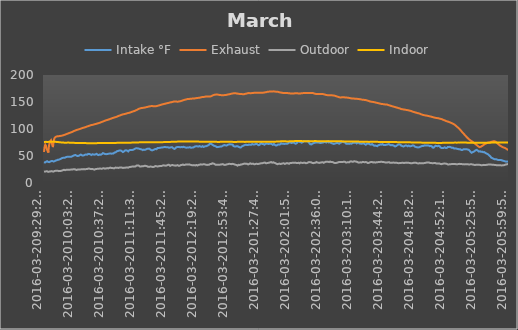
| Category | Intake °F | Exhaust | Outdoor | Indoor |
|---|---|---|---|---|
| 2016-03-209:29:22 AM | 38.638 | 57.538 | 20.862 | 75.988 |
| 2016-03-209:29:26 AM | 38.525 | 58.775 | 20.975 | 75.988 |
| 2016-03-209:29:30 AM | 38.525 | 60.012 | 20.975 | 75.988 |
| 2016-03-209:29:34 AM | 38.412 | 61.138 | 21.088 | 75.988 |
| 2016-03-209:29:38 AM | 38.412 | 62.15 | 21.088 | 76.1 |
| 2016-03-209:29:42 AM | 38.3 | 63.05 | 21.088 | 75.988 |
| 2016-03-209:29:46 AM | 38.188 | 63.95 | 21.2 | 76.1 |
| 2016-03-209:29:50 AM | 38.075 | 64.738 | 21.2 | 76.1 |
| 2016-03-209:29:54 AM | 37.962 | 65.412 | 21.2 | 76.1 |
| 2016-03-209:29:59 AM | 37.85 | 66.088 | 21.312 | 76.1 |
| 2016-03-209:30:03 AM | 37.738 | 66.762 | 21.312 | 76.1 |
| 2016-03-209:30:07 AM | 37.625 | 67.325 | 21.312 | 76.1 |
| 2016-03-209:30:11 AM | 37.625 | 67.888 | 21.425 | 76.1 |
| 2016-03-209:30:15 AM | 37.738 | 68.338 | 21.425 | 76.1 |
| 2016-03-209:30:19 AM | 37.85 | 68.9 | 21.425 | 76.1 |
| 2016-03-209:30:23 AM | 37.962 | 69.35 | 21.425 | 76.1 |
| 2016-03-209:30:27 AM | 37.85 | 69.688 | 21.312 | 76.1 |
| 2016-03-209:30:31 AM | 37.962 | 70.025 | 21.312 | 76.1 |
| 2016-03-209:30:35 AM | 37.962 | 70.362 | 21.312 | 76.212 |
| 2016-03-209:30:40 AM | 38.075 | 70.7 | 21.312 | 76.1 |
| 2016-03-209:30:44 AM | 38.188 | 71.038 | 21.312 | 76.212 |
| 2016-03-209:30:48 AM | 38.188 | 71.375 | 21.312 | 76.212 |
| 2016-03-209:30:52 AM | 38.3 | 71.6 | 21.312 | 76.212 |
| 2016-03-209:30:56 AM | 38.412 | 71.825 | 21.312 | 76.212 |
| 2016-03-209:31:00 AM | 38.525 | 71.938 | 21.425 | 76.212 |
| 2016-03-209:31:04 AM | 38.638 | 71.712 | 21.312 | 76.212 |
| 2016-03-209:31:08 AM | 38.75 | 71.375 | 21.425 | 76.212 |
| 2016-03-209:31:12 AM | 38.862 | 70.925 | 21.425 | 76.212 |
| 2016-03-209:31:16 AM | 38.862 | 70.588 | 21.425 | 76.1 |
| 2016-03-209:31:20 AM | 39.088 | 70.138 | 21.425 | 76.212 |
| 2016-03-209:31:25 AM | 39.2 | 69.8 | 21.425 | 76.212 |
| 2016-03-209:31:29 AM | 39.312 | 69.238 | 21.425 | 76.212 |
| 2016-03-209:31:33 AM | 39.312 | 68.788 | 21.425 | 76.212 |
| 2016-03-209:31:37 AM | 39.538 | 68.338 | 21.538 | 76.1 |
| 2016-03-209:31:41 AM | 39.538 | 67.775 | 21.538 | 76.212 |
| 2016-03-209:31:45 AM | 39.65 | 67.438 | 21.538 | 76.212 |
| 2016-03-209:31:49 AM | 39.762 | 66.988 | 21.538 | 76.1 |
| 2016-03-209:31:53 AM | 39.875 | 66.538 | 21.65 | 76.1 |
| 2016-03-209:31:57 AM | 39.988 | 66.2 | 21.65 | 76.212 |
| 2016-03-209:32:01 AM | 40.1 | 65.862 | 21.65 | 76.212 |
| 2016-03-209:32:06 AM | 40.212 | 65.412 | 21.762 | 76.1 |
| 2016-03-209:32:10 AM | 40.325 | 64.963 | 21.65 | 76.1 |
| 2016-03-209:32:14 AM | 40.325 | 64.512 | 21.65 | 76.1 |
| 2016-03-209:32:18 AM | 40.438 | 64.175 | 21.65 | 76.1 |
| 2016-03-209:32:22 AM | 40.55 | 63.725 | 21.65 | 76.1 |
| 2016-03-209:32:26 AM | 40.55 | 63.388 | 21.538 | 76.1 |
| 2016-03-209:32:30 AM | 40.662 | 63.05 | 21.538 | 76.1 |
| 2016-03-209:32:34 AM | 40.662 | 62.6 | 21.538 | 76.1 |
| 2016-03-209:32:38 AM | 40.55 | 62.262 | 21.425 | 76.1 |
| 2016-03-209:32:42 AM | 40.55 | 61.812 | 21.538 | 76.1 |
| 2016-03-209:32:46 AM | 40.438 | 61.475 | 21.538 | 76.1 |
| 2016-03-209:32:51 AM | 40.325 | 61.25 | 21.538 | 75.988 |
| 2016-03-209:32:55 AM | 40.325 | 60.912 | 21.538 | 76.1 |
| 2016-03-209:32:59 AM | 40.325 | 60.575 | 21.538 | 76.1 |
| 2016-03-209:33:03 AM | 40.325 | 60.35 | 21.425 | 76.1 |
| 2016-03-209:33:07 AM | 40.212 | 60.012 | 21.425 | 76.1 |
| 2016-03-209:33:11 AM | 40.1 | 59.9 | 21.2 | 76.1 |
| 2016-03-209:33:15 AM | 39.988 | 59.562 | 20.975 | 76.212 |
| 2016-03-209:33:19 AM | 39.875 | 59.338 | 20.862 | 76.1 |
| 2016-03-209:33:23 AM | 39.762 | 59.112 | 20.75 | 76.1 |
| 2016-03-209:33:27 AM | 39.762 | 58.775 | 20.638 | 76.212 |
| 2016-03-209:33:32 AM | 39.65 | 58.55 | 20.525 | 76.1 |
| 2016-03-209:33:36 AM | 39.65 | 58.325 | 20.525 | 76.1 |
| 2016-03-209:33:40 AM | 39.538 | 57.988 | 20.525 | 76.1 |
| 2016-03-209:33:44 AM | 39.312 | 57.65 | 20.525 | 76.1 |
| 2016-03-209:33:48 AM | 39.088 | 57.312 | 20.525 | 76.1 |
| 2016-03-209:33:52 AM | 38.975 | 57.088 | 20.638 | 76.212 |
| 2016-03-209:33:56 AM | 38.862 | 56.75 | 20.638 | 76.1 |
| 2016-03-209:34:00 AM | 38.862 | 56.412 | 20.638 | 76.1 |
| 2016-03-209:34:04 AM | 38.75 | 56.188 | 20.75 | 76.1 |
| 2016-03-209:34:08 AM | 38.75 | 56.412 | 20.75 | 76.212 |
| 2016-03-209:34:12 AM | 38.638 | 57.762 | 20.75 | 76.212 |
| 2016-03-209:34:16 AM | 38.638 | 59.225 | 20.862 | 76.212 |
| 2016-03-209:34:20 AM | 38.638 | 60.688 | 20.862 | 76.212 |
| 2016-03-209:34:24 AM | 38.638 | 62.038 | 20.862 | 76.212 |
| 2016-03-209:34:28 AM | 38.75 | 63.275 | 20.862 | 76.212 |
| 2016-03-209:34:32 AM | 38.638 | 64.4 | 20.975 | 76.212 |
| 2016-03-209:34:36 AM | 38.75 | 65.525 | 21.088 | 76.212 |
| 2016-03-209:34:40 AM | 38.638 | 66.538 | 21.088 | 76.325 |
| 2016-03-209:34:44 AM | 38.638 | 67.438 | 21.2 | 76.212 |
| 2016-03-209:34:48 AM | 38.638 | 68.338 | 21.2 | 76.325 |
| 2016-03-209:34:53 AM | 38.638 | 69.125 | 21.2 | 76.325 |
| 2016-03-209:34:57 AM | 38.638 | 69.912 | 21.2 | 76.212 |
| 2016-03-209:35:01 AM | 38.638 | 70.588 | 21.088 | 76.212 |
| 2016-03-209:35:05 AM | 38.638 | 71.262 | 21.088 | 76.212 |
| 2016-03-209:35:09 AM | 38.638 | 71.825 | 21.088 | 76.325 |
| 2016-03-209:35:13 AM | 38.638 | 72.5 | 21.088 | 76.325 |
| 2016-03-209:35:17 AM | 38.75 | 72.95 | 21.088 | 76.325 |
| 2016-03-209:35:21 AM | 38.75 | 73.4 | 21.2 | 76.325 |
| 2016-03-209:35:25 AM | 38.975 | 73.962 | 21.312 | 76.325 |
| 2016-03-209:35:29 AM | 39.088 | 74.3 | 21.312 | 76.325 |
| 2016-03-209:35:33 AM | 39.088 | 74.638 | 21.425 | 76.325 |
| 2016-03-209:35:37 AM | 39.088 | 75.088 | 21.425 | 76.325 |
| 2016-03-209:35:41 AM | 39.2 | 75.425 | 21.312 | 76.325 |
| 2016-03-209:35:45 AM | 39.312 | 75.762 | 21.2 | 76.325 |
| 2016-03-209:35:49 AM | 39.425 | 76.1 | 21.312 | 76.325 |
| 2016-03-209:35:53 AM | 39.538 | 76.325 | 21.312 | 76.325 |
| 2016-03-209:35:57 AM | 39.65 | 76.662 | 21.312 | 76.325 |
| 2016-03-209:36:01 AM | 39.65 | 76.888 | 21.312 | 76.325 |
| 2016-03-209:36:05 AM | 39.762 | 77.112 | 21.425 | 76.438 |
| 2016-03-209:36:09 AM | 39.762 | 77.338 | 21.312 | 76.438 |
| 2016-03-209:36:13 AM | 39.875 | 77.562 | 21.425 | 76.325 |
| 2016-03-209:36:17 AM | 39.875 | 77.788 | 21.425 | 76.438 |
| 2016-03-209:36:21 AM | 39.988 | 77.9 | 21.312 | 76.438 |
| 2016-03-209:36:25 AM | 39.988 | 78.125 | 21.312 | 76.438 |
| 2016-03-209:36:29 AM | 40.1 | 78.238 | 21.425 | 76.438 |
| 2016-03-209:36:33 AM | 40.212 | 78.462 | 21.425 | 76.438 |
| 2016-03-209:36:37 AM | 40.325 | 78.575 | 21.538 | 76.438 |
| 2016-03-209:36:41 AM | 40.438 | 78.688 | 21.538 | 76.438 |
| 2016-03-209:36:49 AM | 40.55 | 78.8 | 21.538 | 76.438 |
| 2016-03-209:36:53 AM | 40.662 | 78.912 | 21.538 | 76.438 |
| 2016-03-209:37:01 AM | 40.662 | 79.138 | 21.65 | 76.55 |
| 2016-03-209:37:05 AM | 40.662 | 79.138 | 21.65 | 76.438 |
| 2016-03-209:37:09 AM | 40.55 | 79.25 | 21.762 | 76.55 |
| 2016-03-209:37:13 AM | 40.55 | 79.138 | 21.762 | 76.55 |
| 2016-03-209:37:17 AM | 40.438 | 78.8 | 21.875 | 76.55 |
| 2016-03-209:37:21 AM | 40.438 | 78.35 | 21.875 | 76.55 |
| 2016-03-209:37:25 AM | 40.438 | 77.9 | 21.875 | 76.55 |
| 2016-03-209:37:29 AM | 40.55 | 77.45 | 21.875 | 76.55 |
| 2016-03-209:37:33 AM | 40.55 | 77 | 21.988 | 76.55 |
| 2016-03-209:37:37 AM | 40.662 | 76.438 | 21.875 | 76.55 |
| 2016-03-209:37:41 AM | 40.55 | 76.1 | 21.875 | 76.55 |
| 2016-03-209:37:45 AM | 40.55 | 75.65 | 21.875 | 76.55 |
| 2016-03-209:37:49 AM | 40.662 | 75.2 | 21.875 | 76.55 |
| 2016-03-209:37:53 AM | 40.775 | 74.75 | 21.988 | 76.55 |
| 2016-03-209:37:57 AM | 40.888 | 74.188 | 21.988 | 76.55 |
| 2016-03-209:38:01 AM | 40.888 | 73.738 | 21.988 | 76.55 |
| 2016-03-209:38:05 AM | 40.888 | 73.175 | 21.988 | 76.55 |
| 2016-03-209:38:09 AM | 40.775 | 72.838 | 22.1 | 76.55 |
| 2016-03-209:38:13 AM | 40.888 | 72.388 | 22.1 | 76.55 |
| 2016-03-209:38:17 AM | 40.888 | 71.938 | 22.1 | 76.55 |
| 2016-03-209:38:21 AM | 40.888 | 71.488 | 21.988 | 76.55 |
| 2016-03-209:38:25 AM | 41 | 71.038 | 21.875 | 76.55 |
| 2016-03-209:38:29 AM | 41 | 70.7 | 21.875 | 76.55 |
| 2016-03-209:38:33 AM | 40.888 | 70.25 | 21.762 | 76.55 |
| 2016-03-209:38:37 AM | 40.775 | 69.8 | 21.65 | 76.55 |
| 2016-03-209:38:41 AM | 40.662 | 69.462 | 21.538 | 76.55 |
| 2016-03-209:38:45 AM | 40.55 | 69.012 | 21.312 | 76.55 |
| 2016-03-209:38:49 AM | 40.438 | 68.562 | 21.088 | 76.55 |
| 2016-03-209:38:53 AM | 40.212 | 68.225 | 20.975 | 76.662 |
| 2016-03-209:38:57 AM | 40.212 | 67.775 | 20.975 | 76.55 |
| 2016-03-209:39:01 AM | 40.1 | 67.438 | 21.088 | 76.662 |
| 2016-03-209:39:05 AM | 39.988 | 67.1 | 20.975 | 76.55 |
| 2016-03-209:39:09 AM | 39.988 | 66.875 | 20.975 | 76.662 |
| 2016-03-209:39:14 AM | 39.988 | 66.538 | 20.862 | 76.662 |
| 2016-03-209:39:18 AM | 39.988 | 66.425 | 20.975 | 76.662 |
| 2016-03-209:39:22 AM | 39.988 | 67.55 | 20.975 | 76.55 |
| 2016-03-209:39:26 AM | 39.988 | 68.788 | 20.975 | 76.55 |
| 2016-03-209:39:30 AM | 39.988 | 70.025 | 21.088 | 76.662 |
| 2016-03-209:39:34 AM | 39.875 | 71.15 | 21.088 | 76.662 |
| 2016-03-209:39:38 AM | 39.875 | 72.275 | 21.088 | 76.662 |
| 2016-03-209:39:42 AM | 39.875 | 73.288 | 21.088 | 76.662 |
| 2016-03-209:39:46 AM | 39.875 | 74.188 | 21.088 | 76.662 |
| 2016-03-209:39:50 AM | 39.875 | 75.088 | 21.088 | 76.662 |
| 2016-03-209:39:54 AM | 39.762 | 75.875 | 21.2 | 76.662 |
| 2016-03-209:39:58 AM | 39.65 | 76.55 | 21.312 | 76.662 |
| 2016-03-209:40:02 AM | 39.762 | 77.225 | 21.312 | 76.662 |
| 2016-03-209:40:06 AM | 39.762 | 77.9 | 21.425 | 76.662 |
| 2016-03-209:40:10 AM | 39.762 | 78.462 | 21.425 | 76.55 |
| 2016-03-209:40:14 AM | 39.65 | 79.138 | 21.538 | 76.55 |
| 2016-03-209:40:18 AM | 39.762 | 79.588 | 21.538 | 76.55 |
| 2016-03-209:40:22 AM | 39.762 | 80.15 | 21.538 | 76.55 |
| 2016-03-209:40:26 AM | 39.762 | 80.488 | 21.65 | 76.55 |
| 2016-03-209:40:30 AM | 39.875 | 80.938 | 21.762 | 76.55 |
| 2016-03-209:40:34 AM | 39.988 | 81.388 | 21.875 | 76.55 |
| 2016-03-209:40:41 AM | 40.1 | 81.725 | 21.875 | 76.55 |
| 2016-03-209:40:45 AM | 40.1 | 82.062 | 21.988 | 76.55 |
| 2016-03-209:40:50 AM | 40.1 | 82.288 | 21.988 | 76.55 |
| 2016-03-209:40:54 AM | 40.1 | 82.512 | 22.1 | 76.55 |
| 2016-03-209:40:58 AM | 40.1 | 82.85 | 22.212 | 76.438 |
| 2016-03-209:41:02 AM | 40.212 | 83.075 | 22.212 | 76.438 |
| 2016-03-209:41:06 AM | 40.325 | 83.3 | 22.212 | 76.438 |
| 2016-03-209:41:10 AM | 40.438 | 83.525 | 22.325 | 76.438 |
| 2016-03-209:41:14 AM | 40.55 | 83.638 | 22.325 | 76.438 |
| 2016-03-209:41:18 AM | 40.662 | 83.862 | 22.325 | 76.438 |
| 2016-03-209:41:22 AM | 40.775 | 83.975 | 22.438 | 76.438 |
| 2016-03-209:41:26 AM | 40.775 | 84.2 | 22.438 | 76.438 |
| 2016-03-209:41:30 AM | 40.888 | 84.312 | 22.55 | 76.438 |
| 2016-03-209:41:34 AM | 41 | 84.425 | 22.55 | 76.325 |
| 2016-03-209:41:38 AM | 41.112 | 84.538 | 22.55 | 76.325 |
| 2016-03-209:41:42 AM | 41.225 | 84.762 | 22.55 | 76.325 |
| 2016-03-209:41:46 AM | 41.338 | 84.875 | 22.55 | 76.325 |
| 2016-03-209:41:50 AM | 41.45 | 84.988 | 22.55 | 76.325 |
| 2016-03-209:41:54 AM | 41.562 | 84.988 | 22.55 | 76.325 |
| 2016-03-209:41:58 AM | 41.562 | 85.1 | 22.55 | 76.325 |
| 2016-03-209:42:02 AM | 41.45 | 85.212 | 22.55 | 76.212 |
| 2016-03-209:42:06 AM | 41.562 | 85.325 | 22.55 | 76.212 |
| 2016-03-209:42:10 AM | 41.562 | 85.325 | 22.55 | 76.212 |
| 2016-03-209:42:14 AM | 41.562 | 85.438 | 22.55 | 76.212 |
| 2016-03-209:42:18 AM | 41.562 | 85.55 | 22.55 | 76.212 |
| 2016-03-209:42:22 AM | 41.675 | 85.55 | 22.55 | 76.212 |
| 2016-03-209:42:26 AM | 41.675 | 85.662 | 22.55 | 76.212 |
| 2016-03-209:42:30 AM | 41.788 | 85.662 | 22.55 | 76.212 |
| 2016-03-209:42:34 AM | 41.9 | 85.775 | 22.662 | 76.212 |
| 2016-03-209:42:38 AM | 41.9 | 85.775 | 22.662 | 76.212 |
| 2016-03-209:42:42 AM | 42.012 | 85.888 | 22.662 | 76.212 |
| 2016-03-209:42:46 AM | 41.9 | 85.888 | 22.662 | 76.212 |
| 2016-03-209:42:50 AM | 42.012 | 86 | 22.55 | 76.212 |
| 2016-03-209:42:54 AM | 42.012 | 86 | 22.55 | 76.212 |
| 2016-03-209:42:58 AM | 42.012 | 86.112 | 22.55 | 76.212 |
| 2016-03-209:43:02 AM | 42.012 | 86.112 | 22.55 | 76.212 |
| 2016-03-209:43:07 AM | 42.012 | 86.112 | 22.55 | 76.212 |
| 2016-03-209:43:11 AM | 42.125 | 86.112 | 22.55 | 76.1 |
| 2016-03-209:43:15 AM | 42.125 | 86.225 | 22.55 | 76.212 |
| 2016-03-209:43:19 AM | 42.012 | 86.225 | 22.55 | 76.1 |
| 2016-03-209:43:23 AM | 42.125 | 86.225 | 22.55 | 76.1 |
| 2016-03-209:43:27 AM | 42.238 | 86.225 | 22.55 | 76.1 |
| 2016-03-209:43:31 AM | 42.35 | 86.338 | 22.438 | 76.1 |
| 2016-03-209:43:35 AM | 42.35 | 86.338 | 22.438 | 76.1 |
| 2016-03-209:43:39 AM | 42.462 | 86.338 | 22.438 | 75.988 |
| 2016-03-209:43:43 AM | 42.462 | 86.338 | 22.438 | 75.988 |
| 2016-03-209:43:47 AM | 42.462 | 86.45 | 22.55 | 75.988 |
| 2016-03-209:43:51 AM | 42.462 | 86.45 | 22.55 | 75.988 |
| 2016-03-209:43:55 AM | 42.462 | 86.45 | 22.55 | 75.875 |
| 2016-03-209:43:59 AM | 42.575 | 86.45 | 22.55 | 75.988 |
| 2016-03-209:44:03 AM | 42.575 | 86.45 | 22.662 | 75.988 |
| 2016-03-209:44:07 AM | 42.688 | 86.45 | 22.662 | 75.988 |
| 2016-03-209:44:11 AM | 42.688 | 86.45 | 22.662 | 75.988 |
| 2016-03-209:44:15 AM | 42.912 | 86.562 | 22.662 | 75.988 |
| 2016-03-209:44:19 AM | 43.025 | 86.562 | 22.775 | 75.875 |
| 2016-03-209:44:23 AM | 43.025 | 86.562 | 22.662 | 75.875 |
| 2016-03-209:44:27 AM | 43.025 | 86.562 | 22.775 | 75.875 |
| 2016-03-209:44:31 AM | 43.025 | 86.562 | 22.662 | 75.875 |
| 2016-03-209:44:38 AM | 43.025 | 86.562 | 22.662 | 75.875 |
| 2016-03-209:44:42 AM | 43.025 | 86.562 | 22.662 | 75.875 |
| 2016-03-209:44:47 AM | 43.025 | 86.675 | 22.55 | 75.875 |
| 2016-03-209:44:51 AM | 43.025 | 86.675 | 22.438 | 75.875 |
| 2016-03-209:44:55 AM | 43.138 | 86.675 | 22.55 | 75.875 |
| 2016-03-209:44:59 AM | 43.138 | 86.675 | 22.55 | 75.762 |
| 2016-03-209:45:03 AM | 43.25 | 86.675 | 22.662 | 75.875 |
| 2016-03-209:45:07 AM | 43.25 | 86.675 | 22.55 | 75.762 |
| 2016-03-209:45:11 AM | 43.25 | 86.675 | 22.55 | 75.762 |
| 2016-03-209:45:15 AM | 43.25 | 86.675 | 22.438 | 75.762 |
| 2016-03-209:45:19 AM | 43.25 | 86.675 | 22.438 | 75.762 |
| 2016-03-209:45:23 AM | 43.25 | 86.675 | 22.212 | 75.762 |
| 2016-03-209:45:27 AM | 43.25 | 86.675 | 22.1 | 75.762 |
| 2016-03-209:45:31 AM | 43.25 | 86.675 | 22.1 | 75.762 |
| 2016-03-209:45:35 AM | 43.25 | 86.788 | 21.988 | 75.762 |
| 2016-03-209:45:39 AM | 43.25 | 86.788 | 21.988 | 75.65 |
| 2016-03-209:45:43 AM | 43.25 | 86.788 | 21.988 | 75.65 |
| 2016-03-209:45:47 AM | 43.362 | 86.788 | 21.875 | 75.65 |
| 2016-03-209:45:51 AM | 43.25 | 86.788 | 21.875 | 75.65 |
| 2016-03-209:45:55 AM | 43.25 | 86.788 | 21.988 | 75.65 |
| 2016-03-209:45:59 AM | 43.25 | 86.788 | 21.875 | 75.65 |
| 2016-03-209:46:03 AM | 43.362 | 86.788 | 21.988 | 75.538 |
| 2016-03-209:46:07 AM | 43.362 | 86.788 | 21.988 | 75.65 |
| 2016-03-209:46:11 AM | 43.362 | 86.9 | 21.988 | 75.538 |
| 2016-03-209:46:15 AM | 43.362 | 86.9 | 21.988 | 75.538 |
| 2016-03-209:46:19 AM | 43.362 | 86.9 | 21.988 | 75.538 |
| 2016-03-209:46:23 AM | 43.588 | 86.9 | 21.988 | 75.538 |
| 2016-03-209:46:27 AM | 43.588 | 86.9 | 21.988 | 75.538 |
| 2016-03-209:46:31 AM | 43.7 | 86.9 | 21.988 | 75.538 |
| 2016-03-209:46:35 AM | 43.7 | 87.012 | 22.1 | 75.538 |
| 2016-03-209:46:39 AM | 43.812 | 87.012 | 22.1 | 75.538 |
| 2016-03-209:46:43 AM | 43.812 | 87.012 | 22.212 | 75.538 |
| 2016-03-209:46:47 AM | 43.925 | 87.012 | 22.212 | 75.425 |
| 2016-03-209:46:51 AM | 44.038 | 87.012 | 22.325 | 75.425 |
| 2016-03-209:46:55 AM | 44.15 | 87.012 | 22.438 | 75.425 |
| 2016-03-209:46:59 AM | 44.15 | 87.012 | 22.55 | 75.425 |
| 2016-03-209:47:03 AM | 44.15 | 87.125 | 22.662 | 75.425 |
| 2016-03-209:47:07 AM | 44.15 | 87.125 | 22.775 | 75.312 |
| 2016-03-209:47:11 AM | 44.15 | 87.125 | 22.662 | 75.425 |
| 2016-03-209:47:15 AM | 44.262 | 87.125 | 22.662 | 75.312 |
| 2016-03-209:47:20 AM | 44.262 | 87.125 | 22.662 | 75.312 |
| 2016-03-209:47:24 AM | 44.375 | 87.125 | 22.662 | 75.312 |
| 2016-03-209:47:28 AM | 44.488 | 87.238 | 22.662 | 75.312 |
| 2016-03-209:47:32 AM | 44.488 | 87.238 | 22.662 | 75.312 |
| 2016-03-209:47:36 AM | 44.6 | 87.238 | 22.55 | 75.312 |
| 2016-03-209:47:39 AM | 44.712 | 87.238 | 22.662 | 75.2 |
| 2016-03-209:47:43 AM | 44.712 | 87.238 | 22.55 | 75.312 |
| 2016-03-209:47:48 AM | 44.712 | 87.238 | 22.438 | 75.312 |
| 2016-03-209:47:52 AM | 44.712 | 87.35 | 22.438 | 75.2 |
| 2016-03-209:47:56 AM | 44.825 | 87.35 | 22.438 | 75.2 |
| 2016-03-209:48:00 AM | 44.938 | 87.35 | 22.55 | 75.2 |
| 2016-03-209:48:04 AM | 45.05 | 87.35 | 22.55 | 75.2 |
| 2016-03-209:48:08 AM | 45.275 | 87.462 | 22.55 | 75.2 |
| 2016-03-209:48:12 AM | 45.388 | 87.462 | 22.55 | 75.2 |
| 2016-03-209:48:16 AM | 45.388 | 87.462 | 22.662 | 75.2 |
| 2016-03-209:48:20 AM | 45.388 | 87.462 | 22.662 | 75.2 |
| 2016-03-209:48:24 AM | 45.612 | 87.462 | 22.662 | 75.2 |
| 2016-03-209:48:28 AM | 45.725 | 87.575 | 22.775 | 75.088 |
| 2016-03-209:48:32 AM | 45.725 | 87.575 | 22.888 | 75.088 |
| 2016-03-209:48:36 AM | 45.725 | 87.575 | 22.888 | 75.088 |
| 2016-03-209:48:40 AM | 45.838 | 87.575 | 22.775 | 75.088 |
| 2016-03-209:48:44 AM | 45.95 | 87.575 | 22.888 | 75.088 |
| 2016-03-209:48:48 AM | 45.95 | 87.688 | 22.888 | 75.088 |
| 2016-03-209:48:51 AM | 46.062 | 87.688 | 22.775 | 75.088 |
| 2016-03-209:48:55 AM | 46.062 | 87.688 | 22.775 | 75.088 |
| 2016-03-209:48:59 AM | 46.175 | 87.688 | 22.775 | 75.088 |
| 2016-03-209:49:04 AM | 46.062 | 87.8 | 22.888 | 75.088 |
| 2016-03-209:49:08 AM | 46.062 | 87.8 | 22.888 | 75.088 |
| 2016-03-209:49:12 AM | 46.175 | 87.8 | 22.888 | 74.975 |
| 2016-03-209:49:16 AM | 46.175 | 87.8 | 23 | 74.975 |
| 2016-03-209:49:20 AM | 46.175 | 87.8 | 23.112 | 74.975 |
| 2016-03-209:49:27 AM | 46.175 | 87.8 | 23.225 | 74.975 |
| 2016-03-209:49:31 AM | 46.062 | 87.912 | 23.225 | 74.975 |
| 2016-03-209:49:36 AM | 46.062 | 87.912 | 23.338 | 74.862 |
| 2016-03-209:49:40 AM | 46.062 | 87.912 | 23.338 | 74.975 |
| 2016-03-209:49:44 AM | 46.175 | 87.912 | 23.45 | 74.862 |
| 2016-03-209:49:48 AM | 46.288 | 88.025 | 23.45 | 74.862 |
| 2016-03-209:49:52 AM | 46.4 | 88.025 | 23.338 | 74.862 |
| 2016-03-209:49:56 AM | 46.512 | 88.025 | 23.45 | 74.862 |
| 2016-03-209:50:00 AM | 46.625 | 88.138 | 23.45 | 74.862 |
| 2016-03-209:50:04 AM | 46.738 | 88.138 | 23.45 | 74.862 |
| 2016-03-209:50:08 AM | 46.738 | 88.138 | 23.562 | 74.862 |
| 2016-03-209:50:12 AM | 46.625 | 88.138 | 23.562 | 74.862 |
| 2016-03-209:50:16 AM | 46.625 | 88.25 | 23.675 | 74.862 |
| 2016-03-209:50:20 AM | 46.625 | 88.25 | 23.675 | 74.862 |
| 2016-03-209:50:24 AM | 46.625 | 88.25 | 23.788 | 74.862 |
| 2016-03-209:50:28 AM | 46.625 | 88.25 | 23.788 | 74.862 |
| 2016-03-209:50:32 AM | 46.625 | 88.362 | 23.9 | 74.862 |
| 2016-03-209:50:36 AM | 46.625 | 88.362 | 24.012 | 74.862 |
| 2016-03-209:50:40 AM | 46.512 | 88.475 | 24.012 | 74.862 |
| 2016-03-209:50:44 AM | 46.512 | 88.475 | 24.125 | 74.75 |
| 2016-03-209:50:48 AM | 46.512 | 88.475 | 24.125 | 74.75 |
| 2016-03-209:50:52 AM | 46.512 | 88.588 | 24.238 | 74.75 |
| 2016-03-209:50:56 AM | 46.512 | 88.588 | 24.35 | 74.75 |
| 2016-03-209:51:00 AM | 46.625 | 88.588 | 24.35 | 74.75 |
| 2016-03-209:51:04 AM | 46.738 | 88.7 | 24.35 | 74.75 |
| 2016-03-209:51:08 AM | 46.85 | 88.7 | 24.35 | 74.75 |
| 2016-03-209:51:12 AM | 46.85 | 88.812 | 24.238 | 74.75 |
| 2016-03-209:51:16 AM | 46.962 | 88.812 | 24.35 | 74.75 |
| 2016-03-209:51:20 AM | 47.075 | 88.925 | 24.35 | 74.75 |
| 2016-03-209:51:24 AM | 46.962 | 88.925 | 24.462 | 74.75 |
| 2016-03-209:51:27 AM | 47.075 | 88.925 | 24.575 | 74.75 |
| 2016-03-209:51:31 AM | 46.962 | 88.925 | 24.575 | 74.75 |
| 2016-03-209:51:36 AM | 46.962 | 89.038 | 24.462 | 74.75 |
| 2016-03-209:51:40 AM | 46.738 | 89.038 | 24.462 | 74.75 |
| 2016-03-209:51:44 AM | 46.738 | 89.038 | 24.35 | 74.75 |
| 2016-03-209:51:48 AM | 46.738 | 89.038 | 24.35 | 74.75 |
| 2016-03-209:51:52 AM | 46.738 | 89.15 | 24.238 | 74.75 |
| 2016-03-209:51:56 AM | 46.512 | 89.15 | 24.238 | 74.75 |
| 2016-03-209:52:00 AM | 46.625 | 89.262 | 24.238 | 74.75 |
| 2016-03-209:52:04 AM | 46.85 | 89.262 | 24.125 | 74.75 |
| 2016-03-209:52:08 AM | 46.85 | 89.262 | 24.125 | 74.75 |
| 2016-03-209:52:12 AM | 46.962 | 89.375 | 24.012 | 74.75 |
| 2016-03-209:52:16 AM | 46.962 | 89.375 | 24.012 | 74.75 |
| 2016-03-209:52:20 AM | 46.962 | 89.488 | 23.9 | 74.75 |
| 2016-03-209:52:24 AM | 46.962 | 89.488 | 23.9 | 74.75 |
| 2016-03-209:52:28 AM | 46.962 | 89.488 | 23.788 | 74.75 |
| 2016-03-209:52:32 AM | 46.962 | 89.488 | 23.675 | 74.75 |
| 2016-03-209:52:36 AM | 47.075 | 89.488 | 23.788 | 74.75 |
| 2016-03-209:52:40 AM | 47.075 | 89.6 | 23.788 | 74.75 |
| 2016-03-209:52:44 AM | 47.188 | 89.6 | 23.788 | 74.75 |
| 2016-03-209:52:48 AM | 47.3 | 89.712 | 23.788 | 74.75 |
| 2016-03-209:52:52 AM | 47.412 | 89.712 | 23.9 | 74.75 |
| 2016-03-209:52:56 AM | 47.525 | 89.825 | 23.9 | 74.75 |
| 2016-03-209:53:00 AM | 47.638 | 89.825 | 23.9 | 74.75 |
| 2016-03-209:53:04 AM | 47.638 | 89.825 | 24.012 | 74.75 |
| 2016-03-209:53:08 AM | 47.75 | 89.938 | 24.012 | 74.75 |
| 2016-03-209:53:12 AM | 47.75 | 89.938 | 24.012 | 74.75 |
| 2016-03-209:53:16 AM | 47.862 | 90.05 | 24.125 | 74.75 |
| 2016-03-209:53:20 AM | 47.862 | 90.05 | 24.125 | 74.75 |
| 2016-03-209:53:24 AM | 47.975 | 90.05 | 24.125 | 74.75 |
| 2016-03-209:53:28 AM | 47.975 | 90.163 | 24.125 | 74.75 |
| 2016-03-209:53:32 AM | 47.975 | 90.163 | 24.125 | 74.75 |
| 2016-03-209:53:36 AM | 47.975 | 90.163 | 24.238 | 74.75 |
| 2016-03-209:53:40 AM | 47.975 | 90.163 | 24.35 | 74.75 |
| 2016-03-209:53:44 AM | 47.975 | 90.275 | 24.35 | 74.75 |
| 2016-03-209:53:48 AM | 48.088 | 90.275 | 24.35 | 74.75 |
| 2016-03-209:53:52 AM | 48.088 | 90.275 | 24.35 | 74.75 |
| 2016-03-209:53:57 AM | 48.2 | 90.388 | 24.462 | 74.75 |
| 2016-03-209:54:01 AM | 48.2 | 90.5 | 24.462 | 74.75 |
| 2016-03-209:54:05 AM | 48.2 | 90.5 | 24.462 | 74.75 |
| 2016-03-209:54:09 AM | 48.2 | 90.612 | 24.462 | 74.75 |
| 2016-03-209:54:13 AM | 48.2 | 90.612 | 24.575 | 74.75 |
| 2016-03-209:54:17 AM | 48.2 | 90.612 | 24.575 | 74.75 |
| 2016-03-209:54:21 AM | 48.2 | 90.612 | 24.575 | 74.75 |
| 2016-03-209:54:25 AM | 48.2 | 90.725 | 24.575 | 74.75 |
| 2016-03-209:54:29 AM | 48.2 | 90.838 | 24.575 | 74.75 |
| 2016-03-209:54:33 AM | 48.312 | 90.838 | 24.462 | 74.75 |
| 2016-03-209:54:37 AM | 48.312 | 90.838 | 24.575 | 74.75 |
| 2016-03-209:54:41 AM | 48.312 | 90.95 | 24.462 | 74.75 |
| 2016-03-209:54:45 AM | 48.538 | 90.95 | 24.35 | 74.75 |
| 2016-03-209:54:49 AM | 48.538 | 90.95 | 24.35 | 74.75 |
| 2016-03-209:54:53 AM | 48.538 | 91.062 | 24.35 | 74.75 |
| 2016-03-209:54:57 AM | 48.65 | 91.062 | 24.35 | 74.862 |
| 2016-03-209:55:00 AM | 48.65 | 91.175 | 24.35 | 74.862 |
| 2016-03-209:55:04 AM | 48.538 | 91.175 | 24.462 | 74.75 |
| 2016-03-209:55:08 AM | 48.65 | 91.288 | 24.462 | 74.75 |
| 2016-03-209:55:13 AM | 48.65 | 91.288 | 24.462 | 74.75 |
| 2016-03-209:55:17 AM | 48.762 | 91.288 | 24.462 | 74.75 |
| 2016-03-209:55:21 AM | 48.762 | 91.4 | 24.575 | 74.75 |
| 2016-03-209:55:25 AM | 48.875 | 91.4 | 24.575 | 74.862 |
| 2016-03-209:55:29 AM | 48.875 | 91.512 | 24.462 | 74.75 |
| 2016-03-209:55:33 AM | 48.875 | 91.512 | 24.462 | 74.862 |
| 2016-03-209:55:37 AM | 48.875 | 91.625 | 24.462 | 74.862 |
| 2016-03-209:55:41 AM | 48.875 | 91.625 | 24.462 | 74.75 |
| 2016-03-209:55:45 AM | 48.762 | 91.625 | 24.462 | 74.862 |
| 2016-03-209:55:49 AM | 48.762 | 91.738 | 24.462 | 74.862 |
| 2016-03-209:55:53 AM | 48.762 | 91.85 | 24.462 | 74.862 |
| 2016-03-209:55:57 AM | 48.65 | 91.85 | 24.35 | 74.862 |
| 2016-03-209:56:01 AM | 48.538 | 91.85 | 24.238 | 74.862 |
| 2016-03-209:56:05 AM | 48.425 | 91.962 | 24.125 | 74.862 |
| 2016-03-209:56:09 AM | 48.538 | 91.962 | 24.012 | 74.75 |
| 2016-03-209:56:13 AM | 48.538 | 92.075 | 23.9 | 74.862 |
| 2016-03-209:56:17 AM | 48.538 | 92.075 | 23.9 | 74.75 |
| 2016-03-209:56:21 AM | 48.538 | 92.075 | 23.9 | 74.75 |
| 2016-03-209:56:25 AM | 48.65 | 92.188 | 23.9 | 74.75 |
| 2016-03-209:56:29 AM | 48.65 | 92.188 | 23.9 | 74.75 |
| 2016-03-209:56:33 AM | 48.538 | 92.3 | 23.9 | 74.75 |
| 2016-03-209:56:37 AM | 48.538 | 92.3 | 24.012 | 74.75 |
| 2016-03-209:56:41 AM | 48.538 | 92.3 | 24.125 | 74.75 |
| 2016-03-209:56:45 AM | 48.65 | 92.413 | 24.238 | 74.75 |
| 2016-03-209:56:49 AM | 48.65 | 92.413 | 24.238 | 74.75 |
| 2016-03-209:56:53 AM | 48.65 | 92.413 | 24.35 | 74.75 |
| 2016-03-209:56:57 AM | 48.65 | 92.525 | 24.35 | 74.75 |
| 2016-03-209:57:01 AM | 48.65 | 92.525 | 24.35 | 74.75 |
| 2016-03-209:57:05 AM | 48.762 | 92.525 | 24.35 | 74.75 |
| 2016-03-209:57:09 AM | 48.762 | 92.638 | 24.35 | 74.75 |
| 2016-03-209:57:13 AM | 48.875 | 92.638 | 24.462 | 74.75 |
| 2016-03-209:57:17 AM | 48.875 | 92.75 | 24.462 | 74.638 |
| 2016-03-209:57:21 AM | 48.875 | 92.75 | 24.575 | 74.638 |
| 2016-03-209:57:25 AM | 48.875 | 92.75 | 24.575 | 74.638 |
| 2016-03-209:57:30 AM | 48.762 | 92.75 | 24.462 | 74.638 |
| 2016-03-209:57:34 AM | 48.762 | 92.75 | 24.575 | 74.638 |
| 2016-03-209:57:38 AM | 48.65 | 92.862 | 24.575 | 74.638 |
| 2016-03-209:57:42 AM | 48.65 | 92.862 | 24.575 | 74.638 |
| 2016-03-209:57:46 AM | 48.65 | 92.862 | 24.688 | 74.638 |
| 2016-03-209:57:50 AM | 48.65 | 92.975 | 24.575 | 74.638 |
| 2016-03-209:57:54 AM | 48.538 | 92.975 | 24.688 | 74.638 |
| 2016-03-209:57:58 AM | 48.425 | 93.088 | 24.8 | 74.638 |
| 2016-03-209:58:02 AM | 48.538 | 93.088 | 24.8 | 74.638 |
| 2016-03-209:58:06 AM | 48.538 | 93.088 | 24.8 | 74.638 |
| 2016-03-209:58:10 AM | 48.538 | 93.2 | 24.8 | 74.525 |
| 2016-03-209:58:14 AM | 48.538 | 93.2 | 24.688 | 74.525 |
| 2016-03-209:58:18 AM | 48.65 | 93.312 | 24.8 | 74.525 |
| 2016-03-209:58:22 AM | 48.65 | 93.312 | 24.8 | 74.525 |
| 2016-03-209:58:26 AM | 48.762 | 93.312 | 24.8 | 74.525 |
| 2016-03-209:58:30 AM | 48.762 | 93.425 | 24.912 | 74.638 |
| 2016-03-209:58:34 AM | 48.65 | 93.425 | 24.912 | 74.525 |
| 2016-03-209:58:38 AM | 48.65 | 93.538 | 25.025 | 74.525 |
| 2016-03-209:58:42 AM | 48.762 | 93.538 | 25.025 | 74.525 |
| 2016-03-209:58:46 AM | 48.762 | 93.538 | 25.138 | 74.525 |
| 2016-03-209:58:50 AM | 48.988 | 93.65 | 25.138 | 74.525 |
| 2016-03-209:58:54 AM | 48.875 | 93.65 | 25.138 | 74.525 |
| 2016-03-209:58:58 AM | 48.875 | 93.762 | 25.138 | 74.525 |
| 2016-03-209:59:06 AM | 48.762 | 93.762 | 25.25 | 74.525 |
| 2016-03-209:59:10 AM | 48.65 | 93.762 | 25.138 | 74.525 |
| 2016-03-209:59:14 AM | 48.65 | 93.875 | 25.138 | 74.525 |
| 2016-03-209:59:18 AM | 48.65 | 93.875 | 25.138 | 74.412 |
| 2016-03-209:59:22 AM | 48.65 | 93.988 | 25.138 | 74.525 |
| 2016-03-209:59:26 AM | 48.65 | 93.988 | 25.138 | 74.525 |
| 2016-03-209:59:30 AM | 48.65 | 93.988 | 25.138 | 74.525 |
| 2016-03-209:59:34 AM | 48.762 | 94.1 | 25.025 | 74.525 |
| 2016-03-209:59:38 AM | 48.762 | 94.1 | 24.912 | 74.525 |
| 2016-03-209:59:43 AM | 48.762 | 94.212 | 25.025 | 74.525 |
| 2016-03-209:59:47 AM | 48.762 | 94.212 | 24.912 | 74.525 |
| 2016-03-209:59:51 AM | 48.762 | 94.325 | 24.912 | 74.525 |
| 2016-03-209:59:55 AM | 48.875 | 94.325 | 24.912 | 74.525 |
| 2016-03-209:59:59 AM | 48.875 | 94.325 | 25.025 | 74.525 |
| 2016-03-2010:00:03 AM | 49.1 | 94.438 | 24.912 | 74.525 |
| 2016-03-2010:00:07 AM | 49.212 | 94.438 | 24.912 | 74.525 |
| 2016-03-2010:00:11 AM | 49.325 | 94.55 | 24.912 | 74.525 |
| 2016-03-2010:00:15 AM | 49.325 | 94.55 | 24.912 | 74.525 |
| 2016-03-2010:00:19 AM | 49.438 | 94.663 | 24.8 | 74.525 |
| 2016-03-2010:00:23 AM | 49.55 | 94.663 | 24.912 | 74.525 |
| 2016-03-2010:00:27 AM | 49.775 | 94.663 | 24.8 | 74.412 |
| 2016-03-2010:00:31 AM | 49.775 | 94.775 | 24.912 | 74.412 |
| 2016-03-2010:00:35 AM | 49.662 | 94.775 | 24.912 | 74.412 |
| 2016-03-2010:00:39 AM | 49.55 | 94.775 | 24.912 | 74.412 |
| 2016-03-2010:00:43 AM | 49.55 | 94.888 | 25.025 | 74.412 |
| 2016-03-2010:00:47 AM | 49.438 | 94.888 | 25.025 | 74.412 |
| 2016-03-2010:00:51 AM | 49.55 | 95 | 25.025 | 74.412 |
| 2016-03-2010:00:55 AM | 49.55 | 95.112 | 25.138 | 74.412 |
| 2016-03-2010:00:59 AM | 49.55 | 95.112 | 25.138 | 74.412 |
| 2016-03-2010:01:03 AM | 49.662 | 95.112 | 25.25 | 74.412 |
| 2016-03-2010:01:07 AM | 49.775 | 95.225 | 25.25 | 74.412 |
| 2016-03-2010:01:11 AM | 49.775 | 95.225 | 25.25 | 74.412 |
| 2016-03-2010:01:15 AM | 49.888 | 95.338 | 25.362 | 74.412 |
| 2016-03-2010:01:19 AM | 49.888 | 95.338 | 25.362 | 74.412 |
| 2016-03-2010:01:24 AM | 50 | 95.45 | 25.475 | 74.412 |
| 2016-03-2010:01:28 AM | 50.225 | 95.45 | 25.475 | 74.412 |
| 2016-03-2010:01:32 AM | 50.225 | 95.562 | 25.588 | 74.412 |
| 2016-03-2010:01:36 AM | 50.338 | 95.562 | 25.588 | 74.412 |
| 2016-03-2010:01:40 AM | 50.45 | 95.675 | 25.588 | 74.412 |
| 2016-03-2010:01:44 AM | 50.562 | 95.675 | 25.588 | 74.412 |
| 2016-03-2010:01:48 AM | 50.562 | 95.788 | 25.588 | 74.412 |
| 2016-03-2010:01:52 AM | 50.562 | 95.788 | 25.588 | 74.412 |
| 2016-03-2010:01:56 AM | 50.675 | 95.9 | 25.7 | 74.412 |
| 2016-03-2010:02:00 AM | 50.675 | 95.9 | 25.7 | 74.412 |
| 2016-03-2010:02:04 AM | 50.675 | 96.012 | 25.7 | 74.412 |
| 2016-03-2010:02:08 AM | 50.562 | 96.012 | 25.812 | 74.412 |
| 2016-03-2010:02:12 AM | 50.788 | 96.125 | 25.812 | 74.412 |
| 2016-03-2010:02:16 AM | 50.788 | 96.125 | 25.812 | 74.412 |
| 2016-03-2010:02:20 AM | 51.012 | 96.238 | 25.7 | 74.412 |
| 2016-03-2010:02:25 AM | 51.125 | 96.238 | 25.588 | 74.412 |
| 2016-03-2010:02:29 AM | 51.238 | 96.35 | 25.475 | 74.3 |
| 2016-03-2010:02:33 AM | 51.462 | 96.35 | 25.475 | 74.412 |
| 2016-03-2010:02:37 AM | 51.575 | 96.462 | 25.475 | 74.3 |
| 2016-03-2010:02:41 AM | 51.688 | 96.462 | 25.475 | 74.3 |
| 2016-03-2010:02:45 AM | 51.688 | 96.575 | 25.475 | 74.3 |
| 2016-03-2010:02:49 AM | 51.575 | 96.575 | 25.475 | 74.3 |
| 2016-03-2010:02:53 AM | 51.575 | 96.575 | 25.475 | 74.3 |
| 2016-03-2010:02:57 AM | 51.462 | 96.688 | 25.362 | 74.3 |
| 2016-03-2010:03:01 AM | 51.462 | 96.688 | 25.362 | 74.3 |
| 2016-03-2010:03:05 AM | 51.575 | 96.8 | 25.362 | 74.3 |
| 2016-03-2010:03:09 AM | 51.688 | 96.8 | 25.362 | 74.3 |
| 2016-03-2010:03:13 AM | 51.688 | 96.913 | 25.362 | 74.3 |
| 2016-03-2010:03:17 AM | 51.575 | 97.025 | 25.362 | 74.3 |
| 2016-03-2010:03:21 AM | 51.575 | 97.025 | 25.475 | 74.3 |
| 2016-03-2010:03:25 AM | 51.688 | 97.025 | 25.362 | 74.3 |
| 2016-03-2010:03:28 AM | 51.575 | 97.138 | 25.25 | 74.3 |
| 2016-03-2010:03:32 AM | 51.575 | 97.138 | 25.025 | 74.3 |
| 2016-03-2010:03:36 AM | 51.575 | 97.138 | 25.025 | 74.3 |
| 2016-03-2010:03:41 AM | 51.688 | 97.25 | 24.912 | 74.3 |
| 2016-03-2010:03:49 AM | 51.688 | 97.25 | 24.912 | 74.3 |
| 2016-03-2010:03:53 AM | 51.688 | 97.362 | 25.025 | 74.3 |
| 2016-03-2010:03:57 AM | 51.688 | 97.362 | 25.025 | 74.3 |
| 2016-03-2010:04:01 AM | 51.575 | 97.475 | 25.025 | 74.3 |
| 2016-03-2010:04:05 AM | 51.688 | 97.475 | 24.912 | 74.3 |
| 2016-03-2010:04:09 AM | 51.8 | 97.588 | 24.8 | 74.3 |
| 2016-03-2010:04:13 AM | 51.688 | 97.588 | 24.688 | 74.3 |
| 2016-03-2010:04:17 AM | 51.575 | 97.588 | 24.688 | 74.3 |
| 2016-03-2010:04:21 AM | 51.462 | 97.7 | 24.575 | 74.3 |
| 2016-03-2010:04:25 AM | 51.125 | 97.7 | 24.462 | 74.3 |
| 2016-03-2010:04:29 AM | 51.012 | 97.812 | 24.462 | 74.188 |
| 2016-03-2010:04:33 AM | 50.788 | 97.812 | 24.462 | 74.188 |
| 2016-03-2010:04:37 AM | 50.675 | 97.812 | 24.35 | 74.188 |
| 2016-03-2010:04:41 AM | 50.675 | 97.925 | 24.35 | 74.188 |
| 2016-03-2010:04:45 AM | 50.562 | 97.925 | 24.238 | 74.188 |
| 2016-03-2010:04:49 AM | 50.45 | 98.038 | 24.125 | 74.188 |
| 2016-03-2010:04:54 AM | 50.338 | 98.038 | 24.125 | 74.188 |
| 2016-03-2010:04:58 AM | 50.45 | 98.038 | 24.125 | 74.188 |
| 2016-03-2010:05:02 AM | 50.45 | 98.15 | 24.125 | 74.188 |
| 2016-03-2010:05:06 AM | 50.45 | 98.15 | 24.012 | 74.188 |
| 2016-03-2010:05:10 AM | 50.45 | 98.15 | 24.012 | 74.188 |
| 2016-03-2010:05:14 AM | 50.562 | 98.262 | 24.125 | 74.188 |
| 2016-03-2010:05:18 AM | 50.562 | 98.262 | 24.125 | 74.188 |
| 2016-03-2010:05:22 AM | 50.562 | 98.262 | 24.125 | 74.188 |
| 2016-03-2010:05:26 AM | 50.338 | 98.375 | 24.012 | 74.188 |
| 2016-03-2010:05:30 AM | 50.225 | 98.375 | 24.012 | 74.188 |
| 2016-03-2010:05:34 AM | 50.112 | 98.375 | 24.012 | 74.188 |
| 2016-03-2010:05:38 AM | 49.888 | 98.375 | 24.125 | 74.188 |
| 2016-03-2010:05:42 AM | 49.775 | 98.488 | 24.125 | 74.188 |
| 2016-03-2010:05:46 AM | 49.775 | 98.488 | 24.238 | 74.188 |
| 2016-03-2010:05:50 AM | 49.775 | 98.488 | 24.238 | 74.188 |
| 2016-03-2010:05:54 AM | 49.662 | 98.6 | 24.35 | 74.188 |
| 2016-03-2010:05:58 AM | 49.775 | 98.6 | 24.462 | 74.188 |
| 2016-03-2010:06:02 AM | 49.775 | 98.6 | 24.575 | 74.188 |
| 2016-03-2010:06:06 AM | 49.775 | 98.6 | 24.575 | 74.188 |
| 2016-03-2010:06:10 AM | 49.775 | 98.6 | 24.688 | 74.188 |
| 2016-03-2010:06:14 AM | 49.888 | 98.712 | 24.8 | 74.188 |
| 2016-03-2010:06:18 AM | 49.888 | 98.712 | 24.912 | 74.188 |
| 2016-03-2010:06:22 AM | 50 | 98.712 | 24.912 | 74.188 |
| 2016-03-2010:06:26 AM | 50.112 | 98.825 | 24.912 | 74.075 |
| 2016-03-2010:06:31 AM | 50.225 | 98.825 | 24.8 | 74.188 |
| 2016-03-2010:06:35 AM | 50.225 | 98.825 | 24.688 | 74.075 |
| 2016-03-2010:06:39 AM | 50.338 | 98.825 | 24.575 | 74.075 |
| 2016-03-2010:06:43 AM | 50.338 | 98.938 | 24.688 | 74.075 |
| 2016-03-2010:06:47 AM | 50.338 | 98.938 | 24.688 | 74.075 |
| 2016-03-2010:06:51 AM | 50.338 | 98.938 | 24.688 | 74.075 |
| 2016-03-2010:06:55 AM | 50.338 | 99.05 | 24.688 | 74.075 |
| 2016-03-2010:06:59 AM | 50.45 | 99.05 | 24.8 | 74.075 |
| 2016-03-2010:07:03 AM | 50.45 | 99.05 | 24.8 | 74.075 |
| 2016-03-2010:07:07 AM | 50.45 | 99.05 | 24.912 | 74.075 |
| 2016-03-2010:07:11 AM | 50.338 | 99.163 | 24.912 | 74.075 |
| 2016-03-2010:07:15 AM | 50.45 | 99.163 | 24.912 | 74.075 |
| 2016-03-2010:07:19 AM | 50.562 | 99.163 | 24.912 | 74.075 |
| 2016-03-2010:07:23 AM | 50.562 | 99.275 | 24.912 | 74.075 |
| 2016-03-2010:07:27 AM | 50.45 | 99.275 | 24.912 | 73.962 |
| 2016-03-2010:07:31 AM | 50.338 | 99.388 | 24.912 | 74.075 |
| 2016-03-2010:07:35 AM | 50.45 | 99.388 | 24.912 | 74.075 |
| 2016-03-2010:07:39 AM | 50.562 | 99.388 | 24.912 | 74.075 |
| 2016-03-2010:07:44 AM | 50.675 | 99.388 | 24.8 | 74.075 |
| 2016-03-2010:07:48 AM | 50.788 | 99.5 | 24.8 | 74.075 |
| 2016-03-2010:07:52 AM | 50.9 | 99.5 | 24.912 | 74.075 |
| 2016-03-2010:07:56 AM | 51.012 | 99.612 | 25.025 | 73.962 |
| 2016-03-2010:08:00 AM | 51.125 | 99.612 | 25.025 | 74.075 |
| 2016-03-2010:08:04 AM | 51.238 | 99.612 | 25.025 | 73.962 |
| 2016-03-2010:08:08 AM | 51.238 | 99.725 | 25.138 | 74.075 |
| 2016-03-2010:08:12 AM | 51.238 | 99.725 | 25.025 | 73.962 |
| 2016-03-2010:08:16 AM | 51.35 | 99.725 | 25.025 | 73.962 |
| 2016-03-2010:08:20 AM | 51.35 | 99.838 | 24.912 | 73.962 |
| 2016-03-2010:08:24 AM | 51.462 | 99.838 | 24.8 | 73.962 |
| 2016-03-2010:08:28 AM | 51.35 | 99.95 | 24.912 | 73.962 |
| 2016-03-2010:08:32 AM | 51.35 | 99.95 | 24.8 | 73.962 |
| 2016-03-2010:08:36 AM | 51.462 | 99.95 | 24.912 | 73.962 |
| 2016-03-2010:08:40 AM | 51.575 | 99.95 | 25.025 | 73.962 |
| 2016-03-2010:08:44 AM | 51.688 | 100.062 | 25.025 | 73.962 |
| 2016-03-2010:08:52 AM | 51.688 | 100.062 | 25.138 | 73.962 |
| 2016-03-2010:08:56 AM | 51.8 | 100.175 | 25.138 | 73.962 |
| 2016-03-2010:09:00 AM | 51.912 | 100.175 | 25.138 | 73.962 |
| 2016-03-2010:09:04 AM | 52.025 | 100.175 | 24.912 | 73.962 |
| 2016-03-2010:09:08 AM | 52.025 | 100.288 | 25.025 | 73.962 |
| 2016-03-2010:09:12 AM | 51.912 | 100.288 | 24.912 | 73.962 |
| 2016-03-2010:09:16 AM | 52.025 | 100.288 | 24.912 | 73.962 |
| 2016-03-2010:09:20 AM | 52.138 | 100.288 | 25.025 | 73.962 |
| 2016-03-2010:09:24 AM | 52.25 | 100.4 | 25.138 | 73.962 |
| 2016-03-2010:09:28 AM | 52.362 | 100.4 | 25.138 | 73.962 |
| 2016-03-2010:09:32 AM | 52.475 | 100.4 | 25.025 | 73.962 |
| 2016-03-2010:09:36 AM | 52.588 | 100.512 | 25.138 | 73.962 |
| 2016-03-2010:09:40 AM | 52.588 | 100.512 | 25.138 | 73.962 |
| 2016-03-2010:09:44 AM | 52.588 | 100.625 | 25.25 | 73.962 |
| 2016-03-2010:09:48 AM | 52.588 | 100.625 | 25.25 | 73.962 |
| 2016-03-2010:09:52 AM | 52.588 | 100.738 | 25.25 | 73.962 |
| 2016-03-2010:09:56 AM | 52.362 | 100.738 | 25.25 | 73.962 |
| 2016-03-2010:10:00 AM | 52.25 | 100.738 | 25.138 | 73.962 |
| 2016-03-2010:10:04 AM | 52.138 | 100.738 | 25.25 | 73.962 |
| 2016-03-2010:10:09 AM | 52.025 | 100.85 | 25.25 | 73.962 |
| 2016-03-2010:10:13 AM | 52.025 | 100.85 | 25.362 | 73.962 |
| 2016-03-2010:10:17 AM | 51.912 | 100.962 | 25.475 | 73.962 |
| 2016-03-2010:10:21 AM | 52.025 | 100.962 | 25.475 | 73.962 |
| 2016-03-2010:10:25 AM | 52.138 | 101.075 | 25.475 | 73.962 |
| 2016-03-2010:10:29 AM | 52.138 | 101.075 | 25.588 | 73.962 |
| 2016-03-2010:10:33 AM | 52.138 | 101.075 | 25.588 | 73.85 |
| 2016-03-2010:10:37 AM | 51.912 | 101.188 | 25.7 | 73.962 |
| 2016-03-2010:10:41 AM | 51.462 | 101.188 | 25.7 | 73.962 |
| 2016-03-2010:10:45 AM | 51.462 | 101.188 | 25.588 | 73.85 |
| 2016-03-2010:10:49 AM | 51.462 | 101.3 | 25.588 | 73.85 |
| 2016-03-2010:10:53 AM | 51.35 | 101.3 | 25.588 | 73.85 |
| 2016-03-2010:10:57 AM | 51.35 | 101.413 | 25.588 | 73.85 |
| 2016-03-2010:11:01 AM | 51.35 | 101.413 | 25.588 | 73.85 |
| 2016-03-2010:11:05 AM | 51.238 | 101.413 | 25.588 | 73.85 |
| 2016-03-2010:11:09 AM | 51.125 | 101.525 | 25.588 | 73.962 |
| 2016-03-2010:11:13 AM | 51.012 | 101.525 | 25.588 | 73.85 |
| 2016-03-2010:11:18 AM | 51.125 | 101.525 | 25.588 | 73.85 |
| 2016-03-2010:11:22 AM | 51.125 | 101.638 | 25.588 | 73.85 |
| 2016-03-2010:11:26 AM | 51.238 | 101.638 | 25.475 | 73.85 |
| 2016-03-2010:11:30 AM | 51.238 | 101.75 | 25.475 | 73.85 |
| 2016-03-2010:11:34 AM | 51.238 | 101.75 | 25.475 | 73.85 |
| 2016-03-2010:11:38 AM | 51.35 | 101.75 | 25.475 | 73.85 |
| 2016-03-2010:11:46 AM | 51.238 | 101.862 | 25.475 | 73.85 |
| 2016-03-2010:11:50 AM | 51.012 | 101.862 | 25.475 | 73.85 |
| 2016-03-2010:11:54 AM | 50.788 | 101.862 | 25.588 | 73.85 |
| 2016-03-2010:11:58 AM | 50.788 | 101.862 | 25.475 | 73.85 |
| 2016-03-2010:12:02 AM | 50.788 | 101.975 | 25.362 | 73.85 |
| 2016-03-2010:12:06 AM | 50.9 | 101.975 | 25.475 | 73.85 |
| 2016-03-2010:12:10 AM | 50.788 | 102.088 | 25.362 | 73.85 |
| 2016-03-2010:12:14 AM | 50.788 | 102.088 | 25.362 | 73.85 |
| 2016-03-2010:12:18 AM | 50.788 | 102.088 | 25.362 | 73.962 |
| 2016-03-2010:12:22 AM | 50.788 | 102.088 | 25.362 | 73.85 |
| 2016-03-2010:12:26 AM | 50.9 | 102.2 | 25.475 | 73.85 |
| 2016-03-2010:12:31 AM | 51.012 | 102.2 | 25.475 | 73.85 |
| 2016-03-2010:12:35 AM | 51.125 | 102.312 | 25.588 | 73.85 |
| 2016-03-2010:12:39 AM | 51.238 | 102.2 | 25.588 | 73.85 |
| 2016-03-2010:12:43 AM | 51.238 | 102.312 | 25.7 | 73.85 |
| 2016-03-2010:12:47 AM | 51.35 | 102.312 | 25.7 | 73.85 |
| 2016-03-2010:12:51 AM | 51.462 | 102.425 | 25.7 | 73.85 |
| 2016-03-2010:12:55 AM | 51.462 | 102.425 | 25.7 | 73.85 |
| 2016-03-2010:12:59 AM | 51.462 | 102.425 | 25.588 | 73.85 |
| 2016-03-2010:13:03 AM | 51.462 | 102.425 | 25.7 | 73.85 |
| 2016-03-2010:13:07 AM | 51.462 | 102.538 | 25.588 | 73.85 |
| 2016-03-2010:13:11 AM | 51.575 | 102.538 | 25.588 | 73.85 |
| 2016-03-2010:13:15 AM | 51.462 | 102.538 | 25.588 | 73.85 |
| 2016-03-2010:13:19 AM | 51.462 | 102.65 | 25.588 | 73.85 |
| 2016-03-2010:13:23 AM | 51.35 | 102.65 | 25.7 | 73.85 |
| 2016-03-2010:13:27 AM | 51.238 | 102.65 | 25.7 | 73.85 |
| 2016-03-2010:13:32 AM | 51.125 | 102.65 | 25.7 | 73.85 |
| 2016-03-2010:13:36 AM | 51.125 | 102.762 | 25.588 | 73.85 |
| 2016-03-2010:13:40 AM | 51.238 | 102.762 | 25.475 | 73.85 |
| 2016-03-2010:13:44 AM | 51.35 | 102.762 | 25.475 | 73.85 |
| 2016-03-2010:13:48 AM | 51.462 | 102.875 | 25.475 | 73.85 |
| 2016-03-2010:13:52 AM | 51.575 | 102.875 | 25.475 | 73.85 |
| 2016-03-2010:13:56 AM | 51.688 | 102.875 | 25.588 | 73.85 |
| 2016-03-2010:14:00 AM | 51.688 | 102.988 | 25.588 | 73.85 |
| 2016-03-2010:14:04 AM | 51.688 | 102.988 | 25.475 | 73.85 |
| 2016-03-2010:14:08 AM | 51.8 | 102.988 | 25.475 | 73.85 |
| 2016-03-2010:14:12 AM | 51.912 | 102.988 | 25.362 | 73.85 |
| 2016-03-2010:14:16 AM | 52.025 | 103.1 | 25.362 | 73.85 |
| 2016-03-2010:14:20 AM | 52.025 | 103.1 | 25.362 | 73.85 |
| 2016-03-2010:14:24 AM | 52.138 | 103.1 | 25.475 | 73.85 |
| 2016-03-2010:14:28 AM | 52.25 | 103.212 | 25.475 | 73.85 |
| 2016-03-2010:14:32 AM | 52.362 | 103.212 | 25.588 | 73.85 |
| 2016-03-2010:14:36 AM | 52.362 | 103.212 | 25.475 | 73.85 |
| 2016-03-2010:14:40 AM | 52.362 | 103.212 | 25.475 | 73.85 |
| 2016-03-2010:14:45 AM | 52.475 | 103.325 | 25.588 | 73.85 |
| 2016-03-2010:14:49 AM | 52.362 | 103.325 | 25.588 | 73.85 |
| 2016-03-2010:14:53 AM | 52.362 | 103.325 | 25.588 | 73.85 |
| 2016-03-2010:14:57 AM | 52.475 | 103.438 | 25.7 | 73.85 |
| 2016-03-2010:15:01 AM | 52.475 | 103.438 | 25.7 | 73.85 |
| 2016-03-2010:15:05 AM | 52.475 | 103.438 | 25.812 | 73.85 |
| 2016-03-2010:15:09 AM | 52.475 | 103.55 | 25.7 | 73.85 |
| 2016-03-2010:15:13 AM | 52.475 | 103.663 | 25.7 | 73.85 |
| 2016-03-2010:15:17 AM | 52.588 | 103.663 | 25.588 | 73.85 |
| 2016-03-2010:15:21 AM | 52.588 | 103.663 | 25.475 | 73.85 |
| 2016-03-2010:15:25 AM | 52.588 | 103.663 | 25.475 | 73.85 |
| 2016-03-2010:15:29 AM | 52.588 | 103.775 | 25.475 | 73.85 |
| 2016-03-2010:15:33 AM | 52.7 | 103.775 | 25.588 | 73.85 |
| 2016-03-2010:15:37 AM | 52.812 | 103.888 | 25.7 | 73.85 |
| 2016-03-2010:15:41 AM | 52.812 | 103.888 | 25.7 | 73.85 |
| 2016-03-2010:15:45 AM | 52.812 | 103.888 | 25.812 | 73.85 |
| 2016-03-2010:15:49 AM | 52.925 | 104 | 25.812 | 73.85 |
| 2016-03-2010:15:53 AM | 52.925 | 104 | 25.925 | 73.85 |
| 2016-03-2010:15:57 AM | 53.038 | 104 | 25.812 | 73.85 |
| 2016-03-2010:16:02 AM | 53.15 | 104.112 | 25.812 | 73.85 |
| 2016-03-2010:16:06 AM | 53.15 | 104.112 | 25.812 | 73.85 |
| 2016-03-2010:16:10 AM | 53.15 | 104.112 | 25.925 | 73.85 |
| 2016-03-2010:16:14 AM | 53.038 | 104.225 | 26.038 | 73.85 |
| 2016-03-2010:16:18 AM | 52.812 | 104.338 | 26.038 | 73.85 |
| 2016-03-2010:16:22 AM | 52.7 | 104.338 | 25.925 | 73.738 |
| 2016-03-2010:16:26 AM | 52.475 | 104.338 | 25.925 | 73.85 |
| 2016-03-2010:16:30 AM | 52.25 | 104.45 | 25.925 | 73.738 |
| 2016-03-2010:16:34 AM | 52.25 | 104.45 | 25.925 | 73.738 |
| 2016-03-2010:16:38 AM | 52.25 | 104.562 | 25.812 | 73.738 |
| 2016-03-2010:16:42 AM | 52.362 | 104.562 | 25.925 | 73.738 |
| 2016-03-2010:16:46 AM | 52.362 | 104.562 | 25.925 | 73.738 |
| 2016-03-2010:16:50 AM | 52.362 | 104.562 | 25.925 | 73.738 |
| 2016-03-2010:16:54 AM | 52.362 | 104.675 | 25.812 | 73.738 |
| 2016-03-2010:16:58 AM | 52.475 | 104.675 | 25.812 | 73.738 |
| 2016-03-2010:17:02 AM | 52.588 | 104.675 | 25.812 | 73.738 |
| 2016-03-2010:17:06 AM | 52.588 | 104.788 | 25.925 | 73.738 |
| 2016-03-2010:17:11 AM | 52.7 | 104.9 | 26.038 | 73.738 |
| 2016-03-2010:17:15 AM | 52.7 | 104.9 | 26.038 | 73.738 |
| 2016-03-2010:17:19 AM | 52.812 | 104.9 | 26.038 | 73.738 |
| 2016-03-2010:17:23 AM | 52.925 | 105.012 | 26.15 | 73.738 |
| 2016-03-2010:17:27 AM | 53.038 | 105.012 | 26.15 | 73.738 |
| 2016-03-2010:17:31 AM | 53.15 | 105.012 | 26.15 | 73.738 |
| 2016-03-2010:17:35 AM | 53.262 | 105.125 | 26.262 | 73.738 |
| 2016-03-2010:17:39 AM | 53.375 | 105.125 | 26.375 | 73.738 |
| 2016-03-2010:17:43 AM | 53.488 | 105.238 | 26.488 | 73.738 |
| 2016-03-2010:17:47 AM | 53.6 | 105.125 | 26.488 | 73.738 |
| 2016-03-2010:17:51 AM | 53.712 | 105.238 | 26.488 | 73.738 |
| 2016-03-2010:17:55 AM | 53.825 | 105.238 | 26.6 | 73.738 |
| 2016-03-2010:17:59 AM | 53.938 | 105.35 | 26.6 | 73.738 |
| 2016-03-2010:18:03 AM | 53.938 | 105.35 | 26.712 | 73.738 |
| 2016-03-2010:18:07 AM | 54.05 | 105.35 | 26.712 | 73.738 |
| 2016-03-2010:18:11 AM | 54.162 | 105.35 | 26.712 | 73.738 |
| 2016-03-2010:18:15 AM | 54.275 | 105.462 | 26.712 | 73.738 |
| 2016-03-2010:18:19 AM | 54.388 | 105.462 | 26.712 | 73.738 |
| 2016-03-2010:18:24 AM | 54.5 | 105.575 | 26.712 | 73.738 |
| 2016-03-2010:18:28 AM | 54.5 | 105.575 | 26.825 | 73.738 |
| 2016-03-2010:18:32 AM | 54.5 | 105.688 | 26.825 | 73.738 |
| 2016-03-2010:18:36 AM | 54.388 | 105.688 | 26.938 | 73.738 |
| 2016-03-2010:18:40 AM | 54.388 | 105.688 | 27.05 | 73.738 |
| 2016-03-2010:18:44 AM | 54.388 | 105.8 | 27.05 | 73.738 |
| 2016-03-2010:18:48 AM | 54.275 | 105.8 | 27.05 | 73.738 |
| 2016-03-2010:18:52 AM | 54.275 | 105.8 | 26.938 | 73.738 |
| 2016-03-2010:18:56 AM | 54.05 | 105.913 | 26.938 | 73.738 |
| 2016-03-2010:19:00 AM | 53.938 | 105.913 | 26.825 | 73.738 |
| 2016-03-2010:19:04 AM | 53.938 | 106.025 | 26.712 | 73.738 |
| 2016-03-2010:19:08 AM | 53.825 | 106.025 | 26.712 | 73.738 |
| 2016-03-2010:19:12 AM | 53.712 | 106.025 | 26.712 | 73.738 |
| 2016-03-2010:19:16 AM | 53.712 | 106.138 | 26.712 | 73.738 |
| 2016-03-2010:19:20 AM | 53.6 | 106.138 | 26.825 | 73.738 |
| 2016-03-2010:19:24 AM | 53.6 | 106.25 | 26.825 | 73.738 |
| 2016-03-2010:19:28 AM | 53.6 | 106.25 | 26.825 | 73.738 |
| 2016-03-2010:19:32 AM | 53.488 | 106.362 | 26.712 | 73.738 |
| 2016-03-2010:19:37 AM | 53.6 | 106.362 | 26.6 | 73.738 |
| 2016-03-2010:19:41 AM | 53.6 | 106.475 | 26.6 | 73.738 |
| 2016-03-2010:19:45 AM | 53.6 | 106.475 | 26.6 | 73.738 |
| 2016-03-2010:19:49 AM | 53.6 | 106.475 | 26.6 | 73.738 |
| 2016-03-2010:19:53 AM | 53.488 | 106.475 | 26.6 | 73.738 |
| 2016-03-2010:19:57 AM | 53.375 | 106.588 | 26.712 | 73.738 |
| 2016-03-2010:20:01 AM | 53.15 | 106.588 | 26.6 | 73.738 |
| 2016-03-2010:20:05 AM | 53.15 | 106.588 | 26.6 | 73.738 |
| 2016-03-2010:20:09 AM | 53.15 | 106.7 | 26.375 | 73.738 |
| 2016-03-2010:20:13 AM | 53.038 | 106.7 | 26.15 | 73.738 |
| 2016-03-2010:20:17 AM | 53.038 | 106.812 | 26.038 | 73.738 |
| 2016-03-2010:20:21 AM | 53.038 | 106.812 | 25.925 | 73.738 |
| 2016-03-2010:20:25 AM | 52.925 | 106.812 | 25.925 | 73.738 |
| 2016-03-2010:20:29 AM | 52.925 | 106.812 | 25.812 | 73.738 |
| 2016-03-2010:20:33 AM | 52.925 | 106.925 | 25.812 | 73.738 |
| 2016-03-2010:20:37 AM | 52.812 | 106.925 | 25.812 | 73.738 |
| 2016-03-2010:20:41 AM | 52.7 | 106.925 | 25.925 | 73.738 |
| 2016-03-2010:20:45 AM | 52.812 | 107.038 | 25.925 | 73.738 |
| 2016-03-2010:20:49 AM | 52.925 | 107.038 | 26.038 | 73.738 |
| 2016-03-2010:20:53 AM | 52.925 | 107.038 | 26.038 | 73.738 |
| 2016-03-2010:20:57 AM | 53.038 | 107.038 | 26.15 | 73.738 |
| 2016-03-2010:21:02 AM | 53.038 | 107.038 | 26.15 | 73.738 |
| 2016-03-2010:21:06 AM | 52.812 | 107.15 | 26.15 | 73.738 |
| 2016-03-2010:21:10 AM | 52.588 | 107.15 | 26.15 | 73.738 |
| 2016-03-2010:21:14 AM | 52.25 | 107.15 | 26.038 | 73.738 |
| 2016-03-2010:21:18 AM | 52.025 | 107.15 | 25.812 | 73.738 |
| 2016-03-2010:21:22 AM | 51.912 | 107.15 | 25.812 | 73.738 |
| 2016-03-2010:21:26 AM | 51.912 | 107.262 | 25.7 | 73.738 |
| 2016-03-2010:21:30 AM | 51.912 | 107.262 | 25.7 | 73.738 |
| 2016-03-2010:21:34 AM | 52.025 | 107.262 | 25.7 | 73.738 |
| 2016-03-2010:21:38 AM | 52.138 | 107.262 | 25.7 | 73.738 |
| 2016-03-2010:21:42 AM | 52.138 | 107.375 | 25.812 | 73.738 |
| 2016-03-2010:21:46 AM | 52.362 | 107.375 | 25.7 | 73.738 |
| 2016-03-2010:21:50 AM | 52.475 | 107.375 | 25.812 | 73.738 |
| 2016-03-2010:21:54 AM | 52.588 | 107.262 | 25.925 | 73.738 |
| 2016-03-2010:21:58 AM | 52.7 | 107.375 | 25.925 | 73.738 |
| 2016-03-2010:22:02 AM | 52.7 | 107.375 | 25.812 | 73.738 |
| 2016-03-2010:22:06 AM | 52.7 | 107.375 | 25.812 | 73.738 |
| 2016-03-2010:22:11 AM | 52.812 | 107.488 | 25.925 | 73.738 |
| 2016-03-2010:22:15 AM | 52.812 | 107.488 | 25.925 | 73.738 |
| 2016-03-2010:22:19 AM | 52.925 | 107.488 | 26.15 | 73.738 |
| 2016-03-2010:22:23 AM | 52.925 | 107.488 | 26.15 | 73.738 |
| 2016-03-2010:22:27 AM | 52.925 | 107.488 | 26.15 | 73.738 |
| 2016-03-2010:22:31 AM | 53.15 | 107.488 | 26.15 | 73.738 |
| 2016-03-2010:22:35 AM | 53.262 | 107.6 | 26.038 | 73.738 |
| 2016-03-2010:22:39 AM | 53.262 | 107.6 | 25.925 | 73.738 |
| 2016-03-2010:22:43 AM | 53.262 | 107.6 | 25.925 | 73.738 |
| 2016-03-2010:22:47 AM | 53.262 | 107.6 | 25.925 | 73.738 |
| 2016-03-2010:22:51 AM | 53.262 | 107.6 | 26.038 | 73.738 |
| 2016-03-2010:22:55 AM | 53.375 | 107.712 | 26.15 | 73.738 |
| 2016-03-2010:22:59 AM | 53.375 | 107.712 | 26.15 | 73.738 |
| 2016-03-2010:23:03 AM | 53.375 | 107.825 | 26.262 | 73.738 |
| 2016-03-2010:23:07 AM | 53.375 | 107.825 | 26.15 | 73.738 |
| 2016-03-2010:23:11 AM | 53.375 | 107.825 | 26.262 | 73.738 |
| 2016-03-2010:23:15 AM | 53.262 | 107.938 | 26.262 | 73.738 |
| 2016-03-2010:23:19 AM | 53.262 | 107.938 | 26.15 | 73.738 |
| 2016-03-2010:23:23 AM | 53.262 | 107.938 | 26.038 | 73.738 |
| 2016-03-2010:23:27 AM | 53.262 | 107.938 | 25.925 | 73.738 |
| 2016-03-2010:23:32 AM | 53.038 | 108.05 | 25.925 | 73.738 |
| 2016-03-2010:23:36 AM | 52.925 | 108.05 | 25.7 | 73.738 |
| 2016-03-2010:23:40 AM | 52.812 | 108.05 | 25.475 | 73.738 |
| 2016-03-2010:23:44 AM | 52.7 | 108.163 | 25.362 | 73.738 |
| 2016-03-2010:23:48 AM | 52.7 | 108.275 | 25.25 | 73.738 |
| 2016-03-2010:23:52 AM | 52.588 | 108.163 | 25.138 | 73.738 |
| 2016-03-2010:23:56 AM | 52.475 | 108.275 | 24.912 | 73.738 |
| 2016-03-2010:24:00 AM | 52.362 | 108.388 | 24.688 | 73.738 |
| 2016-03-2010:24:04 AM | 52.25 | 108.388 | 24.575 | 73.738 |
| 2016-03-2010:24:08 AM | 52.362 | 108.388 | 24.575 | 73.738 |
| 2016-03-2010:24:12 AM | 52.362 | 108.5 | 24.575 | 73.738 |
| 2016-03-2010:24:16 AM | 52.362 | 108.5 | 24.688 | 73.738 |
| 2016-03-2010:24:20 AM | 52.362 | 108.5 | 24.688 | 73.738 |
| 2016-03-2010:24:24 AM | 52.362 | 108.612 | 24.688 | 73.738 |
| 2016-03-2010:24:28 AM | 52.25 | 108.5 | 24.575 | 73.738 |
| 2016-03-2010:24:32 AM | 52.138 | 108.612 | 24.575 | 73.738 |
| 2016-03-2010:24:37 AM | 52.025 | 108.612 | 24.462 | 73.738 |
| 2016-03-2010:24:41 AM | 52.025 | 108.725 | 24.462 | 73.738 |
| 2016-03-2010:24:45 AM | 52.138 | 108.725 | 24.575 | 73.738 |
| 2016-03-2010:24:49 AM | 52.25 | 108.725 | 24.575 | 73.738 |
| 2016-03-2010:24:53 AM | 52.475 | 108.725 | 24.688 | 73.738 |
| 2016-03-2010:24:57 AM | 52.588 | 108.725 | 24.8 | 73.738 |
| 2016-03-2010:25:01 AM | 52.7 | 108.838 | 24.8 | 73.738 |
| 2016-03-2010:25:05 AM | 52.7 | 108.838 | 24.912 | 73.738 |
| 2016-03-2010:25:09 AM | 52.7 | 108.838 | 24.912 | 73.738 |
| 2016-03-2010:25:13 AM | 52.7 | 108.838 | 25.025 | 73.738 |
| 2016-03-2010:25:17 AM | 52.925 | 108.95 | 25.025 | 73.738 |
| 2016-03-2010:25:21 AM | 52.925 | 108.95 | 25.138 | 73.85 |
| 2016-03-2010:25:25 AM | 52.925 | 108.95 | 25.25 | 73.85 |
| 2016-03-2010:25:29 AM | 52.925 | 108.95 | 25.25 | 73.738 |
| 2016-03-2010:25:33 AM | 52.925 | 109.062 | 25.138 | 73.738 |
| 2016-03-2010:25:38 AM | 52.925 | 109.062 | 25.25 | 73.738 |
| 2016-03-2010:25:42 AM | 52.812 | 109.062 | 25.475 | 73.738 |
| 2016-03-2010:25:46 AM | 52.925 | 109.062 | 25.588 | 73.738 |
| 2016-03-2010:25:50 AM | 52.925 | 109.175 | 25.588 | 73.738 |
| 2016-03-2010:25:54 AM | 52.812 | 109.175 | 25.7 | 73.85 |
| 2016-03-2010:25:58 AM | 52.812 | 109.175 | 25.7 | 73.85 |
| 2016-03-2010:26:02 AM | 52.925 | 109.288 | 25.7 | 73.738 |
| 2016-03-2010:26:06 AM | 52.812 | 109.288 | 25.812 | 73.738 |
| 2016-03-2010:26:10 AM | 52.7 | 109.288 | 25.812 | 73.738 |
| 2016-03-2010:26:14 AM | 52.7 | 109.4 | 25.812 | 73.738 |
| 2016-03-2010:26:18 AM | 52.812 | 109.4 | 25.812 | 73.738 |
| 2016-03-2010:26:22 AM | 52.925 | 109.4 | 25.812 | 73.738 |
| 2016-03-2010:26:26 AM | 53.15 | 109.512 | 25.925 | 73.738 |
| 2016-03-2010:26:30 AM | 53.262 | 109.512 | 25.925 | 73.738 |
| 2016-03-2010:26:34 AM | 53.375 | 109.512 | 26.038 | 73.625 |
| 2016-03-2010:26:38 AM | 53.488 | 109.512 | 26.038 | 73.738 |
| 2016-03-2010:26:43 AM | 53.488 | 109.625 | 26.038 | 73.738 |
| 2016-03-2010:26:47 AM | 53.6 | 109.625 | 26.038 | 73.738 |
| 2016-03-2010:26:51 AM | 53.825 | 109.625 | 26.038 | 73.738 |
| 2016-03-2010:26:55 AM | 53.938 | 109.738 | 26.15 | 73.738 |
| 2016-03-2010:26:59 AM | 54.05 | 109.738 | 26.038 | 73.85 |
| 2016-03-2010:27:03 AM | 54.05 | 109.738 | 26.038 | 73.738 |
| 2016-03-2010:27:07 AM | 54.05 | 109.85 | 25.925 | 73.85 |
| 2016-03-2010:27:11 AM | 54.05 | 109.85 | 26.038 | 73.738 |
| 2016-03-2010:27:15 AM | 54.05 | 109.85 | 25.925 | 73.85 |
| 2016-03-2010:27:19 AM | 53.825 | 109.85 | 26.038 | 73.85 |
| 2016-03-2010:27:23 AM | 53.825 | 109.962 | 25.925 | 73.85 |
| 2016-03-2010:27:27 AM | 53.825 | 109.962 | 25.925 | 73.85 |
| 2016-03-2010:27:31 AM | 53.825 | 109.962 | 26.038 | 73.85 |
| 2016-03-2010:27:35 AM | 53.825 | 109.962 | 26.038 | 73.85 |
| 2016-03-2010:27:39 AM | 53.825 | 110.075 | 26.15 | 73.85 |
| 2016-03-2010:27:43 AM | 53.712 | 110.075 | 26.15 | 73.85 |
| 2016-03-2010:27:48 AM | 53.488 | 110.075 | 26.15 | 73.85 |
| 2016-03-2010:27:52 AM | 53.262 | 110.075 | 26.15 | 73.85 |
| 2016-03-2010:27:56 AM | 53.038 | 110.188 | 26.15 | 73.962 |
| 2016-03-2010:28:00 AM | 52.812 | 110.188 | 26.262 | 73.962 |
| 2016-03-2010:28:04 AM | 52.812 | 110.188 | 26.262 | 73.962 |
| 2016-03-2010:28:08 AM | 52.812 | 110.3 | 26.15 | 73.962 |
| 2016-03-2010:28:12 AM | 52.588 | 110.3 | 26.15 | 73.962 |
| 2016-03-2010:28:16 AM | 52.362 | 110.3 | 26.375 | 73.962 |
| 2016-03-2010:28:20 AM | 52.25 | 110.413 | 26.375 | 73.962 |
| 2016-03-2010:28:24 AM | 52.138 | 110.413 | 26.375 | 73.962 |
| 2016-03-2010:28:28 AM | 51.912 | 110.413 | 26.375 | 73.962 |
| 2016-03-2010:28:32 AM | 51.462 | 110.525 | 26.375 | 73.962 |
| 2016-03-2010:28:36 AM | 51.35 | 110.525 | 26.375 | 73.962 |
| 2016-03-2010:28:40 AM | 51.125 | 110.525 | 26.375 | 73.962 |
| 2016-03-2010:28:44 AM | 51.012 | 110.638 | 26.375 | 73.962 |
| 2016-03-2010:28:48 AM | 51.012 | 110.638 | 26.375 | 73.962 |
| 2016-03-2010:28:52 AM | 50.9 | 110.638 | 26.375 | 73.962 |
| 2016-03-2010:28:56 AM | 51.012 | 110.75 | 26.375 | 73.962 |
| 2016-03-2010:29:00 AM | 51.012 | 110.75 | 26.262 | 73.962 |
| 2016-03-2010:29:04 AM | 51.012 | 110.75 | 26.262 | 73.962 |
| 2016-03-2010:29:08 AM | 51.238 | 110.862 | 26.262 | 73.962 |
| 2016-03-2010:29:12 AM | 51.238 | 110.862 | 26.262 | 73.962 |
| 2016-03-2010:29:16 AM | 51.238 | 110.862 | 26.262 | 73.962 |
| 2016-03-2010:29:20 AM | 51.35 | 110.862 | 26.375 | 73.962 |
| 2016-03-2010:29:24 AM | 51.462 | 110.862 | 26.262 | 73.962 |
| 2016-03-2010:29:28 AM | 51.688 | 110.975 | 26.375 | 73.962 |
| 2016-03-2010:29:32 AM | 51.688 | 110.975 | 26.375 | 73.962 |
| 2016-03-2010:29:36 AM | 51.8 | 111.088 | 26.488 | 73.962 |
| 2016-03-2010:29:40 AM | 51.912 | 111.088 | 26.6 | 73.962 |
| 2016-03-2010:29:44 AM | 52.025 | 111.088 | 26.6 | 73.962 |
| 2016-03-2010:29:48 AM | 52.138 | 111.088 | 26.6 | 73.962 |
| 2016-03-2010:29:52 AM | 52.362 | 111.088 | 26.6 | 73.962 |
| 2016-03-2010:29:56 AM | 52.475 | 111.2 | 26.6 | 73.962 |
| 2016-03-2010:30:00 AM | 52.475 | 111.2 | 26.488 | 73.962 |
| 2016-03-2010:30:05 AM | 52.475 | 111.2 | 26.6 | 73.962 |
| 2016-03-2010:30:09 AM | 52.475 | 111.312 | 26.6 | 74.075 |
| 2016-03-2010:30:13 AM | 52.588 | 111.312 | 26.6 | 73.962 |
| 2016-03-2010:30:17 AM | 52.7 | 111.425 | 26.6 | 73.962 |
| 2016-03-2010:30:21 AM | 52.7 | 111.425 | 26.712 | 74.075 |
| 2016-03-2010:30:25 AM | 52.812 | 111.425 | 26.712 | 73.962 |
| 2016-03-2010:30:29 AM | 52.7 | 111.538 | 26.825 | 73.962 |
| 2016-03-2010:30:33 AM | 52.7 | 111.538 | 26.825 | 73.962 |
| 2016-03-2010:30:37 AM | 52.812 | 111.538 | 26.825 | 73.962 |
| 2016-03-2010:30:41 AM | 52.812 | 111.65 | 26.825 | 74.075 |
| 2016-03-2010:30:45 AM | 52.812 | 111.65 | 26.825 | 73.962 |
| 2016-03-2010:30:49 AM | 52.925 | 111.65 | 26.712 | 73.962 |
| 2016-03-2010:30:53 AM | 52.925 | 111.762 | 26.938 | 74.075 |
| 2016-03-2010:30:57 AM | 52.925 | 111.762 | 26.938 | 73.962 |
| 2016-03-2010:31:01 AM | 52.925 | 111.762 | 26.938 | 74.075 |
| 2016-03-2010:31:05 AM | 53.038 | 111.875 | 27.05 | 73.962 |
| 2016-03-2010:31:09 AM | 53.038 | 111.875 | 27.05 | 73.962 |
| 2016-03-2010:31:13 AM | 53.038 | 111.875 | 26.938 | 74.075 |
| 2016-03-2010:31:17 AM | 52.925 | 111.988 | 26.825 | 73.962 |
| 2016-03-2010:31:21 AM | 52.812 | 111.988 | 26.712 | 73.962 |
| 2016-03-2010:31:25 AM | 52.7 | 112.1 | 26.6 | 74.075 |
| 2016-03-2010:31:29 AM | 52.588 | 112.1 | 26.712 | 73.962 |
| 2016-03-2010:31:33 AM | 52.475 | 112.212 | 26.712 | 73.962 |
| 2016-03-2010:31:37 AM | 52.475 | 112.212 | 26.712 | 74.075 |
| 2016-03-2010:31:41 AM | 52.362 | 112.325 | 26.6 | 73.962 |
| 2016-03-2010:31:45 AM | 52.362 | 112.325 | 26.6 | 73.962 |
| 2016-03-2010:31:49 AM | 52.475 | 112.325 | 26.488 | 73.962 |
| 2016-03-2010:31:53 AM | 52.588 | 112.438 | 26.6 | 74.075 |
| 2016-03-2010:31:57 AM | 52.7 | 112.438 | 26.488 | 73.962 |
| 2016-03-2010:32:01 AM | 52.7 | 112.438 | 26.488 | 73.962 |
| 2016-03-2010:32:05 AM | 52.812 | 112.55 | 26.6 | 73.962 |
| 2016-03-2010:32:09 AM | 52.812 | 112.55 | 26.6 | 73.962 |
| 2016-03-2010:32:13 AM | 52.925 | 112.55 | 26.6 | 73.962 |
| 2016-03-2010:32:17 AM | 52.925 | 112.663 | 26.6 | 74.075 |
| 2016-03-2010:32:21 AM | 52.925 | 112.663 | 26.6 | 74.075 |
| 2016-03-2010:32:26 AM | 53.038 | 112.663 | 26.6 | 73.962 |
| 2016-03-2010:32:30 AM | 53.15 | 112.775 | 26.6 | 73.962 |
| 2016-03-2010:32:34 AM | 53.262 | 112.775 | 26.6 | 74.075 |
| 2016-03-2010:32:38 AM | 53.262 | 112.888 | 26.488 | 74.075 |
| 2016-03-2010:32:42 AM | 53.375 | 112.888 | 26.488 | 73.962 |
| 2016-03-2010:32:46 AM | 53.375 | 112.888 | 26.375 | 74.075 |
| 2016-03-2010:32:50 AM | 53.375 | 113 | 26.375 | 73.962 |
| 2016-03-2010:32:54 AM | 53.488 | 113 | 26.488 | 74.075 |
| 2016-03-2010:32:58 AM | 53.6 | 113.112 | 26.488 | 74.075 |
| 2016-03-2010:33:02 AM | 53.712 | 113.112 | 26.6 | 73.962 |
| 2016-03-2010:33:06 AM | 53.712 | 113.112 | 26.712 | 74.075 |
| 2016-03-2010:33:10 AM | 53.938 | 113.225 | 26.712 | 74.075 |
| 2016-03-2010:33:14 AM | 53.938 | 113.338 | 26.825 | 74.075 |
| 2016-03-2010:33:18 AM | 54.05 | 113.338 | 26.825 | 74.075 |
| 2016-03-2010:33:22 AM | 54.275 | 113.338 | 26.938 | 74.075 |
| 2016-03-2010:33:26 AM | 54.388 | 113.338 | 26.938 | 74.075 |
| 2016-03-2010:33:30 AM | 54.5 | 113.45 | 26.938 | 74.075 |
| 2016-03-2010:33:34 AM | 54.612 | 113.45 | 27.05 | 74.075 |
| 2016-03-2010:33:38 AM | 54.725 | 113.562 | 27.05 | 74.075 |
| 2016-03-2010:33:42 AM | 54.838 | 113.562 | 26.938 | 74.075 |
| 2016-03-2010:33:46 AM | 54.838 | 113.562 | 26.938 | 73.962 |
| 2016-03-2010:33:50 AM | 54.95 | 113.675 | 26.938 | 74.075 |
| 2016-03-2010:33:54 AM | 55.175 | 113.675 | 27.05 | 74.075 |
| 2016-03-2010:33:58 AM | 55.288 | 113.788 | 27.162 | 73.962 |
| 2016-03-2010:34:02 AM | 55.4 | 113.788 | 27.162 | 74.075 |
| 2016-03-2010:34:06 AM | 55.512 | 113.788 | 27.275 | 73.962 |
| 2016-03-2010:34:10 AM | 55.625 | 113.9 | 27.275 | 74.075 |
| 2016-03-2010:34:14 AM | 55.738 | 113.9 | 27.275 | 74.075 |
| 2016-03-2010:34:18 AM | 55.85 | 114.012 | 27.388 | 74.075 |
| 2016-03-2010:34:22 AM | 55.962 | 114.012 | 27.388 | 74.075 |
| 2016-03-2010:34:26 AM | 55.962 | 114.125 | 27.5 | 74.075 |
| 2016-03-2010:34:30 AM | 55.85 | 114.125 | 27.612 | 73.962 |
| 2016-03-2010:34:35 AM | 55.85 | 114.238 | 27.725 | 74.075 |
| 2016-03-2010:34:39 AM | 55.85 | 114.238 | 27.612 | 74.075 |
| 2016-03-2010:34:43 AM | 55.738 | 114.35 | 27.612 | 74.075 |
| 2016-03-2010:34:47 AM | 55.738 | 114.35 | 27.612 | 74.075 |
| 2016-03-2010:34:51 AM | 55.4 | 114.462 | 27.5 | 74.075 |
| 2016-03-2010:34:55 AM | 55.062 | 114.462 | 27.5 | 74.075 |
| 2016-03-2010:34:59 AM | 54.838 | 114.575 | 27.5 | 74.075 |
| 2016-03-2010:35:03 AM | 54.725 | 114.575 | 27.5 | 74.075 |
| 2016-03-2010:35:07 AM | 54.612 | 114.688 | 27.388 | 74.075 |
| 2016-03-2010:35:11 AM | 54.5 | 114.688 | 27.162 | 74.075 |
| 2016-03-2010:35:15 AM | 54.5 | 114.8 | 26.938 | 74.075 |
| 2016-03-2010:35:19 AM | 54.162 | 114.8 | 26.825 | 74.075 |
| 2016-03-2010:35:23 AM | 54.162 | 114.913 | 26.825 | 74.075 |
| 2016-03-2010:35:27 AM | 54.162 | 114.913 | 26.6 | 74.075 |
| 2016-03-2010:35:31 AM | 54.05 | 114.913 | 26.6 | 74.075 |
| 2016-03-2010:35:35 AM | 54.05 | 115.025 | 26.6 | 74.075 |
| 2016-03-2010:35:39 AM | 54.05 | 115.025 | 26.6 | 74.075 |
| 2016-03-2010:35:43 AM | 54.162 | 115.138 | 26.712 | 74.075 |
| 2016-03-2010:35:48 AM | 54.275 | 115.25 | 26.712 | 74.075 |
| 2016-03-2010:35:52 AM | 54.275 | 115.25 | 26.712 | 74.075 |
| 2016-03-2010:35:56 AM | 54.162 | 115.362 | 26.712 | 74.075 |
| 2016-03-2010:36:00 AM | 54.05 | 115.362 | 26.6 | 74.075 |
| 2016-03-2010:36:04 AM | 53.938 | 115.362 | 26.6 | 74.075 |
| 2016-03-2010:36:08 AM | 53.825 | 115.362 | 26.6 | 74.075 |
| 2016-03-2010:36:12 AM | 53.825 | 115.475 | 26.488 | 74.075 |
| 2016-03-2010:36:16 AM | 53.712 | 115.475 | 26.6 | 74.075 |
| 2016-03-2010:36:20 AM | 53.712 | 115.475 | 26.6 | 74.075 |
| 2016-03-2010:36:24 AM | 53.488 | 115.588 | 26.6 | 74.075 |
| 2016-03-2010:36:28 AM | 53.262 | 115.588 | 26.488 | 74.075 |
| 2016-03-2010:36:32 AM | 53.15 | 115.7 | 26.488 | 74.075 |
| 2016-03-2010:36:36 AM | 53.038 | 115.7 | 26.375 | 74.075 |
| 2016-03-2010:36:40 AM | 53.038 | 115.7 | 26.262 | 74.075 |
| 2016-03-2010:36:44 AM | 53.15 | 115.812 | 26.375 | 74.075 |
| 2016-03-2010:36:49 AM | 53.15 | 115.812 | 26.375 | 74.075 |
| 2016-03-2010:36:53 AM | 53.262 | 115.812 | 26.375 | 74.075 |
| 2016-03-2010:36:57 AM | 53.262 | 115.925 | 26.6 | 74.075 |
| 2016-03-2010:37:01 AM | 53.375 | 115.925 | 26.488 | 74.075 |
| 2016-03-2010:37:05 AM | 53.488 | 115.925 | 26.6 | 74.075 |
| 2016-03-2010:37:09 AM | 53.488 | 115.925 | 26.712 | 74.075 |
| 2016-03-2010:37:13 AM | 53.6 | 116.038 | 26.825 | 74.075 |
| 2016-03-2010:37:17 AM | 53.488 | 116.038 | 26.938 | 74.075 |
| 2016-03-2010:37:21 AM | 53.375 | 116.038 | 26.938 | 74.075 |
| 2016-03-2010:37:25 AM | 53.375 | 116.15 | 26.938 | 74.075 |
| 2016-03-2010:37:29 AM | 53.375 | 116.038 | 26.938 | 74.075 |
| 2016-03-2010:37:33 AM | 53.375 | 116.15 | 26.938 | 74.075 |
| 2016-03-2010:37:37 AM | 53.488 | 116.15 | 27.05 | 74.075 |
| 2016-03-2010:37:41 AM | 53.6 | 116.15 | 26.938 | 74.075 |
| 2016-03-2010:37:45 AM | 53.6 | 116.15 | 27.05 | 74.075 |
| 2016-03-2010:37:49 AM | 53.6 | 116.262 | 26.938 | 74.075 |
| 2016-03-2010:37:54 AM | 53.6 | 116.262 | 26.938 | 74.075 |
| 2016-03-2010:37:58 AM | 53.712 | 116.262 | 26.938 | 74.075 |
| 2016-03-2010:38:02 AM | 53.825 | 116.262 | 26.938 | 74.075 |
| 2016-03-2010:38:06 AM | 53.825 | 116.262 | 26.938 | 74.075 |
| 2016-03-2010:38:10 AM | 53.825 | 116.375 | 26.938 | 74.075 |
| 2016-03-2010:38:13 AM | 53.825 | 116.375 | 26.938 | 74.075 |
| 2016-03-2010:38:17 AM | 53.825 | 116.375 | 27.162 | 74.075 |
| 2016-03-2010:38:21 AM | 53.825 | 116.488 | 27.162 | 74.075 |
| 2016-03-2010:38:25 AM | 53.825 | 116.488 | 27.275 | 74.075 |
| 2016-03-2010:38:29 AM | 53.712 | 116.488 | 27.5 | 74.075 |
| 2016-03-2010:38:33 AM | 53.6 | 116.488 | 27.5 | 74.075 |
| 2016-03-2010:38:37 AM | 53.6 | 116.6 | 27.5 | 74.075 |
| 2016-03-2010:38:41 AM | 53.488 | 116.6 | 27.5 | 74.075 |
| 2016-03-2010:38:45 AM | 53.488 | 116.712 | 27.5 | 74.075 |
| 2016-03-2010:38:50 AM | 53.488 | 116.712 | 27.5 | 74.075 |
| 2016-03-2010:38:54 AM | 53.488 | 116.712 | 27.5 | 74.075 |
| 2016-03-2010:38:58 AM | 53.375 | 116.825 | 27.388 | 74.075 |
| 2016-03-2010:39:02 AM | 53.375 | 116.825 | 27.275 | 74.075 |
| 2016-03-2010:39:06 AM | 53.375 | 116.825 | 27.388 | 74.075 |
| 2016-03-2010:39:10 AM | 53.375 | 116.938 | 27.388 | 74.075 |
| 2016-03-2010:39:14 AM | 53.488 | 116.938 | 27.388 | 74.075 |
| 2016-03-2010:39:18 AM | 53.6 | 117.05 | 27.388 | 74.075 |
| 2016-03-2010:39:22 AM | 53.6 | 117.05 | 27.388 | 74.075 |
| 2016-03-2010:39:26 AM | 53.6 | 117.05 | 27.275 | 74.075 |
| 2016-03-2010:39:30 AM | 53.712 | 117.163 | 27.162 | 74.075 |
| 2016-03-2010:39:34 AM | 53.712 | 117.163 | 27.162 | 74.075 |
| 2016-03-2010:39:38 AM | 53.825 | 117.275 | 27.162 | 74.075 |
| 2016-03-2010:39:42 AM | 53.938 | 117.275 | 27.05 | 74.075 |
| 2016-03-2010:39:46 AM | 54.05 | 117.388 | 27.05 | 74.075 |
| 2016-03-2010:39:51 AM | 54.05 | 117.388 | 27.162 | 74.188 |
| 2016-03-2010:39:55 AM | 54.05 | 117.388 | 27.275 | 74.075 |
| 2016-03-2010:39:59 AM | 54.162 | 117.388 | 27.388 | 74.188 |
| 2016-03-2010:40:03 AM | 54.162 | 117.5 | 27.388 | 74.075 |
| 2016-03-2010:40:07 AM | 54.388 | 117.5 | 27.5 | 74.075 |
| 2016-03-2010:40:11 AM | 54.388 | 117.5 | 27.612 | 74.075 |
| 2016-03-2010:40:15 AM | 54.5 | 117.612 | 27.725 | 74.075 |
| 2016-03-2010:40:19 AM | 54.612 | 117.612 | 27.725 | 74.075 |
| 2016-03-2010:40:23 AM | 54.612 | 117.725 | 27.725 | 74.075 |
| 2016-03-2010:40:27 AM | 54.612 | 117.612 | 27.838 | 74.075 |
| 2016-03-2010:40:31 AM | 54.612 | 117.612 | 27.95 | 74.075 |
| 2016-03-2010:40:35 AM | 54.612 | 117.725 | 27.95 | 74.188 |
| 2016-03-2010:40:39 AM | 54.5 | 117.725 | 27.95 | 74.075 |
| 2016-03-2010:40:43 AM | 54.388 | 117.838 | 27.95 | 74.188 |
| 2016-03-2010:40:47 AM | 54.275 | 117.838 | 27.838 | 74.075 |
| 2016-03-2010:40:51 AM | 54.275 | 117.95 | 27.838 | 74.188 |
| 2016-03-2010:40:56 AM | 54.388 | 117.95 | 27.838 | 74.188 |
| 2016-03-2010:41:00 AM | 54.388 | 117.95 | 27.838 | 74.188 |
| 2016-03-2010:41:04 AM | 54.388 | 118.062 | 27.95 | 74.075 |
| 2016-03-2010:41:08 AM | 54.388 | 118.062 | 27.95 | 74.188 |
| 2016-03-2010:41:12 AM | 54.275 | 118.062 | 27.95 | 74.188 |
| 2016-03-2010:41:16 AM | 54.275 | 118.175 | 28.062 | 74.188 |
| 2016-03-2010:41:20 AM | 54.275 | 118.175 | 28.062 | 74.188 |
| 2016-03-2010:41:24 AM | 54.275 | 118.175 | 28.175 | 74.188 |
| 2016-03-2010:41:28 AM | 54.275 | 118.288 | 28.175 | 74.188 |
| 2016-03-2010:41:32 AM | 54.275 | 118.288 | 28.175 | 74.188 |
| 2016-03-2010:41:36 AM | 54.275 | 118.288 | 28.288 | 74.188 |
| 2016-03-2010:41:40 AM | 54.388 | 118.4 | 28.4 | 74.188 |
| 2016-03-2010:41:44 AM | 54.5 | 118.512 | 28.4 | 74.188 |
| 2016-03-2010:41:48 AM | 54.612 | 118.512 | 28.512 | 74.188 |
| 2016-03-2010:41:52 AM | 54.725 | 118.512 | 28.512 | 74.188 |
| 2016-03-2010:41:57 AM | 54.838 | 118.625 | 28.512 | 74.188 |
| 2016-03-2010:42:01 AM | 54.725 | 118.625 | 28.4 | 74.188 |
| 2016-03-2010:42:05 AM | 54.612 | 118.738 | 28.512 | 74.188 |
| 2016-03-2010:42:09 AM | 54.5 | 118.738 | 28.512 | 74.188 |
| 2016-03-2010:42:13 AM | 54.5 | 118.738 | 28.625 | 74.188 |
| 2016-03-2010:42:17 AM | 54.5 | 118.85 | 28.85 | 74.188 |
| 2016-03-2010:42:21 AM | 54.5 | 118.85 | 28.738 | 74.188 |
| 2016-03-2010:42:25 AM | 54.388 | 118.85 | 28.738 | 74.188 |
| 2016-03-2010:42:29 AM | 54.5 | 118.962 | 28.738 | 74.188 |
| 2016-03-2010:42:33 AM | 54.5 | 118.962 | 28.625 | 74.188 |
| 2016-03-2010:42:37 AM | 54.388 | 118.962 | 28.512 | 74.188 |
| 2016-03-2010:42:41 AM | 54.388 | 119.075 | 28.512 | 74.188 |
| 2016-03-2010:42:45 AM | 54.388 | 119.075 | 28.512 | 74.188 |
| 2016-03-2010:42:49 AM | 54.388 | 119.188 | 28.512 | 74.188 |
| 2016-03-2010:42:53 AM | 54.5 | 119.188 | 28.288 | 74.188 |
| 2016-03-2010:42:57 AM | 54.275 | 119.188 | 28.062 | 74.188 |
| 2016-03-2010:43:02 AM | 54.275 | 119.3 | 27.838 | 74.188 |
| 2016-03-2010:43:06 AM | 54.275 | 119.3 | 27.725 | 74.188 |
| 2016-03-2010:43:10 AM | 54.388 | 119.413 | 27.725 | 74.188 |
| 2016-03-2010:43:14 AM | 54.275 | 119.413 | 27.725 | 74.3 |
| 2016-03-2010:43:18 AM | 54.162 | 119.525 | 27.725 | 74.188 |
| 2016-03-2010:43:22 AM | 53.938 | 119.525 | 27.725 | 74.188 |
| 2016-03-2010:43:26 AM | 53.825 | 119.525 | 27.612 | 74.188 |
| 2016-03-2010:43:30 AM | 53.825 | 119.638 | 27.612 | 74.188 |
| 2016-03-2010:43:34 AM | 53.825 | 119.638 | 27.612 | 74.188 |
| 2016-03-2010:43:38 AM | 53.825 | 119.75 | 27.612 | 74.188 |
| 2016-03-2010:43:42 AM | 53.825 | 119.75 | 27.725 | 74.188 |
| 2016-03-2010:43:46 AM | 53.825 | 119.862 | 27.838 | 74.3 |
| 2016-03-2010:43:50 AM | 54.05 | 119.862 | 27.725 | 74.188 |
| 2016-03-2010:43:54 AM | 54.05 | 119.862 | 27.725 | 74.188 |
| 2016-03-2010:43:58 AM | 54.162 | 119.862 | 27.612 | 74.188 |
| 2016-03-2010:44:02 AM | 54.275 | 119.975 | 27.612 | 74.188 |
| 2016-03-2010:44:06 AM | 54.388 | 119.975 | 27.612 | 74.3 |
| 2016-03-2010:44:10 AM | 54.5 | 120.088 | 27.5 | 74.188 |
| 2016-03-2010:44:14 AM | 54.612 | 120.088 | 27.5 | 74.3 |
| 2016-03-2010:44:18 AM | 54.612 | 120.2 | 27.612 | 74.188 |
| 2016-03-2010:44:22 AM | 54.612 | 120.2 | 27.612 | 74.188 |
| 2016-03-2010:44:27 AM | 54.725 | 120.2 | 27.5 | 74.3 |
| 2016-03-2010:44:31 AM | 54.725 | 120.312 | 27.388 | 74.3 |
| 2016-03-2010:44:35 AM | 54.838 | 120.312 | 27.275 | 74.188 |
| 2016-03-2010:44:39 AM | 54.95 | 120.312 | 27.388 | 74.3 |
| 2016-03-2010:44:43 AM | 54.838 | 120.425 | 27.5 | 74.3 |
| 2016-03-2010:44:47 AM | 54.838 | 120.425 | 27.612 | 74.3 |
| 2016-03-2010:44:51 AM | 54.95 | 120.538 | 27.725 | 74.188 |
| 2016-03-2010:44:55 AM | 54.95 | 120.538 | 27.725 | 74.3 |
| 2016-03-2010:44:59 AM | 54.838 | 120.538 | 27.838 | 74.3 |
| 2016-03-2010:45:03 AM | 54.838 | 120.538 | 27.725 | 74.3 |
| 2016-03-2010:45:07 AM | 54.725 | 120.65 | 27.725 | 74.188 |
| 2016-03-2010:45:11 AM | 54.612 | 120.65 | 27.725 | 74.3 |
| 2016-03-2010:45:15 AM | 54.612 | 120.65 | 27.612 | 74.3 |
| 2016-03-2010:45:19 AM | 54.725 | 120.762 | 27.5 | 74.3 |
| 2016-03-2010:45:23 AM | 54.612 | 120.762 | 27.5 | 74.3 |
| 2016-03-2010:45:27 AM | 54.725 | 120.762 | 27.388 | 74.3 |
| 2016-03-2010:45:31 AM | 54.725 | 120.762 | 27.388 | 74.3 |
| 2016-03-2010:45:35 AM | 54.838 | 120.875 | 27.275 | 74.3 |
| 2016-03-2010:45:40 AM | 54.838 | 120.875 | 27.275 | 74.3 |
| 2016-03-2010:45:44 AM | 54.838 | 120.988 | 27.05 | 74.3 |
| 2016-03-2010:45:48 AM | 55.062 | 120.988 | 26.938 | 74.3 |
| 2016-03-2010:45:52 AM | 55.175 | 120.988 | 26.938 | 74.3 |
| 2016-03-2010:45:56 AM | 55.288 | 120.988 | 26.938 | 74.3 |
| 2016-03-2010:46:00 AM | 55.512 | 121.1 | 26.825 | 74.3 |
| 2016-03-2010:46:04 AM | 55.625 | 121.1 | 26.938 | 74.3 |
| 2016-03-2010:46:08 AM | 55.85 | 121.1 | 26.938 | 74.3 |
| 2016-03-2010:46:12 AM | 55.85 | 121.212 | 27.05 | 74.3 |
| 2016-03-2010:46:16 AM | 55.962 | 121.212 | 27.05 | 74.3 |
| 2016-03-2010:46:20 AM | 56.075 | 121.212 | 27.162 | 74.3 |
| 2016-03-2010:46:24 AM | 56.188 | 121.212 | 27.275 | 74.3 |
| 2016-03-2010:46:28 AM | 56.188 | 121.212 | 27.275 | 74.3 |
| 2016-03-2010:46:32 AM | 56.3 | 121.325 | 27.275 | 74.3 |
| 2016-03-2010:46:36 AM | 56.412 | 121.325 | 27.388 | 74.188 |
| 2016-03-2010:46:41 AM | 56.525 | 121.438 | 27.388 | 74.3 |
| 2016-03-2010:46:45 AM | 56.525 | 121.438 | 27.5 | 74.3 |
| 2016-03-2010:46:49 AM | 56.638 | 121.438 | 27.612 | 74.3 |
| 2016-03-2010:46:53 AM | 56.638 | 121.438 | 27.725 | 74.3 |
| 2016-03-2010:46:57 AM | 56.525 | 121.438 | 27.838 | 74.3 |
| 2016-03-2010:47:01 AM | 56.638 | 121.55 | 27.95 | 74.3 |
| 2016-03-2010:47:05 AM | 56.638 | 121.55 | 28.062 | 74.3 |
| 2016-03-2010:47:09 AM | 56.75 | 121.55 | 28.062 | 74.3 |
| 2016-03-2010:47:13 AM | 56.75 | 121.55 | 28.175 | 74.3 |
| 2016-03-2010:47:17 AM | 56.75 | 121.663 | 28.288 | 74.3 |
| 2016-03-2010:47:21 AM | 56.75 | 121.663 | 28.4 | 74.3 |
| 2016-03-2010:47:25 AM | 56.862 | 121.663 | 28.512 | 74.3 |
| 2016-03-2010:47:29 AM | 56.638 | 121.663 | 28.512 | 74.3 |
| 2016-03-2010:47:33 AM | 56.638 | 121.775 | 28.512 | 74.412 |
| 2016-03-2010:47:37 AM | 56.638 | 121.775 | 28.512 | 74.3 |
| 2016-03-2010:47:41 AM | 56.75 | 121.888 | 28.625 | 74.3 |
| 2016-03-2010:47:46 AM | 56.638 | 121.888 | 28.625 | 74.3 |
| 2016-03-2010:47:50 AM | 56.75 | 121.888 | 28.512 | 74.3 |
| 2016-03-2010:47:54 AM | 56.75 | 122 | 28.4 | 74.3 |
| 2016-03-2010:47:58 AM | 56.862 | 122 | 28.288 | 74.3 |
| 2016-03-2010:48:02 AM | 57.088 | 122 | 28.175 | 74.3 |
| 2016-03-2010:48:06 AM | 57.2 | 122.112 | 28.175 | 74.3 |
| 2016-03-2010:48:10 AM | 57.312 | 122.112 | 28.062 | 74.3 |
| 2016-03-2010:48:14 AM | 57.312 | 122.225 | 28.175 | 74.3 |
| 2016-03-2010:48:17 AM | 57.425 | 122.225 | 28.175 | 74.3 |
| 2016-03-2010:48:21 AM | 57.538 | 122.225 | 28.175 | 74.188 |
| 2016-03-2010:48:25 AM | 57.65 | 122.338 | 28.288 | 74.3 |
| 2016-03-2010:48:29 AM | 57.762 | 122.338 | 28.288 | 74.3 |
| 2016-03-2010:48:33 AM | 57.762 | 122.338 | 28.4 | 74.3 |
| 2016-03-2010:48:37 AM | 57.762 | 122.45 | 28.512 | 74.3 |
| 2016-03-2010:48:42 AM | 57.875 | 122.45 | 28.512 | 74.3 |
| 2016-03-2010:48:46 AM | 57.988 | 122.45 | 28.4 | 74.3 |
| 2016-03-2010:48:50 AM | 58.212 | 122.562 | 28.4 | 74.3 |
| 2016-03-2010:48:54 AM | 58.438 | 122.562 | 28.4 | 74.3 |
| 2016-03-2010:48:58 AM | 58.438 | 122.562 | 28.4 | 74.3 |
| 2016-03-2010:49:02 AM | 58.662 | 122.675 | 28.4 | 74.3 |
| 2016-03-2010:49:06 AM | 58.662 | 122.675 | 28.512 | 74.3 |
| 2016-03-2010:49:10 AM | 58.775 | 122.675 | 28.625 | 74.412 |
| 2016-03-2010:49:14 AM | 58.888 | 122.788 | 28.738 | 74.3 |
| 2016-03-2010:49:18 AM | 58.888 | 122.788 | 28.625 | 74.3 |
| 2016-03-2010:49:22 AM | 59 | 122.788 | 28.512 | 74.412 |
| 2016-03-2010:49:26 AM | 59 | 122.9 | 28.288 | 74.412 |
| 2016-03-2010:49:30 AM | 59 | 122.9 | 28.288 | 74.412 |
| 2016-03-2010:49:34 AM | 59 | 123.012 | 28.288 | 74.412 |
| 2016-03-2010:49:38 AM | 59 | 123.012 | 28.288 | 74.412 |
| 2016-03-2010:49:42 AM | 58.888 | 123.125 | 28.175 | 74.412 |
| 2016-03-2010:49:47 AM | 58.888 | 123.125 | 28.288 | 74.412 |
| 2016-03-2010:49:50 AM | 58.775 | 123.238 | 28.288 | 74.412 |
| 2016-03-2010:49:54 AM | 58.775 | 123.238 | 28.288 | 74.412 |
| 2016-03-2010:49:58 AM | 58.888 | 123.35 | 28.288 | 74.412 |
| 2016-03-2010:50:02 AM | 58.888 | 123.462 | 28.175 | 74.412 |
| 2016-03-2010:50:06 AM | 59.112 | 123.462 | 28.062 | 74.412 |
| 2016-03-2010:50:10 AM | 59.112 | 123.688 | 28.062 | 74.412 |
| 2016-03-2010:50:14 AM | 59.112 | 123.688 | 28.062 | 74.412 |
| 2016-03-2010:50:18 AM | 59.225 | 123.688 | 28.062 | 74.412 |
| 2016-03-2010:50:22 AM | 59.338 | 123.688 | 27.95 | 74.412 |
| 2016-03-2010:50:26 AM | 59.45 | 123.8 | 27.838 | 74.412 |
| 2016-03-2010:50:30 AM | 59.562 | 123.8 | 27.725 | 74.412 |
| 2016-03-2010:50:35 AM | 59.562 | 123.913 | 27.612 | 74.412 |
| 2016-03-2010:50:39 AM | 59.675 | 123.913 | 27.612 | 74.412 |
| 2016-03-2010:50:43 AM | 59.788 | 124.025 | 27.612 | 74.412 |
| 2016-03-2010:50:47 AM | 59.9 | 124.025 | 27.612 | 74.412 |
| 2016-03-2010:50:51 AM | 59.9 | 124.138 | 27.725 | 74.412 |
| 2016-03-2010:50:55 AM | 59.9 | 124.138 | 27.725 | 74.412 |
| 2016-03-2010:50:59 AM | 59.788 | 124.138 | 27.725 | 74.412 |
| 2016-03-2010:51:03 AM | 59.788 | 124.25 | 27.725 | 74.412 |
| 2016-03-2010:51:07 AM | 59.788 | 124.25 | 27.838 | 74.412 |
| 2016-03-2010:51:11 AM | 59.788 | 124.25 | 27.838 | 74.412 |
| 2016-03-2010:51:15 AM | 59.788 | 124.25 | 27.95 | 74.412 |
| 2016-03-2010:51:19 AM | 59.9 | 124.362 | 28.062 | 74.412 |
| 2016-03-2010:51:23 AM | 59.788 | 124.362 | 28.175 | 74.412 |
| 2016-03-2010:51:27 AM | 59.9 | 124.475 | 28.175 | 74.412 |
| 2016-03-2010:51:31 AM | 60.012 | 124.475 | 28.288 | 74.412 |
| 2016-03-2010:51:35 AM | 60.125 | 124.475 | 28.288 | 74.412 |
| 2016-03-2010:51:40 AM | 60.238 | 124.588 | 28.4 | 74.525 |
| 2016-03-2010:51:44 AM | 60.238 | 124.588 | 28.4 | 74.412 |
| 2016-03-2010:51:48 AM | 60.462 | 124.588 | 28.4 | 74.412 |
| 2016-03-2010:51:52 AM | 60.462 | 124.588 | 28.512 | 74.525 |
| 2016-03-2010:51:56 AM | 60.575 | 124.7 | 28.512 | 74.412 |
| 2016-03-2010:52:00 AM | 60.35 | 124.7 | 28.625 | 74.525 |
| 2016-03-2010:52:04 AM | 60.35 | 124.7 | 28.738 | 74.525 |
| 2016-03-2010:52:08 AM | 60.35 | 124.812 | 28.738 | 74.525 |
| 2016-03-2010:52:12 AM | 60.35 | 124.812 | 28.85 | 74.525 |
| 2016-03-2010:52:16 AM | 60.35 | 124.925 | 28.85 | 74.412 |
| 2016-03-2010:52:20 AM | 60.35 | 124.925 | 28.85 | 74.525 |
| 2016-03-2010:52:24 AM | 60.238 | 124.925 | 28.738 | 74.525 |
| 2016-03-2010:52:28 AM | 60.35 | 125.038 | 28.738 | 74.525 |
| 2016-03-2010:52:32 AM | 60.35 | 125.038 | 28.738 | 74.525 |
| 2016-03-2010:52:36 AM | 60.462 | 125.15 | 28.85 | 74.525 |
| 2016-03-2010:52:40 AM | 60.462 | 125.15 | 28.962 | 74.525 |
| 2016-03-2010:52:45 AM | 60.462 | 125.15 | 28.962 | 74.525 |
| 2016-03-2010:52:52 AM | 60.35 | 125.262 | 28.738 | 74.525 |
| 2016-03-2010:52:56 AM | 60.35 | 125.262 | 28.738 | 74.525 |
| 2016-03-2010:53:00 AM | 60.238 | 125.262 | 28.738 | 74.525 |
| 2016-03-2010:53:05 AM | 60.35 | 125.375 | 28.738 | 74.525 |
| 2016-03-2010:53:09 AM | 60.238 | 125.375 | 28.625 | 74.525 |
| 2016-03-2010:53:13 AM | 60.238 | 125.488 | 28.625 | 74.525 |
| 2016-03-2010:53:17 AM | 60.125 | 125.6 | 28.625 | 74.525 |
| 2016-03-2010:53:21 AM | 60.125 | 125.6 | 28.738 | 74.525 |
| 2016-03-2010:53:25 AM | 60.125 | 125.6 | 28.625 | 74.525 |
| 2016-03-2010:53:32 AM | 60.125 | 125.712 | 28.625 | 74.525 |
| 2016-03-2010:53:36 AM | 60.238 | 125.712 | 28.625 | 74.525 |
| 2016-03-2010:53:40 AM | 60.238 | 125.712 | 28.512 | 74.525 |
| 2016-03-2010:53:44 AM | 60.35 | 125.825 | 28.512 | 74.525 |
| 2016-03-2010:53:48 AM | 60.462 | 125.825 | 28.512 | 74.525 |
| 2016-03-2010:53:52 AM | 60.462 | 125.825 | 28.4 | 74.525 |
| 2016-03-2010:53:56 AM | 60.35 | 125.938 | 28.512 | 74.525 |
| 2016-03-2010:54:00 AM | 60.238 | 125.938 | 28.4 | 74.525 |
| 2016-03-2010:54:05 AM | 60.125 | 126.05 | 28.4 | 74.525 |
| 2016-03-2010:54:09 AM | 60.012 | 126.05 | 28.288 | 74.525 |
| 2016-03-2010:54:13 AM | 59.788 | 126.05 | 28.288 | 74.525 |
| 2016-03-2010:54:17 AM | 59.788 | 126.163 | 28.288 | 74.525 |
| 2016-03-2010:54:21 AM | 59.45 | 126.275 | 28.288 | 74.525 |
| 2016-03-2010:54:25 AM | 59.45 | 126.275 | 28.288 | 74.525 |
| 2016-03-2010:54:29 AM | 59.45 | 126.275 | 28.4 | 74.525 |
| 2016-03-2010:54:33 AM | 59.45 | 126.388 | 28.625 | 74.525 |
| 2016-03-2010:54:37 AM | 59.225 | 126.388 | 28.625 | 74.525 |
| 2016-03-2010:54:41 AM | 59.112 | 126.5 | 28.625 | 74.525 |
| 2016-03-2010:54:45 AM | 59 | 126.5 | 28.625 | 74.525 |
| 2016-03-2010:54:49 AM | 58.888 | 126.5 | 28.625 | 74.525 |
| 2016-03-2010:54:53 AM | 58.662 | 126.612 | 28.512 | 74.525 |
| 2016-03-2010:54:57 AM | 58.662 | 126.612 | 28.512 | 74.525 |
| 2016-03-2010:55:05 AM | 58.55 | 126.612 | 28.512 | 74.525 |
| 2016-03-2010:55:09 AM | 58.438 | 126.725 | 28.512 | 74.525 |
| 2016-03-2010:55:14 AM | 58.1 | 126.725 | 28.625 | 74.525 |
| 2016-03-2010:55:18 AM | 57.988 | 126.838 | 28.625 | 74.525 |
| 2016-03-2010:55:22 AM | 57.875 | 126.838 | 28.625 | 74.525 |
| 2016-03-2010:55:26 AM | 57.875 | 126.838 | 28.512 | 74.525 |
| 2016-03-2010:55:30 AM | 57.762 | 126.838 | 28.288 | 74.525 |
| 2016-03-2010:55:34 AM | 57.65 | 126.838 | 28.062 | 74.525 |
| 2016-03-2010:55:38 AM | 57.538 | 126.95 | 27.95 | 74.525 |
| 2016-03-2010:55:42 AM | 57.538 | 126.95 | 27.838 | 74.525 |
| 2016-03-2010:55:46 AM | 57.312 | 126.95 | 27.838 | 74.638 |
| 2016-03-2010:55:50 AM | 57.2 | 126.95 | 27.725 | 74.525 |
| 2016-03-2010:55:54 AM | 57.088 | 127.062 | 27.838 | 74.638 |
| 2016-03-2010:55:58 AM | 57.2 | 127.062 | 27.838 | 74.525 |
| 2016-03-2010:56:02 AM | 57.312 | 127.062 | 27.838 | 74.525 |
| 2016-03-2010:56:06 AM | 57.312 | 127.062 | 27.838 | 74.638 |
| 2016-03-2010:56:09 AM | 57.538 | 127.175 | 27.838 | 74.525 |
| 2016-03-2010:56:17 AM | 57.538 | 127.175 | 27.95 | 74.525 |
| 2016-03-2010:56:21 AM | 57.65 | 127.175 | 28.062 | 74.525 |
| 2016-03-2010:56:26 AM | 57.762 | 127.175 | 28.062 | 74.638 |
| 2016-03-2010:56:30 AM | 57.762 | 127.288 | 28.175 | 74.638 |
| 2016-03-2010:56:34 AM | 57.762 | 127.288 | 28.288 | 74.525 |
| 2016-03-2010:56:38 AM | 57.875 | 127.288 | 28.288 | 74.638 |
| 2016-03-2010:56:42 AM | 57.988 | 127.288 | 28.288 | 74.638 |
| 2016-03-2010:56:46 AM | 58.212 | 127.4 | 28.288 | 74.638 |
| 2016-03-2010:56:54 AM | 58.212 | 127.4 | 28.062 | 74.638 |
| 2016-03-2010:56:58 AM | 58.325 | 127.4 | 28.062 | 74.525 |
| 2016-03-2010:57:02 AM | 58.438 | 127.4 | 28.175 | 74.638 |
| 2016-03-2010:57:06 AM | 58.438 | 127.4 | 28.175 | 74.638 |
| 2016-03-2010:57:10 AM | 58.438 | 127.4 | 28.288 | 74.638 |
| 2016-03-2010:57:14 AM | 58.325 | 127.512 | 28.288 | 74.638 |
| 2016-03-2010:57:18 AM | 58.438 | 127.512 | 28.175 | 74.638 |
| 2016-03-2010:57:22 AM | 58.438 | 127.512 | 28.062 | 74.525 |
| 2016-03-2010:57:26 AM | 58.55 | 127.512 | 28.062 | 74.525 |
| 2016-03-2010:57:30 AM | 58.662 | 127.625 | 27.95 | 74.638 |
| 2016-03-2010:57:35 AM | 58.775 | 127.625 | 27.838 | 74.525 |
| 2016-03-2010:57:39 AM | 58.775 | 127.625 | 27.725 | 74.525 |
| 2016-03-2010:57:47 AM | 59.112 | 127.625 | 27.612 | 74.638 |
| 2016-03-2010:57:51 AM | 59.225 | 127.625 | 27.5 | 74.525 |
| 2016-03-2010:57:55 AM | 59.225 | 127.625 | 27.612 | 74.525 |
| 2016-03-2010:57:59 AM | 59.338 | 127.738 | 27.5 | 74.525 |
| 2016-03-2010:58:03 AM | 59.45 | 127.738 | 27.612 | 74.638 |
| 2016-03-2010:58:07 AM | 59.562 | 127.738 | 27.612 | 74.525 |
| 2016-03-2010:58:11 AM | 59.562 | 127.738 | 27.725 | 74.638 |
| 2016-03-2010:58:15 AM | 59.675 | 127.85 | 27.838 | 74.638 |
| 2016-03-2010:58:19 AM | 59.788 | 127.85 | 27.95 | 74.638 |
| 2016-03-2010:58:23 AM | 59.9 | 127.85 | 28.062 | 74.525 |
| 2016-03-2010:58:27 AM | 60.012 | 127.962 | 28.175 | 74.525 |
| 2016-03-2010:58:31 AM | 60.125 | 127.962 | 28.288 | 74.525 |
| 2016-03-2010:58:35 AM | 60.238 | 127.962 | 28.175 | 74.525 |
| 2016-03-2010:58:39 AM | 60.238 | 127.962 | 28.175 | 74.525 |
| 2016-03-2010:58:43 AM | 60.238 | 127.962 | 28.288 | 74.638 |
| 2016-03-2010:58:47 AM | 60.35 | 127.962 | 28.175 | 74.638 |
| 2016-03-2010:58:51 AM | 60.35 | 128.075 | 28.175 | 74.525 |
| 2016-03-2010:58:56 AM | 60.35 | 128.075 | 28.175 | 74.638 |
| 2016-03-2010:59:00 AM | 60.462 | 128.075 | 28.175 | 74.638 |
| 2016-03-2010:59:04 AM | 60.462 | 128.075 | 28.175 | 74.525 |
| 2016-03-2010:59:08 AM | 60.462 | 128.188 | 28.175 | 74.638 |
| 2016-03-2010:59:12 AM | 60.462 | 128.188 | 28.175 | 74.525 |
| 2016-03-2010:59:16 AM | 60.35 | 128.3 | 28.288 | 74.638 |
| 2016-03-2010:59:20 AM | 60.462 | 128.3 | 28.288 | 74.525 |
| 2016-03-2010:59:24 AM | 60.462 | 128.3 | 28.288 | 74.638 |
| 2016-03-2010:59:28 AM | 60.575 | 128.3 | 28.4 | 74.638 |
| 2016-03-2010:59:32 AM | 60.575 | 128.412 | 28.512 | 74.638 |
| 2016-03-2010:59:36 AM | 60.575 | 128.412 | 28.625 | 74.638 |
| 2016-03-2010:59:40 AM | 60.575 | 128.412 | 28.625 | 74.638 |
| 2016-03-2010:59:44 AM | 60.462 | 128.525 | 28.738 | 74.638 |
| 2016-03-2010:59:52 AM | 60.462 | 128.525 | 28.738 | 74.638 |
| 2016-03-2010:59:56 AM | 60.35 | 128.637 | 28.738 | 74.638 |
| 2016-03-2011:00:01 AM | 60.238 | 128.637 | 28.738 | 74.638 |
| 2016-03-2011:00:05 AM | 60.35 | 128.637 | 28.738 | 74.638 |
| 2016-03-2011:00:09 AM | 60.35 | 128.75 | 28.85 | 74.638 |
| 2016-03-2011:00:13 AM | 60.35 | 128.75 | 28.85 | 74.638 |
| 2016-03-2011:00:17 AM | 60.238 | 128.863 | 28.85 | 74.638 |
| 2016-03-2011:00:21 AM | 60.238 | 128.863 | 28.962 | 74.638 |
| 2016-03-2011:00:25 AM | 60.125 | 128.863 | 28.962 | 74.638 |
| 2016-03-2011:00:29 AM | 60.125 | 128.975 | 29.075 | 74.638 |
| 2016-03-2011:00:33 AM | 60.125 | 128.975 | 28.962 | 74.638 |
| 2016-03-2011:00:37 AM | 60.238 | 128.975 | 28.85 | 74.638 |
| 2016-03-2011:00:41 AM | 60.238 | 129.088 | 28.738 | 74.638 |
| 2016-03-2011:00:45 AM | 60.238 | 129.088 | 28.738 | 74.638 |
| 2016-03-2011:00:49 AM | 60.125 | 129.088 | 28.625 | 74.638 |
| 2016-03-2011:00:53 AM | 60.125 | 129.088 | 28.738 | 74.638 |
| 2016-03-2011:00:56 AM | 60.012 | 129.2 | 28.625 | 74.638 |
| 2016-03-2011:01:00 AM | 60.012 | 129.2 | 28.738 | 74.638 |
| 2016-03-2011:01:05 AM | 59.9 | 129.312 | 28.85 | 74.638 |
| 2016-03-2011:01:09 AM | 59.9 | 129.312 | 28.85 | 74.638 |
| 2016-03-2011:01:13 AM | 59.788 | 129.312 | 28.738 | 74.638 |
| 2016-03-2011:01:17 AM | 59.675 | 129.425 | 28.738 | 74.638 |
| 2016-03-2011:01:21 AM | 59.675 | 129.425 | 28.625 | 74.638 |
| 2016-03-2011:01:25 AM | 59.562 | 129.425 | 28.512 | 74.75 |
| 2016-03-2011:01:29 AM | 59.338 | 129.425 | 28.512 | 74.75 |
| 2016-03-2011:01:33 AM | 59.338 | 129.538 | 28.625 | 74.638 |
| 2016-03-2011:01:37 AM | 59.225 | 129.538 | 28.738 | 74.638 |
| 2016-03-2011:01:41 AM | 59.112 | 129.538 | 28.738 | 74.638 |
| 2016-03-2011:01:45 AM | 59 | 129.538 | 28.738 | 74.638 |
| 2016-03-2011:01:49 AM | 58.888 | 129.538 | 28.625 | 74.638 |
| 2016-03-2011:01:53 AM | 58.662 | 129.538 | 28.4 | 74.75 |
| 2016-03-2011:01:57 AM | 58.55 | 129.538 | 28.4 | 74.75 |
| 2016-03-2011:02:01 AM | 58.438 | 129.65 | 28.4 | 74.75 |
| 2016-03-2011:02:05 AM | 58.55 | 129.65 | 28.512 | 74.75 |
| 2016-03-2011:02:12 AM | 58.662 | 129.65 | 28.625 | 74.75 |
| 2016-03-2011:02:16 AM | 58.775 | 129.65 | 28.738 | 74.75 |
| 2016-03-2011:02:21 AM | 58.888 | 129.762 | 28.738 | 74.75 |
| 2016-03-2011:02:25 AM | 59 | 129.762 | 28.85 | 74.75 |
| 2016-03-2011:02:29 AM | 59.225 | 129.762 | 28.962 | 74.75 |
| 2016-03-2011:02:33 AM | 59.338 | 129.762 | 29.075 | 74.75 |
| 2016-03-2011:02:37 AM | 59.562 | 129.762 | 29.188 | 74.75 |
| 2016-03-2011:02:41 AM | 59.562 | 129.875 | 29.188 | 74.75 |
| 2016-03-2011:02:45 AM | 59.675 | 129.875 | 29.3 | 74.75 |
| 2016-03-2011:02:49 AM | 59.675 | 129.875 | 29.412 | 74.75 |
| 2016-03-2011:02:53 AM | 59.788 | 129.875 | 29.412 | 74.75 |
| 2016-03-2011:02:57 AM | 59.788 | 129.875 | 29.525 | 74.75 |
| 2016-03-2011:03:01 AM | 60.012 | 129.988 | 29.525 | 74.75 |
| 2016-03-2011:03:05 AM | 60.238 | 129.988 | 29.525 | 74.75 |
| 2016-03-2011:03:09 AM | 60.35 | 129.988 | 29.412 | 74.75 |
| 2016-03-2011:03:13 AM | 60.35 | 129.988 | 29.412 | 74.75 |
| 2016-03-2011:03:17 AM | 60.462 | 130.1 | 29.525 | 74.75 |
| 2016-03-2011:03:21 AM | 60.575 | 130.1 | 29.525 | 74.75 |
| 2016-03-2011:03:25 AM | 60.688 | 130.1 | 29.638 | 74.75 |
| 2016-03-2011:03:29 AM | 60.688 | 130.1 | 29.75 | 74.75 |
| 2016-03-2011:03:33 AM | 60.8 | 130.1 | 29.862 | 74.75 |
| 2016-03-2011:03:36 AM | 61.025 | 130.212 | 29.975 | 74.75 |
| 2016-03-2011:03:40 AM | 61.025 | 130.212 | 30.088 | 74.75 |
| 2016-03-2011:03:44 AM | 61.138 | 130.325 | 30.2 | 74.75 |
| 2016-03-2011:03:49 AM | 61.025 | 130.325 | 30.2 | 74.75 |
| 2016-03-2011:03:53 AM | 61.025 | 130.438 | 30.312 | 74.75 |
| 2016-03-2011:03:57 AM | 61.025 | 130.438 | 30.312 | 74.75 |
| 2016-03-2011:04:01 AM | 61.025 | 130.438 | 30.312 | 74.75 |
| 2016-03-2011:04:05 AM | 61.138 | 130.55 | 30.2 | 74.75 |
| 2016-03-2011:04:09 AM | 61.25 | 130.55 | 29.975 | 74.75 |
| 2016-03-2011:04:13 AM | 61.25 | 130.55 | 29.862 | 74.75 |
| 2016-03-2011:04:17 AM | 61.25 | 130.662 | 29.75 | 74.75 |
| 2016-03-2011:04:21 AM | 61.363 | 130.662 | 29.638 | 74.75 |
| 2016-03-2011:04:25 AM | 61.363 | 130.662 | 29.525 | 74.75 |
| 2016-03-2011:04:29 AM | 61.363 | 130.775 | 29.525 | 74.75 |
| 2016-03-2011:04:33 AM | 61.475 | 130.775 | 29.525 | 74.75 |
| 2016-03-2011:04:37 AM | 61.588 | 130.887 | 29.638 | 74.75 |
| 2016-03-2011:04:41 AM | 61.7 | 130.887 | 29.75 | 74.75 |
| 2016-03-2011:04:45 AM | 61.7 | 130.887 | 29.862 | 74.75 |
| 2016-03-2011:04:49 AM | 61.812 | 131 | 29.862 | 74.75 |
| 2016-03-2011:04:53 AM | 61.812 | 131 | 29.862 | 74.75 |
| 2016-03-2011:04:57 AM | 61.925 | 131 | 29.862 | 74.75 |
| 2016-03-2011:05:01 AM | 62.038 | 131.112 | 29.862 | 74.75 |
| 2016-03-2011:05:05 AM | 61.925 | 131.112 | 29.862 | 74.75 |
| 2016-03-2011:05:09 AM | 61.925 | 131.225 | 29.975 | 74.75 |
| 2016-03-2011:05:13 AM | 61.812 | 131.112 | 29.975 | 74.75 |
| 2016-03-2011:05:17 AM | 61.7 | 131.225 | 30.088 | 74.75 |
| 2016-03-2011:05:21 AM | 61.475 | 131.338 | 30.088 | 74.75 |
| 2016-03-2011:05:25 AM | 61.025 | 131.338 | 30.2 | 74.75 |
| 2016-03-2011:05:29 AM | 60.912 | 131.338 | 30.2 | 74.75 |
| 2016-03-2011:05:33 AM | 60.912 | 131.338 | 30.312 | 74.75 |
| 2016-03-2011:05:37 AM | 60.8 | 131.45 | 30.312 | 74.75 |
| 2016-03-2011:05:41 AM | 60.912 | 131.45 | 30.312 | 74.75 |
| 2016-03-2011:05:45 AM | 60.8 | 131.562 | 30.312 | 74.75 |
| 2016-03-2011:05:49 AM | 60.912 | 131.562 | 30.312 | 74.75 |
| 2016-03-2011:05:53 AM | 60.912 | 131.675 | 30.312 | 74.75 |
| 2016-03-2011:05:58 AM | 61.025 | 131.675 | 30.312 | 74.75 |
| 2016-03-2011:06:02 AM | 61.025 | 131.675 | 30.425 | 74.75 |
| 2016-03-2011:06:06 AM | 61.025 | 131.788 | 30.425 | 74.75 |
| 2016-03-2011:06:10 AM | 61.025 | 131.788 | 30.425 | 74.75 |
| 2016-03-2011:06:14 AM | 61.138 | 131.9 | 30.425 | 74.75 |
| 2016-03-2011:06:18 AM | 61.138 | 131.9 | 30.425 | 74.75 |
| 2016-03-2011:06:22 AM | 61.25 | 131.9 | 30.425 | 74.75 |
| 2016-03-2011:06:26 AM | 61.363 | 132.012 | 30.425 | 74.75 |
| 2016-03-2011:06:30 AM | 61.25 | 132.012 | 30.65 | 74.75 |
| 2016-03-2011:06:34 AM | 61.138 | 132.125 | 30.538 | 74.75 |
| 2016-03-2011:06:38 AM | 61.25 | 132.125 | 30.425 | 74.862 |
| 2016-03-2011:06:42 AM | 61.363 | 132.238 | 30.425 | 74.75 |
| 2016-03-2011:06:46 AM | 61.363 | 132.238 | 30.425 | 74.862 |
| 2016-03-2011:06:50 AM | 61.363 | 132.238 | 30.312 | 74.75 |
| 2016-03-2011:06:54 AM | 61.363 | 132.238 | 30.312 | 74.75 |
| 2016-03-2011:06:58 AM | 61.475 | 132.35 | 30.312 | 74.862 |
| 2016-03-2011:07:02 AM | 61.588 | 132.35 | 30.312 | 74.75 |
| 2016-03-2011:07:06 AM | 61.588 | 132.35 | 30.2 | 74.862 |
| 2016-03-2011:07:10 AM | 61.7 | 132.35 | 30.312 | 74.862 |
| 2016-03-2011:07:14 AM | 61.588 | 132.462 | 30.2 | 74.862 |
| 2016-03-2011:07:18 AM | 61.475 | 132.462 | 30.088 | 74.862 |
| 2016-03-2011:07:22 AM | 61.363 | 132.462 | 30.2 | 74.862 |
| 2016-03-2011:07:26 AM | 61.475 | 132.575 | 30.2 | 74.862 |
| 2016-03-2011:07:30 AM | 61.475 | 132.575 | 30.2 | 74.862 |
| 2016-03-2011:07:34 AM | 61.588 | 132.575 | 30.2 | 74.862 |
| 2016-03-2011:07:38 AM | 61.588 | 132.688 | 30.2 | 74.862 |
| 2016-03-2011:07:42 AM | 61.7 | 132.688 | 30.312 | 74.862 |
| 2016-03-2011:07:46 AM | 61.7 | 132.688 | 30.312 | 74.862 |
| 2016-03-2011:07:50 AM | 61.588 | 132.688 | 30.312 | 74.862 |
| 2016-03-2011:07:54 AM | 61.7 | 132.8 | 30.425 | 74.862 |
| 2016-03-2011:07:58 AM | 61.812 | 132.8 | 30.538 | 74.862 |
| 2016-03-2011:08:02 AM | 61.925 | 132.912 | 30.538 | 74.862 |
| 2016-03-2011:08:06 AM | 62.15 | 132.912 | 30.425 | 74.862 |
| 2016-03-2011:08:10 AM | 62.15 | 132.912 | 30.312 | 74.862 |
| 2016-03-2011:08:14 AM | 62.262 | 133.025 | 30.425 | 74.862 |
| 2016-03-2011:08:18 AM | 62.262 | 133.025 | 30.425 | 74.862 |
| 2016-03-2011:08:22 AM | 62.488 | 133.138 | 30.538 | 74.862 |
| 2016-03-2011:08:26 AM | 62.6 | 133.138 | 30.538 | 74.862 |
| 2016-03-2011:08:30 AM | 62.712 | 133.138 | 30.65 | 74.862 |
| 2016-03-2011:08:34 AM | 62.938 | 133.25 | 30.65 | 74.862 |
| 2016-03-2011:08:38 AM | 62.938 | 133.25 | 30.538 | 74.862 |
| 2016-03-2011:08:42 AM | 62.712 | 133.25 | 30.538 | 74.862 |
| 2016-03-2011:08:46 AM | 62.712 | 133.362 | 30.65 | 74.975 |
| 2016-03-2011:08:50 AM | 62.825 | 133.362 | 30.65 | 74.862 |
| 2016-03-2011:08:54 AM | 62.825 | 133.362 | 30.762 | 74.862 |
| 2016-03-2011:08:58 AM | 62.938 | 133.475 | 30.875 | 74.862 |
| 2016-03-2011:09:02 AM | 63.05 | 133.475 | 30.875 | 74.862 |
| 2016-03-2011:09:06 AM | 63.162 | 133.588 | 30.988 | 74.975 |
| 2016-03-2011:09:10 AM | 63.162 | 133.588 | 30.988 | 74.862 |
| 2016-03-2011:09:14 AM | 63.162 | 133.588 | 30.875 | 74.862 |
| 2016-03-2011:09:18 AM | 63.275 | 133.7 | 30.762 | 74.975 |
| 2016-03-2011:09:22 AM | 63.275 | 133.7 | 30.65 | 74.862 |
| 2016-03-2011:09:26 AM | 63.275 | 133.7 | 30.65 | 74.975 |
| 2016-03-2011:09:30 AM | 63.275 | 133.812 | 30.65 | 74.862 |
| 2016-03-2011:09:34 AM | 63.275 | 133.925 | 30.65 | 74.975 |
| 2016-03-2011:09:38 AM | 63.5 | 133.925 | 30.762 | 74.975 |
| 2016-03-2011:09:42 AM | 63.613 | 133.925 | 30.65 | 74.975 |
| 2016-03-2011:09:46 AM | 63.613 | 134.038 | 30.65 | 74.975 |
| 2016-03-2011:09:50 AM | 63.725 | 134.038 | 30.538 | 74.975 |
| 2016-03-2011:09:54 AM | 63.838 | 134.038 | 30.538 | 74.975 |
| 2016-03-2011:09:58 AM | 63.838 | 134.15 | 30.65 | 74.975 |
| 2016-03-2011:10:02 AM | 63.838 | 134.15 | 30.762 | 74.975 |
| 2016-03-2011:10:06 AM | 63.838 | 134.262 | 30.875 | 74.975 |
| 2016-03-2011:10:10 AM | 63.838 | 134.375 | 30.988 | 74.975 |
| 2016-03-2011:10:14 AM | 63.838 | 134.375 | 31.1 | 74.975 |
| 2016-03-2011:10:18 AM | 63.95 | 134.375 | 31.1 | 74.975 |
| 2016-03-2011:10:23 AM | 64.175 | 134.488 | 31.325 | 74.975 |
| 2016-03-2011:10:27 AM | 64.287 | 134.488 | 31.325 | 74.975 |
| 2016-03-2011:10:31 AM | 64.4 | 134.488 | 31.438 | 74.975 |
| 2016-03-2011:10:35 AM | 64.512 | 134.6 | 31.55 | 74.975 |
| 2016-03-2011:10:39 AM | 64.625 | 134.712 | 31.55 | 74.975 |
| 2016-03-2011:10:43 AM | 64.625 | 134.712 | 31.662 | 74.975 |
| 2016-03-2011:10:47 AM | 64.625 | 134.712 | 31.775 | 74.975 |
| 2016-03-2011:10:51 AM | 64.738 | 134.825 | 31.775 | 74.975 |
| 2016-03-2011:10:55 AM | 64.738 | 134.938 | 31.888 | 74.975 |
| 2016-03-2011:10:59 AM | 64.738 | 134.938 | 31.888 | 74.975 |
| 2016-03-2011:11:03 AM | 64.512 | 135.05 | 32.112 | 74.975 |
| 2016-03-2011:11:07 AM | 64.512 | 135.05 | 32.112 | 74.975 |
| 2016-03-2011:11:11 AM | 64.4 | 135.05 | 32.225 | 74.975 |
| 2016-03-2011:11:15 AM | 64.287 | 135.162 | 32.338 | 74.975 |
| 2016-03-2011:11:19 AM | 64.175 | 135.275 | 32.338 | 74.975 |
| 2016-03-2011:11:23 AM | 64.062 | 135.275 | 32.338 | 74.975 |
| 2016-03-2011:11:27 AM | 64.062 | 135.388 | 32.225 | 74.975 |
| 2016-03-2011:11:31 AM | 63.838 | 135.388 | 32.112 | 74.975 |
| 2016-03-2011:11:35 AM | 63.838 | 135.5 | 32.225 | 74.975 |
| 2016-03-2011:11:39 AM | 63.725 | 135.5 | 32.225 | 74.975 |
| 2016-03-2011:11:43 AM | 63.838 | 135.5 | 32.338 | 75.088 |
| 2016-03-2011:11:47 AM | 63.838 | 135.612 | 32.338 | 74.975 |
| 2016-03-2011:11:54 AM | 63.838 | 135.725 | 32.338 | 75.088 |
| 2016-03-2011:11:58 AM | 63.838 | 135.725 | 32.45 | 75.088 |
| 2016-03-2011:12:03 AM | 63.95 | 135.838 | 32.45 | 75.088 |
| 2016-03-2011:12:07 AM | 63.95 | 135.838 | 32.45 | 74.975 |
| 2016-03-2011:12:10 AM | 63.95 | 135.95 | 32.45 | 75.088 |
| 2016-03-2011:12:15 AM | 64.062 | 135.95 | 32.338 | 75.088 |
| 2016-03-2011:12:19 AM | 64.062 | 136.062 | 32.338 | 75.088 |
| 2016-03-2011:12:23 AM | 63.95 | 136.175 | 32.338 | 74.975 |
| 2016-03-2011:12:27 AM | 63.95 | 136.175 | 32.45 | 75.088 |
| 2016-03-2011:12:30 AM | 63.95 | 136.288 | 32.562 | 75.088 |
| 2016-03-2011:12:34 AM | 64.062 | 136.288 | 32.562 | 75.088 |
| 2016-03-2011:12:39 AM | 64.062 | 136.4 | 32.562 | 75.088 |
| 2016-03-2011:12:43 AM | 64.062 | 136.512 | 32.562 | 75.088 |
| 2016-03-2011:12:47 AM | 63.95 | 136.512 | 32.562 | 75.088 |
| 2016-03-2011:12:51 AM | 63.95 | 136.512 | 32.562 | 75.088 |
| 2016-03-2011:12:55 AM | 63.95 | 136.738 | 32.675 | 75.088 |
| 2016-03-2011:12:59 AM | 63.95 | 136.85 | 32.562 | 75.2 |
| 2016-03-2011:13:03 AM | 63.95 | 136.85 | 32.562 | 75.088 |
| 2016-03-2011:13:07 AM | 63.95 | 136.85 | 32.45 | 75.2 |
| 2016-03-2011:13:11 AM | 63.95 | 136.962 | 32.338 | 75.2 |
| 2016-03-2011:13:15 AM | 63.838 | 136.962 | 32.338 | 75.2 |
| 2016-03-2011:13:19 AM | 63.838 | 137.075 | 32.45 | 75.088 |
| 2016-03-2011:13:23 AM | 63.725 | 137.075 | 32.45 | 75.2 |
| 2016-03-2011:13:27 AM | 63.838 | 137.188 | 32.225 | 75.2 |
| 2016-03-2011:13:31 AM | 63.838 | 137.188 | 32.225 | 75.2 |
| 2016-03-2011:13:35 AM | 63.95 | 137.188 | 32.225 | 75.2 |
| 2016-03-2011:13:39 AM | 64.062 | 137.3 | 32.225 | 75.2 |
| 2016-03-2011:13:43 AM | 63.95 | 137.412 | 32.225 | 75.2 |
| 2016-03-2011:13:47 AM | 63.725 | 137.525 | 32.112 | 75.2 |
| 2016-03-2011:13:51 AM | 63.388 | 137.525 | 31.888 | 75.2 |
| 2016-03-2011:13:55 AM | 63.275 | 137.525 | 31.55 | 75.2 |
| 2016-03-2011:13:59 AM | 63.275 | 137.638 | 31.212 | 75.2 |
| 2016-03-2011:14:03 AM | 63.162 | 137.638 | 30.988 | 75.2 |
| 2016-03-2011:14:07 AM | 63.162 | 137.75 | 30.875 | 75.2 |
| 2016-03-2011:14:11 AM | 63.162 | 137.75 | 30.762 | 75.2 |
| 2016-03-2011:14:15 AM | 63.162 | 137.75 | 30.762 | 75.312 |
| 2016-03-2011:14:19 AM | 63.162 | 137.862 | 30.875 | 75.2 |
| 2016-03-2011:14:23 AM | 63.275 | 137.975 | 30.875 | 75.2 |
| 2016-03-2011:14:27 AM | 63.162 | 137.975 | 30.875 | 75.312 |
| 2016-03-2011:14:31 AM | 63.05 | 137.975 | 30.762 | 75.312 |
| 2016-03-2011:14:35 AM | 63.05 | 137.975 | 30.762 | 75.312 |
| 2016-03-2011:14:40 AM | 62.938 | 138.088 | 30.762 | 75.312 |
| 2016-03-2011:14:44 AM | 62.825 | 138.088 | 30.65 | 75.312 |
| 2016-03-2011:14:48 AM | 62.488 | 138.088 | 30.538 | 75.312 |
| 2016-03-2011:14:52 AM | 62.375 | 138.088 | 30.538 | 75.312 |
| 2016-03-2011:14:56 AM | 62.375 | 138.2 | 30.538 | 75.312 |
| 2016-03-2011:15:00 AM | 62.15 | 138.2 | 30.425 | 75.312 |
| 2016-03-2011:15:04 AM | 62.038 | 138.2 | 30.312 | 75.312 |
| 2016-03-2011:15:08 AM | 62.15 | 138.2 | 30.2 | 75.312 |
| 2016-03-2011:15:12 AM | 62.262 | 138.2 | 30.312 | 75.312 |
| 2016-03-2011:15:16 AM | 62.375 | 138.312 | 30.2 | 75.312 |
| 2016-03-2011:15:20 AM | 62.375 | 138.312 | 30.312 | 75.312 |
| 2016-03-2011:15:24 AM | 62.488 | 138.312 | 30.312 | 75.312 |
| 2016-03-2011:15:28 AM | 62.6 | 138.312 | 30.425 | 75.425 |
| 2016-03-2011:15:32 AM | 62.6 | 138.312 | 30.425 | 75.312 |
| 2016-03-2011:15:36 AM | 62.6 | 138.425 | 30.425 | 75.312 |
| 2016-03-2011:15:40 AM | 62.712 | 138.425 | 30.425 | 75.312 |
| 2016-03-2011:15:44 AM | 62.6 | 138.425 | 30.425 | 75.425 |
| 2016-03-2011:15:48 AM | 62.488 | 138.425 | 30.538 | 75.425 |
| 2016-03-2011:15:53 AM | 62.375 | 138.538 | 30.538 | 75.425 |
| 2016-03-2011:15:57 AM | 62.488 | 138.538 | 30.538 | 75.425 |
| 2016-03-2011:16:01 AM | 62.375 | 138.538 | 30.538 | 75.312 |
| 2016-03-2011:16:05 AM | 62.375 | 138.538 | 30.538 | 75.425 |
| 2016-03-2011:16:09 AM | 62.375 | 138.65 | 30.538 | 75.425 |
| 2016-03-2011:16:13 AM | 62.15 | 138.65 | 30.538 | 75.425 |
| 2016-03-2011:16:17 AM | 61.925 | 138.65 | 30.538 | 75.425 |
| 2016-03-2011:16:21 AM | 61.812 | 138.65 | 30.65 | 75.425 |
| 2016-03-2011:16:25 AM | 61.812 | 138.65 | 30.65 | 75.312 |
| 2016-03-2011:16:29 AM | 61.812 | 138.762 | 30.65 | 75.312 |
| 2016-03-2011:16:33 AM | 61.7 | 138.65 | 30.65 | 75.425 |
| 2016-03-2011:16:37 AM | 61.812 | 138.762 | 30.65 | 75.425 |
| 2016-03-2011:16:41 AM | 61.812 | 138.762 | 30.762 | 75.425 |
| 2016-03-2011:16:45 AM | 61.925 | 138.762 | 30.762 | 75.425 |
| 2016-03-2011:16:49 AM | 62.038 | 138.762 | 30.875 | 75.425 |
| 2016-03-2011:16:53 AM | 62.038 | 138.762 | 30.875 | 75.312 |
| 2016-03-2011:16:57 AM | 62.038 | 138.762 | 30.988 | 75.425 |
| 2016-03-2011:17:01 AM | 62.15 | 138.762 | 30.875 | 75.425 |
| 2016-03-2011:17:05 AM | 62.15 | 138.875 | 30.762 | 75.425 |
| 2016-03-2011:17:09 AM | 62.15 | 138.875 | 30.762 | 75.425 |
| 2016-03-2011:17:13 AM | 62.038 | 138.875 | 30.875 | 75.425 |
| 2016-03-2011:17:17 AM | 61.812 | 138.988 | 30.762 | 75.425 |
| 2016-03-2011:17:21 AM | 61.812 | 138.988 | 30.762 | 75.425 |
| 2016-03-2011:17:25 AM | 61.588 | 138.988 | 30.762 | 75.425 |
| 2016-03-2011:17:29 AM | 61.363 | 138.988 | 30.875 | 75.425 |
| 2016-03-2011:17:33 AM | 61.363 | 138.988 | 30.875 | 75.425 |
| 2016-03-2011:17:37 AM | 61.25 | 138.988 | 30.988 | 75.425 |
| 2016-03-2011:17:41 AM | 61.25 | 139.1 | 31.1 | 75.425 |
| 2016-03-2011:17:45 AM | 61.138 | 139.1 | 31.1 | 75.425 |
| 2016-03-2011:17:49 AM | 61.025 | 139.1 | 31.1 | 75.425 |
| 2016-03-2011:17:53 AM | 61.025 | 139.1 | 30.988 | 75.538 |
| 2016-03-2011:17:57 AM | 61.025 | 139.1 | 30.988 | 75.425 |
| 2016-03-2011:18:01 AM | 60.912 | 139.212 | 30.875 | 75.425 |
| 2016-03-2011:18:05 AM | 61.025 | 139.1 | 30.875 | 75.425 |
| 2016-03-2011:18:10 AM | 60.912 | 139.212 | 30.875 | 75.425 |
| 2016-03-2011:18:14 AM | 60.8 | 139.212 | 30.988 | 75.425 |
| 2016-03-2011:18:18 AM | 60.912 | 139.212 | 30.875 | 75.425 |
| 2016-03-2011:18:22 AM | 61.025 | 139.212 | 30.875 | 75.425 |
| 2016-03-2011:18:26 AM | 61.138 | 139.212 | 30.875 | 75.425 |
| 2016-03-2011:18:30 AM | 61.25 | 139.212 | 30.875 | 75.425 |
| 2016-03-2011:18:34 AM | 61.363 | 139.212 | 30.875 | 75.425 |
| 2016-03-2011:18:38 AM | 61.363 | 139.325 | 30.875 | 75.425 |
| 2016-03-2011:18:42 AM | 61.475 | 139.325 | 30.875 | 75.425 |
| 2016-03-2011:18:46 AM | 61.475 | 139.325 | 30.875 | 75.425 |
| 2016-03-2011:18:50 AM | 61.363 | 139.325 | 30.875 | 75.538 |
| 2016-03-2011:18:54 AM | 61.475 | 139.325 | 30.988 | 75.538 |
| 2016-03-2011:18:58 AM | 61.588 | 139.325 | 30.988 | 75.538 |
| 2016-03-2011:19:02 AM | 61.7 | 139.438 | 31.1 | 75.425 |
| 2016-03-2011:19:06 AM | 61.7 | 139.438 | 31.325 | 75.538 |
| 2016-03-2011:19:10 AM | 61.812 | 139.438 | 31.438 | 75.538 |
| 2016-03-2011:19:14 AM | 61.7 | 139.438 | 31.438 | 75.538 |
| 2016-03-2011:19:18 AM | 61.812 | 139.438 | 31.55 | 75.538 |
| 2016-03-2011:19:22 AM | 61.925 | 139.438 | 31.662 | 75.538 |
| 2016-03-2011:19:26 AM | 62.038 | 139.55 | 31.662 | 75.538 |
| 2016-03-2011:19:30 AM | 62.15 | 139.438 | 31.662 | 75.538 |
| 2016-03-2011:19:34 AM | 62.15 | 139.55 | 31.662 | 75.538 |
| 2016-03-2011:19:38 AM | 62.262 | 139.55 | 31.662 | 75.538 |
| 2016-03-2011:19:42 AM | 62.262 | 139.55 | 31.662 | 75.538 |
| 2016-03-2011:19:46 AM | 62.15 | 139.55 | 31.775 | 75.538 |
| 2016-03-2011:19:50 AM | 62.038 | 139.55 | 31.888 | 75.425 |
| 2016-03-2011:19:54 AM | 61.925 | 139.55 | 31.775 | 75.538 |
| 2016-03-2011:19:58 AM | 61.7 | 139.55 | 32 | 75.538 |
| 2016-03-2011:20:02 AM | 61.475 | 139.662 | 32 | 75.538 |
| 2016-03-2011:20:06 AM | 61.25 | 139.662 | 32 | 75.425 |
| 2016-03-2011:20:10 AM | 61.138 | 139.662 | 31.888 | 75.538 |
| 2016-03-2011:20:14 AM | 61.138 | 139.662 | 31.888 | 75.538 |
| 2016-03-2011:20:18 AM | 61.363 | 139.775 | 32 | 75.538 |
| 2016-03-2011:20:22 AM | 61.475 | 139.775 | 32 | 75.538 |
| 2016-03-2011:20:26 AM | 61.588 | 139.775 | 32.112 | 75.538 |
| 2016-03-2011:20:31 AM | 61.7 | 139.775 | 32.112 | 75.538 |
| 2016-03-2011:20:35 AM | 61.7 | 139.775 | 32.112 | 75.425 |
| 2016-03-2011:20:39 AM | 61.7 | 139.775 | 32.112 | 75.425 |
| 2016-03-2011:20:43 AM | 61.812 | 139.888 | 32.112 | 75.538 |
| 2016-03-2011:20:47 AM | 61.812 | 139.888 | 32 | 75.425 |
| 2016-03-2011:20:51 AM | 61.812 | 139.888 | 31.888 | 75.425 |
| 2016-03-2011:20:55 AM | 61.925 | 140 | 31.775 | 75.425 |
| 2016-03-2011:20:59 AM | 61.812 | 140 | 31.775 | 75.538 |
| 2016-03-2011:21:03 AM | 61.812 | 140 | 31.662 | 75.538 |
| 2016-03-2011:21:07 AM | 61.812 | 140 | 31.55 | 75.425 |
| 2016-03-2011:21:11 AM | 61.925 | 140.112 | 31.55 | 75.538 |
| 2016-03-2011:21:15 AM | 61.925 | 140.112 | 31.55 | 75.538 |
| 2016-03-2011:21:19 AM | 62.038 | 140.112 | 31.662 | 75.425 |
| 2016-03-2011:21:23 AM | 62.262 | 140.225 | 31.662 | 75.425 |
| 2016-03-2011:21:27 AM | 62.262 | 140.225 | 31.662 | 75.425 |
| 2016-03-2011:21:31 AM | 62.488 | 140.225 | 31.55 | 75.425 |
| 2016-03-2011:21:34 AM | 62.6 | 140.225 | 31.55 | 75.425 |
| 2016-03-2011:21:39 AM | 62.712 | 140.338 | 31.662 | 75.538 |
| 2016-03-2011:21:43 AM | 62.825 | 140.338 | 31.662 | 75.538 |
| 2016-03-2011:21:47 AM | 63.05 | 140.338 | 31.662 | 75.538 |
| 2016-03-2011:21:51 AM | 63.162 | 140.45 | 31.775 | 75.538 |
| 2016-03-2011:21:55 AM | 63.275 | 140.45 | 31.662 | 75.538 |
| 2016-03-2011:21:59 AM | 63.275 | 140.45 | 31.775 | 75.538 |
| 2016-03-2011:22:03 AM | 63.275 | 140.562 | 31.775 | 75.538 |
| 2016-03-2011:22:07 AM | 63.162 | 140.562 | 31.888 | 75.538 |
| 2016-03-2011:22:11 AM | 63.275 | 140.562 | 31.888 | 75.538 |
| 2016-03-2011:22:15 AM | 63.275 | 140.562 | 31.775 | 75.538 |
| 2016-03-2011:22:18 AM | 63.388 | 140.562 | 31.775 | 75.538 |
| 2016-03-2011:22:23 AM | 63.388 | 140.675 | 31.662 | 75.538 |
| 2016-03-2011:22:27 AM | 63.275 | 140.675 | 31.438 | 75.538 |
| 2016-03-2011:22:31 AM | 63.275 | 140.675 | 31.212 | 75.538 |
| 2016-03-2011:22:35 AM | 63.275 | 140.788 | 31.1 | 75.425 |
| 2016-03-2011:22:39 AM | 63.275 | 140.788 | 30.988 | 75.425 |
| 2016-03-2011:22:43 AM | 63.275 | 140.788 | 30.762 | 75.425 |
| 2016-03-2011:22:47 AM | 63.275 | 140.9 | 30.65 | 75.425 |
| 2016-03-2011:22:51 AM | 63.388 | 140.9 | 30.538 | 75.538 |
| 2016-03-2011:22:55 AM | 63.388 | 141.012 | 30.425 | 75.538 |
| 2016-03-2011:22:59 AM | 63.388 | 140.9 | 30.425 | 75.538 |
| 2016-03-2011:23:03 AM | 63.388 | 140.9 | 30.425 | 75.538 |
| 2016-03-2011:23:07 AM | 63.5 | 141.012 | 30.312 | 75.425 |
| 2016-03-2011:23:11 AM | 63.5 | 141.012 | 30.2 | 75.425 |
| 2016-03-2011:23:15 AM | 63.613 | 141.125 | 30.312 | 75.538 |
| 2016-03-2011:23:19 AM | 63.613 | 141.125 | 30.2 | 75.425 |
| 2016-03-2011:23:23 AM | 63.838 | 141.125 | 30.312 | 75.538 |
| 2016-03-2011:23:27 AM | 63.725 | 141.125 | 30.312 | 75.538 |
| 2016-03-2011:23:31 AM | 63.613 | 141.125 | 30.312 | 75.425 |
| 2016-03-2011:23:35 AM | 63.613 | 141.238 | 30.2 | 75.538 |
| 2016-03-2011:23:39 AM | 63.5 | 141.238 | 30.088 | 75.538 |
| 2016-03-2011:23:43 AM | 63.5 | 141.238 | 29.975 | 75.538 |
| 2016-03-2011:23:47 AM | 63.5 | 141.238 | 29.975 | 75.538 |
| 2016-03-2011:23:51 AM | 63.5 | 141.35 | 29.862 | 75.425 |
| 2016-03-2011:23:55 AM | 63.5 | 141.35 | 29.75 | 75.425 |
| 2016-03-2011:23:59 AM | 63.5 | 141.35 | 29.75 | 75.425 |
| 2016-03-2011:24:03 AM | 63.5 | 141.35 | 29.75 | 75.425 |
| 2016-03-2011:24:07 AM | 63.5 | 141.462 | 29.75 | 75.425 |
| 2016-03-2011:24:11 AM | 63.613 | 141.462 | 29.75 | 75.425 |
| 2016-03-2011:24:15 AM | 63.725 | 141.462 | 29.638 | 75.425 |
| 2016-03-2011:24:19 AM | 63.838 | 141.462 | 29.638 | 75.425 |
| 2016-03-2011:24:23 AM | 63.95 | 141.462 | 29.638 | 75.538 |
| 2016-03-2011:24:27 AM | 63.95 | 141.575 | 29.75 | 75.538 |
| 2016-03-2011:24:31 AM | 64.062 | 141.575 | 29.75 | 75.538 |
| 2016-03-2011:24:35 AM | 63.838 | 141.575 | 29.75 | 75.538 |
| 2016-03-2011:24:39 AM | 63.725 | 141.575 | 29.75 | 75.538 |
| 2016-03-2011:24:44 AM | 63.725 | 141.575 | 29.638 | 75.538 |
| 2016-03-2011:24:48 AM | 63.725 | 141.688 | 29.862 | 75.538 |
| 2016-03-2011:24:52 AM | 63.725 | 141.575 | 29.862 | 75.425 |
| 2016-03-2011:24:56 AM | 63.725 | 141.688 | 29.975 | 75.425 |
| 2016-03-2011:25:00 AM | 63.725 | 141.688 | 30.088 | 75.425 |
| 2016-03-2011:25:04 AM | 63.613 | 141.688 | 30.2 | 75.425 |
| 2016-03-2011:25:08 AM | 63.5 | 141.8 | 30.2 | 75.425 |
| 2016-03-2011:25:12 AM | 63.388 | 141.8 | 30.088 | 75.538 |
| 2016-03-2011:25:16 AM | 63.275 | 141.8 | 30.088 | 75.425 |
| 2016-03-2011:25:20 AM | 63.162 | 141.8 | 30.2 | 75.425 |
| 2016-03-2011:25:24 AM | 62.938 | 141.8 | 30.312 | 75.425 |
| 2016-03-2011:25:28 AM | 62.938 | 141.912 | 30.425 | 75.425 |
| 2016-03-2011:25:32 AM | 62.825 | 141.912 | 30.538 | 75.425 |
| 2016-03-2011:25:36 AM | 62.712 | 141.912 | 30.65 | 75.538 |
| 2016-03-2011:25:40 AM | 62.712 | 141.912 | 30.425 | 75.425 |
| 2016-03-2011:25:44 AM | 62.488 | 141.912 | 30.538 | 75.425 |
| 2016-03-2011:25:48 AM | 62.488 | 142.025 | 30.538 | 75.425 |
| 2016-03-2011:25:52 AM | 62.375 | 142.025 | 30.762 | 75.425 |
| 2016-03-2011:25:56 AM | 62.262 | 142.025 | 30.65 | 75.425 |
| 2016-03-2011:26:00 AM | 62.262 | 142.025 | 30.425 | 75.425 |
| 2016-03-2011:26:04 AM | 62.262 | 142.138 | 30.425 | 75.425 |
| 2016-03-2011:26:08 AM | 62.262 | 142.138 | 30.538 | 75.425 |
| 2016-03-2011:26:12 AM | 62.262 | 142.138 | 30.65 | 75.425 |
| 2016-03-2011:26:16 AM | 62.262 | 142.138 | 30.425 | 75.425 |
| 2016-03-2011:26:20 AM | 62.15 | 142.25 | 30.2 | 75.538 |
| 2016-03-2011:26:24 AM | 62.038 | 142.25 | 29.975 | 75.538 |
| 2016-03-2011:26:28 AM | 62.038 | 142.25 | 29.975 | 75.538 |
| 2016-03-2011:26:32 AM | 62.038 | 142.25 | 30.088 | 75.425 |
| 2016-03-2011:26:36 AM | 61.925 | 142.25 | 30.088 | 75.538 |
| 2016-03-2011:26:40 AM | 61.812 | 142.25 | 30.088 | 75.425 |
| 2016-03-2011:26:44 AM | 61.588 | 142.25 | 30.088 | 75.425 |
| 2016-03-2011:26:48 AM | 61.363 | 142.362 | 30.088 | 75.538 |
| 2016-03-2011:26:52 AM | 61.25 | 142.362 | 30.2 | 75.538 |
| 2016-03-2011:26:56 AM | 61.25 | 142.362 | 30.088 | 75.538 |
| 2016-03-2011:27:01 AM | 61.025 | 142.362 | 30.088 | 75.538 |
| 2016-03-2011:27:05 AM | 60.912 | 142.362 | 30.2 | 75.538 |
| 2016-03-2011:27:09 AM | 60.8 | 142.475 | 30.312 | 75.538 |
| 2016-03-2011:27:13 AM | 60.688 | 142.475 | 30.312 | 75.538 |
| 2016-03-2011:27:17 AM | 60.688 | 142.475 | 30.425 | 75.538 |
| 2016-03-2011:27:21 AM | 60.688 | 142.475 | 30.538 | 75.538 |
| 2016-03-2011:27:25 AM | 60.462 | 142.475 | 30.65 | 75.538 |
| 2016-03-2011:27:29 AM | 60.35 | 142.475 | 30.65 | 75.538 |
| 2016-03-2011:27:33 AM | 60.35 | 142.475 | 30.538 | 75.538 |
| 2016-03-2011:27:37 AM | 60.35 | 142.475 | 30.538 | 75.538 |
| 2016-03-2011:27:41 AM | 60.35 | 142.475 | 30.538 | 75.538 |
| 2016-03-2011:27:45 AM | 60.35 | 142.475 | 30.538 | 75.538 |
| 2016-03-2011:27:49 AM | 60.238 | 142.475 | 30.538 | 75.538 |
| 2016-03-2011:27:53 AM | 60.238 | 142.475 | 30.65 | 75.538 |
| 2016-03-2011:27:57 AM | 60.238 | 142.475 | 30.65 | 75.538 |
| 2016-03-2011:28:01 AM | 60.238 | 142.475 | 30.538 | 75.538 |
| 2016-03-2011:28:05 AM | 60.125 | 142.475 | 30.538 | 75.538 |
| 2016-03-2011:28:09 AM | 60.238 | 142.475 | 30.425 | 75.538 |
| 2016-03-2011:28:13 AM | 60.35 | 142.475 | 30.312 | 75.538 |
| 2016-03-2011:28:17 AM | 60.462 | 142.475 | 30.088 | 75.538 |
| 2016-03-2011:28:21 AM | 60.462 | 142.362 | 29.862 | 75.538 |
| 2016-03-2011:28:25 AM | 60.462 | 142.362 | 29.862 | 75.538 |
| 2016-03-2011:28:29 AM | 60.462 | 142.362 | 29.975 | 75.538 |
| 2016-03-2011:28:33 AM | 60.462 | 142.362 | 30.088 | 75.538 |
| 2016-03-2011:28:37 AM | 60.462 | 142.362 | 29.975 | 75.538 |
| 2016-03-2011:28:41 AM | 60.575 | 142.362 | 29.862 | 75.538 |
| 2016-03-2011:28:45 AM | 60.688 | 142.362 | 29.862 | 75.538 |
| 2016-03-2011:28:49 AM | 60.688 | 142.362 | 29.975 | 75.538 |
| 2016-03-2011:28:53 AM | 60.575 | 142.362 | 30.088 | 75.538 |
| 2016-03-2011:28:57 AM | 60.575 | 142.25 | 30.088 | 75.538 |
| 2016-03-2011:29:01 AM | 60.462 | 142.25 | 29.975 | 75.538 |
| 2016-03-2011:29:05 AM | 60.575 | 142.25 | 30.088 | 75.538 |
| 2016-03-2011:29:09 AM | 60.575 | 142.25 | 29.862 | 75.538 |
| 2016-03-2011:29:13 AM | 60.8 | 142.138 | 29.862 | 75.538 |
| 2016-03-2011:29:17 AM | 60.912 | 142.138 | 29.75 | 75.538 |
| 2016-03-2011:29:22 AM | 61.025 | 142.138 | 29.75 | 75.538 |
| 2016-03-2011:29:26 AM | 61.138 | 142.138 | 29.638 | 75.538 |
| 2016-03-2011:29:30 AM | 61.363 | 142.138 | 29.638 | 75.538 |
| 2016-03-2011:29:34 AM | 61.475 | 142.138 | 29.638 | 75.538 |
| 2016-03-2011:29:37 AM | 61.475 | 142.138 | 29.75 | 75.538 |
| 2016-03-2011:29:42 AM | 61.588 | 142.025 | 29.75 | 75.538 |
| 2016-03-2011:29:46 AM | 61.7 | 142.025 | 29.862 | 75.538 |
| 2016-03-2011:29:50 AM | 61.812 | 142.025 | 29.862 | 75.538 |
| 2016-03-2011:29:54 AM | 62.038 | 142.025 | 29.975 | 75.538 |
| 2016-03-2011:29:58 AM | 62.038 | 142.025 | 30.088 | 75.538 |
| 2016-03-2011:30:02 AM | 62.038 | 142.025 | 30.088 | 75.538 |
| 2016-03-2011:30:06 AM | 62.038 | 142.025 | 30.2 | 75.538 |
| 2016-03-2011:30:10 AM | 62.038 | 142.025 | 30.2 | 75.538 |
| 2016-03-2011:30:14 AM | 62.15 | 142.025 | 30.312 | 75.538 |
| 2016-03-2011:30:18 AM | 62.262 | 142.025 | 30.312 | 75.538 |
| 2016-03-2011:30:22 AM | 62.262 | 142.025 | 30.312 | 75.538 |
| 2016-03-2011:30:26 AM | 62.262 | 141.912 | 30.312 | 75.538 |
| 2016-03-2011:30:30 AM | 62.15 | 142.025 | 30.425 | 75.538 |
| 2016-03-2011:30:34 AM | 62.15 | 141.912 | 30.538 | 75.538 |
| 2016-03-2011:30:38 AM | 62.262 | 141.912 | 30.538 | 75.538 |
| 2016-03-2011:30:42 AM | 62.375 | 141.912 | 30.538 | 75.538 |
| 2016-03-2011:30:46 AM | 62.488 | 141.912 | 30.538 | 75.538 |
| 2016-03-2011:30:50 AM | 62.488 | 141.912 | 30.425 | 75.538 |
| 2016-03-2011:30:54 AM | 62.6 | 141.912 | 30.312 | 75.538 |
| 2016-03-2011:30:58 AM | 62.6 | 141.912 | 30.312 | 75.538 |
| 2016-03-2011:31:02 AM | 62.712 | 141.912 | 30.312 | 75.538 |
| 2016-03-2011:31:06 AM | 62.712 | 141.912 | 30.425 | 75.538 |
| 2016-03-2011:31:10 AM | 62.712 | 141.912 | 30.538 | 75.538 |
| 2016-03-2011:31:14 AM | 62.6 | 141.912 | 30.65 | 75.538 |
| 2016-03-2011:31:18 AM | 62.712 | 141.912 | 30.762 | 75.538 |
| 2016-03-2011:31:22 AM | 62.712 | 141.912 | 30.875 | 75.538 |
| 2016-03-2011:31:26 AM | 62.938 | 141.912 | 30.988 | 75.538 |
| 2016-03-2011:31:30 AM | 62.938 | 141.912 | 31.1 | 75.65 |
| 2016-03-2011:31:34 AM | 63.05 | 141.912 | 31.212 | 75.538 |
| 2016-03-2011:31:38 AM | 63.162 | 142.025 | 31.325 | 75.538 |
| 2016-03-2011:31:42 AM | 63.05 | 142.025 | 31.325 | 75.538 |
| 2016-03-2011:31:46 AM | 62.938 | 142.025 | 31.325 | 75.65 |
| 2016-03-2011:31:50 AM | 62.825 | 142.025 | 31.438 | 75.538 |
| 2016-03-2011:31:54 AM | 62.712 | 142.025 | 31.438 | 75.538 |
| 2016-03-2011:31:58 AM | 62.712 | 142.025 | 31.55 | 75.65 |
| 2016-03-2011:32:02 AM | 62.712 | 142.025 | 31.55 | 75.538 |
| 2016-03-2011:32:07 AM | 62.712 | 142.138 | 31.55 | 75.538 |
| 2016-03-2011:32:11 AM | 62.712 | 142.138 | 31.438 | 75.538 |
| 2016-03-2011:32:15 AM | 62.825 | 142.138 | 31.325 | 75.538 |
| 2016-03-2011:32:19 AM | 62.712 | 142.25 | 31.325 | 75.538 |
| 2016-03-2011:32:23 AM | 62.825 | 142.25 | 31.325 | 75.538 |
| 2016-03-2011:32:27 AM | 62.825 | 142.25 | 31.438 | 75.538 |
| 2016-03-2011:32:31 AM | 62.712 | 142.25 | 31.438 | 75.538 |
| 2016-03-2011:32:35 AM | 62.712 | 142.25 | 31.438 | 75.538 |
| 2016-03-2011:32:39 AM | 62.6 | 142.362 | 31.662 | 75.538 |
| 2016-03-2011:32:43 AM | 62.6 | 142.362 | 31.662 | 75.538 |
| 2016-03-2011:32:47 AM | 62.6 | 142.362 | 31.662 | 75.425 |
| 2016-03-2011:32:51 AM | 62.6 | 142.362 | 31.438 | 75.538 |
| 2016-03-2011:32:55 AM | 62.712 | 142.475 | 31.1 | 75.425 |
| 2016-03-2011:32:59 AM | 62.712 | 142.475 | 31.1 | 75.425 |
| 2016-03-2011:33:03 AM | 62.825 | 142.475 | 30.988 | 75.425 |
| 2016-03-2011:33:07 AM | 63.05 | 142.588 | 31.1 | 75.425 |
| 2016-03-2011:33:11 AM | 63.162 | 142.588 | 31.1 | 75.425 |
| 2016-03-2011:33:15 AM | 63.275 | 142.588 | 30.988 | 75.425 |
| 2016-03-2011:33:19 AM | 63.388 | 142.7 | 31.1 | 75.312 |
| 2016-03-2011:33:23 AM | 63.5 | 142.7 | 31.212 | 75.312 |
| 2016-03-2011:33:27 AM | 63.613 | 142.7 | 31.325 | 75.425 |
| 2016-03-2011:33:31 AM | 63.725 | 142.7 | 31.212 | 75.312 |
| 2016-03-2011:33:35 AM | 63.838 | 142.812 | 31.212 | 75.312 |
| 2016-03-2011:33:39 AM | 63.95 | 142.812 | 31.1 | 75.312 |
| 2016-03-2011:33:43 AM | 64.062 | 142.812 | 30.988 | 75.312 |
| 2016-03-2011:33:47 AM | 64.287 | 142.812 | 30.762 | 75.312 |
| 2016-03-2011:33:51 AM | 64.4 | 142.925 | 30.538 | 75.312 |
| 2016-03-2011:33:55 AM | 64.625 | 142.925 | 30.538 | 75.312 |
| 2016-03-2011:33:59 AM | 64.738 | 142.925 | 30.538 | 75.312 |
| 2016-03-2011:34:03 AM | 64.963 | 142.925 | 30.538 | 75.312 |
| 2016-03-2011:34:07 AM | 65.075 | 143.038 | 30.538 | 75.312 |
| 2016-03-2011:34:11 AM | 65.075 | 143.038 | 30.65 | 75.312 |
| 2016-03-2011:34:15 AM | 65.075 | 143.038 | 30.762 | 75.312 |
| 2016-03-2011:34:20 AM | 65.075 | 143.15 | 30.988 | 75.312 |
| 2016-03-2011:34:24 AM | 65.188 | 143.15 | 30.988 | 75.312 |
| 2016-03-2011:34:28 AM | 65.188 | 143.15 | 30.988 | 75.312 |
| 2016-03-2011:34:32 AM | 65.3 | 143.262 | 30.988 | 75.312 |
| 2016-03-2011:34:36 AM | 65.412 | 143.262 | 31.1 | 75.312 |
| 2016-03-2011:34:40 AM | 65.412 | 143.262 | 31.212 | 75.312 |
| 2016-03-2011:34:44 AM | 65.412 | 143.262 | 31.212 | 75.312 |
| 2016-03-2011:34:48 AM | 65.3 | 143.375 | 31.1 | 75.312 |
| 2016-03-2011:34:52 AM | 65.188 | 143.375 | 30.988 | 75.312 |
| 2016-03-2011:34:56 AM | 65.075 | 143.375 | 30.988 | 75.312 |
| 2016-03-2011:35:00 AM | 64.963 | 143.375 | 30.988 | 75.312 |
| 2016-03-2011:35:04 AM | 64.738 | 143.375 | 30.988 | 75.312 |
| 2016-03-2011:35:08 AM | 64.625 | 143.375 | 31.1 | 75.312 |
| 2016-03-2011:35:12 AM | 64.625 | 143.488 | 31.1 | 75.312 |
| 2016-03-2011:35:16 AM | 64.4 | 143.488 | 31.212 | 75.312 |
| 2016-03-2011:35:20 AM | 64.287 | 143.488 | 31.212 | 75.312 |
| 2016-03-2011:35:24 AM | 64.287 | 143.6 | 31.325 | 75.312 |
| 2016-03-2011:35:28 AM | 64.287 | 143.488 | 31.325 | 75.312 |
| 2016-03-2011:35:32 AM | 64.4 | 143.6 | 31.325 | 75.425 |
| 2016-03-2011:35:36 AM | 64.287 | 143.6 | 31.438 | 75.425 |
| 2016-03-2011:35:40 AM | 64.4 | 143.6 | 31.438 | 75.425 |
| 2016-03-2011:35:44 AM | 64.512 | 143.712 | 31.55 | 75.312 |
| 2016-03-2011:35:48 AM | 64.625 | 143.712 | 31.55 | 75.425 |
| 2016-03-2011:35:52 AM | 64.738 | 143.825 | 31.55 | 75.425 |
| 2016-03-2011:35:56 AM | 64.738 | 143.825 | 31.55 | 75.425 |
| 2016-03-2011:36:01 AM | 64.85 | 143.825 | 31.438 | 75.312 |
| 2016-03-2011:36:05 AM | 64.963 | 143.938 | 31.325 | 75.425 |
| 2016-03-2011:36:09 AM | 64.963 | 143.938 | 31.325 | 75.425 |
| 2016-03-2011:36:13 AM | 65.075 | 144.05 | 31.212 | 75.425 |
| 2016-03-2011:36:17 AM | 65.188 | 144.05 | 31.212 | 75.425 |
| 2016-03-2011:36:21 AM | 65.3 | 144.05 | 31.325 | 75.425 |
| 2016-03-2011:36:25 AM | 65.412 | 144.162 | 31.325 | 75.425 |
| 2016-03-2011:36:29 AM | 65.412 | 144.162 | 31.55 | 75.425 |
| 2016-03-2011:36:33 AM | 65.3 | 144.162 | 31.662 | 75.425 |
| 2016-03-2011:36:37 AM | 65.188 | 144.275 | 31.775 | 75.425 |
| 2016-03-2011:36:41 AM | 65.075 | 144.275 | 31.888 | 75.425 |
| 2016-03-2011:36:45 AM | 65.075 | 144.275 | 31.888 | 75.425 |
| 2016-03-2011:36:49 AM | 64.963 | 144.388 | 32 | 75.425 |
| 2016-03-2011:36:53 AM | 64.85 | 144.388 | 32.112 | 75.425 |
| 2016-03-2011:36:57 AM | 64.963 | 144.388 | 32.112 | 75.425 |
| 2016-03-2011:37:01 AM | 65.075 | 144.5 | 32.112 | 75.425 |
| 2016-03-2011:37:05 AM | 65.188 | 144.5 | 32 | 75.538 |
| 2016-03-2011:37:09 AM | 65.3 | 144.612 | 31.775 | 75.425 |
| 2016-03-2011:37:13 AM | 65.412 | 144.612 | 31.775 | 75.425 |
| 2016-03-2011:37:17 AM | 65.412 | 144.612 | 31.662 | 75.538 |
| 2016-03-2011:37:21 AM | 65.412 | 144.612 | 31.55 | 75.538 |
| 2016-03-2011:37:25 AM | 65.3 | 144.725 | 31.55 | 75.425 |
| 2016-03-2011:37:29 AM | 65.188 | 144.725 | 31.438 | 75.538 |
| 2016-03-2011:37:33 AM | 65.3 | 144.725 | 31.55 | 75.538 |
| 2016-03-2011:37:37 AM | 65.3 | 144.838 | 31.55 | 75.538 |
| 2016-03-2011:37:41 AM | 65.412 | 144.838 | 31.662 | 75.538 |
| 2016-03-2011:37:45 AM | 65.525 | 144.838 | 31.775 | 75.538 |
| 2016-03-2011:37:49 AM | 65.638 | 144.838 | 31.888 | 75.538 |
| 2016-03-2011:37:53 AM | 65.638 | 144.95 | 31.888 | 75.538 |
| 2016-03-2011:37:58 AM | 65.638 | 144.95 | 31.775 | 75.538 |
| 2016-03-2011:38:02 AM | 65.638 | 144.95 | 31.775 | 75.538 |
| 2016-03-2011:38:06 AM | 65.638 | 145.062 | 31.55 | 75.538 |
| 2016-03-2011:38:10 AM | 65.525 | 145.062 | 31.55 | 75.538 |
| 2016-03-2011:38:14 AM | 65.525 | 145.062 | 31.55 | 75.538 |
| 2016-03-2011:38:18 AM | 65.525 | 145.062 | 31.55 | 75.538 |
| 2016-03-2011:38:22 AM | 65.638 | 145.175 | 31.662 | 75.538 |
| 2016-03-2011:38:26 AM | 65.638 | 145.175 | 31.775 | 75.538 |
| 2016-03-2011:38:30 AM | 65.75 | 145.175 | 31.662 | 75.538 |
| 2016-03-2011:38:34 AM | 65.638 | 145.288 | 31.662 | 75.538 |
| 2016-03-2011:38:38 AM | 65.525 | 145.288 | 31.662 | 75.538 |
| 2016-03-2011:38:42 AM | 65.525 | 145.288 | 31.775 | 75.538 |
| 2016-03-2011:38:46 AM | 65.525 | 145.4 | 31.888 | 75.538 |
| 2016-03-2011:38:50 AM | 65.638 | 145.4 | 32 | 75.538 |
| 2016-03-2011:38:54 AM | 65.862 | 145.4 | 32.112 | 75.65 |
| 2016-03-2011:38:58 AM | 65.862 | 145.512 | 32.225 | 75.538 |
| 2016-03-2011:39:02 AM | 65.862 | 145.512 | 32.338 | 75.65 |
| 2016-03-2011:39:06 AM | 65.862 | 145.512 | 32.338 | 75.538 |
| 2016-03-2011:39:10 AM | 65.862 | 145.512 | 32.338 | 75.65 |
| 2016-03-2011:39:14 AM | 65.975 | 145.512 | 32.45 | 75.65 |
| 2016-03-2011:39:18 AM | 66.088 | 145.625 | 32.45 | 75.65 |
| 2016-03-2011:39:22 AM | 66.088 | 145.625 | 32.45 | 75.65 |
| 2016-03-2011:39:26 AM | 66.088 | 145.625 | 32.45 | 75.65 |
| 2016-03-2011:39:30 AM | 65.975 | 145.738 | 32.338 | 75.65 |
| 2016-03-2011:39:34 AM | 65.975 | 145.738 | 32.45 | 75.65 |
| 2016-03-2011:39:38 AM | 65.975 | 145.738 | 32.45 | 75.65 |
| 2016-03-2011:39:42 AM | 65.975 | 145.738 | 32.562 | 75.65 |
| 2016-03-2011:39:46 AM | 66.088 | 145.85 | 32.562 | 75.65 |
| 2016-03-2011:39:50 AM | 66.088 | 145.85 | 32.562 | 75.65 |
| 2016-03-2011:39:54 AM | 65.975 | 145.85 | 32.562 | 75.65 |
| 2016-03-2011:39:58 AM | 65.975 | 145.85 | 32.562 | 75.65 |
| 2016-03-2011:40:02 AM | 65.975 | 145.962 | 32.45 | 75.65 |
| 2016-03-2011:40:06 AM | 66.088 | 145.962 | 32.562 | 75.65 |
| 2016-03-2011:40:10 AM | 66.2 | 145.962 | 32.562 | 75.65 |
| 2016-03-2011:40:14 AM | 66.312 | 146.075 | 32.562 | 75.65 |
| 2016-03-2011:40:19 AM | 66.312 | 145.962 | 32.338 | 75.65 |
| 2016-03-2011:40:23 AM | 66.312 | 146.075 | 32.45 | 75.762 |
| 2016-03-2011:40:27 AM | 66.312 | 146.075 | 32.45 | 75.65 |
| 2016-03-2011:40:31 AM | 66.312 | 146.188 | 32.45 | 75.762 |
| 2016-03-2011:40:35 AM | 66.312 | 146.188 | 32.45 | 75.762 |
| 2016-03-2011:40:39 AM | 66.312 | 146.188 | 32.45 | 75.762 |
| 2016-03-2011:40:43 AM | 66.312 | 146.188 | 32.562 | 75.65 |
| 2016-03-2011:40:47 AM | 66.312 | 146.188 | 32.675 | 75.762 |
| 2016-03-2011:40:51 AM | 66.312 | 146.3 | 32.675 | 75.65 |
| 2016-03-2011:40:55 AM | 66.425 | 146.3 | 32.675 | 75.762 |
| 2016-03-2011:40:59 AM | 66.538 | 146.3 | 32.675 | 75.762 |
| 2016-03-2011:41:03 AM | 66.538 | 146.3 | 32.562 | 75.762 |
| 2016-03-2011:41:07 AM | 66.65 | 146.412 | 32.675 | 75.762 |
| 2016-03-2011:41:11 AM | 66.762 | 146.412 | 32.675 | 75.762 |
| 2016-03-2011:41:15 AM | 66.762 | 146.412 | 32.562 | 75.762 |
| 2016-03-2011:41:19 AM | 66.65 | 146.412 | 32.45 | 75.762 |
| 2016-03-2011:41:23 AM | 66.65 | 146.412 | 32.338 | 75.762 |
| 2016-03-2011:41:27 AM | 66.65 | 146.525 | 32.338 | 75.762 |
| 2016-03-2011:41:31 AM | 66.65 | 146.525 | 32.338 | 75.762 |
| 2016-03-2011:41:35 AM | 66.65 | 146.638 | 32.338 | 75.762 |
| 2016-03-2011:41:39 AM | 66.65 | 146.638 | 32.225 | 75.762 |
| 2016-03-2011:41:43 AM | 66.65 | 146.638 | 32.225 | 75.762 |
| 2016-03-2011:41:47 AM | 66.65 | 146.638 | 32.112 | 75.762 |
| 2016-03-2011:41:51 AM | 66.65 | 146.638 | 32.225 | 75.762 |
| 2016-03-2011:41:55 AM | 66.762 | 146.75 | 32.225 | 75.762 |
| 2016-03-2011:41:59 AM | 66.875 | 146.75 | 32.112 | 75.762 |
| 2016-03-2011:42:03 AM | 66.762 | 146.75 | 32.225 | 75.762 |
| 2016-03-2011:42:07 AM | 66.65 | 146.75 | 32.225 | 75.762 |
| 2016-03-2011:42:11 AM | 66.425 | 146.862 | 32.225 | 75.762 |
| 2016-03-2011:42:15 AM | 66.425 | 146.862 | 32.225 | 75.762 |
| 2016-03-2011:42:19 AM | 66.2 | 146.862 | 32.225 | 75.762 |
| 2016-03-2011:42:23 AM | 66.2 | 146.862 | 32.225 | 75.762 |
| 2016-03-2011:42:27 AM | 66.088 | 146.975 | 32.225 | 75.875 |
| 2016-03-2011:42:31 AM | 66.088 | 146.975 | 32.225 | 75.875 |
| 2016-03-2011:42:35 AM | 66.088 | 146.975 | 32.338 | 75.875 |
| 2016-03-2011:42:40 AM | 66.088 | 147.088 | 32.338 | 75.875 |
| 2016-03-2011:42:44 AM | 66.088 | 147.088 | 32.338 | 75.875 |
| 2016-03-2011:42:48 AM | 66.088 | 147.088 | 32.338 | 75.762 |
| 2016-03-2011:42:52 AM | 66.2 | 147.088 | 32.338 | 75.875 |
| 2016-03-2011:42:56 AM | 66.2 | 147.088 | 32.225 | 75.875 |
| 2016-03-2011:43:00 AM | 66.312 | 147.088 | 32.225 | 75.875 |
| 2016-03-2011:43:04 AM | 66.312 | 147.2 | 32.112 | 75.875 |
| 2016-03-2011:43:08 AM | 66.312 | 147.2 | 32.112 | 75.762 |
| 2016-03-2011:43:12 AM | 66.2 | 147.2 | 32.112 | 75.875 |
| 2016-03-2011:43:16 AM | 66.088 | 147.312 | 32.225 | 75.875 |
| 2016-03-2011:43:20 AM | 65.975 | 147.312 | 32.225 | 75.875 |
| 2016-03-2011:43:24 AM | 65.975 | 147.312 | 32.225 | 75.875 |
| 2016-03-2011:43:28 AM | 65.862 | 147.312 | 32.225 | 75.875 |
| 2016-03-2011:43:31 AM | 65.975 | 147.425 | 32.112 | 75.875 |
| 2016-03-2011:43:36 AM | 65.975 | 147.425 | 32.112 | 75.875 |
| 2016-03-2011:43:40 AM | 65.975 | 147.538 | 32.112 | 75.875 |
| 2016-03-2011:43:44 AM | 65.862 | 147.538 | 32.112 | 75.875 |
| 2016-03-2011:43:48 AM | 65.975 | 147.538 | 32.225 | 75.875 |
| 2016-03-2011:43:52 AM | 65.975 | 147.538 | 32.225 | 75.875 |
| 2016-03-2011:43:55 AM | 66.088 | 147.65 | 32.225 | 75.875 |
| 2016-03-2011:44:00 AM | 66.2 | 147.65 | 32.338 | 75.875 |
| 2016-03-2011:44:04 AM | 66.2 | 147.65 | 32.338 | 75.875 |
| 2016-03-2011:44:08 AM | 66.2 | 147.65 | 32.45 | 75.762 |
| 2016-03-2011:44:12 AM | 66.2 | 147.65 | 32.562 | 75.875 |
| 2016-03-2011:44:16 AM | 66.088 | 147.65 | 32.675 | 75.875 |
| 2016-03-2011:44:20 AM | 66.2 | 147.763 | 32.788 | 75.875 |
| 2016-03-2011:44:24 AM | 66.312 | 147.763 | 32.9 | 75.875 |
| 2016-03-2011:44:28 AM | 66.312 | 147.763 | 32.9 | 75.875 |
| 2016-03-2011:44:32 AM | 66.2 | 147.763 | 33.012 | 75.875 |
| 2016-03-2011:44:36 AM | 66.2 | 147.875 | 33.012 | 75.875 |
| 2016-03-2011:44:40 AM | 66.312 | 147.875 | 33.125 | 75.875 |
| 2016-03-2011:44:44 AM | 66.312 | 147.875 | 33.238 | 75.875 |
| 2016-03-2011:44:48 AM | 66.312 | 147.875 | 33.35 | 75.875 |
| 2016-03-2011:44:52 AM | 66.312 | 147.875 | 33.462 | 75.875 |
| 2016-03-2011:44:56 AM | 66.425 | 147.988 | 33.575 | 75.875 |
| 2016-03-2011:45:00 AM | 66.425 | 147.988 | 33.575 | 75.875 |
| 2016-03-2011:45:04 AM | 66.538 | 147.988 | 33.688 | 75.875 |
| 2016-03-2011:45:08 AM | 66.425 | 147.988 | 33.575 | 75.875 |
| 2016-03-2011:45:12 AM | 66.312 | 147.988 | 33.575 | 75.875 |
| 2016-03-2011:45:16 AM | 66.2 | 148.1 | 33.575 | 75.875 |
| 2016-03-2011:45:20 AM | 66.088 | 148.1 | 33.575 | 75.875 |
| 2016-03-2011:45:24 AM | 66.088 | 148.1 | 33.688 | 75.875 |
| 2016-03-2011:45:28 AM | 65.975 | 148.212 | 33.688 | 75.988 |
| 2016-03-2011:45:32 AM | 65.862 | 148.212 | 33.688 | 75.988 |
| 2016-03-2011:45:36 AM | 65.638 | 148.212 | 33.688 | 75.988 |
| 2016-03-2011:45:40 AM | 65.3 | 148.325 | 33.688 | 75.988 |
| 2016-03-2011:45:44 AM | 65.075 | 148.325 | 33.8 | 75.988 |
| 2016-03-2011:45:48 AM | 64.963 | 148.325 | 33.8 | 75.988 |
| 2016-03-2011:45:52 AM | 64.738 | 148.438 | 33.8 | 75.988 |
| 2016-03-2011:45:56 AM | 64.625 | 148.438 | 33.8 | 75.988 |
| 2016-03-2011:46:00 AM | 64.625 | 148.438 | 33.8 | 75.988 |
| 2016-03-2011:46:04 AM | 64.738 | 148.438 | 33.8 | 75.988 |
| 2016-03-2011:46:08 AM | 64.738 | 148.55 | 33.688 | 75.988 |
| 2016-03-2011:46:12 AM | 64.85 | 148.55 | 33.575 | 75.988 |
| 2016-03-2011:46:16 AM | 65.075 | 148.662 | 33.462 | 75.988 |
| 2016-03-2011:46:20 AM | 65.188 | 148.662 | 33.35 | 75.988 |
| 2016-03-2011:46:25 AM | 65.188 | 148.662 | 33.35 | 75.988 |
| 2016-03-2011:46:29 AM | 65.3 | 148.662 | 33.462 | 75.988 |
| 2016-03-2011:46:33 AM | 65.412 | 148.775 | 33.575 | 75.988 |
| 2016-03-2011:46:37 AM | 65.525 | 148.775 | 33.575 | 75.988 |
| 2016-03-2011:46:41 AM | 65.638 | 148.775 | 33.575 | 75.988 |
| 2016-03-2011:46:45 AM | 65.638 | 148.888 | 33.575 | 75.988 |
| 2016-03-2011:46:49 AM | 65.75 | 148.888 | 33.35 | 75.988 |
| 2016-03-2011:46:53 AM | 65.75 | 148.888 | 33.125 | 75.988 |
| 2016-03-2011:46:57 AM | 65.862 | 148.888 | 33.012 | 76.1 |
| 2016-03-2011:47:01 AM | 65.975 | 149 | 32.9 | 76.1 |
| 2016-03-2011:47:05 AM | 66.088 | 149.112 | 32.788 | 76.1 |
| 2016-03-2011:47:09 AM | 66.088 | 149.112 | 32.45 | 75.988 |
| 2016-03-2011:47:13 AM | 65.975 | 149.112 | 32.225 | 75.988 |
| 2016-03-2011:47:17 AM | 65.862 | 149.112 | 32 | 76.1 |
| 2016-03-2011:47:21 AM | 65.862 | 149.112 | 31.888 | 76.1 |
| 2016-03-2011:47:25 AM | 65.75 | 149.112 | 31.775 | 76.1 |
| 2016-03-2011:47:29 AM | 65.75 | 149.225 | 31.775 | 76.1 |
| 2016-03-2011:47:33 AM | 65.75 | 149.225 | 31.775 | 76.1 |
| 2016-03-2011:47:37 AM | 65.75 | 149.225 | 31.775 | 76.1 |
| 2016-03-2011:47:41 AM | 65.862 | 149.225 | 31.888 | 76.1 |
| 2016-03-2011:47:45 AM | 65.862 | 149.225 | 31.775 | 76.1 |
| 2016-03-2011:47:49 AM | 65.862 | 149.225 | 31.775 | 76.1 |
| 2016-03-2011:47:53 AM | 65.638 | 149.225 | 31.888 | 76.1 |
| 2016-03-2011:47:57 AM | 65.525 | 149.225 | 32 | 76.212 |
| 2016-03-2011:48:01 AM | 65.412 | 149.225 | 32 | 76.1 |
| 2016-03-2011:48:05 AM | 65.412 | 149.338 | 32.112 | 76.1 |
| 2016-03-2011:48:09 AM | 65.525 | 149.338 | 32.225 | 76.1 |
| 2016-03-2011:48:13 AM | 65.525 | 149.338 | 32.338 | 76.1 |
| 2016-03-2011:48:17 AM | 65.638 | 149.338 | 32.338 | 76.1 |
| 2016-03-2011:48:21 AM | 65.75 | 149.338 | 32.338 | 76.212 |
| 2016-03-2011:48:25 AM | 65.75 | 149.338 | 32.45 | 76.1 |
| 2016-03-2011:48:29 AM | 65.75 | 149.338 | 32.562 | 76.212 |
| 2016-03-2011:48:33 AM | 65.75 | 149.338 | 32.562 | 76.212 |
| 2016-03-2011:48:37 AM | 65.75 | 149.45 | 32.675 | 76.212 |
| 2016-03-2011:48:41 AM | 65.975 | 149.45 | 32.788 | 76.212 |
| 2016-03-2011:48:45 AM | 66.088 | 149.45 | 32.788 | 76.212 |
| 2016-03-2011:48:50 AM | 66.2 | 149.45 | 32.788 | 76.212 |
| 2016-03-2011:48:54 AM | 66.312 | 149.45 | 32.9 | 76.212 |
| 2016-03-2011:48:58 AM | 66.538 | 149.562 | 32.9 | 76.212 |
| 2016-03-2011:49:02 AM | 66.65 | 149.562 | 33.012 | 76.212 |
| 2016-03-2011:49:06 AM | 66.875 | 149.562 | 33.012 | 76.212 |
| 2016-03-2011:49:10 AM | 66.988 | 149.562 | 33.012 | 76.212 |
| 2016-03-2011:49:14 AM | 67.1 | 149.675 | 33.012 | 76.212 |
| 2016-03-2011:49:18 AM | 66.988 | 149.675 | 33.125 | 76.212 |
| 2016-03-2011:49:22 AM | 66.762 | 149.675 | 33.238 | 76.212 |
| 2016-03-2011:49:26 AM | 66.65 | 149.675 | 33.238 | 76.212 |
| 2016-03-2011:49:30 AM | 66.425 | 149.788 | 33.35 | 76.212 |
| 2016-03-2011:49:34 AM | 66.312 | 149.788 | 33.462 | 76.212 |
| 2016-03-2011:49:38 AM | 66.088 | 149.788 | 33.462 | 76.325 |
| 2016-03-2011:49:42 AM | 66.088 | 149.9 | 33.462 | 76.212 |
| 2016-03-2011:49:46 AM | 66.088 | 149.9 | 33.462 | 76.325 |
| 2016-03-2011:49:50 AM | 66.088 | 150.013 | 33.462 | 76.212 |
| 2016-03-2011:49:54 AM | 66.2 | 150.013 | 33.35 | 76.212 |
| 2016-03-2011:49:58 AM | 66.2 | 150.013 | 33.462 | 76.325 |
| 2016-03-2011:50:02 AM | 66.2 | 150.013 | 33.35 | 76.325 |
| 2016-03-2011:50:06 AM | 66.088 | 150.125 | 33.125 | 76.325 |
| 2016-03-2011:50:10 AM | 65.975 | 150.125 | 33.012 | 76.325 |
| 2016-03-2011:50:14 AM | 65.862 | 150.125 | 32.9 | 76.325 |
| 2016-03-2011:50:18 AM | 65.75 | 150.238 | 32.9 | 76.325 |
| 2016-03-2011:50:22 AM | 65.75 | 150.238 | 32.9 | 76.325 |
| 2016-03-2011:50:26 AM | 65.525 | 150.238 | 33.012 | 76.325 |
| 2016-03-2011:50:30 AM | 65.3 | 150.238 | 33.012 | 76.325 |
| 2016-03-2011:50:34 AM | 65.188 | 150.35 | 33.125 | 76.325 |
| 2016-03-2011:50:38 AM | 65.075 | 150.35 | 33.125 | 76.325 |
| 2016-03-2011:50:42 AM | 64.738 | 150.35 | 33.238 | 76.438 |
| 2016-03-2011:50:46 AM | 64.625 | 150.35 | 33.125 | 76.325 |
| 2016-03-2011:50:51 AM | 64.625 | 150.35 | 33.125 | 76.325 |
| 2016-03-2011:50:55 AM | 64.512 | 150.462 | 33.125 | 76.438 |
| 2016-03-2011:50:59 AM | 64.512 | 150.462 | 33.012 | 76.325 |
| 2016-03-2011:51:03 AM | 64.4 | 150.462 | 32.9 | 76.438 |
| 2016-03-2011:51:07 AM | 64.287 | 150.575 | 32.788 | 76.438 |
| 2016-03-2011:51:11 AM | 64.062 | 150.575 | 32.675 | 76.438 |
| 2016-03-2011:51:15 AM | 64.062 | 150.575 | 32.788 | 76.325 |
| 2016-03-2011:51:19 AM | 63.95 | 150.688 | 32.675 | 76.438 |
| 2016-03-2011:51:23 AM | 63.725 | 150.688 | 32.675 | 76.438 |
| 2016-03-2011:51:27 AM | 63.725 | 150.688 | 32.675 | 76.438 |
| 2016-03-2011:51:31 AM | 63.613 | 150.8 | 32.788 | 76.438 |
| 2016-03-2011:51:35 AM | 63.613 | 150.8 | 32.9 | 76.438 |
| 2016-03-2011:51:39 AM | 63.388 | 150.8 | 33.012 | 76.438 |
| 2016-03-2011:51:43 AM | 63.162 | 150.912 | 33.012 | 76.438 |
| 2016-03-2011:51:47 AM | 63.162 | 150.912 | 33.012 | 76.438 |
| 2016-03-2011:51:51 AM | 63.05 | 150.912 | 33.012 | 76.438 |
| 2016-03-2011:51:55 AM | 62.938 | 150.912 | 33.012 | 76.438 |
| 2016-03-2011:51:59 AM | 62.938 | 150.912 | 33.012 | 76.438 |
| 2016-03-2011:52:03 AM | 62.938 | 151.025 | 32.9 | 76.438 |
| 2016-03-2011:52:07 AM | 63.05 | 151.025 | 32.9 | 76.438 |
| 2016-03-2011:52:11 AM | 63.05 | 151.025 | 32.788 | 76.438 |
| 2016-03-2011:52:15 AM | 63.05 | 151.025 | 32.675 | 76.438 |
| 2016-03-2011:52:19 AM | 62.938 | 151.138 | 32.562 | 76.438 |
| 2016-03-2011:52:23 AM | 62.825 | 151.025 | 32.562 | 76.438 |
| 2016-03-2011:52:27 AM | 62.825 | 151.025 | 32.562 | 76.438 |
| 2016-03-2011:52:31 AM | 62.938 | 151.138 | 32.45 | 76.438 |
| 2016-03-2011:52:35 AM | 63.05 | 151.138 | 32.562 | 76.438 |
| 2016-03-2011:52:39 AM | 63.162 | 151.138 | 32.45 | 76.438 |
| 2016-03-2011:52:43 AM | 63.275 | 151.138 | 32.562 | 76.438 |
| 2016-03-2011:52:47 AM | 63.388 | 151.138 | 32.562 | 76.438 |
| 2016-03-2011:52:52 AM | 63.5 | 151.138 | 32.45 | 76.438 |
| 2016-03-2011:52:56 AM | 63.613 | 151.138 | 32.45 | 76.438 |
| 2016-03-2011:53:00 AM | 63.725 | 151.138 | 32.338 | 76.438 |
| 2016-03-2011:53:04 AM | 63.95 | 151.138 | 32.338 | 76.438 |
| 2016-03-2011:53:08 AM | 64.062 | 151.138 | 32.225 | 76.438 |
| 2016-03-2011:53:12 AM | 64.062 | 151.138 | 32.225 | 76.438 |
| 2016-03-2011:53:16 AM | 64.175 | 151.138 | 32.225 | 76.438 |
| 2016-03-2011:53:20 AM | 64.175 | 151.138 | 32.225 | 76.55 |
| 2016-03-2011:53:24 AM | 64.175 | 151.138 | 32.225 | 76.438 |
| 2016-03-2011:53:28 AM | 64.287 | 151.138 | 32.112 | 76.438 |
| 2016-03-2011:53:32 AM | 64.4 | 151.138 | 32.112 | 76.438 |
| 2016-03-2011:53:36 AM | 64.512 | 151.025 | 32 | 76.438 |
| 2016-03-2011:53:40 AM | 64.512 | 151.025 | 32.112 | 76.438 |
| 2016-03-2011:53:44 AM | 64.738 | 151.025 | 32.112 | 76.438 |
| 2016-03-2011:53:48 AM | 64.963 | 151.025 | 32.112 | 76.438 |
| 2016-03-2011:53:52 AM | 65.188 | 151.025 | 32 | 76.438 |
| 2016-03-2011:53:56 AM | 65.412 | 150.912 | 32 | 76.55 |
| 2016-03-2011:54:00 AM | 65.525 | 150.912 | 32.112 | 76.55 |
| 2016-03-2011:54:04 AM | 65.638 | 150.912 | 32.112 | 76.438 |
| 2016-03-2011:54:08 AM | 65.862 | 150.912 | 32.112 | 76.438 |
| 2016-03-2011:54:12 AM | 65.975 | 150.8 | 32.225 | 76.438 |
| 2016-03-2011:54:16 AM | 66.2 | 150.8 | 32.225 | 76.438 |
| 2016-03-2011:54:20 AM | 66.425 | 150.8 | 32.225 | 76.55 |
| 2016-03-2011:54:24 AM | 66.425 | 150.8 | 32.338 | 76.55 |
| 2016-03-2011:54:28 AM | 66.538 | 150.8 | 32.338 | 76.438 |
| 2016-03-2011:54:33 AM | 66.65 | 150.688 | 32.45 | 76.55 |
| 2016-03-2011:54:37 AM | 66.762 | 150.688 | 32.45 | 76.55 |
| 2016-03-2011:54:41 AM | 66.875 | 150.8 | 32.45 | 76.438 |
| 2016-03-2011:54:45 AM | 66.988 | 150.688 | 32.338 | 76.55 |
| 2016-03-2011:54:49 AM | 66.988 | 150.688 | 32.112 | 76.55 |
| 2016-03-2011:54:53 AM | 66.988 | 150.688 | 32.112 | 76.55 |
| 2016-03-2011:54:57 AM | 66.875 | 150.688 | 32.112 | 76.55 |
| 2016-03-2011:55:01 AM | 66.762 | 150.688 | 32.112 | 76.55 |
| 2016-03-2011:55:05 AM | 66.538 | 150.575 | 32.112 | 76.55 |
| 2016-03-2011:55:09 AM | 66.538 | 150.575 | 32.112 | 76.55 |
| 2016-03-2011:55:13 AM | 66.425 | 150.575 | 32.225 | 76.55 |
| 2016-03-2011:55:17 AM | 66.425 | 150.575 | 32.338 | 76.55 |
| 2016-03-2011:55:21 AM | 66.538 | 150.575 | 32.45 | 76.55 |
| 2016-03-2011:55:25 AM | 66.538 | 150.575 | 32.562 | 76.55 |
| 2016-03-2011:55:29 AM | 66.65 | 150.462 | 32.788 | 76.662 |
| 2016-03-2011:55:33 AM | 66.65 | 150.575 | 32.788 | 76.662 |
| 2016-03-2011:55:37 AM | 66.762 | 150.462 | 32.9 | 76.662 |
| 2016-03-2011:55:41 AM | 66.875 | 150.462 | 33.012 | 76.662 |
| 2016-03-2011:55:45 AM | 66.875 | 150.462 | 33.125 | 76.662 |
| 2016-03-2011:55:49 AM | 66.762 | 150.575 | 33.238 | 76.662 |
| 2016-03-2011:55:53 AM | 66.65 | 150.462 | 33.35 | 76.662 |
| 2016-03-2011:55:57 AM | 66.538 | 150.575 | 33.35 | 76.662 |
| 2016-03-2011:56:01 AM | 66.538 | 150.575 | 33.462 | 76.662 |
| 2016-03-2011:56:05 AM | 66.538 | 150.575 | 33.575 | 76.662 |
| 2016-03-2011:56:09 AM | 66.538 | 150.575 | 33.462 | 76.662 |
| 2016-03-2011:56:13 AM | 66.538 | 150.575 | 33.575 | 76.662 |
| 2016-03-2011:56:17 AM | 66.65 | 150.688 | 33.462 | 76.662 |
| 2016-03-2011:56:21 AM | 66.65 | 150.688 | 33.575 | 76.662 |
| 2016-03-2011:56:25 AM | 66.538 | 150.688 | 33.575 | 76.662 |
| 2016-03-2011:56:29 AM | 66.538 | 150.688 | 33.688 | 76.662 |
| 2016-03-2011:56:33 AM | 66.538 | 150.8 | 33.35 | 76.662 |
| 2016-03-2011:56:37 AM | 66.538 | 150.8 | 33.012 | 76.662 |
| 2016-03-2011:56:41 AM | 66.65 | 150.8 | 32.675 | 76.662 |
| 2016-03-2011:56:46 AM | 66.65 | 150.912 | 32.45 | 76.662 |
| 2016-03-2011:56:50 AM | 66.762 | 150.912 | 32.112 | 76.662 |
| 2016-03-2011:56:54 AM | 66.762 | 150.912 | 31.888 | 76.662 |
| 2016-03-2011:56:58 AM | 66.762 | 150.912 | 31.662 | 76.662 |
| 2016-03-2011:57:02 AM | 66.762 | 150.912 | 31.55 | 76.662 |
| 2016-03-2011:57:06 AM | 66.762 | 151.025 | 31.325 | 76.55 |
| 2016-03-2011:57:10 AM | 66.762 | 151.025 | 31.212 | 76.55 |
| 2016-03-2011:57:14 AM | 66.762 | 151.025 | 31.212 | 76.662 |
| 2016-03-2011:57:18 AM | 66.762 | 151.025 | 31.212 | 76.662 |
| 2016-03-2011:57:22 AM | 66.762 | 151.138 | 31.212 | 76.662 |
| 2016-03-2011:57:26 AM | 66.875 | 151.025 | 31.212 | 76.662 |
| 2016-03-2011:57:30 AM | 66.65 | 151.025 | 31.325 | 76.662 |
| 2016-03-2011:57:34 AM | 66.65 | 151.138 | 31.325 | 76.662 |
| 2016-03-2011:57:38 AM | 66.538 | 151.138 | 31.438 | 76.662 |
| 2016-03-2011:57:42 AM | 66.538 | 151.138 | 31.55 | 76.662 |
| 2016-03-2011:57:46 AM | 66.538 | 151.138 | 31.55 | 76.662 |
| 2016-03-2011:57:50 AM | 66.538 | 151.138 | 31.662 | 76.662 |
| 2016-03-2011:57:54 AM | 66.538 | 151.25 | 31.775 | 76.662 |
| 2016-03-2011:57:58 AM | 66.538 | 151.138 | 31.888 | 76.662 |
| 2016-03-2011:58:02 AM | 66.538 | 151.25 | 32 | 76.662 |
| 2016-03-2011:58:06 AM | 66.538 | 151.25 | 32.225 | 76.662 |
| 2016-03-2011:58:10 AM | 66.425 | 151.25 | 32.338 | 76.662 |
| 2016-03-2011:58:14 AM | 66.312 | 151.25 | 32.45 | 76.662 |
| 2016-03-2011:58:18 AM | 66.2 | 151.25 | 32.675 | 76.662 |
| 2016-03-2011:58:22 AM | 66.088 | 151.25 | 32.788 | 76.662 |
| 2016-03-2011:58:26 AM | 66.2 | 151.362 | 32.788 | 76.775 |
| 2016-03-2011:58:30 AM | 66.088 | 151.362 | 32.788 | 76.662 |
| 2016-03-2011:58:34 AM | 66.088 | 151.362 | 32.9 | 76.775 |
| 2016-03-2011:58:38 AM | 65.975 | 151.475 | 32.9 | 76.775 |
| 2016-03-2011:58:42 AM | 65.975 | 151.475 | 32.9 | 76.775 |
| 2016-03-2011:58:46 AM | 65.975 | 151.475 | 33.012 | 76.775 |
| 2016-03-2011:58:50 AM | 66.088 | 151.588 | 33.012 | 76.662 |
| 2016-03-2011:58:54 AM | 66.088 | 151.588 | 33.238 | 76.775 |
| 2016-03-2011:58:58 AM | 66.2 | 151.588 | 33.238 | 76.775 |
| 2016-03-2011:59:03 AM | 66.2 | 151.588 | 33.35 | 76.662 |
| 2016-03-2011:59:07 AM | 66.312 | 151.7 | 33.238 | 76.662 |
| 2016-03-2011:59:11 AM | 66.312 | 151.7 | 33.125 | 76.662 |
| 2016-03-2011:59:15 AM | 66.425 | 151.7 | 33.125 | 76.662 |
| 2016-03-2011:59:19 AM | 66.538 | 151.812 | 33.125 | 76.775 |
| 2016-03-2011:59:23 AM | 66.65 | 151.812 | 33.125 | 76.662 |
| 2016-03-2011:59:27 AM | 66.762 | 151.812 | 33.238 | 76.662 |
| 2016-03-2011:59:31 AM | 66.988 | 151.925 | 33.238 | 76.775 |
| 2016-03-2011:59:35 AM | 66.988 | 151.925 | 33.35 | 76.775 |
| 2016-03-2011:59:39 AM | 66.875 | 151.925 | 33.238 | 76.775 |
| 2016-03-2011:59:43 AM | 66.875 | 152.038 | 33.238 | 76.662 |
| 2016-03-2011:59:47 AM | 66.762 | 152.038 | 33.125 | 76.775 |
| 2016-03-2011:59:51 AM | 66.762 | 152.15 | 33.012 | 76.775 |
| 2016-03-2011:59:55 AM | 66.65 | 152.15 | 33.125 | 76.775 |
| 2016-03-2011:59:59 AM | 66.762 | 152.15 | 33.012 | 76.775 |
| 2016-03-2012:00:03 PM | 66.762 | 152.263 | 33.012 | 76.775 |
| 2016-03-2012:00:07 PM | 66.875 | 152.263 | 33.238 | 76.775 |
| 2016-03-2012:00:11 PM | 66.875 | 152.263 | 33.238 | 76.775 |
| 2016-03-2012:00:15 PM | 66.875 | 152.375 | 33.35 | 76.775 |
| 2016-03-2012:00:19 PM | 66.875 | 152.375 | 33.462 | 76.775 |
| 2016-03-2012:00:23 PM | 66.875 | 152.375 | 33.575 | 76.775 |
| 2016-03-2012:00:27 PM | 66.875 | 152.375 | 33.8 | 76.775 |
| 2016-03-2012:00:31 PM | 66.762 | 152.488 | 33.8 | 76.775 |
| 2016-03-2012:00:35 PM | 66.65 | 152.488 | 33.8 | 76.775 |
| 2016-03-2012:00:39 PM | 66.538 | 152.488 | 33.912 | 76.775 |
| 2016-03-2012:00:43 PM | 66.538 | 152.6 | 33.912 | 76.775 |
| 2016-03-2012:00:47 PM | 66.65 | 152.6 | 33.912 | 76.775 |
| 2016-03-2012:00:51 PM | 66.65 | 152.6 | 34.025 | 76.775 |
| 2016-03-2012:00:55 PM | 66.538 | 152.712 | 34.138 | 76.775 |
| 2016-03-2012:01:00 PM | 66.538 | 152.712 | 34.138 | 76.775 |
| 2016-03-2012:01:04 PM | 66.425 | 152.712 | 34.025 | 76.888 |
| 2016-03-2012:01:08 PM | 66.312 | 152.825 | 34.025 | 76.775 |
| 2016-03-2012:01:12 PM | 66.425 | 152.825 | 34.025 | 76.888 |
| 2016-03-2012:01:16 PM | 66.538 | 152.938 | 34.025 | 76.888 |
| 2016-03-2012:01:20 PM | 66.538 | 152.938 | 34.138 | 76.888 |
| 2016-03-2012:01:24 PM | 66.65 | 152.938 | 34.138 | 76.775 |
| 2016-03-2012:01:28 PM | 66.65 | 152.938 | 34.138 | 76.888 |
| 2016-03-2012:01:32 PM | 66.875 | 153.05 | 34.25 | 76.775 |
| 2016-03-2012:01:36 PM | 66.988 | 153.05 | 34.475 | 76.775 |
| 2016-03-2012:01:40 PM | 67.1 | 153.162 | 34.588 | 76.888 |
| 2016-03-2012:01:44 PM | 67.212 | 153.162 | 34.588 | 76.888 |
| 2016-03-2012:01:48 PM | 67.212 | 153.162 | 34.7 | 76.888 |
| 2016-03-2012:01:52 PM | 67.212 | 153.275 | 34.588 | 76.888 |
| 2016-03-2012:01:56 PM | 67.212 | 153.275 | 34.588 | 76.888 |
| 2016-03-2012:02:00 PM | 67.212 | 153.275 | 34.588 | 76.888 |
| 2016-03-2012:02:04 PM | 67.212 | 153.388 | 34.588 | 76.888 |
| 2016-03-2012:02:08 PM | 67.212 | 153.388 | 34.588 | 76.888 |
| 2016-03-2012:02:12 PM | 67.1 | 153.388 | 34.362 | 76.888 |
| 2016-03-2012:02:16 PM | 66.988 | 153.5 | 34.138 | 76.888 |
| 2016-03-2012:02:20 PM | 66.875 | 153.5 | 33.8 | 76.888 |
| 2016-03-2012:02:24 PM | 66.875 | 153.612 | 33.8 | 76.888 |
| 2016-03-2012:02:28 PM | 66.988 | 153.612 | 33.688 | 76.888 |
| 2016-03-2012:02:33 PM | 66.988 | 153.612 | 33.575 | 76.775 |
| 2016-03-2012:02:37 PM | 66.988 | 153.725 | 33.462 | 76.775 |
| 2016-03-2012:02:41 PM | 66.875 | 153.725 | 33.462 | 76.775 |
| 2016-03-2012:02:45 PM | 66.875 | 153.725 | 33.35 | 76.775 |
| 2016-03-2012:02:49 PM | 66.875 | 153.838 | 33.35 | 76.775 |
| 2016-03-2012:02:53 PM | 66.875 | 153.838 | 33.238 | 76.775 |
| 2016-03-2012:02:57 PM | 66.988 | 153.838 | 33.238 | 76.775 |
| 2016-03-2012:03:01 PM | 66.875 | 153.838 | 33.35 | 76.775 |
| 2016-03-2012:03:05 PM | 66.762 | 153.95 | 33.462 | 76.775 |
| 2016-03-2012:03:09 PM | 66.538 | 153.95 | 33.462 | 76.775 |
| 2016-03-2012:03:13 PM | 66.538 | 154.062 | 33.462 | 76.775 |
| 2016-03-2012:03:17 PM | 66.425 | 154.062 | 33.462 | 76.775 |
| 2016-03-2012:03:21 PM | 66.312 | 154.062 | 33.462 | 76.775 |
| 2016-03-2012:03:25 PM | 66.2 | 154.062 | 33.462 | 76.775 |
| 2016-03-2012:03:29 PM | 65.975 | 154.062 | 33.462 | 76.775 |
| 2016-03-2012:03:33 PM | 65.862 | 154.062 | 33.462 | 76.775 |
| 2016-03-2012:03:37 PM | 65.638 | 154.175 | 33.35 | 76.775 |
| 2016-03-2012:03:41 PM | 65.638 | 154.175 | 33.462 | 76.775 |
| 2016-03-2012:03:45 PM | 65.412 | 154.175 | 33.575 | 76.662 |
| 2016-03-2012:03:49 PM | 65.412 | 154.175 | 33.688 | 76.775 |
| 2016-03-2012:03:53 PM | 65.412 | 154.175 | 33.8 | 76.662 |
| 2016-03-2012:03:57 PM | 65.412 | 154.288 | 33.912 | 76.662 |
| 2016-03-2012:04:01 PM | 65.412 | 154.288 | 34.025 | 76.662 |
| 2016-03-2012:04:05 PM | 65.412 | 154.288 | 34.025 | 76.662 |
| 2016-03-2012:04:09 PM | 65.412 | 154.288 | 34.138 | 76.662 |
| 2016-03-2012:04:13 PM | 65.525 | 154.4 | 34.138 | 76.662 |
| 2016-03-2012:04:17 PM | 65.525 | 154.4 | 34.138 | 76.662 |
| 2016-03-2012:04:22 PM | 65.525 | 154.4 | 34.25 | 76.662 |
| 2016-03-2012:04:26 PM | 65.638 | 154.4 | 34.25 | 76.662 |
| 2016-03-2012:04:30 PM | 65.638 | 154.513 | 34.138 | 76.662 |
| 2016-03-2012:04:34 PM | 65.75 | 154.513 | 34.25 | 76.662 |
| 2016-03-2012:04:38 PM | 65.75 | 154.625 | 34.25 | 76.662 |
| 2016-03-2012:04:42 PM | 65.862 | 154.625 | 34.362 | 76.662 |
| 2016-03-2012:04:46 PM | 65.975 | 154.625 | 34.475 | 76.662 |
| 2016-03-2012:04:50 PM | 66.088 | 154.625 | 34.362 | 76.662 |
| 2016-03-2012:04:54 PM | 66.088 | 154.738 | 34.362 | 76.662 |
| 2016-03-2012:04:58 PM | 66.088 | 154.738 | 34.475 | 76.662 |
| 2016-03-2012:05:02 PM | 66.088 | 154.738 | 34.588 | 76.662 |
| 2016-03-2012:05:06 PM | 66.088 | 154.85 | 34.588 | 76.55 |
| 2016-03-2012:05:10 PM | 65.975 | 154.85 | 34.588 | 76.662 |
| 2016-03-2012:05:14 PM | 65.862 | 154.85 | 34.362 | 76.662 |
| 2016-03-2012:05:18 PM | 65.862 | 154.85 | 34.362 | 76.55 |
| 2016-03-2012:05:22 PM | 65.638 | 154.962 | 34.362 | 76.662 |
| 2016-03-2012:05:26 PM | 65.525 | 154.962 | 34.362 | 76.662 |
| 2016-03-2012:05:30 PM | 65.412 | 154.962 | 34.475 | 76.55 |
| 2016-03-2012:05:34 PM | 65.3 | 155.075 | 34.362 | 76.55 |
| 2016-03-2012:05:38 PM | 65.412 | 155.075 | 34.475 | 76.55 |
| 2016-03-2012:05:42 PM | 65.412 | 155.075 | 34.362 | 76.55 |
| 2016-03-2012:05:47 PM | 65.412 | 155.075 | 34.362 | 76.55 |
| 2016-03-2012:05:51 PM | 65.525 | 155.188 | 34.475 | 76.55 |
| 2016-03-2012:05:59 PM | 65.525 | 155.188 | 34.475 | 76.55 |
| 2016-03-2012:06:03 PM | 65.412 | 155.188 | 34.362 | 76.662 |
| 2016-03-2012:06:07 PM | 65.412 | 155.3 | 34.362 | 76.662 |
| 2016-03-2012:06:11 PM | 65.412 | 155.3 | 34.475 | 76.55 |
| 2016-03-2012:06:15 PM | 65.525 | 155.3 | 34.475 | 76.55 |
| 2016-03-2012:06:19 PM | 65.525 | 155.3 | 34.475 | 76.55 |
| 2016-03-2012:06:23 PM | 65.525 | 155.412 | 34.475 | 76.55 |
| 2016-03-2012:06:27 PM | 65.412 | 155.412 | 34.588 | 76.55 |
| 2016-03-2012:06:31 PM | 65.525 | 155.412 | 34.475 | 76.55 |
| 2016-03-2012:06:35 PM | 65.638 | 155.412 | 34.475 | 76.55 |
| 2016-03-2012:06:39 PM | 65.75 | 155.412 | 34.362 | 76.55 |
| 2016-03-2012:06:43 PM | 65.862 | 155.412 | 34.25 | 76.55 |
| 2016-03-2012:06:47 PM | 65.862 | 155.525 | 34.25 | 76.55 |
| 2016-03-2012:06:51 PM | 65.75 | 155.525 | 34.25 | 76.55 |
| 2016-03-2012:06:55 PM | 65.75 | 155.525 | 34.138 | 76.55 |
| 2016-03-2012:06:59 PM | 65.975 | 155.525 | 34.138 | 76.55 |
| 2016-03-2012:07:03 PM | 66.088 | 155.525 | 34.138 | 76.55 |
| 2016-03-2012:07:07 PM | 66.2 | 155.525 | 34.138 | 76.662 |
| 2016-03-2012:07:11 PM | 66.425 | 155.525 | 34.138 | 76.662 |
| 2016-03-2012:07:15 PM | 66.538 | 155.638 | 34.138 | 76.662 |
| 2016-03-2012:07:19 PM | 66.538 | 155.638 | 34.138 | 76.662 |
| 2016-03-2012:07:23 PM | 66.538 | 155.638 | 34.025 | 76.662 |
| 2016-03-2012:07:27 PM | 66.538 | 155.638 | 34.138 | 76.662 |
| 2016-03-2012:07:31 PM | 66.312 | 155.638 | 34.25 | 76.662 |
| 2016-03-2012:07:36 PM | 66.425 | 155.638 | 34.25 | 76.775 |
| 2016-03-2012:07:40 PM | 66.538 | 155.638 | 34.25 | 76.775 |
| 2016-03-2012:07:44 PM | 66.425 | 155.638 | 34.25 | 76.775 |
| 2016-03-2012:07:48 PM | 66.2 | 155.638 | 34.138 | 76.775 |
| 2016-03-2012:07:52 PM | 65.975 | 155.638 | 34.138 | 76.775 |
| 2016-03-2012:07:56 PM | 65.862 | 155.638 | 34.25 | 76.775 |
| 2016-03-2012:08:00 PM | 65.75 | 155.638 | 34.25 | 76.775 |
| 2016-03-2012:08:04 PM | 65.75 | 155.638 | 34.25 | 76.775 |
| 2016-03-2012:08:08 PM | 65.75 | 155.638 | 34.25 | 76.775 |
| 2016-03-2012:08:12 PM | 65.75 | 155.638 | 34.25 | 76.775 |
| 2016-03-2012:08:16 PM | 65.75 | 155.638 | 34.362 | 76.775 |
| 2016-03-2012:08:20 PM | 65.862 | 155.638 | 34.362 | 76.775 |
| 2016-03-2012:08:24 PM | 65.862 | 155.75 | 34.475 | 76.775 |
| 2016-03-2012:08:28 PM | 65.975 | 155.75 | 34.475 | 76.775 |
| 2016-03-2012:08:32 PM | 65.975 | 155.75 | 34.475 | 76.775 |
| 2016-03-2012:08:36 PM | 66.088 | 155.75 | 34.475 | 76.775 |
| 2016-03-2012:08:40 PM | 66.2 | 155.75 | 34.475 | 76.775 |
| 2016-03-2012:08:44 PM | 66.312 | 155.75 | 34.362 | 76.775 |
| 2016-03-2012:08:48 PM | 66.425 | 155.75 | 34.475 | 76.775 |
| 2016-03-2012:08:52 PM | 66.538 | 155.75 | 34.475 | 76.775 |
| 2016-03-2012:08:56 PM | 66.538 | 155.75 | 34.588 | 76.775 |
| 2016-03-2012:09:00 PM | 66.538 | 155.75 | 34.588 | 76.775 |
| 2016-03-2012:09:04 PM | 66.538 | 155.862 | 34.588 | 76.775 |
| 2016-03-2012:09:08 PM | 66.425 | 155.862 | 34.588 | 76.775 |
| 2016-03-2012:09:12 PM | 66.425 | 155.862 | 34.475 | 76.775 |
| 2016-03-2012:09:17 PM | 66.2 | 155.862 | 34.362 | 76.775 |
| 2016-03-2012:09:21 PM | 65.975 | 155.862 | 34.138 | 76.775 |
| 2016-03-2012:09:25 PM | 65.75 | 155.975 | 34.025 | 76.775 |
| 2016-03-2012:09:29 PM | 65.638 | 155.975 | 33.8 | 76.775 |
| 2016-03-2012:09:33 PM | 65.638 | 155.975 | 33.8 | 76.775 |
| 2016-03-2012:09:37 PM | 65.638 | 155.975 | 33.575 | 76.775 |
| 2016-03-2012:09:41 PM | 65.525 | 155.975 | 33.35 | 76.775 |
| 2016-03-2012:09:45 PM | 65.412 | 156.088 | 33.238 | 76.775 |
| 2016-03-2012:09:49 PM | 65.412 | 155.975 | 33.238 | 76.775 |
| 2016-03-2012:09:53 PM | 65.412 | 156.088 | 33.238 | 76.662 |
| 2016-03-2012:09:57 PM | 65.525 | 156.088 | 33.35 | 76.662 |
| 2016-03-2012:10:01 PM | 65.638 | 156.088 | 33.35 | 76.775 |
| 2016-03-2012:10:05 PM | 65.638 | 156.088 | 33.462 | 76.775 |
| 2016-03-2012:10:09 PM | 65.525 | 156.2 | 33.462 | 76.775 |
| 2016-03-2012:10:13 PM | 65.525 | 156.2 | 33.462 | 76.775 |
| 2016-03-2012:10:17 PM | 65.525 | 156.2 | 33.462 | 76.775 |
| 2016-03-2012:10:21 PM | 65.412 | 156.2 | 33.462 | 76.662 |
| 2016-03-2012:10:25 PM | 65.412 | 156.2 | 33.35 | 76.662 |
| 2016-03-2012:10:29 PM | 65.3 | 156.2 | 33.35 | 76.662 |
| 2016-03-2012:10:33 PM | 65.3 | 156.2 | 33.462 | 76.662 |
| 2016-03-2012:10:37 PM | 65.3 | 156.2 | 33.462 | 76.775 |
| 2016-03-2012:10:41 PM | 65.412 | 156.2 | 33.35 | 76.775 |
| 2016-03-2012:10:45 PM | 65.412 | 156.2 | 33.35 | 76.662 |
| 2016-03-2012:10:49 PM | 65.412 | 156.2 | 33.462 | 76.775 |
| 2016-03-2012:10:53 PM | 65.525 | 156.2 | 33.462 | 76.775 |
| 2016-03-2012:10:57 PM | 65.525 | 156.2 | 33.575 | 76.775 |
| 2016-03-2012:11:05 PM | 65.525 | 156.2 | 33.238 | 76.775 |
| 2016-03-2012:11:09 PM | 65.525 | 156.2 | 33.238 | 76.775 |
| 2016-03-2012:11:17 PM | 65.638 | 156.2 | 33.125 | 76.775 |
| 2016-03-2012:11:21 PM | 65.638 | 156.2 | 33.125 | 76.775 |
| 2016-03-2012:11:25 PM | 65.638 | 156.2 | 33.125 | 76.775 |
| 2016-03-2012:11:29 PM | 65.638 | 156.2 | 33.238 | 76.775 |
| 2016-03-2012:11:33 PM | 65.525 | 156.312 | 33.238 | 76.775 |
| 2016-03-2012:11:42 PM | 65.525 | 156.312 | 33.238 | 76.775 |
| 2016-03-2012:11:46 PM | 65.525 | 156.312 | 33.238 | 76.775 |
| 2016-03-2012:11:50 PM | 65.75 | 156.312 | 33.012 | 76.775 |
| 2016-03-2012:11:54 PM | 65.75 | 156.312 | 33.012 | 76.775 |
| 2016-03-2012:11:57 PM | 65.862 | 156.312 | 32.9 | 76.775 |
| 2016-03-2012:12:02 PM | 65.975 | 156.312 | 32.788 | 76.888 |
| 2016-03-2012:12:06 PM | 65.975 | 156.312 | 32.788 | 76.775 |
| 2016-03-2012:12:10 PM | 65.862 | 156.312 | 32.675 | 76.888 |
| 2016-03-2012:12:14 PM | 65.75 | 156.312 | 32.788 | 76.775 |
| 2016-03-2012:12:18 PM | 65.638 | 156.312 | 32.9 | 76.775 |
| 2016-03-2012:12:22 PM | 65.525 | 156.312 | 32.9 | 76.775 |
| 2016-03-2012:12:26 PM | 65.412 | 156.312 | 33.012 | 76.888 |
| 2016-03-2012:12:30 PM | 65.412 | 156.312 | 33.012 | 76.888 |
| 2016-03-2012:12:34 PM | 65.412 | 156.312 | 33.238 | 76.888 |
| 2016-03-2012:12:38 PM | 65.412 | 156.312 | 33.238 | 76.775 |
| 2016-03-2012:12:42 PM | 65.412 | 156.312 | 33.238 | 76.775 |
| 2016-03-2012:12:46 PM | 65.525 | 156.312 | 33.238 | 76.888 |
| 2016-03-2012:12:50 PM | 65.525 | 156.312 | 33.125 | 76.775 |
| 2016-03-2012:12:54 PM | 65.525 | 156.312 | 33.125 | 76.775 |
| 2016-03-2012:12:58 PM | 65.638 | 156.312 | 33.125 | 76.775 |
| 2016-03-2012:13:02 PM | 65.638 | 156.312 | 33.238 | 76.775 |
| 2016-03-2012:13:06 PM | 65.75 | 156.312 | 33.238 | 76.775 |
| 2016-03-2012:13:10 PM | 65.638 | 156.312 | 33.125 | 76.775 |
| 2016-03-2012:13:14 PM | 65.75 | 156.312 | 32.9 | 76.775 |
| 2016-03-2012:13:18 PM | 65.75 | 156.312 | 32.788 | 76.775 |
| 2016-03-2012:13:22 PM | 65.75 | 156.312 | 32.675 | 76.775 |
| 2016-03-2012:13:26 PM | 65.862 | 156.312 | 32.675 | 76.775 |
| 2016-03-2012:13:30 PM | 66.088 | 156.312 | 32.562 | 76.775 |
| 2016-03-2012:13:34 PM | 66.2 | 156.425 | 32.562 | 76.775 |
| 2016-03-2012:13:38 PM | 66.425 | 156.425 | 32.45 | 76.775 |
| 2016-03-2012:13:42 PM | 66.538 | 156.425 | 32.225 | 76.775 |
| 2016-03-2012:13:47 PM | 66.538 | 156.425 | 32.225 | 76.775 |
| 2016-03-2012:13:51 PM | 66.65 | 156.425 | 32.225 | 76.775 |
| 2016-03-2012:13:55 PM | 66.65 | 156.425 | 32.338 | 76.775 |
| 2016-03-2012:13:59 PM | 66.65 | 156.425 | 32.45 | 76.775 |
| 2016-03-2012:14:03 PM | 66.762 | 156.425 | 32.562 | 76.775 |
| 2016-03-2012:14:07 PM | 66.988 | 156.538 | 32.675 | 76.775 |
| 2016-03-2012:14:11 PM | 66.988 | 156.538 | 32.788 | 76.775 |
| 2016-03-2012:14:19 PM | 66.988 | 156.538 | 32.9 | 76.775 |
| 2016-03-2012:14:23 PM | 66.988 | 156.538 | 32.788 | 76.775 |
| 2016-03-2012:14:27 PM | 66.988 | 156.538 | 32.45 | 76.775 |
| 2016-03-2012:14:31 PM | 66.988 | 156.65 | 32.338 | 76.775 |
| 2016-03-2012:14:39 PM | 66.988 | 156.65 | 32.112 | 76.775 |
| 2016-03-2012:14:43 PM | 67.1 | 156.65 | 32.112 | 76.775 |
| 2016-03-2012:14:47 PM | 67.212 | 156.65 | 32.112 | 76.775 |
| 2016-03-2012:14:51 PM | 67.212 | 156.65 | 32.112 | 76.775 |
| 2016-03-2012:14:55 PM | 67.325 | 156.763 | 32.225 | 76.775 |
| 2016-03-2012:14:59 PM | 67.325 | 156.763 | 32.225 | 76.775 |
| 2016-03-2012:15:03 PM | 67.325 | 156.763 | 32.338 | 76.775 |
| 2016-03-2012:15:07 PM | 67.438 | 156.763 | 32.45 | 76.775 |
| 2016-03-2012:15:11 PM | 67.55 | 156.875 | 32.45 | 76.775 |
| 2016-03-2012:15:15 PM | 67.662 | 156.875 | 32.45 | 76.775 |
| 2016-03-2012:15:19 PM | 67.662 | 156.875 | 32.338 | 76.775 |
| 2016-03-2012:15:23 PM | 67.662 | 156.875 | 32.338 | 76.662 |
| 2016-03-2012:15:27 PM | 67.662 | 156.875 | 32.45 | 76.775 |
| 2016-03-2012:15:31 PM | 67.662 | 156.875 | 32.562 | 76.775 |
| 2016-03-2012:15:35 PM | 67.662 | 156.988 | 32.562 | 76.775 |
| 2016-03-2012:15:39 PM | 67.775 | 156.988 | 32.675 | 76.775 |
| 2016-03-2012:15:43 PM | 67.775 | 156.988 | 32.788 | 76.775 |
| 2016-03-2012:15:47 PM | 67.775 | 156.988 | 32.9 | 76.775 |
| 2016-03-2012:15:51 PM | 67.888 | 156.988 | 33.012 | 76.775 |
| 2016-03-2012:15:55 PM | 67.888 | 156.988 | 33.125 | 76.775 |
| 2016-03-2012:15:59 PM | 67.888 | 156.988 | 33.35 | 76.775 |
| 2016-03-2012:16:03 PM | 67.888 | 156.988 | 33.35 | 76.775 |
| 2016-03-2012:16:06 PM | 67.775 | 157.1 | 33.35 | 76.775 |
| 2016-03-2012:16:11 PM | 67.775 | 157.1 | 33.35 | 76.775 |
| 2016-03-2012:16:15 PM | 67.775 | 157.1 | 33.238 | 76.775 |
| 2016-03-2012:16:19 PM | 68 | 157.1 | 33.238 | 76.775 |
| 2016-03-2012:16:23 PM | 68.112 | 157.212 | 33.125 | 76.775 |
| 2016-03-2012:16:27 PM | 68.225 | 157.212 | 33.125 | 76.775 |
| 2016-03-2012:16:31 PM | 68.225 | 157.212 | 33.238 | 76.662 |
| 2016-03-2012:16:35 PM | 68.225 | 157.212 | 33.125 | 76.775 |
| 2016-03-2012:16:39 PM | 68.338 | 157.212 | 33.238 | 76.662 |
| 2016-03-2012:16:43 PM | 68.225 | 157.325 | 33.35 | 76.662 |
| 2016-03-2012:16:47 PM | 68.112 | 157.325 | 33.35 | 76.662 |
| 2016-03-2012:16:51 PM | 68 | 157.325 | 33.238 | 76.662 |
| 2016-03-2012:16:55 PM | 67.888 | 157.325 | 33.238 | 76.662 |
| 2016-03-2012:16:59 PM | 67.888 | 157.325 | 33.125 | 76.662 |
| 2016-03-2012:17:03 PM | 67.775 | 157.325 | 32.9 | 76.662 |
| 2016-03-2012:17:07 PM | 67.775 | 157.438 | 32.788 | 76.662 |
| 2016-03-2012:17:11 PM | 67.775 | 157.438 | 32.675 | 76.662 |
| 2016-03-2012:17:15 PM | 67.888 | 157.438 | 32.675 | 76.662 |
| 2016-03-2012:17:19 PM | 67.888 | 157.438 | 32.675 | 76.662 |
| 2016-03-2012:17:23 PM | 67.888 | 157.438 | 32.675 | 76.662 |
| 2016-03-2012:17:27 PM | 68 | 157.438 | 32.45 | 76.662 |
| 2016-03-2012:17:31 PM | 67.888 | 157.438 | 32.45 | 76.662 |
| 2016-03-2012:17:35 PM | 67.888 | 157.55 | 32.45 | 76.662 |
| 2016-03-2012:17:39 PM | 67.888 | 157.55 | 32.338 | 76.662 |
| 2016-03-2012:17:43 PM | 68 | 157.55 | 32.45 | 76.662 |
| 2016-03-2012:17:47 PM | 68 | 157.55 | 32.45 | 76.662 |
| 2016-03-2012:17:51 PM | 68 | 157.55 | 32.45 | 76.662 |
| 2016-03-2012:17:55 PM | 67.662 | 157.55 | 32.562 | 76.662 |
| 2016-03-2012:17:59 PM | 67.438 | 157.55 | 32.675 | 76.662 |
| 2016-03-2012:18:03 PM | 67.212 | 157.55 | 32.675 | 76.662 |
| 2016-03-2012:18:07 PM | 67.1 | 157.55 | 32.788 | 76.662 |
| 2016-03-2012:18:11 PM | 66.988 | 157.55 | 32.788 | 76.662 |
| 2016-03-2012:18:15 PM | 66.988 | 157.55 | 32.9 | 76.662 |
| 2016-03-2012:18:19 PM | 67.1 | 157.662 | 33.012 | 76.662 |
| 2016-03-2012:18:23 PM | 67.212 | 157.662 | 33.125 | 76.662 |
| 2016-03-2012:18:27 PM | 67.325 | 157.55 | 33.125 | 76.662 |
| 2016-03-2012:18:31 PM | 67.325 | 157.662 | 33.125 | 76.662 |
| 2016-03-2012:18:35 PM | 67.325 | 157.662 | 33.238 | 76.662 |
| 2016-03-2012:18:39 PM | 67.438 | 157.662 | 33.238 | 76.662 |
| 2016-03-2012:18:43 PM | 67.662 | 157.662 | 33.238 | 76.662 |
| 2016-03-2012:18:47 PM | 67.775 | 157.662 | 33.35 | 76.662 |
| 2016-03-2012:18:51 PM | 67.888 | 157.662 | 33.462 | 76.662 |
| 2016-03-2012:18:55 PM | 68.112 | 157.662 | 33.575 | 76.662 |
| 2016-03-2012:18:59 PM | 68.338 | 157.775 | 33.575 | 76.662 |
| 2016-03-2012:19:03 PM | 68.562 | 157.775 | 33.575 | 76.662 |
| 2016-03-2012:19:07 PM | 68.675 | 157.775 | 33.688 | 76.662 |
| 2016-03-2012:19:11 PM | 68.788 | 157.775 | 33.575 | 76.662 |
| 2016-03-2012:19:15 PM | 68.675 | 157.775 | 33.575 | 76.662 |
| 2016-03-2012:19:19 PM | 68.675 | 157.775 | 33.575 | 76.55 |
| 2016-03-2012:19:23 PM | 68.562 | 157.888 | 33.688 | 76.662 |
| 2016-03-2012:19:27 PM | 68.562 | 157.888 | 33.688 | 76.662 |
| 2016-03-2012:19:31 PM | 68.562 | 157.888 | 33.8 | 76.662 |
| 2016-03-2012:19:35 PM | 68.675 | 157.888 | 33.8 | 76.55 |
| 2016-03-2012:19:39 PM | 68.675 | 158 | 33.688 | 76.55 |
| 2016-03-2012:19:47 PM | 68.562 | 158 | 33.688 | 76.55 |
| 2016-03-2012:19:51 PM | 68.45 | 158 | 33.688 | 76.662 |
| 2016-03-2012:19:55 PM | 68.338 | 158 | 33.8 | 76.55 |
| 2016-03-2012:19:59 PM | 68.338 | 158 | 33.8 | 76.662 |
| 2016-03-2012:20:03 PM | 68.45 | 158 | 33.8 | 76.55 |
| 2016-03-2012:20:07 PM | 68.45 | 158 | 33.8 | 76.55 |
| 2016-03-2012:20:11 PM | 68.45 | 158 | 33.912 | 76.438 |
| 2016-03-2012:20:15 PM | 68.338 | 158 | 34.025 | 76.55 |
| 2016-03-2012:20:19 PM | 68.112 | 158.112 | 34.138 | 76.438 |
| 2016-03-2012:20:23 PM | 68 | 158.112 | 34.25 | 76.55 |
| 2016-03-2012:20:27 PM | 67.662 | 158.112 | 34.25 | 76.55 |
| 2016-03-2012:20:31 PM | 67.662 | 158.112 | 34.475 | 76.55 |
| 2016-03-2012:20:35 PM | 67.662 | 158.112 | 34.588 | 76.55 |
| 2016-03-2012:20:39 PM | 67.55 | 158.112 | 34.588 | 76.55 |
| 2016-03-2012:20:43 PM | 67.55 | 158.225 | 34.7 | 76.55 |
| 2016-03-2012:20:47 PM | 67.662 | 158.225 | 34.812 | 76.55 |
| 2016-03-2012:20:52 PM | 67.438 | 158.225 | 34.925 | 76.55 |
| 2016-03-2012:20:56 PM | 67.438 | 158.225 | 34.812 | 76.55 |
| 2016-03-2012:21:00 PM | 67.55 | 158.338 | 34.812 | 76.55 |
| 2016-03-2012:21:04 PM | 67.325 | 158.338 | 34.812 | 76.55 |
| 2016-03-2012:21:08 PM | 67.1 | 158.338 | 34.812 | 76.55 |
| 2016-03-2012:21:12 PM | 66.875 | 158.338 | 34.588 | 76.55 |
| 2016-03-2012:21:16 PM | 66.762 | 158.45 | 34.588 | 76.55 |
| 2016-03-2012:21:20 PM | 66.65 | 158.45 | 34.588 | 76.55 |
| 2016-03-2012:21:24 PM | 66.65 | 158.45 | 34.7 | 76.55 |
| 2016-03-2012:21:28 PM | 66.762 | 158.45 | 34.7 | 76.55 |
| 2016-03-2012:21:32 PM | 66.762 | 158.562 | 34.812 | 76.438 |
| 2016-03-2012:21:36 PM | 66.988 | 158.562 | 34.812 | 76.55 |
| 2016-03-2012:21:40 PM | 67.1 | 158.675 | 34.812 | 76.438 |
| 2016-03-2012:21:44 PM | 67.1 | 158.675 | 34.925 | 76.438 |
| 2016-03-2012:21:48 PM | 67.1 | 158.675 | 34.812 | 76.438 |
| 2016-03-2012:21:52 PM | 66.988 | 158.788 | 34.7 | 76.438 |
| 2016-03-2012:21:56 PM | 66.875 | 158.788 | 34.7 | 76.438 |
| 2016-03-2012:22:00 PM | 66.875 | 158.788 | 34.588 | 76.438 |
| 2016-03-2012:22:04 PM | 66.875 | 158.9 | 34.475 | 76.438 |
| 2016-03-2012:22:08 PM | 66.988 | 158.9 | 34.475 | 76.438 |
| 2016-03-2012:22:12 PM | 67.1 | 158.9 | 34.25 | 76.438 |
| 2016-03-2012:22:16 PM | 67.212 | 159.013 | 34.25 | 76.438 |
| 2016-03-2012:22:20 PM | 67.212 | 159.013 | 34.138 | 76.438 |
| 2016-03-2012:22:24 PM | 67.325 | 159.013 | 34.138 | 76.438 |
| 2016-03-2012:22:28 PM | 67.212 | 159.013 | 34.138 | 76.438 |
| 2016-03-2012:22:32 PM | 67.212 | 159.013 | 34.25 | 76.438 |
| 2016-03-2012:22:36 PM | 67.325 | 159.125 | 34.362 | 76.438 |
| 2016-03-2012:22:40 PM | 67.325 | 159.125 | 34.362 | 76.438 |
| 2016-03-2012:22:44 PM | 67.55 | 159.125 | 34.362 | 76.438 |
| 2016-03-2012:22:48 PM | 67.662 | 159.125 | 34.138 | 76.438 |
| 2016-03-2012:22:52 PM | 67.888 | 159.125 | 34.138 | 76.438 |
| 2016-03-2012:22:56 PM | 68 | 159.238 | 34.25 | 76.438 |
| 2016-03-2012:23:00 PM | 68.112 | 159.238 | 34.138 | 76.438 |
| 2016-03-2012:23:04 PM | 68.225 | 159.238 | 34.25 | 76.438 |
| 2016-03-2012:23:09 PM | 68.225 | 159.125 | 34.25 | 76.438 |
| 2016-03-2012:23:13 PM | 68.225 | 159.238 | 34.25 | 76.438 |
| 2016-03-2012:23:17 PM | 68.225 | 159.125 | 34.25 | 76.438 |
| 2016-03-2012:23:21 PM | 68.338 | 159.125 | 34.362 | 76.438 |
| 2016-03-2012:23:25 PM | 68.45 | 159.238 | 34.362 | 76.438 |
| 2016-03-2012:23:29 PM | 68.562 | 159.238 | 34.362 | 76.438 |
| 2016-03-2012:23:33 PM | 68.562 | 159.238 | 34.362 | 76.438 |
| 2016-03-2012:23:37 PM | 68.562 | 159.238 | 34.475 | 76.438 |
| 2016-03-2012:23:41 PM | 68.675 | 159.238 | 34.475 | 76.438 |
| 2016-03-2012:23:45 PM | 68.562 | 159.125 | 34.588 | 76.438 |
| 2016-03-2012:23:49 PM | 68.338 | 159.238 | 34.588 | 76.438 |
| 2016-03-2012:23:53 PM | 68.225 | 159.238 | 34.7 | 76.438 |
| 2016-03-2012:23:57 PM | 68.112 | 159.238 | 34.812 | 76.438 |
| 2016-03-2012:24:01 PM | 68 | 159.125 | 34.7 | 76.438 |
| 2016-03-2012:24:06 PM | 67.775 | 159.238 | 34.7 | 76.438 |
| 2016-03-2012:24:10 PM | 67.438 | 159.238 | 34.588 | 76.438 |
| 2016-03-2012:24:14 PM | 67.1 | 159.238 | 34.475 | 76.438 |
| 2016-03-2012:24:18 PM | 66.875 | 159.238 | 34.475 | 76.438 |
| 2016-03-2012:24:22 PM | 66.875 | 159.238 | 34.588 | 76.438 |
| 2016-03-2012:24:30 PM | 66.762 | 159.238 | 34.475 | 76.438 |
| 2016-03-2012:24:34 PM | 66.875 | 159.238 | 34.475 | 76.438 |
| 2016-03-2012:24:38 PM | 66.875 | 159.238 | 34.475 | 76.325 |
| 2016-03-2012:24:42 PM | 66.988 | 159.238 | 34.475 | 76.438 |
| 2016-03-2012:24:46 PM | 66.988 | 159.238 | 34.475 | 76.438 |
| 2016-03-2012:24:50 PM | 66.988 | 159.35 | 34.588 | 76.438 |
| 2016-03-2012:24:54 PM | 66.988 | 159.35 | 34.588 | 76.438 |
| 2016-03-2012:24:59 PM | 66.988 | 159.35 | 34.475 | 76.438 |
| 2016-03-2012:25:03 PM | 66.988 | 159.35 | 34.475 | 76.438 |
| 2016-03-2012:25:07 PM | 67.1 | 159.35 | 34.475 | 76.438 |
| 2016-03-2012:25:11 PM | 67.212 | 159.462 | 34.475 | 76.438 |
| 2016-03-2012:25:15 PM | 67.325 | 159.462 | 34.475 | 76.325 |
| 2016-03-2012:25:19 PM | 67.438 | 159.462 | 34.475 | 76.438 |
| 2016-03-2012:25:23 PM | 67.438 | 159.575 | 34.588 | 76.438 |
| 2016-03-2012:25:27 PM | 67.55 | 159.575 | 34.588 | 76.438 |
| 2016-03-2012:25:31 PM | 67.662 | 159.575 | 34.475 | 76.438 |
| 2016-03-2012:25:35 PM | 67.662 | 159.575 | 34.588 | 76.438 |
| 2016-03-2012:25:39 PM | 67.775 | 159.688 | 34.588 | 76.438 |
| 2016-03-2012:25:43 PM | 67.775 | 159.688 | 34.588 | 76.438 |
| 2016-03-2012:25:48 PM | 67.775 | 159.688 | 34.475 | 76.438 |
| 2016-03-2012:25:52 PM | 67.775 | 159.688 | 34.362 | 76.55 |
| 2016-03-2012:25:56 PM | 67.775 | 159.688 | 34.362 | 76.55 |
| 2016-03-2012:26:00 PM | 67.888 | 159.8 | 34.475 | 76.55 |
| 2016-03-2012:26:04 PM | 67.888 | 159.8 | 34.362 | 76.438 |
| 2016-03-2012:26:08 PM | 68 | 159.8 | 34.362 | 76.55 |
| 2016-03-2012:26:12 PM | 68 | 159.8 | 34.362 | 76.55 |
| 2016-03-2012:26:16 PM | 68 | 159.912 | 34.475 | 76.55 |
| 2016-03-2012:26:20 PM | 68 | 159.912 | 34.362 | 76.55 |
| 2016-03-2012:26:24 PM | 67.888 | 159.912 | 34.25 | 76.55 |
| 2016-03-2012:26:28 PM | 67.888 | 160.025 | 34.25 | 76.55 |
| 2016-03-2012:26:32 PM | 67.888 | 159.912 | 34.025 | 76.55 |
| 2016-03-2012:26:36 PM | 67.888 | 160.025 | 34.138 | 76.55 |
| 2016-03-2012:26:40 PM | 67.775 | 160.025 | 34.138 | 76.438 |
| 2016-03-2012:26:45 PM | 67.775 | 160.025 | 34.138 | 76.55 |
| 2016-03-2012:26:49 PM | 67.888 | 160.025 | 34.138 | 76.438 |
| 2016-03-2012:26:53 PM | 67.888 | 160.025 | 34.25 | 76.438 |
| 2016-03-2012:26:57 PM | 67.888 | 160.025 | 34.25 | 76.438 |
| 2016-03-2012:27:01 PM | 68 | 160.025 | 34.138 | 76.438 |
| 2016-03-2012:27:05 PM | 67.888 | 160.025 | 33.912 | 76.438 |
| 2016-03-2012:27:09 PM | 67.888 | 160.138 | 33.8 | 76.438 |
| 2016-03-2012:27:13 PM | 68 | 160.138 | 33.688 | 76.438 |
| 2016-03-2012:27:17 PM | 68.112 | 160.138 | 33.688 | 76.438 |
| 2016-03-2012:27:21 PM | 68.112 | 160.138 | 33.688 | 76.438 |
| 2016-03-2012:27:25 PM | 68.112 | 160.138 | 33.8 | 76.438 |
| 2016-03-2012:27:29 PM | 68.112 | 160.138 | 33.8 | 76.438 |
| 2016-03-2012:27:33 PM | 68.112 | 160.138 | 33.912 | 76.438 |
| 2016-03-2012:27:37 PM | 68.112 | 160.138 | 33.912 | 76.438 |
| 2016-03-2012:27:42 PM | 68.225 | 160.138 | 33.912 | 76.438 |
| 2016-03-2012:27:46 PM | 68.225 | 160.138 | 33.8 | 76.438 |
| 2016-03-2012:27:50 PM | 68.225 | 160.138 | 33.8 | 76.438 |
| 2016-03-2012:27:54 PM | 68.338 | 160.25 | 33.688 | 76.438 |
| 2016-03-2012:27:58 PM | 68.45 | 160.25 | 33.575 | 76.438 |
| 2016-03-2012:28:02 PM | 68.562 | 160.138 | 33.462 | 76.438 |
| 2016-03-2012:28:06 PM | 68.562 | 160.25 | 33.462 | 76.438 |
| 2016-03-2012:28:10 PM | 68.562 | 160.25 | 33.35 | 76.55 |
| 2016-03-2012:28:14 PM | 68.675 | 160.25 | 33.462 | 76.55 |
| 2016-03-2012:28:18 PM | 68.788 | 160.25 | 33.462 | 76.55 |
| 2016-03-2012:28:22 PM | 68.788 | 160.25 | 33.462 | 76.438 |
| 2016-03-2012:28:26 PM | 68.9 | 160.25 | 33.462 | 76.438 |
| 2016-03-2012:28:30 PM | 69.012 | 160.25 | 33.462 | 76.438 |
| 2016-03-2012:28:34 PM | 69.012 | 160.25 | 33.462 | 76.438 |
| 2016-03-2012:28:38 PM | 69.125 | 160.25 | 33.35 | 76.438 |
| 2016-03-2012:28:43 PM | 69.238 | 160.25 | 33.462 | 76.438 |
| 2016-03-2012:28:47 PM | 69.35 | 160.25 | 33.575 | 76.438 |
| 2016-03-2012:28:51 PM | 69.462 | 160.25 | 33.575 | 76.55 |
| 2016-03-2012:28:55 PM | 69.462 | 160.25 | 33.575 | 76.55 |
| 2016-03-2012:28:59 PM | 69.35 | 160.25 | 33.688 | 76.438 |
| 2016-03-2012:29:03 PM | 69.35 | 160.25 | 33.688 | 76.55 |
| 2016-03-2012:29:07 PM | 69.35 | 160.25 | 33.8 | 76.438 |
| 2016-03-2012:29:11 PM | 69.462 | 160.25 | 33.8 | 76.438 |
| 2016-03-2012:29:15 PM | 69.462 | 160.25 | 33.8 | 76.438 |
| 2016-03-2012:29:19 PM | 69.575 | 160.25 | 33.8 | 76.438 |
| 2016-03-2012:29:23 PM | 69.688 | 160.25 | 33.912 | 76.438 |
| 2016-03-2012:29:27 PM | 69.688 | 160.25 | 33.8 | 76.438 |
| 2016-03-2012:29:31 PM | 69.8 | 160.25 | 33.688 | 76.438 |
| 2016-03-2012:29:36 PM | 69.912 | 160.138 | 33.688 | 76.438 |
| 2016-03-2012:29:40 PM | 70.025 | 160.138 | 33.688 | 76.438 |
| 2016-03-2012:29:44 PM | 70.138 | 160.138 | 33.575 | 76.438 |
| 2016-03-2012:29:48 PM | 70.25 | 160.138 | 33.575 | 76.438 |
| 2016-03-2012:29:52 PM | 70.362 | 160.138 | 33.462 | 76.438 |
| 2016-03-2012:29:56 PM | 70.588 | 160.138 | 33.462 | 76.438 |
| 2016-03-2012:30:00 PM | 70.7 | 160.138 | 33.462 | 76.55 |
| 2016-03-2012:30:04 PM | 70.7 | 160.138 | 33.462 | 76.55 |
| 2016-03-2012:30:08 PM | 70.7 | 160.138 | 33.575 | 76.438 |
| 2016-03-2012:30:12 PM | 70.588 | 160.138 | 33.462 | 76.438 |
| 2016-03-2012:30:16 PM | 70.475 | 160.138 | 33.575 | 76.438 |
| 2016-03-2012:30:20 PM | 70.362 | 160.138 | 33.688 | 76.438 |
| 2016-03-2012:30:24 PM | 70.25 | 160.138 | 33.688 | 76.438 |
| 2016-03-2012:30:28 PM | 70.362 | 160.138 | 33.8 | 76.438 |
| 2016-03-2012:30:33 PM | 70.362 | 160.138 | 33.912 | 76.438 |
| 2016-03-2012:30:37 PM | 70.588 | 160.138 | 33.912 | 76.438 |
| 2016-03-2012:30:41 PM | 70.7 | 160.138 | 33.912 | 76.438 |
| 2016-03-2012:30:45 PM | 70.925 | 160.138 | 34.025 | 76.438 |
| 2016-03-2012:30:49 PM | 71.038 | 160.138 | 34.025 | 76.438 |
| 2016-03-2012:30:53 PM | 71.262 | 160.138 | 34.25 | 76.438 |
| 2016-03-2012:30:57 PM | 71.488 | 160.138 | 34.362 | 76.438 |
| 2016-03-2012:31:01 PM | 71.6 | 160.138 | 34.362 | 76.438 |
| 2016-03-2012:31:05 PM | 72.162 | 160.138 | 34.362 | 76.438 |
| 2016-03-2012:31:09 PM | 72.275 | 160.138 | 34.362 | 76.438 |
| 2016-03-2012:31:13 PM | 72.388 | 160.138 | 34.475 | 76.438 |
| 2016-03-2012:31:17 PM | 72.612 | 160.138 | 34.588 | 76.438 |
| 2016-03-2012:31:21 PM | 72.725 | 160.138 | 34.7 | 76.438 |
| 2016-03-2012:31:25 PM | 72.95 | 160.138 | 34.812 | 76.55 |
| 2016-03-2012:31:29 PM | 73.175 | 160.138 | 34.812 | 76.438 |
| 2016-03-2012:31:33 PM | 73.288 | 160.138 | 34.925 | 76.438 |
| 2016-03-2012:31:37 PM | 73.4 | 160.25 | 35.038 | 76.438 |
| 2016-03-2012:31:42 PM | 73.512 | 160.25 | 35.038 | 76.438 |
| 2016-03-2012:31:46 PM | 73.512 | 160.25 | 35.038 | 76.438 |
| 2016-03-2012:31:50 PM | 73.512 | 160.25 | 34.925 | 76.438 |
| 2016-03-2012:31:54 PM | 73.512 | 160.25 | 34.925 | 76.438 |
| 2016-03-2012:31:58 PM | 73.512 | 160.25 | 34.925 | 76.55 |
| 2016-03-2012:32:02 PM | 73.512 | 160.25 | 34.925 | 76.438 |
| 2016-03-2012:32:10 PM | 73.512 | 160.362 | 34.925 | 76.438 |
| 2016-03-2012:32:18 PM | 73.512 | 160.362 | 34.812 | 76.55 |
| 2016-03-2012:32:22 PM | 73.4 | 160.475 | 34.812 | 76.438 |
| 2016-03-2012:32:26 PM | 73.288 | 160.475 | 34.588 | 76.438 |
| 2016-03-2012:32:30 PM | 73.062 | 160.475 | 34.475 | 76.438 |
| 2016-03-2012:32:34 PM | 72.95 | 160.588 | 34.362 | 76.438 |
| 2016-03-2012:32:38 PM | 72.725 | 160.588 | 34.475 | 76.438 |
| 2016-03-2012:32:42 PM | 72.5 | 160.588 | 34.588 | 76.55 |
| 2016-03-2012:32:47 PM | 72.388 | 160.7 | 34.7 | 76.438 |
| 2016-03-2012:32:51 PM | 72.275 | 160.7 | 34.812 | 76.438 |
| 2016-03-2012:32:55 PM | 72.162 | 160.7 | 34.812 | 76.438 |
| 2016-03-2012:32:59 PM | 71.938 | 160.812 | 35.038 | 76.438 |
| 2016-03-2012:33:03 PM | 71.825 | 160.812 | 35.038 | 76.438 |
| 2016-03-2012:33:07 PM | 71.825 | 160.925 | 35.15 | 76.55 |
| 2016-03-2012:33:11 PM | 71.825 | 160.925 | 35.262 | 76.438 |
| 2016-03-2012:33:15 PM | 71.825 | 160.925 | 35.488 | 76.55 |
| 2016-03-2012:33:19 PM | 71.712 | 161.038 | 35.6 | 76.55 |
| 2016-03-2012:33:23 PM | 71.712 | 161.038 | 35.712 | 76.55 |
| 2016-03-2012:33:27 PM | 71.6 | 161.038 | 35.712 | 76.55 |
| 2016-03-2012:33:31 PM | 71.712 | 161.15 | 35.712 | 76.55 |
| 2016-03-2012:33:35 PM | 71.712 | 161.15 | 35.825 | 76.55 |
| 2016-03-2012:33:39 PM | 71.6 | 161.263 | 35.938 | 76.55 |
| 2016-03-2012:33:43 PM | 71.375 | 161.375 | 35.938 | 76.55 |
| 2016-03-2012:33:47 PM | 71.15 | 161.375 | 36.05 | 76.55 |
| 2016-03-2012:33:52 PM | 71.038 | 161.375 | 36.162 | 76.55 |
| 2016-03-2012:33:56 PM | 70.812 | 161.488 | 36.388 | 76.55 |
| 2016-03-2012:34:00 PM | 70.588 | 161.6 | 36.388 | 76.55 |
| 2016-03-2012:34:04 PM | 70.362 | 161.6 | 36.5 | 76.55 |
| 2016-03-2012:34:08 PM | 70.362 | 161.712 | 36.5 | 76.55 |
| 2016-03-2012:34:12 PM | 70.475 | 161.712 | 36.5 | 76.55 |
| 2016-03-2012:34:16 PM | 70.475 | 161.712 | 36.612 | 76.55 |
| 2016-03-2012:34:20 PM | 70.475 | 161.825 | 36.725 | 76.55 |
| 2016-03-2012:34:24 PM | 70.475 | 161.938 | 36.725 | 76.55 |
| 2016-03-2012:34:28 PM | 70.362 | 162.05 | 36.612 | 76.55 |
| 2016-03-2012:34:32 PM | 70.362 | 162.05 | 36.725 | 76.55 |
| 2016-03-2012:34:36 PM | 70.25 | 162.05 | 36.612 | 76.55 |
| 2016-03-2012:34:40 PM | 70.362 | 162.162 | 36.612 | 76.55 |
| 2016-03-2012:34:45 PM | 70.25 | 162.162 | 36.5 | 76.55 |
| 2016-03-2012:34:49 PM | 70.25 | 162.275 | 36.388 | 76.55 |
| 2016-03-2012:34:53 PM | 70.138 | 162.388 | 36.388 | 76.55 |
| 2016-03-2012:34:57 PM | 70.25 | 162.388 | 36.388 | 76.55 |
| 2016-03-2012:35:01 PM | 70.25 | 162.388 | 36.388 | 76.55 |
| 2016-03-2012:35:05 PM | 70.25 | 162.5 | 36.5 | 76.55 |
| 2016-03-2012:35:09 PM | 70.25 | 162.5 | 36.5 | 76.55 |
| 2016-03-2012:35:13 PM | 70.362 | 162.612 | 36.5 | 76.55 |
| 2016-03-2012:35:21 PM | 70.362 | 162.612 | 36.275 | 76.55 |
| 2016-03-2012:35:25 PM | 70.362 | 162.725 | 36.05 | 76.55 |
| 2016-03-2012:35:29 PM | 70.138 | 162.725 | 35.825 | 76.438 |
| 2016-03-2012:35:33 PM | 70.138 | 162.838 | 35.712 | 76.55 |
| 2016-03-2012:35:37 PM | 69.912 | 162.838 | 35.712 | 76.438 |
| 2016-03-2012:35:41 PM | 69.688 | 162.95 | 35.6 | 76.438 |
| 2016-03-2012:35:45 PM | 69.575 | 162.95 | 35.6 | 76.438 |
| 2016-03-2012:35:50 PM | 69.462 | 163.062 | 35.6 | 76.438 |
| 2016-03-2012:35:54 PM | 69.35 | 163.062 | 35.488 | 76.438 |
| 2016-03-2012:35:58 PM | 69.238 | 163.062 | 35.488 | 76.438 |
| 2016-03-2012:36:02 PM | 69.125 | 163.062 | 35.488 | 76.55 |
| 2016-03-2012:36:06 PM | 68.9 | 163.175 | 35.375 | 76.55 |
| 2016-03-2012:36:10 PM | 68.9 | 163.175 | 35.262 | 76.438 |
| 2016-03-2012:36:14 PM | 68.675 | 163.175 | 35.15 | 76.438 |
| 2016-03-2012:36:18 PM | 68.45 | 163.288 | 35.15 | 76.438 |
| 2016-03-2012:36:22 PM | 68.338 | 163.288 | 35.262 | 76.438 |
| 2016-03-2012:36:26 PM | 68.225 | 163.288 | 35.375 | 76.438 |
| 2016-03-2012:36:30 PM | 68.112 | 163.288 | 35.375 | 76.438 |
| 2016-03-2012:36:34 PM | 68.225 | 163.4 | 35.375 | 76.438 |
| 2016-03-2012:36:38 PM | 68.225 | 163.4 | 35.262 | 76.438 |
| 2016-03-2012:36:42 PM | 68.225 | 163.4 | 35.262 | 76.438 |
| 2016-03-2012:36:46 PM | 68.225 | 163.4 | 35.038 | 76.438 |
| 2016-03-2012:36:50 PM | 68.112 | 163.4 | 34.925 | 76.438 |
| 2016-03-2012:36:55 PM | 68.112 | 163.4 | 34.925 | 76.438 |
| 2016-03-2012:36:59 PM | 68.225 | 163.4 | 35.038 | 76.438 |
| 2016-03-2012:37:03 PM | 68.338 | 163.4 | 34.925 | 76.438 |
| 2016-03-2012:37:07 PM | 68.338 | 163.513 | 34.925 | 76.438 |
| 2016-03-2012:37:11 PM | 68.45 | 163.513 | 34.7 | 76.325 |
| 2016-03-2012:37:15 PM | 68.562 | 163.513 | 34.475 | 76.325 |
| 2016-03-2012:37:19 PM | 68.562 | 163.513 | 34.25 | 76.325 |
| 2016-03-2012:37:23 PM | 68.45 | 163.513 | 34.138 | 76.325 |
| 2016-03-2012:37:27 PM | 68.338 | 163.513 | 34.138 | 76.325 |
| 2016-03-2012:37:31 PM | 68.112 | 163.625 | 34.025 | 76.325 |
| 2016-03-2012:37:35 PM | 67.888 | 163.625 | 33.912 | 76.325 |
| 2016-03-2012:37:39 PM | 67.775 | 163.625 | 33.8 | 76.438 |
| 2016-03-2012:37:43 PM | 67.775 | 163.625 | 33.8 | 76.438 |
| 2016-03-2012:37:47 PM | 67.662 | 163.738 | 33.8 | 76.325 |
| 2016-03-2012:37:51 PM | 67.775 | 163.738 | 33.688 | 76.325 |
| 2016-03-2012:37:56 PM | 68 | 163.738 | 33.575 | 76.325 |
| 2016-03-2012:38:00 PM | 67.888 | 163.738 | 33.575 | 76.325 |
| 2016-03-2012:38:04 PM | 67.888 | 163.738 | 33.575 | 76.325 |
| 2016-03-2012:38:08 PM | 67.888 | 163.738 | 33.462 | 76.325 |
| 2016-03-2012:38:12 PM | 67.775 | 163.738 | 33.462 | 76.325 |
| 2016-03-2012:38:16 PM | 67.662 | 163.85 | 33.462 | 76.325 |
| 2016-03-2012:38:20 PM | 67.55 | 163.738 | 33.575 | 76.325 |
| 2016-03-2012:38:24 PM | 67.438 | 163.738 | 33.575 | 76.212 |
| 2016-03-2012:38:28 PM | 67.325 | 163.85 | 33.688 | 76.212 |
| 2016-03-2012:38:32 PM | 67.325 | 163.85 | 33.575 | 76.212 |
| 2016-03-2012:38:36 PM | 67.212 | 163.85 | 33.462 | 76.212 |
| 2016-03-2012:38:40 PM | 67.1 | 163.85 | 33.462 | 76.212 |
| 2016-03-2012:38:44 PM | 66.988 | 163.85 | 33.575 | 76.212 |
| 2016-03-2012:38:48 PM | 66.988 | 163.85 | 33.688 | 76.212 |
| 2016-03-2012:38:52 PM | 66.875 | 163.738 | 33.8 | 76.212 |
| 2016-03-2012:38:57 PM | 66.65 | 163.738 | 33.688 | 76.212 |
| 2016-03-2012:39:01 PM | 66.65 | 163.85 | 33.688 | 76.212 |
| 2016-03-2012:39:05 PM | 66.538 | 163.85 | 33.688 | 76.212 |
| 2016-03-2012:39:09 PM | 66.538 | 163.85 | 33.688 | 76.212 |
| 2016-03-2012:39:13 PM | 66.65 | 163.85 | 33.575 | 76.212 |
| 2016-03-2012:39:17 PM | 66.65 | 163.738 | 33.462 | 76.1 |
| 2016-03-2012:39:21 PM | 66.538 | 163.738 | 33.35 | 76.212 |
| 2016-03-2012:39:25 PM | 66.425 | 163.738 | 33.238 | 76.1 |
| 2016-03-2012:39:29 PM | 66.425 | 163.738 | 33.35 | 76.212 |
| 2016-03-2012:39:33 PM | 66.538 | 163.738 | 33.462 | 76.212 |
| 2016-03-2012:39:37 PM | 66.538 | 163.738 | 33.575 | 76.1 |
| 2016-03-2012:39:41 PM | 66.538 | 163.738 | 33.462 | 76.1 |
| 2016-03-2012:39:45 PM | 66.538 | 163.738 | 33.575 | 76.212 |
| 2016-03-2012:39:49 PM | 66.538 | 163.738 | 33.688 | 76.212 |
| 2016-03-2012:39:53 PM | 66.538 | 163.625 | 33.688 | 76.1 |
| 2016-03-2012:39:58 PM | 66.538 | 163.625 | 33.8 | 76.1 |
| 2016-03-2012:40:02 PM | 66.425 | 163.738 | 33.8 | 76.1 |
| 2016-03-2012:40:06 PM | 66.425 | 163.738 | 34.025 | 76.1 |
| 2016-03-2012:40:10 PM | 66.425 | 163.738 | 34.025 | 76.1 |
| 2016-03-2012:40:14 PM | 66.312 | 163.738 | 33.912 | 76.1 |
| 2016-03-2012:40:18 PM | 66.425 | 163.625 | 33.912 | 76.1 |
| 2016-03-2012:40:22 PM | 66.425 | 163.625 | 33.8 | 76.1 |
| 2016-03-2012:40:26 PM | 66.65 | 163.625 | 33.912 | 76.1 |
| 2016-03-2012:40:30 PM | 66.65 | 163.625 | 33.8 | 76.1 |
| 2016-03-2012:40:34 PM | 66.762 | 163.625 | 33.8 | 76.1 |
| 2016-03-2012:40:38 PM | 66.762 | 163.513 | 33.912 | 76.1 |
| 2016-03-2012:40:42 PM | 66.762 | 163.513 | 33.912 | 76.1 |
| 2016-03-2012:40:46 PM | 66.762 | 163.513 | 33.912 | 76.1 |
| 2016-03-2012:40:50 PM | 66.988 | 163.513 | 33.8 | 76.1 |
| 2016-03-2012:40:54 PM | 66.988 | 163.513 | 33.8 | 76.1 |
| 2016-03-2012:40:58 PM | 66.875 | 163.513 | 33.8 | 76.1 |
| 2016-03-2012:41:02 PM | 66.875 | 163.4 | 33.8 | 76.1 |
| 2016-03-2012:41:06 PM | 66.65 | 163.513 | 33.912 | 76.1 |
| 2016-03-2012:41:10 PM | 66.538 | 163.4 | 33.912 | 76.1 |
| 2016-03-2012:41:14 PM | 66.538 | 163.4 | 34.025 | 76.1 |
| 2016-03-2012:41:18 PM | 66.538 | 163.4 | 34.025 | 76.1 |
| 2016-03-2012:41:22 PM | 66.538 | 163.288 | 34.025 | 76.1 |
| 2016-03-2012:41:26 PM | 66.538 | 163.288 | 34.025 | 76.1 |
| 2016-03-2012:41:31 PM | 66.762 | 163.288 | 34.025 | 76.1 |
| 2016-03-2012:41:35 PM | 66.762 | 163.288 | 33.912 | 76.1 |
| 2016-03-2012:41:39 PM | 66.762 | 163.288 | 33.912 | 76.1 |
| 2016-03-2012:41:43 PM | 66.988 | 163.175 | 33.8 | 76.1 |
| 2016-03-2012:41:47 PM | 66.988 | 163.175 | 33.688 | 76.1 |
| 2016-03-2012:41:51 PM | 66.875 | 163.175 | 33.8 | 76.212 |
| 2016-03-2012:41:55 PM | 66.875 | 163.175 | 33.688 | 76.1 |
| 2016-03-2012:41:59 PM | 66.988 | 163.062 | 33.688 | 76.1 |
| 2016-03-2012:42:03 PM | 67.1 | 163.062 | 33.688 | 76.1 |
| 2016-03-2012:42:07 PM | 67.1 | 163.062 | 33.688 | 76.1 |
| 2016-03-2012:42:11 PM | 67.1 | 163.062 | 33.8 | 76.1 |
| 2016-03-2012:42:15 PM | 67.1 | 163.062 | 33.8 | 76.1 |
| 2016-03-2012:42:19 PM | 66.988 | 162.95 | 33.912 | 76.1 |
| 2016-03-2012:42:23 PM | 66.762 | 162.95 | 34.025 | 76.1 |
| 2016-03-2012:42:27 PM | 66.762 | 162.95 | 34.025 | 76.1 |
| 2016-03-2012:42:31 PM | 66.762 | 162.95 | 34.138 | 76.1 |
| 2016-03-2012:42:35 PM | 66.875 | 162.95 | 34.138 | 76.1 |
| 2016-03-2012:42:40 PM | 66.875 | 162.95 | 34.025 | 76.1 |
| 2016-03-2012:42:44 PM | 67.1 | 162.95 | 34.025 | 76.1 |
| 2016-03-2012:42:48 PM | 67.212 | 162.95 | 34.138 | 76.212 |
| 2016-03-2012:42:52 PM | 67.325 | 162.838 | 34.138 | 76.1 |
| 2016-03-2012:42:56 PM | 67.438 | 162.838 | 34.362 | 76.212 |
| 2016-03-2012:43:00 PM | 67.55 | 162.838 | 34.362 | 76.212 |
| 2016-03-2012:43:04 PM | 67.662 | 162.838 | 34.362 | 76.1 |
| 2016-03-2012:43:08 PM | 67.888 | 162.838 | 34.25 | 76.1 |
| 2016-03-2012:43:12 PM | 67.888 | 162.838 | 34.138 | 76.212 |
| 2016-03-2012:43:16 PM | 68 | 162.725 | 34.138 | 76.212 |
| 2016-03-2012:43:20 PM | 68.112 | 162.725 | 34.138 | 76.212 |
| 2016-03-2012:43:24 PM | 68.112 | 162.838 | 34.138 | 76.325 |
| 2016-03-2012:43:28 PM | 68.112 | 162.725 | 34.138 | 76.325 |
| 2016-03-2012:43:32 PM | 68.112 | 162.725 | 34.138 | 76.212 |
| 2016-03-2012:43:36 PM | 68 | 162.725 | 34.138 | 76.325 |
| 2016-03-2012:43:40 PM | 67.888 | 162.838 | 34.25 | 76.325 |
| 2016-03-2012:43:44 PM | 67.662 | 162.838 | 34.25 | 76.325 |
| 2016-03-2012:43:48 PM | 67.55 | 162.725 | 34.25 | 76.438 |
| 2016-03-2012:43:52 PM | 67.55 | 162.725 | 34.138 | 76.438 |
| 2016-03-2012:43:56 PM | 67.55 | 162.725 | 34.25 | 76.438 |
| 2016-03-2012:44:00 PM | 67.55 | 162.725 | 34.138 | 76.438 |
| 2016-03-2012:44:08 PM | 67.438 | 162.725 | 34.025 | 76.438 |
| 2016-03-2012:44:12 PM | 67.55 | 162.725 | 34.025 | 76.438 |
| 2016-03-2012:44:16 PM | 67.662 | 162.725 | 34.138 | 76.438 |
| 2016-03-2012:44:20 PM | 67.55 | 162.612 | 34.138 | 76.438 |
| 2016-03-2012:44:24 PM | 67.662 | 162.612 | 34.25 | 76.438 |
| 2016-03-2012:44:28 PM | 67.775 | 162.612 | 34.362 | 76.438 |
| 2016-03-2012:44:32 PM | 67.888 | 162.612 | 34.362 | 76.438 |
| 2016-03-2012:44:36 PM | 68 | 162.612 | 34.475 | 76.438 |
| 2016-03-2012:44:41 PM | 68.112 | 162.725 | 34.588 | 76.438 |
| 2016-03-2012:44:45 PM | 68.225 | 162.612 | 34.588 | 76.438 |
| 2016-03-2012:44:49 PM | 68.225 | 162.612 | 34.475 | 76.438 |
| 2016-03-2012:44:53 PM | 68.225 | 162.612 | 34.362 | 76.438 |
| 2016-03-2012:44:57 PM | 68.225 | 162.612 | 34.588 | 76.55 |
| 2016-03-2012:45:01 PM | 68.338 | 162.612 | 34.588 | 76.55 |
| 2016-03-2012:45:05 PM | 68.338 | 162.612 | 34.588 | 76.438 |
| 2016-03-2012:45:09 PM | 68.45 | 162.612 | 34.588 | 76.438 |
| 2016-03-2012:45:13 PM | 68.45 | 162.725 | 34.588 | 76.438 |
| 2016-03-2012:45:17 PM | 68.45 | 162.725 | 34.588 | 76.438 |
| 2016-03-2012:45:21 PM | 68.45 | 162.612 | 34.588 | 76.438 |
| 2016-03-2012:45:25 PM | 68.562 | 162.612 | 34.588 | 76.438 |
| 2016-03-2012:45:29 PM | 68.562 | 162.612 | 34.7 | 76.438 |
| 2016-03-2012:45:33 PM | 68.675 | 162.612 | 34.7 | 76.325 |
| 2016-03-2012:45:37 PM | 68.675 | 162.612 | 34.7 | 76.325 |
| 2016-03-2012:45:41 PM | 68.788 | 162.612 | 34.812 | 76.325 |
| 2016-03-2012:45:45 PM | 68.9 | 162.612 | 34.812 | 76.438 |
| 2016-03-2012:45:49 PM | 69.012 | 162.612 | 34.925 | 76.438 |
| 2016-03-2012:45:53 PM | 69.125 | 162.612 | 34.812 | 76.325 |
| 2016-03-2012:46:01 PM | 69.238 | 162.725 | 34.588 | 76.325 |
| 2016-03-2012:46:05 PM | 69.238 | 162.725 | 34.362 | 76.325 |
| 2016-03-2012:46:09 PM | 69.35 | 162.725 | 34.25 | 76.325 |
| 2016-03-2012:46:13 PM | 69.462 | 162.725 | 34.138 | 76.325 |
| 2016-03-2012:46:17 PM | 69.575 | 162.725 | 34.025 | 76.325 |
| 2016-03-2012:46:21 PM | 69.575 | 162.725 | 34.138 | 76.325 |
| 2016-03-2012:46:25 PM | 69.575 | 162.725 | 34.138 | 76.325 |
| 2016-03-2012:46:29 PM | 69.575 | 162.725 | 34.138 | 76.325 |
| 2016-03-2012:46:33 PM | 69.575 | 162.725 | 34.25 | 76.325 |
| 2016-03-2012:46:37 PM | 69.575 | 162.725 | 34.25 | 76.325 |
| 2016-03-2012:46:41 PM | 69.575 | 162.725 | 34.25 | 76.325 |
| 2016-03-2012:46:45 PM | 69.688 | 162.725 | 34.138 | 76.325 |
| 2016-03-2012:46:50 PM | 69.8 | 162.725 | 34.25 | 76.325 |
| 2016-03-2012:46:54 PM | 69.912 | 162.725 | 34.138 | 76.325 |
| 2016-03-2012:46:58 PM | 70.025 | 162.725 | 34.025 | 76.325 |
| 2016-03-2012:47:02 PM | 70.138 | 162.725 | 33.8 | 76.325 |
| 2016-03-2012:47:06 PM | 70.138 | 162.725 | 33.688 | 76.325 |
| 2016-03-2012:47:10 PM | 70.25 | 162.725 | 33.575 | 76.325 |
| 2016-03-2012:47:14 PM | 70.362 | 162.725 | 33.462 | 76.325 |
| 2016-03-2012:47:18 PM | 70.475 | 162.725 | 33.35 | 76.325 |
| 2016-03-2012:47:22 PM | 70.588 | 162.725 | 33.35 | 76.325 |
| 2016-03-2012:47:26 PM | 70.475 | 162.725 | 33.35 | 76.325 |
| 2016-03-2012:47:30 PM | 70.362 | 162.725 | 33.35 | 76.325 |
| 2016-03-2012:47:34 PM | 70.362 | 162.725 | 33.462 | 76.325 |
| 2016-03-2012:47:38 PM | 70.25 | 162.725 | 33.462 | 76.325 |
| 2016-03-2012:47:42 PM | 70.138 | 162.725 | 33.462 | 76.212 |
| 2016-03-2012:47:46 PM | 70.138 | 162.725 | 33.462 | 76.325 |
| 2016-03-2012:47:50 PM | 70.138 | 162.725 | 33.462 | 76.325 |
| 2016-03-2012:47:54 PM | 70.138 | 162.725 | 33.575 | 76.325 |
| 2016-03-2012:47:58 PM | 70.138 | 162.838 | 33.575 | 76.438 |
| 2016-03-2012:48:02 PM | 70.138 | 162.838 | 33.462 | 76.325 |
| 2016-03-2012:48:06 PM | 70.138 | 162.725 | 33.462 | 76.325 |
| 2016-03-2012:48:10 PM | 70.138 | 162.838 | 33.462 | 76.438 |
| 2016-03-2012:48:14 PM | 70.25 | 162.838 | 33.575 | 76.438 |
| 2016-03-2012:48:18 PM | 70.138 | 162.838 | 33.462 | 76.438 |
| 2016-03-2012:48:22 PM | 70.138 | 162.838 | 33.462 | 76.438 |
| 2016-03-2012:48:26 PM | 70.025 | 162.838 | 33.575 | 76.438 |
| 2016-03-2012:48:30 PM | 70.025 | 162.838 | 33.462 | 76.438 |
| 2016-03-2012:48:34 PM | 70.025 | 162.838 | 33.575 | 76.438 |
| 2016-03-2012:48:38 PM | 69.912 | 162.838 | 33.575 | 76.438 |
| 2016-03-2012:48:42 PM | 69.912 | 162.838 | 33.688 | 76.438 |
| 2016-03-2012:48:46 PM | 69.8 | 162.95 | 33.688 | 76.438 |
| 2016-03-2012:48:51 PM | 69.8 | 162.95 | 33.8 | 76.438 |
| 2016-03-2012:48:55 PM | 69.688 | 162.95 | 33.688 | 76.438 |
| 2016-03-2012:48:59 PM | 69.8 | 162.95 | 33.688 | 76.438 |
| 2016-03-2012:49:03 PM | 69.8 | 162.95 | 33.688 | 76.438 |
| 2016-03-2012:49:07 PM | 69.688 | 162.95 | 33.8 | 76.438 |
| 2016-03-2012:49:11 PM | 69.575 | 162.95 | 33.8 | 76.438 |
| 2016-03-2012:49:15 PM | 69.35 | 162.95 | 33.8 | 76.438 |
| 2016-03-2012:49:19 PM | 69.125 | 162.95 | 33.912 | 76.438 |
| 2016-03-2012:49:23 PM | 68.788 | 162.95 | 33.912 | 76.325 |
| 2016-03-2012:49:27 PM | 68.675 | 162.95 | 34.025 | 76.438 |
| 2016-03-2012:49:31 PM | 68.675 | 163.062 | 34.138 | 76.438 |
| 2016-03-2012:49:35 PM | 68.675 | 163.062 | 34.25 | 76.438 |
| 2016-03-2012:49:39 PM | 68.788 | 163.175 | 34.362 | 76.438 |
| 2016-03-2012:49:43 PM | 68.9 | 163.062 | 34.362 | 76.438 |
| 2016-03-2012:49:47 PM | 69.012 | 163.175 | 34.588 | 76.438 |
| 2016-03-2012:49:51 PM | 69.125 | 163.175 | 34.7 | 76.438 |
| 2016-03-2012:49:55 PM | 69.238 | 163.175 | 34.812 | 76.438 |
| 2016-03-2012:49:59 PM | 69.35 | 163.175 | 34.925 | 76.438 |
| 2016-03-2012:50:03 PM | 69.462 | 163.175 | 34.812 | 76.438 |
| 2016-03-2012:50:07 PM | 69.688 | 163.288 | 34.925 | 76.55 |
| 2016-03-2012:50:11 PM | 69.688 | 163.288 | 34.925 | 76.55 |
| 2016-03-2012:50:15 PM | 69.8 | 163.4 | 34.925 | 76.55 |
| 2016-03-2012:50:19 PM | 69.688 | 163.4 | 34.812 | 76.438 |
| 2016-03-2012:50:23 PM | 69.688 | 163.4 | 34.7 | 76.438 |
| 2016-03-2012:50:27 PM | 69.575 | 163.513 | 34.588 | 76.55 |
| 2016-03-2012:50:31 PM | 69.688 | 163.513 | 34.588 | 76.55 |
| 2016-03-2012:50:35 PM | 69.688 | 163.513 | 34.7 | 76.438 |
| 2016-03-2012:50:39 PM | 69.8 | 163.513 | 34.812 | 76.438 |
| 2016-03-2012:50:43 PM | 70.025 | 163.513 | 34.925 | 76.438 |
| 2016-03-2012:50:47 PM | 70.138 | 163.625 | 35.038 | 76.438 |
| 2016-03-2012:50:52 PM | 70.25 | 163.625 | 35.038 | 76.438 |
| 2016-03-2012:50:56 PM | 70.362 | 163.625 | 34.925 | 76.438 |
| 2016-03-2012:51:00 PM | 70.475 | 163.738 | 34.7 | 76.438 |
| 2016-03-2012:51:04 PM | 70.588 | 163.738 | 34.588 | 76.438 |
| 2016-03-2012:51:08 PM | 70.7 | 163.738 | 34.588 | 76.438 |
| 2016-03-2012:51:12 PM | 70.812 | 163.738 | 34.588 | 76.438 |
| 2016-03-2012:51:16 PM | 70.925 | 163.85 | 34.588 | 76.325 |
| 2016-03-2012:51:20 PM | 71.038 | 163.85 | 34.588 | 76.438 |
| 2016-03-2012:51:24 PM | 71.15 | 163.85 | 34.588 | 76.325 |
| 2016-03-2012:51:28 PM | 71.15 | 163.962 | 34.7 | 76.438 |
| 2016-03-2012:51:32 PM | 70.925 | 163.962 | 34.812 | 76.325 |
| 2016-03-2012:51:36 PM | 70.812 | 163.962 | 34.925 | 76.438 |
| 2016-03-2012:51:40 PM | 70.812 | 163.962 | 34.925 | 76.325 |
| 2016-03-2012:51:44 PM | 70.7 | 163.962 | 34.925 | 76.325 |
| 2016-03-2012:51:48 PM | 70.7 | 163.962 | 34.812 | 76.325 |
| 2016-03-2012:51:52 PM | 70.812 | 164.075 | 34.812 | 76.325 |
| 2016-03-2012:51:56 PM | 70.925 | 164.075 | 34.812 | 76.438 |
| 2016-03-2012:52:00 PM | 71.038 | 164.075 | 34.925 | 76.438 |
| 2016-03-2012:52:04 PM | 71.15 | 164.075 | 34.812 | 76.325 |
| 2016-03-2012:52:08 PM | 71.262 | 164.075 | 34.7 | 76.325 |
| 2016-03-2012:52:12 PM | 71.15 | 164.075 | 34.812 | 76.325 |
| 2016-03-2012:52:16 PM | 71.15 | 164.075 | 34.812 | 76.325 |
| 2016-03-2012:52:20 PM | 71.15 | 164.075 | 34.925 | 76.325 |
| 2016-03-2012:52:24 PM | 71.15 | 164.188 | 34.925 | 76.325 |
| 2016-03-2012:52:28 PM | 71.262 | 164.188 | 35.15 | 76.325 |
| 2016-03-2012:52:32 PM | 71.262 | 164.188 | 35.262 | 76.325 |
| 2016-03-2012:52:36 PM | 71.262 | 164.188 | 35.375 | 76.325 |
| 2016-03-2012:52:41 PM | 71.262 | 164.188 | 35.488 | 76.325 |
| 2016-03-2012:52:45 PM | 71.375 | 164.3 | 35.488 | 76.325 |
| 2016-03-2012:52:49 PM | 71.488 | 164.3 | 35.6 | 76.325 |
| 2016-03-2012:52:53 PM | 71.488 | 164.3 | 35.712 | 76.325 |
| 2016-03-2012:52:57 PM | 71.488 | 164.3 | 35.712 | 76.325 |
| 2016-03-2012:53:01 PM | 71.488 | 164.412 | 35.712 | 76.325 |
| 2016-03-2012:53:05 PM | 71.6 | 164.412 | 35.6 | 76.325 |
| 2016-03-2012:53:09 PM | 71.712 | 164.412 | 35.6 | 76.325 |
| 2016-03-2012:53:13 PM | 71.712 | 164.525 | 35.488 | 76.325 |
| 2016-03-2012:53:17 PM | 71.712 | 164.412 | 35.375 | 76.325 |
| 2016-03-2012:53:21 PM | 71.712 | 164.525 | 35.375 | 76.325 |
| 2016-03-2012:53:25 PM | 71.712 | 164.525 | 35.262 | 76.212 |
| 2016-03-2012:53:29 PM | 71.6 | 164.525 | 35.262 | 76.212 |
| 2016-03-2012:53:33 PM | 71.488 | 164.638 | 35.262 | 76.212 |
| 2016-03-2012:53:37 PM | 71.375 | 164.638 | 35.262 | 76.212 |
| 2016-03-2012:53:41 PM | 71.262 | 164.638 | 35.262 | 76.212 |
| 2016-03-2012:53:45 PM | 71.262 | 164.638 | 35.15 | 76.212 |
| 2016-03-2012:53:49 PM | 71.375 | 164.75 | 35.262 | 76.212 |
| 2016-03-2012:53:53 PM | 71.375 | 164.75 | 35.375 | 76.212 |
| 2016-03-2012:53:57 PM | 71.375 | 164.75 | 35.488 | 76.212 |
| 2016-03-2012:54:01 PM | 71.375 | 164.862 | 35.488 | 76.212 |
| 2016-03-2012:54:05 PM | 71.488 | 164.862 | 35.6 | 76.212 |
| 2016-03-2012:54:09 PM | 71.488 | 164.862 | 35.488 | 76.212 |
| 2016-03-2012:54:13 PM | 71.375 | 164.862 | 35.6 | 76.212 |
| 2016-03-2012:54:18 PM | 71.375 | 164.975 | 35.712 | 76.212 |
| 2016-03-2012:54:22 PM | 71.375 | 164.975 | 35.712 | 76.212 |
| 2016-03-2012:54:26 PM | 71.375 | 164.975 | 35.712 | 76.212 |
| 2016-03-2012:54:30 PM | 71.488 | 164.975 | 35.825 | 76.212 |
| 2016-03-2012:54:34 PM | 71.488 | 165.088 | 35.712 | 76.212 |
| 2016-03-2012:54:38 PM | 71.6 | 165.088 | 35.6 | 76.212 |
| 2016-03-2012:54:42 PM | 71.488 | 165.088 | 35.375 | 76.212 |
| 2016-03-2012:54:46 PM | 71.262 | 165.2 | 35.15 | 76.212 |
| 2016-03-2012:54:50 PM | 71.15 | 165.2 | 35.038 | 76.212 |
| 2016-03-2012:54:54 PM | 71.15 | 165.2 | 34.925 | 76.212 |
| 2016-03-2012:54:58 PM | 71.15 | 165.2 | 34.925 | 76.212 |
| 2016-03-2012:55:02 PM | 71.262 | 165.2 | 34.925 | 76.212 |
| 2016-03-2012:55:06 PM | 71.375 | 165.312 | 35.038 | 76.212 |
| 2016-03-2012:55:10 PM | 71.488 | 165.312 | 35.15 | 76.212 |
| 2016-03-2012:55:14 PM | 71.6 | 165.312 | 35.262 | 76.212 |
| 2016-03-2012:55:18 PM | 71.6 | 165.425 | 35.262 | 76.212 |
| 2016-03-2012:55:22 PM | 71.712 | 165.425 | 35.375 | 76.212 |
| 2016-03-2012:55:26 PM | 71.6 | 165.425 | 35.375 | 76.212 |
| 2016-03-2012:55:30 PM | 71.6 | 165.425 | 35.375 | 76.212 |
| 2016-03-2012:55:34 PM | 71.488 | 165.538 | 35.375 | 76.212 |
| 2016-03-2012:55:38 PM | 71.488 | 165.538 | 35.488 | 76.212 |
| 2016-03-2012:55:42 PM | 71.488 | 165.538 | 35.488 | 76.212 |
| 2016-03-2012:55:46 PM | 71.488 | 165.538 | 35.6 | 76.212 |
| 2016-03-2012:55:50 PM | 71.488 | 165.65 | 35.6 | 76.212 |
| 2016-03-2012:55:54 PM | 71.375 | 165.65 | 35.488 | 76.212 |
| 2016-03-2012:55:59 PM | 71.262 | 165.65 | 35.488 | 76.212 |
| 2016-03-2012:56:03 PM | 71.15 | 165.65 | 35.488 | 76.212 |
| 2016-03-2012:56:07 PM | 71.038 | 165.65 | 35.488 | 76.212 |
| 2016-03-2012:56:11 PM | 70.925 | 165.65 | 35.488 | 76.212 |
| 2016-03-2012:56:15 PM | 70.812 | 165.763 | 35.6 | 76.212 |
| 2016-03-2012:56:19 PM | 70.812 | 165.763 | 35.712 | 76.1 |
| 2016-03-2012:56:23 PM | 70.7 | 165.763 | 35.712 | 76.1 |
| 2016-03-2012:56:27 PM | 70.7 | 165.763 | 35.6 | 76.1 |
| 2016-03-2012:56:31 PM | 70.812 | 165.763 | 35.6 | 76.1 |
| 2016-03-2012:56:35 PM | 70.812 | 165.763 | 35.6 | 76.1 |
| 2016-03-2012:56:39 PM | 70.812 | 165.875 | 35.6 | 76.1 |
| 2016-03-2012:56:43 PM | 70.812 | 165.875 | 35.488 | 76.212 |
| 2016-03-2012:56:47 PM | 70.7 | 165.875 | 35.488 | 76.1 |
| 2016-03-2012:56:51 PM | 70.588 | 165.875 | 35.488 | 76.1 |
| 2016-03-2012:56:55 PM | 70.362 | 165.988 | 35.375 | 76.1 |
| 2016-03-2012:56:59 PM | 70.25 | 165.988 | 35.488 | 76.1 |
| 2016-03-2012:57:03 PM | 70.025 | 165.988 | 35.375 | 76.1 |
| 2016-03-2012:57:07 PM | 69.688 | 165.988 | 35.375 | 76.1 |
| 2016-03-2012:57:11 PM | 69.35 | 165.988 | 35.15 | 76.1 |
| 2016-03-2012:57:15 PM | 69.125 | 165.988 | 35.15 | 76.1 |
| 2016-03-2012:57:19 PM | 68.9 | 166.1 | 35.15 | 76.1 |
| 2016-03-2012:57:23 PM | 68.675 | 166.1 | 35.038 | 76.1 |
| 2016-03-2012:57:27 PM | 68.45 | 166.1 | 35.038 | 76.1 |
| 2016-03-2012:57:31 PM | 68.338 | 166.1 | 34.925 | 76.1 |
| 2016-03-2012:57:36 PM | 68.225 | 166.1 | 34.7 | 76.1 |
| 2016-03-2012:57:40 PM | 68.112 | 166.1 | 34.362 | 76.1 |
| 2016-03-2012:57:44 PM | 68.112 | 166.1 | 34.138 | 76.1 |
| 2016-03-2012:57:48 PM | 68.112 | 166.212 | 33.912 | 76.1 |
| 2016-03-2012:57:52 PM | 68.225 | 166.212 | 33.912 | 76.1 |
| 2016-03-2012:57:56 PM | 68.112 | 166.212 | 33.912 | 76.1 |
| 2016-03-2012:58:00 PM | 68.225 | 166.212 | 33.912 | 76.1 |
| 2016-03-2012:58:04 PM | 68.112 | 166.212 | 34.025 | 76.1 |
| 2016-03-2012:58:08 PM | 67.888 | 166.212 | 34.138 | 76.1 |
| 2016-03-2012:58:12 PM | 67.888 | 166.212 | 34.25 | 76.1 |
| 2016-03-2012:58:16 PM | 67.775 | 166.212 | 34.25 | 76.1 |
| 2016-03-2012:58:20 PM | 67.775 | 166.212 | 34.25 | 76.1 |
| 2016-03-2012:58:24 PM | 67.775 | 166.212 | 34.362 | 76.1 |
| 2016-03-2012:58:28 PM | 67.775 | 166.212 | 34.475 | 76.1 |
| 2016-03-2012:58:32 PM | 67.775 | 166.212 | 34.475 | 76.1 |
| 2016-03-2012:58:36 PM | 67.888 | 166.212 | 34.475 | 75.988 |
| 2016-03-2012:58:40 PM | 67.888 | 166.212 | 34.475 | 76.1 |
| 2016-03-2012:58:44 PM | 67.888 | 166.212 | 34.362 | 76.1 |
| 2016-03-2012:58:48 PM | 67.775 | 166.212 | 34.025 | 76.1 |
| 2016-03-2012:58:52 PM | 67.888 | 166.1 | 33.8 | 76.1 |
| 2016-03-2012:58:57 PM | 67.888 | 166.1 | 33.575 | 76.1 |
| 2016-03-2012:59:01 PM | 67.888 | 166.1 | 33.238 | 76.1 |
| 2016-03-2012:59:09 PM | 67.888 | 166.1 | 33.238 | 76.1 |
| 2016-03-2012:59:13 PM | 67.888 | 166.1 | 33.238 | 76.1 |
| 2016-03-2012:59:17 PM | 67.888 | 166.1 | 33.35 | 76.1 |
| 2016-03-2012:59:21 PM | 67.775 | 166.1 | 33.35 | 76.1 |
| 2016-03-2012:59:25 PM | 67.775 | 166.1 | 33.462 | 76.1 |
| 2016-03-2012:59:29 PM | 67.775 | 166.1 | 33.462 | 76.1 |
| 2016-03-2012:59:33 PM | 67.662 | 166.1 | 33.575 | 76.1 |
| 2016-03-2012:59:41 PM | 67.55 | 166.1 | 33.688 | 76.1 |
| 2016-03-2012:59:45 PM | 67.55 | 166.1 | 33.688 | 76.1 |
| 2016-03-2012:59:49 PM | 67.55 | 166.1 | 33.8 | 76.1 |
| 2016-03-2012:59:53 PM | 67.55 | 166.1 | 33.688 | 76.1 |
| 2016-03-2012:59:57 PM | 67.55 | 166.1 | 33.688 | 76.1 |
| 2016-03-201:00:01 PM | 67.55 | 166.1 | 33.688 | 76.1 |
| 2016-03-201:00:05 PM | 67.55 | 166.1 | 33.688 | 76.1 |
| 2016-03-201:00:09 PM | 67.55 | 166.1 | 33.8 | 76.1 |
| 2016-03-201:00:14 PM | 67.55 | 166.1 | 33.912 | 76.1 |
| 2016-03-201:00:18 PM | 67.55 | 166.1 | 34.025 | 76.1 |
| 2016-03-201:00:22 PM | 67.662 | 166.1 | 34.138 | 76.1 |
| 2016-03-201:00:26 PM | 67.662 | 165.988 | 34.025 | 76.1 |
| 2016-03-201:00:30 PM | 67.775 | 165.988 | 33.912 | 76.212 |
| 2016-03-201:00:34 PM | 67.888 | 165.988 | 33.8 | 76.1 |
| 2016-03-201:00:38 PM | 67.888 | 165.988 | 33.688 | 76.1 |
| 2016-03-201:00:42 PM | 67.888 | 165.875 | 33.575 | 76.1 |
| 2016-03-201:00:46 PM | 67.888 | 165.875 | 33.575 | 76.1 |
| 2016-03-201:00:50 PM | 67.888 | 165.875 | 33.575 | 76.1 |
| 2016-03-201:00:54 PM | 68 | 165.875 | 33.462 | 76.1 |
| 2016-03-201:00:58 PM | 68 | 165.875 | 33.575 | 76.1 |
| 2016-03-201:01:02 PM | 68.112 | 165.875 | 33.688 | 76.1 |
| 2016-03-201:01:06 PM | 68.225 | 165.875 | 33.688 | 76.1 |
| 2016-03-201:01:10 PM | 68.112 | 165.875 | 33.688 | 76.1 |
| 2016-03-201:01:14 PM | 68 | 165.763 | 33.575 | 76.1 |
| 2016-03-201:01:18 PM | 68.112 | 165.763 | 33.462 | 76.1 |
| 2016-03-201:01:22 PM | 68.338 | 165.763 | 33.238 | 76.1 |
| 2016-03-201:01:26 PM | 68.225 | 165.763 | 32.9 | 76.1 |
| 2016-03-201:01:30 PM | 68.225 | 165.763 | 32.675 | 76.1 |
| 2016-03-201:01:34 PM | 68.225 | 165.763 | 32.338 | 76.1 |
| 2016-03-201:01:39 PM | 68.225 | 165.65 | 32.225 | 76.1 |
| 2016-03-201:01:43 PM | 68.225 | 165.65 | 32.112 | 76.1 |
| 2016-03-201:01:47 PM | 68.225 | 165.65 | 31.888 | 76.1 |
| 2016-03-201:01:51 PM | 68.112 | 165.65 | 31.775 | 76.1 |
| 2016-03-201:01:55 PM | 68.225 | 165.65 | 31.888 | 76.212 |
| 2016-03-201:01:59 PM | 68.225 | 165.538 | 32 | 76.212 |
| 2016-03-201:02:03 PM | 68.225 | 165.538 | 32.112 | 76.212 |
| 2016-03-201:02:07 PM | 68.225 | 165.538 | 32.225 | 76.212 |
| 2016-03-201:02:11 PM | 68.225 | 165.538 | 32.45 | 76.212 |
| 2016-03-201:02:15 PM | 68.338 | 165.538 | 32.45 | 76.212 |
| 2016-03-201:02:19 PM | 68.225 | 165.425 | 32.338 | 76.212 |
| 2016-03-201:02:23 PM | 68.112 | 165.425 | 32.45 | 76.212 |
| 2016-03-201:02:27 PM | 68.112 | 165.425 | 32.562 | 76.212 |
| 2016-03-201:02:31 PM | 68 | 165.425 | 32.788 | 76.212 |
| 2016-03-201:02:35 PM | 67.775 | 165.312 | 32.9 | 76.212 |
| 2016-03-201:02:39 PM | 67.662 | 165.312 | 33.125 | 76.212 |
| 2016-03-201:02:44 PM | 67.438 | 165.312 | 33.35 | 76.212 |
| 2016-03-201:02:48 PM | 67.325 | 165.312 | 33.35 | 76.212 |
| 2016-03-201:02:52 PM | 67.212 | 165.312 | 33.462 | 76.325 |
| 2016-03-201:02:56 PM | 67.1 | 165.2 | 33.575 | 76.325 |
| 2016-03-201:03:00 PM | 66.875 | 165.2 | 33.462 | 76.325 |
| 2016-03-201:03:04 PM | 66.875 | 165.2 | 33.462 | 76.325 |
| 2016-03-201:03:08 PM | 66.762 | 165.2 | 33.575 | 76.325 |
| 2016-03-201:03:12 PM | 66.762 | 165.088 | 33.688 | 76.325 |
| 2016-03-201:03:16 PM | 66.875 | 165.088 | 33.8 | 76.325 |
| 2016-03-201:03:20 PM | 66.875 | 165.088 | 33.8 | 76.325 |
| 2016-03-201:03:24 PM | 66.988 | 165.088 | 33.8 | 76.325 |
| 2016-03-201:03:28 PM | 66.988 | 165.088 | 33.688 | 76.325 |
| 2016-03-201:03:32 PM | 66.875 | 165.088 | 33.575 | 76.325 |
| 2016-03-201:03:36 PM | 66.762 | 165.088 | 33.462 | 76.325 |
| 2016-03-201:03:40 PM | 66.875 | 165.088 | 33.462 | 76.325 |
| 2016-03-201:03:44 PM | 66.988 | 165.088 | 33.575 | 76.325 |
| 2016-03-201:03:48 PM | 66.875 | 165.088 | 33.575 | 76.325 |
| 2016-03-201:03:52 PM | 66.875 | 165.088 | 33.575 | 76.325 |
| 2016-03-201:03:56 PM | 66.875 | 164.975 | 33.35 | 76.325 |
| 2016-03-201:04:00 PM | 66.875 | 164.975 | 33.125 | 76.325 |
| 2016-03-201:04:04 PM | 66.762 | 164.975 | 33.125 | 76.325 |
| 2016-03-201:04:09 PM | 66.65 | 164.975 | 33.012 | 76.325 |
| 2016-03-201:04:13 PM | 66.538 | 164.975 | 33.012 | 76.325 |
| 2016-03-201:04:17 PM | 66.312 | 164.975 | 33.012 | 76.325 |
| 2016-03-201:04:21 PM | 66.2 | 164.975 | 33.125 | 76.325 |
| 2016-03-201:04:25 PM | 66.088 | 164.975 | 33.125 | 76.325 |
| 2016-03-201:04:29 PM | 65.862 | 164.975 | 33.125 | 76.325 |
| 2016-03-201:04:33 PM | 65.638 | 164.975 | 33.238 | 76.325 |
| 2016-03-201:04:37 PM | 65.412 | 164.975 | 33.35 | 76.325 |
| 2016-03-201:04:41 PM | 65.188 | 164.975 | 33.35 | 76.325 |
| 2016-03-201:04:45 PM | 64.963 | 164.975 | 33.462 | 76.325 |
| 2016-03-201:04:49 PM | 64.963 | 164.975 | 33.462 | 76.325 |
| 2016-03-201:04:53 PM | 64.963 | 164.975 | 33.688 | 76.325 |
| 2016-03-201:04:57 PM | 65.075 | 164.975 | 33.8 | 76.325 |
| 2016-03-201:05:01 PM | 65.075 | 164.975 | 33.912 | 76.325 |
| 2016-03-201:05:05 PM | 65.075 | 164.975 | 34.138 | 76.325 |
| 2016-03-201:05:09 PM | 65.075 | 164.975 | 34.25 | 76.325 |
| 2016-03-201:05:13 PM | 65.075 | 164.975 | 34.362 | 76.325 |
| 2016-03-201:05:17 PM | 65.188 | 164.975 | 34.25 | 76.325 |
| 2016-03-201:05:21 PM | 65.188 | 164.862 | 34.138 | 76.212 |
| 2016-03-201:05:25 PM | 65.3 | 164.975 | 34.138 | 76.325 |
| 2016-03-201:05:29 PM | 65.412 | 164.862 | 34.138 | 76.212 |
| 2016-03-201:05:33 PM | 65.638 | 164.862 | 34.025 | 76.212 |
| 2016-03-201:05:37 PM | 65.75 | 164.862 | 34.138 | 76.325 |
| 2016-03-201:05:41 PM | 65.862 | 164.862 | 34.138 | 76.325 |
| 2016-03-201:05:45 PM | 66.088 | 164.862 | 34.138 | 76.325 |
| 2016-03-201:05:50 PM | 66.2 | 164.862 | 34.138 | 76.325 |
| 2016-03-201:05:54 PM | 66.312 | 164.862 | 34.138 | 76.212 |
| 2016-03-201:05:58 PM | 66.538 | 164.75 | 34.25 | 76.212 |
| 2016-03-201:06:02 PM | 66.762 | 164.75 | 34.25 | 76.212 |
| 2016-03-201:06:06 PM | 66.988 | 164.862 | 34.362 | 76.212 |
| 2016-03-201:06:10 PM | 67.1 | 164.862 | 34.362 | 76.212 |
| 2016-03-201:06:14 PM | 67.212 | 164.75 | 34.362 | 76.212 |
| 2016-03-201:06:18 PM | 67.212 | 164.75 | 34.25 | 76.212 |
| 2016-03-201:06:22 PM | 67.325 | 164.75 | 34.138 | 76.212 |
| 2016-03-201:06:26 PM | 67.325 | 164.75 | 34.138 | 76.212 |
| 2016-03-201:06:30 PM | 67.438 | 164.75 | 34.362 | 76.212 |
| 2016-03-201:06:34 PM | 67.55 | 164.75 | 34.25 | 76.212 |
| 2016-03-201:06:38 PM | 67.662 | 164.75 | 34.25 | 76.325 |
| 2016-03-201:06:42 PM | 67.775 | 164.75 | 34.362 | 76.325 |
| 2016-03-201:06:46 PM | 67.888 | 164.75 | 34.475 | 76.212 |
| 2016-03-201:06:50 PM | 68 | 164.75 | 34.588 | 76.325 |
| 2016-03-201:06:54 PM | 68.225 | 164.638 | 34.588 | 76.325 |
| 2016-03-201:06:58 PM | 68.338 | 164.638 | 34.475 | 76.325 |
| 2016-03-201:07:02 PM | 68.338 | 164.638 | 34.475 | 76.212 |
| 2016-03-201:07:06 PM | 68.45 | 164.638 | 34.475 | 76.212 |
| 2016-03-201:07:10 PM | 68.45 | 164.638 | 34.588 | 76.325 |
| 2016-03-201:07:18 PM | 68.45 | 164.638 | 34.588 | 76.212 |
| 2016-03-201:07:22 PM | 68.45 | 164.638 | 34.588 | 76.212 |
| 2016-03-201:07:26 PM | 68.45 | 164.638 | 34.7 | 76.212 |
| 2016-03-201:07:30 PM | 68.562 | 164.638 | 34.7 | 76.212 |
| 2016-03-201:07:34 PM | 68.562 | 164.525 | 34.7 | 76.212 |
| 2016-03-201:07:38 PM | 68.562 | 164.525 | 34.812 | 76.212 |
| 2016-03-201:07:46 PM | 68.45 | 164.525 | 35.15 | 76.212 |
| 2016-03-201:07:50 PM | 68.45 | 164.525 | 35.15 | 76.212 |
| 2016-03-201:07:54 PM | 68.45 | 164.525 | 35.038 | 76.212 |
| 2016-03-201:07:58 PM | 68.562 | 164.525 | 35.038 | 76.212 |
| 2016-03-201:08:02 PM | 68.675 | 164.525 | 34.925 | 76.212 |
| 2016-03-201:08:06 PM | 68.788 | 164.412 | 34.925 | 76.212 |
| 2016-03-201:08:10 PM | 69.012 | 164.412 | 35.038 | 76.212 |
| 2016-03-201:08:14 PM | 69.125 | 164.412 | 35.038 | 76.212 |
| 2016-03-201:08:18 PM | 69.238 | 164.412 | 35.038 | 76.212 |
| 2016-03-201:08:22 PM | 69.35 | 164.412 | 35.15 | 76.212 |
| 2016-03-201:08:26 PM | 69.35 | 164.412 | 35.15 | 76.212 |
| 2016-03-201:08:30 PM | 69.462 | 164.412 | 35.262 | 76.212 |
| 2016-03-201:08:34 PM | 69.462 | 164.412 | 35.375 | 76.212 |
| 2016-03-201:08:38 PM | 69.462 | 164.412 | 35.375 | 76.212 |
| 2016-03-201:08:42 PM | 69.462 | 164.412 | 35.375 | 76.212 |
| 2016-03-201:08:46 PM | 69.462 | 164.412 | 35.262 | 76.212 |
| 2016-03-201:08:50 PM | 69.462 | 164.412 | 35.375 | 76.212 |
| 2016-03-201:08:54 PM | 69.462 | 164.412 | 35.488 | 76.212 |
| 2016-03-201:08:58 PM | 69.575 | 164.412 | 35.6 | 76.212 |
| 2016-03-201:09:02 PM | 69.575 | 164.525 | 35.6 | 76.212 |
| 2016-03-201:09:06 PM | 69.462 | 164.525 | 35.6 | 76.212 |
| 2016-03-201:09:11 PM | 69.575 | 164.525 | 35.712 | 76.1 |
| 2016-03-201:09:15 PM | 69.688 | 164.525 | 35.712 | 76.1 |
| 2016-03-201:09:19 PM | 69.8 | 164.525 | 35.825 | 76.1 |
| 2016-03-201:09:23 PM | 69.688 | 164.525 | 35.938 | 76.1 |
| 2016-03-201:09:27 PM | 69.8 | 164.525 | 35.938 | 76.1 |
| 2016-03-201:09:31 PM | 69.688 | 164.638 | 35.825 | 76.212 |
| 2016-03-201:09:35 PM | 69.688 | 164.638 | 35.825 | 76.1 |
| 2016-03-201:09:39 PM | 69.688 | 164.638 | 35.825 | 76.1 |
| 2016-03-201:09:43 PM | 69.688 | 164.638 | 35.825 | 76.1 |
| 2016-03-201:09:47 PM | 69.8 | 164.638 | 35.825 | 76.1 |
| 2016-03-201:09:51 PM | 69.8 | 164.75 | 35.825 | 76.1 |
| 2016-03-201:09:55 PM | 69.912 | 164.75 | 35.938 | 76.1 |
| 2016-03-201:09:59 PM | 70.025 | 164.75 | 36.05 | 76.1 |
| 2016-03-201:10:03 PM | 70.138 | 164.75 | 36.05 | 76.1 |
| 2016-03-201:10:07 PM | 70.25 | 164.862 | 36.05 | 76.1 |
| 2016-03-201:10:11 PM | 70.362 | 164.862 | 35.938 | 76.1 |
| 2016-03-201:10:15 PM | 70.475 | 164.975 | 35.825 | 76.1 |
| 2016-03-201:10:19 PM | 70.362 | 164.975 | 35.825 | 76.1 |
| 2016-03-201:10:23 PM | 70.475 | 164.975 | 35.712 | 76.1 |
| 2016-03-201:10:27 PM | 70.475 | 164.975 | 35.712 | 76.1 |
| 2016-03-201:10:31 PM | 70.475 | 165.088 | 35.712 | 76.1 |
| 2016-03-201:10:35 PM | 70.362 | 165.088 | 35.825 | 76.1 |
| 2016-03-201:10:39 PM | 70.362 | 165.088 | 35.938 | 76.1 |
| 2016-03-201:10:43 PM | 70.25 | 165.088 | 35.938 | 76.1 |
| 2016-03-201:10:47 PM | 70.362 | 165.088 | 36.05 | 76.1 |
| 2016-03-201:10:51 PM | 70.475 | 165.088 | 36.05 | 76.1 |
| 2016-03-201:10:55 PM | 70.475 | 165.2 | 36.05 | 76.1 |
| 2016-03-201:11:00 PM | 70.588 | 165.2 | 36.05 | 76.1 |
| 2016-03-201:11:04 PM | 70.812 | 165.2 | 36.05 | 76.1 |
| 2016-03-201:11:08 PM | 70.925 | 165.2 | 36.05 | 76.212 |
| 2016-03-201:11:12 PM | 71.038 | 165.2 | 35.938 | 76.212 |
| 2016-03-201:11:16 PM | 70.925 | 165.312 | 35.825 | 76.212 |
| 2016-03-201:11:20 PM | 70.925 | 165.312 | 35.712 | 76.212 |
| 2016-03-201:11:24 PM | 71.038 | 165.312 | 35.6 | 76.212 |
| 2016-03-201:11:28 PM | 70.925 | 165.312 | 35.375 | 76.212 |
| 2016-03-201:11:32 PM | 71.038 | 165.312 | 35.262 | 76.212 |
| 2016-03-201:11:36 PM | 71.038 | 165.425 | 35.375 | 76.212 |
| 2016-03-201:11:40 PM | 71.15 | 165.425 | 35.375 | 76.325 |
| 2016-03-201:11:44 PM | 71.262 | 165.538 | 35.488 | 76.212 |
| 2016-03-201:11:48 PM | 71.262 | 165.538 | 35.488 | 76.212 |
| 2016-03-201:11:52 PM | 71.375 | 165.538 | 35.6 | 76.325 |
| 2016-03-201:11:56 PM | 71.262 | 165.65 | 35.6 | 76.325 |
| 2016-03-201:12:00 PM | 71.038 | 165.65 | 35.6 | 76.325 |
| 2016-03-201:12:04 PM | 70.812 | 165.65 | 35.6 | 76.325 |
| 2016-03-201:12:08 PM | 70.7 | 165.763 | 35.6 | 76.325 |
| 2016-03-201:12:12 PM | 70.475 | 165.763 | 35.6 | 76.325 |
| 2016-03-201:12:16 PM | 70.362 | 165.763 | 35.488 | 76.325 |
| 2016-03-201:12:20 PM | 70.362 | 165.763 | 35.488 | 76.325 |
| 2016-03-201:12:24 PM | 70.362 | 165.875 | 35.488 | 76.325 |
| 2016-03-201:12:28 PM | 70.362 | 165.875 | 35.6 | 76.325 |
| 2016-03-201:12:32 PM | 70.475 | 165.988 | 35.6 | 76.325 |
| 2016-03-201:12:36 PM | 70.475 | 165.875 | 35.375 | 76.325 |
| 2016-03-201:12:40 PM | 70.475 | 165.988 | 35.262 | 76.325 |
| 2016-03-201:12:44 PM | 70.475 | 165.988 | 35.038 | 76.325 |
| 2016-03-201:12:48 PM | 70.475 | 166.1 | 34.812 | 76.325 |
| 2016-03-201:12:52 PM | 70.475 | 166.1 | 34.7 | 76.325 |
| 2016-03-201:12:56 PM | 70.475 | 166.1 | 34.925 | 76.325 |
| 2016-03-201:13:00 PM | 70.475 | 166.1 | 34.925 | 76.325 |
| 2016-03-201:13:04 PM | 70.475 | 166.212 | 34.812 | 76.325 |
| 2016-03-201:13:09 PM | 70.588 | 166.212 | 34.588 | 76.325 |
| 2016-03-201:13:13 PM | 70.475 | 166.1 | 34.362 | 76.325 |
| 2016-03-201:13:17 PM | 70.588 | 166.212 | 34.362 | 76.325 |
| 2016-03-201:13:21 PM | 70.588 | 166.212 | 34.362 | 76.325 |
| 2016-03-201:13:25 PM | 70.588 | 166.325 | 34.362 | 76.325 |
| 2016-03-201:13:29 PM | 70.475 | 166.325 | 34.362 | 76.325 |
| 2016-03-201:13:33 PM | 70.362 | 166.325 | 34.25 | 76.325 |
| 2016-03-201:13:37 PM | 70.362 | 166.325 | 34.362 | 76.438 |
| 2016-03-201:13:41 PM | 70.25 | 166.325 | 34.475 | 76.325 |
| 2016-03-201:13:45 PM | 70.362 | 166.438 | 34.588 | 76.325 |
| 2016-03-201:13:49 PM | 70.362 | 166.438 | 34.588 | 76.325 |
| 2016-03-201:13:53 PM | 70.475 | 166.438 | 34.7 | 76.325 |
| 2016-03-201:13:57 PM | 70.475 | 166.438 | 34.812 | 76.325 |
| 2016-03-201:14:01 PM | 70.588 | 166.438 | 34.925 | 76.438 |
| 2016-03-201:14:05 PM | 70.588 | 166.438 | 35.038 | 76.325 |
| 2016-03-201:14:09 PM | 70.7 | 166.55 | 35.15 | 76.325 |
| 2016-03-201:14:13 PM | 70.7 | 166.438 | 35.15 | 76.325 |
| 2016-03-201:14:17 PM | 70.7 | 166.55 | 35.262 | 76.325 |
| 2016-03-201:14:21 PM | 70.812 | 166.55 | 35.262 | 76.325 |
| 2016-03-201:14:25 PM | 71.038 | 166.55 | 35.15 | 76.212 |
| 2016-03-201:14:29 PM | 71.15 | 166.55 | 35.15 | 76.325 |
| 2016-03-201:14:33 PM | 71.15 | 166.55 | 35.15 | 76.325 |
| 2016-03-201:14:37 PM | 71.15 | 166.55 | 35.262 | 76.325 |
| 2016-03-201:14:41 PM | 71.15 | 166.55 | 35.375 | 76.325 |
| 2016-03-201:14:45 PM | 71.262 | 166.55 | 35.262 | 76.325 |
| 2016-03-201:14:49 PM | 71.262 | 166.55 | 35.262 | 76.325 |
| 2016-03-201:14:53 PM | 71.262 | 166.55 | 35.262 | 76.325 |
| 2016-03-201:14:57 PM | 71.262 | 166.55 | 35.262 | 76.325 |
| 2016-03-201:15:01 PM | 71.15 | 166.438 | 35.375 | 76.212 |
| 2016-03-201:15:05 PM | 71.038 | 166.438 | 35.375 | 76.325 |
| 2016-03-201:15:09 PM | 70.925 | 166.438 | 35.488 | 76.325 |
| 2016-03-201:15:13 PM | 70.925 | 166.438 | 35.6 | 76.325 |
| 2016-03-201:15:18 PM | 71.038 | 166.438 | 35.712 | 76.325 |
| 2016-03-201:15:22 PM | 70.925 | 166.438 | 35.825 | 76.325 |
| 2016-03-201:15:26 PM | 70.925 | 166.438 | 35.938 | 76.325 |
| 2016-03-201:15:30 PM | 70.812 | 166.438 | 36.05 | 76.325 |
| 2016-03-201:15:34 PM | 70.812 | 166.438 | 36.05 | 76.325 |
| 2016-03-201:15:38 PM | 70.588 | 166.438 | 36.05 | 76.325 |
| 2016-03-201:15:42 PM | 70.588 | 166.438 | 36.05 | 76.212 |
| 2016-03-201:15:46 PM | 70.588 | 166.325 | 36.162 | 76.212 |
| 2016-03-201:15:50 PM | 70.7 | 166.438 | 36.275 | 76.212 |
| 2016-03-201:15:54 PM | 70.7 | 166.438 | 36.388 | 76.212 |
| 2016-03-201:15:58 PM | 70.7 | 166.325 | 36.5 | 76.212 |
| 2016-03-201:16:02 PM | 70.7 | 166.438 | 36.5 | 76.212 |
| 2016-03-201:16:06 PM | 70.588 | 166.325 | 36.275 | 76.212 |
| 2016-03-201:16:10 PM | 70.588 | 166.325 | 36.275 | 76.212 |
| 2016-03-201:16:14 PM | 70.475 | 166.325 | 36.275 | 76.212 |
| 2016-03-201:16:18 PM | 70.362 | 166.438 | 36.162 | 76.212 |
| 2016-03-201:16:22 PM | 70.475 | 166.325 | 36.162 | 76.212 |
| 2016-03-201:16:26 PM | 70.588 | 166.325 | 35.938 | 76.212 |
| 2016-03-201:16:30 PM | 70.588 | 166.325 | 35.825 | 76.212 |
| 2016-03-201:16:34 PM | 70.7 | 166.325 | 35.938 | 76.212 |
| 2016-03-201:16:38 PM | 70.7 | 166.325 | 35.938 | 76.212 |
| 2016-03-201:16:42 PM | 70.812 | 166.325 | 35.938 | 76.212 |
| 2016-03-201:16:46 PM | 70.925 | 166.325 | 35.938 | 76.212 |
| 2016-03-201:16:50 PM | 70.925 | 166.325 | 35.825 | 76.212 |
| 2016-03-201:16:54 PM | 70.812 | 166.325 | 35.6 | 76.325 |
| 2016-03-201:16:58 PM | 70.7 | 166.438 | 35.488 | 76.212 |
| 2016-03-201:17:02 PM | 70.588 | 166.438 | 35.375 | 76.212 |
| 2016-03-201:17:06 PM | 70.588 | 166.438 | 35.262 | 76.325 |
| 2016-03-201:17:10 PM | 70.7 | 166.438 | 35.262 | 76.212 |
| 2016-03-201:17:14 PM | 70.812 | 166.438 | 35.262 | 76.325 |
| 2016-03-201:17:18 PM | 70.925 | 166.438 | 35.375 | 76.325 |
| 2016-03-201:17:22 PM | 71.038 | 166.438 | 35.375 | 76.325 |
| 2016-03-201:17:27 PM | 71.262 | 166.438 | 35.488 | 76.325 |
| 2016-03-201:17:31 PM | 71.375 | 166.438 | 35.6 | 76.325 |
| 2016-03-201:17:35 PM | 71.488 | 166.55 | 35.825 | 76.325 |
| 2016-03-201:17:39 PM | 71.6 | 166.55 | 35.712 | 76.325 |
| 2016-03-201:17:43 PM | 71.6 | 166.55 | 35.825 | 76.325 |
| 2016-03-201:17:47 PM | 71.712 | 166.55 | 35.712 | 76.325 |
| 2016-03-201:17:51 PM | 71.825 | 166.55 | 35.712 | 76.325 |
| 2016-03-201:17:55 PM | 71.938 | 166.662 | 35.6 | 76.325 |
| 2016-03-201:17:59 PM | 71.938 | 166.662 | 35.488 | 76.325 |
| 2016-03-201:18:03 PM | 72.05 | 166.662 | 35.488 | 76.212 |
| 2016-03-201:18:07 PM | 72.05 | 166.662 | 35.488 | 76.212 |
| 2016-03-201:18:11 PM | 72.162 | 166.662 | 35.488 | 76.212 |
| 2016-03-201:18:15 PM | 72.162 | 166.662 | 35.6 | 76.1 |
| 2016-03-201:18:19 PM | 72.162 | 166.662 | 35.712 | 76.212 |
| 2016-03-201:18:23 PM | 72.275 | 166.775 | 35.825 | 76.212 |
| 2016-03-201:18:27 PM | 72.275 | 166.662 | 35.938 | 76.212 |
| 2016-03-201:18:31 PM | 72.162 | 166.775 | 36.05 | 76.212 |
| 2016-03-201:18:35 PM | 72.162 | 166.775 | 36.162 | 76.212 |
| 2016-03-201:18:39 PM | 72.162 | 166.775 | 36.05 | 76.212 |
| 2016-03-201:18:43 PM | 72.162 | 166.775 | 35.712 | 76.212 |
| 2016-03-201:18:47 PM | 72.162 | 166.775 | 35.488 | 76.212 |
| 2016-03-201:18:51 PM | 72.05 | 166.775 | 35.6 | 76.212 |
| 2016-03-201:18:55 PM | 71.938 | 166.775 | 35.6 | 76.212 |
| 2016-03-201:18:59 PM | 71.825 | 166.775 | 35.712 | 76.212 |
| 2016-03-201:19:03 PM | 71.6 | 166.775 | 35.825 | 76.212 |
| 2016-03-201:19:07 PM | 71.6 | 166.775 | 35.825 | 76.212 |
| 2016-03-201:19:11 PM | 71.488 | 166.775 | 35.825 | 76.212 |
| 2016-03-201:19:15 PM | 71.262 | 166.775 | 35.825 | 76.212 |
| 2016-03-201:19:19 PM | 71.375 | 166.775 | 35.825 | 76.212 |
| 2016-03-201:19:23 PM | 71.375 | 166.775 | 35.825 | 76.212 |
| 2016-03-201:19:28 PM | 71.375 | 166.775 | 35.825 | 76.212 |
| 2016-03-201:19:32 PM | 71.262 | 166.888 | 35.712 | 76.212 |
| 2016-03-201:19:36 PM | 71.262 | 166.888 | 35.6 | 76.212 |
| 2016-03-201:19:40 PM | 71.375 | 166.888 | 35.375 | 76.212 |
| 2016-03-201:19:44 PM | 71.375 | 166.775 | 35.15 | 76.212 |
| 2016-03-201:19:48 PM | 71.375 | 166.888 | 35.038 | 76.212 |
| 2016-03-201:19:52 PM | 71.262 | 166.888 | 34.925 | 76.212 |
| 2016-03-201:19:56 PM | 71.262 | 166.888 | 34.812 | 76.212 |
| 2016-03-201:20:00 PM | 71.262 | 166.888 | 34.475 | 76.212 |
| 2016-03-201:20:04 PM | 71.262 | 166.888 | 34.362 | 76.212 |
| 2016-03-201:20:08 PM | 71.262 | 166.888 | 34.362 | 76.212 |
| 2016-03-201:20:12 PM | 71.262 | 166.888 | 34.475 | 76.212 |
| 2016-03-201:20:16 PM | 71.262 | 166.888 | 34.588 | 76.212 |
| 2016-03-201:20:20 PM | 71.262 | 166.888 | 34.588 | 76.212 |
| 2016-03-201:20:24 PM | 71.375 | 166.888 | 34.588 | 76.212 |
| 2016-03-201:20:28 PM | 71.375 | 166.888 | 34.588 | 76.212 |
| 2016-03-201:20:32 PM | 71.375 | 167 | 34.7 | 76.212 |
| 2016-03-201:20:36 PM | 71.375 | 167 | 34.7 | 76.212 |
| 2016-03-201:20:40 PM | 71.375 | 166.888 | 34.812 | 76.212 |
| 2016-03-201:20:44 PM | 71.375 | 167 | 34.7 | 76.212 |
| 2016-03-201:20:49 PM | 71.262 | 167 | 34.7 | 76.212 |
| 2016-03-201:20:53 PM | 71.262 | 166.888 | 34.588 | 76.212 |
| 2016-03-201:20:57 PM | 71.262 | 167 | 34.588 | 76.212 |
| 2016-03-201:21:04 PM | 71.262 | 167 | 34.7 | 76.212 |
| 2016-03-201:21:08 PM | 71.262 | 167 | 34.7 | 76.325 |
| 2016-03-201:21:12 PM | 71.262 | 167 | 34.812 | 76.212 |
| 2016-03-201:21:16 PM | 71.375 | 167 | 34.812 | 76.212 |
| 2016-03-201:21:20 PM | 71.488 | 167.112 | 34.925 | 76.212 |
| 2016-03-201:21:24 PM | 71.6 | 167.112 | 35.038 | 76.212 |
| 2016-03-201:21:28 PM | 71.712 | 167.112 | 35.15 | 76.212 |
| 2016-03-201:21:32 PM | 71.825 | 167.112 | 35.15 | 76.212 |
| 2016-03-201:21:36 PM | 71.825 | 167.112 | 35.15 | 76.212 |
| 2016-03-201:21:40 PM | 71.938 | 167.112 | 35.15 | 76.212 |
| 2016-03-201:21:44 PM | 71.938 | 167.112 | 35.262 | 76.212 |
| 2016-03-201:21:48 PM | 71.938 | 167.112 | 35.375 | 76.212 |
| 2016-03-201:21:52 PM | 71.938 | 167.112 | 35.262 | 76.212 |
| 2016-03-201:21:56 PM | 72.05 | 167.112 | 35.262 | 76.212 |
| 2016-03-201:22:00 PM | 72.05 | 167.112 | 35.15 | 76.212 |
| 2016-03-201:22:04 PM | 72.162 | 167.112 | 35.038 | 76.212 |
| 2016-03-201:22:08 PM | 72.162 | 167.225 | 35.038 | 76.212 |
| 2016-03-201:22:13 PM | 72.275 | 167.112 | 35.038 | 76.212 |
| 2016-03-201:22:17 PM | 72.275 | 167.112 | 35.038 | 76.325 |
| 2016-03-201:22:21 PM | 72.388 | 167.112 | 35.038 | 76.212 |
| 2016-03-201:22:25 PM | 72.5 | 167.112 | 35.038 | 76.325 |
| 2016-03-201:22:29 PM | 72.5 | 167.112 | 35.15 | 76.325 |
| 2016-03-201:22:33 PM | 72.5 | 167.112 | 35.262 | 76.325 |
| 2016-03-201:22:37 PM | 72.612 | 167.112 | 35.375 | 76.325 |
| 2016-03-201:22:41 PM | 72.612 | 167.112 | 35.488 | 76.325 |
| 2016-03-201:22:45 PM | 72.725 | 167.112 | 35.6 | 76.325 |
| 2016-03-201:22:49 PM | 72.612 | 167.112 | 35.712 | 76.325 |
| 2016-03-201:22:53 PM | 72.612 | 167.112 | 35.825 | 76.325 |
| 2016-03-201:22:57 PM | 72.5 | 167.112 | 35.938 | 76.325 |
| 2016-03-201:23:01 PM | 72.5 | 167.112 | 35.938 | 76.325 |
| 2016-03-201:23:05 PM | 72.5 | 167.112 | 35.825 | 76.325 |
| 2016-03-201:23:09 PM | 72.388 | 167.112 | 35.825 | 76.325 |
| 2016-03-201:23:13 PM | 72.162 | 167.112 | 35.6 | 76.325 |
| 2016-03-201:23:17 PM | 72.05 | 167.112 | 35.6 | 76.325 |
| 2016-03-201:23:21 PM | 72.05 | 167.112 | 35.488 | 76.325 |
| 2016-03-201:23:25 PM | 71.938 | 167.112 | 35.488 | 76.325 |
| 2016-03-201:23:29 PM | 71.938 | 167 | 35.488 | 76.325 |
| 2016-03-201:23:37 PM | 71.712 | 167 | 35.712 | 76.325 |
| 2016-03-201:23:41 PM | 71.712 | 167 | 35.825 | 76.325 |
| 2016-03-201:23:45 PM | 71.6 | 167 | 35.825 | 76.325 |
| 2016-03-201:23:49 PM | 71.488 | 167 | 35.712 | 76.325 |
| 2016-03-201:23:53 PM | 71.375 | 167 | 35.488 | 76.325 |
| 2016-03-201:23:57 PM | 71.375 | 167.112 | 35.375 | 76.325 |
| 2016-03-201:24:01 PM | 71.262 | 167.112 | 35.262 | 76.325 |
| 2016-03-201:24:05 PM | 71.15 | 167.112 | 35.262 | 76.325 |
| 2016-03-201:24:10 PM | 71.15 | 167.112 | 35.262 | 76.325 |
| 2016-03-201:24:14 PM | 71.038 | 167.112 | 35.15 | 76.438 |
| 2016-03-201:24:18 PM | 70.925 | 167.112 | 34.925 | 76.325 |
| 2016-03-201:24:22 PM | 70.7 | 167.112 | 34.925 | 76.325 |
| 2016-03-201:24:26 PM | 70.362 | 167.112 | 34.925 | 76.325 |
| 2016-03-201:24:30 PM | 70.25 | 167.112 | 34.925 | 76.438 |
| 2016-03-201:24:34 PM | 70.25 | 167.112 | 34.925 | 76.325 |
| 2016-03-201:24:38 PM | 70.138 | 167.112 | 34.925 | 76.438 |
| 2016-03-201:24:42 PM | 70.025 | 167.112 | 34.812 | 76.438 |
| 2016-03-201:24:46 PM | 70.025 | 167.112 | 34.925 | 76.438 |
| 2016-03-201:24:50 PM | 69.912 | 167.112 | 35.038 | 76.438 |
| 2016-03-201:24:54 PM | 69.8 | 167.112 | 35.038 | 76.438 |
| 2016-03-201:24:58 PM | 69.8 | 167.112 | 35.038 | 76.438 |
| 2016-03-201:25:02 PM | 70.025 | 167.112 | 35.15 | 76.325 |
| 2016-03-201:25:06 PM | 70.025 | 167.112 | 35.262 | 76.325 |
| 2016-03-201:25:10 PM | 70.025 | 167.112 | 35.375 | 76.325 |
| 2016-03-201:25:14 PM | 70.138 | 167.112 | 35.488 | 76.325 |
| 2016-03-201:25:18 PM | 70.138 | 167.112 | 35.6 | 76.325 |
| 2016-03-201:25:23 PM | 70.25 | 167.112 | 35.6 | 76.325 |
| 2016-03-201:25:27 PM | 70.362 | 167.112 | 35.6 | 76.325 |
| 2016-03-201:25:31 PM | 70.588 | 167.112 | 35.712 | 76.325 |
| 2016-03-201:25:35 PM | 70.588 | 167.112 | 35.825 | 76.325 |
| 2016-03-201:25:39 PM | 70.588 | 167.112 | 35.825 | 76.325 |
| 2016-03-201:25:43 PM | 70.588 | 167.225 | 35.6 | 76.325 |
| 2016-03-201:25:47 PM | 70.7 | 167.225 | 35.6 | 76.325 |
| 2016-03-201:25:51 PM | 70.7 | 167.225 | 35.6 | 76.212 |
| 2016-03-201:25:55 PM | 70.7 | 167.225 | 35.488 | 76.212 |
| 2016-03-201:25:59 PM | 70.588 | 167.225 | 35.712 | 76.212 |
| 2016-03-201:26:03 PM | 70.588 | 167.225 | 35.712 | 76.212 |
| 2016-03-201:26:07 PM | 70.588 | 167.225 | 35.712 | 76.325 |
| 2016-03-201:26:11 PM | 70.588 | 167.225 | 35.825 | 76.325 |
| 2016-03-201:26:15 PM | 70.588 | 167.225 | 35.825 | 76.325 |
| 2016-03-201:26:19 PM | 70.588 | 167.225 | 35.825 | 76.325 |
| 2016-03-201:26:23 PM | 70.7 | 167.338 | 35.938 | 76.325 |
| 2016-03-201:26:27 PM | 70.925 | 167.225 | 35.938 | 76.325 |
| 2016-03-201:26:31 PM | 71.038 | 167.338 | 36.162 | 76.325 |
| 2016-03-201:26:35 PM | 71.15 | 167.338 | 36.275 | 76.325 |
| 2016-03-201:26:39 PM | 71.488 | 167.338 | 36.5 | 76.325 |
| 2016-03-201:26:43 PM | 71.6 | 167.338 | 36.5 | 76.325 |
| 2016-03-201:26:47 PM | 71.825 | 167.225 | 36.612 | 76.325 |
| 2016-03-201:26:52 PM | 72.05 | 167.338 | 36.612 | 76.438 |
| 2016-03-201:26:56 PM | 72.162 | 167.338 | 36.838 | 76.438 |
| 2016-03-201:27:00 PM | 72.275 | 167.338 | 36.725 | 76.438 |
| 2016-03-201:27:04 PM | 72.388 | 167.338 | 36.612 | 76.438 |
| 2016-03-201:27:08 PM | 72.612 | 167.338 | 36.5 | 76.438 |
| 2016-03-201:27:12 PM | 72.725 | 167.338 | 36.5 | 76.438 |
| 2016-03-201:27:16 PM | 72.838 | 167.338 | 36.5 | 76.55 |
| 2016-03-201:27:20 PM | 72.95 | 167.225 | 36.5 | 76.55 |
| 2016-03-201:27:24 PM | 73.062 | 167.225 | 36.612 | 76.55 |
| 2016-03-201:27:28 PM | 73.288 | 167.225 | 36.388 | 76.438 |
| 2016-03-201:27:32 PM | 73.4 | 167.225 | 36.275 | 76.438 |
| 2016-03-201:27:36 PM | 73.512 | 167.225 | 36.05 | 76.55 |
| 2016-03-201:27:40 PM | 73.512 | 167.225 | 36.05 | 76.438 |
| 2016-03-201:27:44 PM | 73.625 | 167.225 | 36.162 | 76.55 |
| 2016-03-201:27:48 PM | 73.85 | 167.225 | 36.05 | 76.55 |
| 2016-03-201:27:53 PM | 73.85 | 167.225 | 36.05 | 76.55 |
| 2016-03-201:27:57 PM | 73.85 | 167.225 | 36.05 | 76.55 |
| 2016-03-201:28:01 PM | 73.738 | 167.225 | 36.162 | 76.55 |
| 2016-03-201:28:05 PM | 73.85 | 167.225 | 36.275 | 76.55 |
| 2016-03-201:28:09 PM | 73.962 | 167.225 | 36.275 | 76.55 |
| 2016-03-201:28:13 PM | 73.962 | 167.225 | 36.275 | 76.55 |
| 2016-03-201:28:17 PM | 74.075 | 167.225 | 36.275 | 76.55 |
| 2016-03-201:28:21 PM | 74.075 | 167.225 | 36.275 | 76.55 |
| 2016-03-201:28:25 PM | 73.962 | 167.225 | 36.275 | 76.55 |
| 2016-03-201:28:29 PM | 73.85 | 167.225 | 36.388 | 76.55 |
| 2016-03-201:28:33 PM | 73.738 | 167.225 | 36.5 | 76.55 |
| 2016-03-201:28:37 PM | 73.738 | 167.225 | 36.388 | 76.55 |
| 2016-03-201:28:41 PM | 73.4 | 167.225 | 36.388 | 76.55 |
| 2016-03-201:28:45 PM | 73.4 | 167.225 | 36.275 | 76.55 |
| 2016-03-201:28:49 PM | 73.4 | 167.225 | 36.162 | 76.55 |
| 2016-03-201:28:53 PM | 73.4 | 167.225 | 36.05 | 76.55 |
| 2016-03-201:28:58 PM | 73.175 | 167.225 | 35.938 | 76.55 |
| 2016-03-201:29:02 PM | 72.838 | 167.225 | 35.938 | 76.438 |
| 2016-03-201:29:06 PM | 72.612 | 167.225 | 35.825 | 76.438 |
| 2016-03-201:29:10 PM | 72.388 | 167.225 | 35.825 | 76.438 |
| 2016-03-201:29:14 PM | 72.275 | 167.225 | 35.938 | 76.438 |
| 2016-03-201:29:18 PM | 72.05 | 167.225 | 36.05 | 76.438 |
| 2016-03-201:29:22 PM | 71.825 | 167.225 | 36.162 | 76.438 |
| 2016-03-201:29:26 PM | 71.712 | 167.225 | 36.388 | 76.438 |
| 2016-03-201:29:30 PM | 71.712 | 167.225 | 36.5 | 76.438 |
| 2016-03-201:29:34 PM | 71.6 | 167.225 | 36.612 | 76.438 |
| 2016-03-201:29:38 PM | 71.488 | 167.225 | 36.612 | 76.438 |
| 2016-03-201:29:42 PM | 71.488 | 167.225 | 36.725 | 76.438 |
| 2016-03-201:29:46 PM | 71.488 | 167.225 | 36.838 | 76.438 |
| 2016-03-201:29:50 PM | 71.488 | 167.225 | 36.95 | 76.438 |
| 2016-03-201:29:55 PM | 71.6 | 167.225 | 36.95 | 76.325 |
| 2016-03-201:29:59 PM | 71.6 | 167.225 | 37.062 | 76.325 |
| 2016-03-201:30:03 PM | 71.6 | 167.225 | 37.062 | 76.438 |
| 2016-03-201:30:07 PM | 71.712 | 167.225 | 37.175 | 76.325 |
| 2016-03-201:30:11 PM | 71.712 | 167.225 | 37.288 | 76.438 |
| 2016-03-201:30:15 PM | 71.825 | 167.225 | 37.288 | 76.325 |
| 2016-03-201:30:19 PM | 71.938 | 167.225 | 37.288 | 76.438 |
| 2016-03-201:30:23 PM | 72.05 | 167.225 | 37.288 | 76.325 |
| 2016-03-201:30:27 PM | 72.05 | 167.338 | 37.4 | 76.325 |
| 2016-03-201:30:31 PM | 72.162 | 167.338 | 37.4 | 76.438 |
| 2016-03-201:30:35 PM | 72.388 | 167.338 | 37.288 | 76.325 |
| 2016-03-201:30:39 PM | 72.5 | 167.338 | 37.4 | 76.325 |
| 2016-03-201:30:43 PM | 72.5 | 167.338 | 37.4 | 76.325 |
| 2016-03-201:30:47 PM | 72.388 | 167.338 | 37.512 | 76.325 |
| 2016-03-201:30:51 PM | 72.162 | 167.45 | 37.625 | 76.325 |
| 2016-03-201:30:55 PM | 72.162 | 167.45 | 37.512 | 76.325 |
| 2016-03-201:31:00 PM | 71.938 | 167.562 | 37.512 | 76.325 |
| 2016-03-201:31:04 PM | 71.825 | 167.45 | 37.4 | 76.325 |
| 2016-03-201:31:08 PM | 71.712 | 167.562 | 37.4 | 76.325 |
| 2016-03-201:31:12 PM | 71.6 | 167.562 | 37.4 | 76.325 |
| 2016-03-201:31:16 PM | 71.375 | 167.562 | 37.288 | 76.325 |
| 2016-03-201:31:20 PM | 71.15 | 167.675 | 37.4 | 76.325 |
| 2016-03-201:31:24 PM | 71.038 | 167.675 | 37.288 | 76.325 |
| 2016-03-201:31:28 PM | 71.038 | 167.675 | 37.288 | 76.212 |
| 2016-03-201:31:32 PM | 70.925 | 167.675 | 37.288 | 76.325 |
| 2016-03-201:31:36 PM | 70.925 | 167.675 | 37.4 | 76.325 |
| 2016-03-201:31:40 PM | 70.925 | 167.675 | 37.4 | 76.325 |
| 2016-03-201:31:44 PM | 71.038 | 167.675 | 37.512 | 76.325 |
| 2016-03-201:31:48 PM | 71.15 | 167.675 | 37.512 | 76.325 |
| 2016-03-201:31:52 PM | 71.262 | 167.788 | 37.625 | 76.325 |
| 2016-03-201:31:56 PM | 71.375 | 167.788 | 37.738 | 76.325 |
| 2016-03-201:32:01 PM | 71.488 | 167.788 | 37.85 | 76.212 |
| 2016-03-201:32:05 PM | 71.712 | 167.788 | 37.85 | 76.212 |
| 2016-03-201:32:12 PM | 71.825 | 167.788 | 37.85 | 76.325 |
| 2016-03-201:32:16 PM | 71.938 | 167.788 | 37.962 | 76.212 |
| 2016-03-201:32:20 PM | 72.05 | 167.788 | 38.075 | 76.212 |
| 2016-03-201:32:24 PM | 72.275 | 167.9 | 38.188 | 76.212 |
| 2016-03-201:32:28 PM | 72.275 | 167.9 | 38.188 | 76.325 |
| 2016-03-201:32:32 PM | 72.275 | 167.9 | 38.3 | 76.325 |
| 2016-03-201:32:36 PM | 72.275 | 167.9 | 38.3 | 76.325 |
| 2016-03-201:32:40 PM | 72.388 | 168.013 | 38.412 | 76.325 |
| 2016-03-201:32:44 PM | 72.388 | 168.013 | 38.412 | 76.212 |
| 2016-03-201:32:48 PM | 72.5 | 168.013 | 38.525 | 76.212 |
| 2016-03-201:32:53 PM | 72.612 | 168.013 | 38.3 | 76.212 |
| 2016-03-201:32:57 PM | 72.725 | 168.013 | 38.075 | 76.212 |
| 2016-03-201:33:01 PM | 72.725 | 168.013 | 37.625 | 76.212 |
| 2016-03-201:33:05 PM | 72.725 | 168.125 | 37.288 | 76.212 |
| 2016-03-201:33:09 PM | 72.725 | 168.125 | 37.062 | 76.212 |
| 2016-03-201:33:13 PM | 72.612 | 168.125 | 36.725 | 76.212 |
| 2016-03-201:33:17 PM | 72.725 | 168.125 | 36.612 | 76.212 |
| 2016-03-201:33:21 PM | 72.725 | 168.125 | 36.725 | 76.1 |
| 2016-03-201:33:25 PM | 72.725 | 168.238 | 36.725 | 76.1 |
| 2016-03-201:33:29 PM | 72.838 | 168.238 | 36.725 | 76.1 |
| 2016-03-201:33:33 PM | 72.95 | 168.238 | 36.838 | 76.212 |
| 2016-03-201:33:37 PM | 72.95 | 168.238 | 36.95 | 76.1 |
| 2016-03-201:33:45 PM | 72.95 | 168.35 | 37.175 | 76.1 |
| 2016-03-201:33:50 PM | 72.95 | 168.35 | 37.175 | 76.212 |
| 2016-03-201:33:54 PM | 72.95 | 168.35 | 37.175 | 76.1 |
| 2016-03-201:33:58 PM | 72.95 | 168.462 | 37.175 | 76.212 |
| 2016-03-201:34:02 PM | 73.062 | 168.462 | 37.175 | 76.212 |
| 2016-03-201:34:06 PM | 73.062 | 168.575 | 37.175 | 76.212 |
| 2016-03-201:34:10 PM | 73.175 | 168.575 | 37.175 | 76.212 |
| 2016-03-201:34:14 PM | 73.175 | 168.575 | 37.175 | 76.212 |
| 2016-03-201:34:18 PM | 73.062 | 168.575 | 37.175 | 76.212 |
| 2016-03-201:34:22 PM | 72.838 | 168.688 | 37.175 | 76.212 |
| 2016-03-201:34:26 PM | 72.725 | 168.688 | 36.95 | 76.212 |
| 2016-03-201:34:30 PM | 72.725 | 168.688 | 36.838 | 76.212 |
| 2016-03-201:34:34 PM | 72.612 | 168.688 | 36.95 | 76.212 |
| 2016-03-201:34:38 PM | 72.5 | 168.8 | 36.95 | 76.212 |
| 2016-03-201:34:42 PM | 72.612 | 168.8 | 36.95 | 76.212 |
| 2016-03-201:34:46 PM | 72.5 | 168.8 | 37.062 | 76.325 |
| 2016-03-201:34:50 PM | 72.388 | 168.8 | 36.95 | 76.212 |
| 2016-03-201:34:55 PM | 72.388 | 168.8 | 36.838 | 76.212 |
| 2016-03-201:34:59 PM | 72.5 | 168.8 | 36.725 | 76.212 |
| 2016-03-201:35:03 PM | 72.5 | 168.8 | 36.725 | 76.212 |
| 2016-03-201:35:07 PM | 72.612 | 168.8 | 36.725 | 76.212 |
| 2016-03-201:35:11 PM | 72.612 | 168.8 | 36.612 | 76.212 |
| 2016-03-201:35:15 PM | 72.612 | 168.912 | 36.612 | 76.212 |
| 2016-03-201:35:19 PM | 72.725 | 168.912 | 36.725 | 76.212 |
| 2016-03-201:35:23 PM | 72.725 | 168.912 | 36.838 | 76.212 |
| 2016-03-201:35:27 PM | 72.725 | 168.912 | 36.95 | 76.212 |
| 2016-03-201:35:31 PM | 72.725 | 168.912 | 37.062 | 76.212 |
| 2016-03-201:35:35 PM | 72.725 | 168.912 | 37.062 | 76.212 |
| 2016-03-201:35:39 PM | 72.725 | 169.025 | 37.175 | 76.212 |
| 2016-03-201:35:43 PM | 72.725 | 169.025 | 37.288 | 76.212 |
| 2016-03-201:35:47 PM | 72.725 | 169.025 | 37.288 | 76.212 |
| 2016-03-201:35:51 PM | 72.725 | 169.025 | 37.512 | 76.212 |
| 2016-03-201:35:56 PM | 72.612 | 169.138 | 37.512 | 76.212 |
| 2016-03-201:36:00 PM | 72.5 | 169.138 | 37.512 | 76.325 |
| 2016-03-201:36:04 PM | 72.275 | 169.138 | 37.512 | 76.325 |
| 2016-03-201:36:08 PM | 72.275 | 169.138 | 37.512 | 76.325 |
| 2016-03-201:36:12 PM | 72.275 | 169.138 | 37.625 | 76.325 |
| 2016-03-201:36:16 PM | 72.275 | 169.138 | 37.738 | 76.325 |
| 2016-03-201:36:20 PM | 72.275 | 169.25 | 37.85 | 76.325 |
| 2016-03-201:36:24 PM | 72.275 | 169.25 | 37.962 | 76.325 |
| 2016-03-201:36:28 PM | 72.275 | 169.138 | 37.962 | 76.325 |
| 2016-03-201:36:32 PM | 72.275 | 169.25 | 37.85 | 76.325 |
| 2016-03-201:36:36 PM | 72.388 | 169.25 | 37.738 | 76.325 |
| 2016-03-201:36:40 PM | 72.388 | 169.25 | 37.625 | 76.325 |
| 2016-03-201:36:44 PM | 72.275 | 169.25 | 37.625 | 76.325 |
| 2016-03-201:36:48 PM | 72.275 | 169.25 | 37.625 | 76.325 |
| 2016-03-201:36:52 PM | 72.275 | 169.25 | 37.512 | 76.325 |
| 2016-03-201:36:56 PM | 72.388 | 169.25 | 37.512 | 76.325 |
| 2016-03-201:37:00 PM | 72.388 | 169.25 | 37.512 | 76.325 |
| 2016-03-201:37:04 PM | 72.388 | 169.25 | 37.4 | 76.438 |
| 2016-03-201:37:08 PM | 72.388 | 169.25 | 37.512 | 76.438 |
| 2016-03-201:37:12 PM | 72.388 | 169.25 | 37.512 | 76.438 |
| 2016-03-201:37:16 PM | 72.5 | 169.25 | 37.738 | 76.438 |
| 2016-03-201:37:20 PM | 72.612 | 169.25 | 37.738 | 76.325 |
| 2016-03-201:37:24 PM | 72.725 | 169.25 | 37.738 | 76.325 |
| 2016-03-201:37:28 PM | 72.612 | 169.25 | 37.85 | 76.325 |
| 2016-03-201:37:32 PM | 72.5 | 169.25 | 37.85 | 76.325 |
| 2016-03-201:37:36 PM | 72.5 | 169.25 | 37.738 | 76.325 |
| 2016-03-201:37:40 PM | 72.388 | 169.362 | 37.85 | 76.325 |
| 2016-03-201:37:44 PM | 72.275 | 169.362 | 37.962 | 76.325 |
| 2016-03-201:37:48 PM | 72.275 | 169.25 | 38.075 | 76.325 |
| 2016-03-201:37:52 PM | 72.275 | 169.362 | 38.075 | 76.325 |
| 2016-03-201:37:56 PM | 72.162 | 169.362 | 38.188 | 76.325 |
| 2016-03-201:38:00 PM | 72.162 | 169.362 | 38.3 | 76.325 |
| 2016-03-201:38:04 PM | 72.162 | 169.362 | 38.3 | 76.325 |
| 2016-03-201:38:09 PM | 72.162 | 169.362 | 38.412 | 76.325 |
| 2016-03-201:38:13 PM | 72.162 | 169.362 | 38.412 | 76.325 |
| 2016-03-201:38:17 PM | 72.162 | 169.25 | 38.525 | 76.325 |
| 2016-03-201:38:21 PM | 72.275 | 169.25 | 38.638 | 76.325 |
| 2016-03-201:38:25 PM | 72.388 | 169.25 | 38.75 | 76.325 |
| 2016-03-201:38:29 PM | 72.388 | 169.25 | 38.75 | 76.325 |
| 2016-03-201:38:33 PM | 72.612 | 169.25 | 38.75 | 76.325 |
| 2016-03-201:38:37 PM | 72.612 | 169.25 | 38.75 | 76.325 |
| 2016-03-201:38:41 PM | 72.725 | 169.25 | 38.862 | 76.325 |
| 2016-03-201:38:45 PM | 72.725 | 169.362 | 38.975 | 76.325 |
| 2016-03-201:38:49 PM | 72.612 | 169.362 | 38.862 | 76.325 |
| 2016-03-201:38:53 PM | 72.612 | 169.362 | 38.975 | 76.325 |
| 2016-03-201:38:57 PM | 72.612 | 169.362 | 38.975 | 76.325 |
| 2016-03-201:39:01 PM | 72.612 | 169.362 | 38.862 | 76.325 |
| 2016-03-201:39:05 PM | 72.612 | 169.362 | 38.75 | 76.325 |
| 2016-03-201:39:09 PM | 72.5 | 169.362 | 38.638 | 76.325 |
| 2016-03-201:39:13 PM | 72.388 | 169.362 | 38.525 | 76.325 |
| 2016-03-201:39:17 PM | 72.388 | 169.362 | 38.638 | 76.325 |
| 2016-03-201:39:21 PM | 72.5 | 169.362 | 38.75 | 76.325 |
| 2016-03-201:39:25 PM | 72.5 | 169.362 | 38.638 | 76.325 |
| 2016-03-201:39:29 PM | 72.388 | 169.475 | 38.525 | 76.325 |
| 2016-03-201:39:33 PM | 72.275 | 169.475 | 38.525 | 76.325 |
| 2016-03-201:39:37 PM | 72.275 | 169.475 | 38.525 | 76.325 |
| 2016-03-201:39:41 PM | 72.275 | 169.475 | 38.525 | 76.325 |
| 2016-03-201:39:45 PM | 72.05 | 169.475 | 38.412 | 76.325 |
| 2016-03-201:39:49 PM | 71.825 | 169.475 | 38.188 | 76.325 |
| 2016-03-201:39:53 PM | 71.825 | 169.475 | 38.188 | 76.325 |
| 2016-03-201:39:57 PM | 71.712 | 169.475 | 38.075 | 76.325 |
| 2016-03-201:40:01 PM | 71.6 | 169.475 | 37.962 | 76.325 |
| 2016-03-201:40:06 PM | 71.488 | 169.588 | 37.962 | 76.325 |
| 2016-03-201:40:10 PM | 71.375 | 169.475 | 37.738 | 76.325 |
| 2016-03-201:40:14 PM | 71.262 | 169.588 | 37.625 | 76.325 |
| 2016-03-201:40:18 PM | 71.15 | 169.588 | 37.625 | 76.325 |
| 2016-03-201:40:22 PM | 71.038 | 169.588 | 37.738 | 76.325 |
| 2016-03-201:40:26 PM | 70.925 | 169.588 | 37.85 | 76.325 |
| 2016-03-201:40:30 PM | 70.812 | 169.588 | 37.962 | 76.325 |
| 2016-03-201:40:34 PM | 70.7 | 169.588 | 38.075 | 76.325 |
| 2016-03-201:40:38 PM | 70.7 | 169.7 | 38.188 | 76.438 |
| 2016-03-201:40:42 PM | 70.812 | 169.7 | 38.3 | 76.438 |
| 2016-03-201:40:46 PM | 70.812 | 169.7 | 37.962 | 76.325 |
| 2016-03-201:40:50 PM | 70.812 | 169.7 | 37.962 | 76.325 |
| 2016-03-201:40:54 PM | 70.7 | 169.7 | 37.962 | 76.325 |
| 2016-03-201:40:58 PM | 70.812 | 169.7 | 37.962 | 76.325 |
| 2016-03-201:41:03 PM | 70.812 | 169.7 | 38.075 | 76.438 |
| 2016-03-201:41:07 PM | 70.925 | 169.7 | 38.075 | 76.438 |
| 2016-03-201:41:11 PM | 71.038 | 169.7 | 38.188 | 76.438 |
| 2016-03-201:41:15 PM | 71.15 | 169.7 | 38.188 | 76.438 |
| 2016-03-201:41:19 PM | 71.375 | 169.7 | 38.188 | 76.438 |
| 2016-03-201:41:23 PM | 71.488 | 169.7 | 38.3 | 76.438 |
| 2016-03-201:41:27 PM | 71.6 | 169.7 | 38.188 | 76.438 |
| 2016-03-201:41:31 PM | 71.825 | 169.7 | 38.188 | 76.438 |
| 2016-03-201:41:35 PM | 71.938 | 169.7 | 37.962 | 76.438 |
| 2016-03-201:41:39 PM | 72.162 | 169.7 | 37.962 | 76.438 |
| 2016-03-201:41:43 PM | 72.05 | 169.7 | 37.738 | 76.438 |
| 2016-03-201:41:47 PM | 72.05 | 169.7 | 37.512 | 76.438 |
| 2016-03-201:41:51 PM | 72.162 | 169.588 | 37.4 | 76.438 |
| 2016-03-201:41:55 PM | 72.275 | 169.7 | 37.288 | 76.438 |
| 2016-03-201:41:59 PM | 72.275 | 169.588 | 37.288 | 76.438 |
| 2016-03-201:42:04 PM | 72.388 | 169.7 | 37.175 | 76.438 |
| 2016-03-201:42:08 PM | 72.275 | 169.588 | 37.062 | 76.438 |
| 2016-03-201:42:12 PM | 72.162 | 169.588 | 37.175 | 76.438 |
| 2016-03-201:42:16 PM | 72.275 | 169.588 | 37.175 | 76.438 |
| 2016-03-201:42:20 PM | 72.162 | 169.588 | 37.288 | 76.438 |
| 2016-03-201:42:24 PM | 72.05 | 169.588 | 37.288 | 76.438 |
| 2016-03-201:42:28 PM | 71.938 | 169.588 | 37.288 | 76.55 |
| 2016-03-201:42:32 PM | 71.825 | 169.588 | 37.4 | 76.55 |
| 2016-03-201:42:36 PM | 71.6 | 169.588 | 37.288 | 76.55 |
| 2016-03-201:42:40 PM | 71.375 | 169.475 | 37.4 | 76.55 |
| 2016-03-201:42:44 PM | 71.15 | 169.475 | 37.288 | 76.55 |
| 2016-03-201:42:48 PM | 70.925 | 169.475 | 37.4 | 76.55 |
| 2016-03-201:42:52 PM | 70.812 | 169.475 | 37.288 | 76.55 |
| 2016-03-201:42:56 PM | 70.812 | 169.362 | 37.4 | 76.55 |
| 2016-03-201:43:00 PM | 70.7 | 169.362 | 37.288 | 76.662 |
| 2016-03-201:43:04 PM | 70.588 | 169.362 | 37.288 | 76.55 |
| 2016-03-201:43:09 PM | 70.588 | 169.362 | 37.288 | 76.55 |
| 2016-03-201:43:13 PM | 70.362 | 169.362 | 37.175 | 76.55 |
| 2016-03-201:43:17 PM | 70.25 | 169.362 | 37.175 | 76.55 |
| 2016-03-201:43:21 PM | 70.138 | 169.25 | 36.95 | 76.55 |
| 2016-03-201:43:25 PM | 69.912 | 169.25 | 36.838 | 76.55 |
| 2016-03-201:43:29 PM | 69.688 | 169.25 | 36.725 | 76.662 |
| 2016-03-201:43:33 PM | 69.462 | 169.25 | 36.725 | 76.662 |
| 2016-03-201:43:37 PM | 69.462 | 169.138 | 36.838 | 76.55 |
| 2016-03-201:43:41 PM | 69.462 | 169.138 | 36.838 | 76.55 |
| 2016-03-201:43:45 PM | 69.462 | 169.138 | 36.838 | 76.662 |
| 2016-03-201:43:49 PM | 69.462 | 169.138 | 36.838 | 76.662 |
| 2016-03-201:43:53 PM | 69.462 | 169.138 | 36.838 | 76.662 |
| 2016-03-201:43:57 PM | 69.575 | 169.138 | 36.95 | 76.662 |
| 2016-03-201:44:01 PM | 69.575 | 169.138 | 37.175 | 76.662 |
| 2016-03-201:44:05 PM | 69.35 | 169.138 | 37.175 | 76.662 |
| 2016-03-201:44:10 PM | 69.35 | 169.138 | 37.062 | 76.662 |
| 2016-03-201:44:14 PM | 69.35 | 169.025 | 36.95 | 76.662 |
| 2016-03-201:44:18 PM | 69.35 | 169.025 | 36.95 | 76.662 |
| 2016-03-201:44:22 PM | 69.35 | 169.025 | 36.838 | 76.662 |
| 2016-03-201:44:26 PM | 69.462 | 169.025 | 36.725 | 76.662 |
| 2016-03-201:44:30 PM | 69.575 | 169.025 | 36.5 | 76.662 |
| 2016-03-201:44:34 PM | 69.575 | 169.025 | 36.275 | 76.662 |
| 2016-03-201:44:38 PM | 69.575 | 169.025 | 36.05 | 76.662 |
| 2016-03-201:44:42 PM | 69.575 | 169.025 | 35.825 | 76.662 |
| 2016-03-201:44:50 PM | 69.462 | 168.912 | 35.6 | 76.662 |
| 2016-03-201:44:54 PM | 69.575 | 168.912 | 35.6 | 76.662 |
| 2016-03-201:44:58 PM | 69.688 | 168.912 | 35.6 | 76.775 |
| 2016-03-201:45:02 PM | 69.8 | 168.912 | 35.488 | 76.775 |
| 2016-03-201:45:06 PM | 69.912 | 168.912 | 35.488 | 76.775 |
| 2016-03-201:45:10 PM | 70.025 | 168.912 | 35.488 | 76.775 |
| 2016-03-201:45:14 PM | 70.025 | 168.912 | 35.488 | 76.775 |
| 2016-03-201:45:18 PM | 69.8 | 168.912 | 35.6 | 76.775 |
| 2016-03-201:45:22 PM | 69.8 | 168.912 | 35.6 | 76.775 |
| 2016-03-201:45:27 PM | 69.8 | 168.912 | 35.6 | 76.775 |
| 2016-03-201:45:31 PM | 69.912 | 168.912 | 35.6 | 76.775 |
| 2016-03-201:45:35 PM | 70.025 | 168.912 | 35.375 | 76.775 |
| 2016-03-201:45:39 PM | 70.138 | 168.912 | 35.262 | 76.775 |
| 2016-03-201:45:43 PM | 70.362 | 168.912 | 35.038 | 76.775 |
| 2016-03-201:45:47 PM | 70.362 | 168.912 | 35.038 | 76.775 |
| 2016-03-201:45:51 PM | 70.475 | 168.912 | 35.038 | 76.775 |
| 2016-03-201:45:55 PM | 70.588 | 168.912 | 35.038 | 76.888 |
| 2016-03-201:45:59 PM | 70.7 | 168.912 | 34.925 | 76.775 |
| 2016-03-201:46:03 PM | 70.925 | 168.912 | 34.812 | 76.888 |
| 2016-03-201:46:07 PM | 71.038 | 168.912 | 34.812 | 76.888 |
| 2016-03-201:46:11 PM | 71.038 | 168.912 | 34.812 | 76.888 |
| 2016-03-201:46:15 PM | 71.262 | 168.912 | 34.925 | 76.888 |
| 2016-03-201:46:19 PM | 71.262 | 168.912 | 35.038 | 76.888 |
| 2016-03-201:46:23 PM | 71.262 | 168.912 | 35.262 | 76.888 |
| 2016-03-201:46:27 PM | 71.15 | 168.912 | 35.375 | 76.888 |
| 2016-03-201:46:32 PM | 71.262 | 168.8 | 35.488 | 76.888 |
| 2016-03-201:46:36 PM | 71.375 | 168.8 | 35.375 | 76.888 |
| 2016-03-201:46:40 PM | 71.375 | 168.8 | 35.262 | 76.888 |
| 2016-03-201:46:44 PM | 71.375 | 168.8 | 35.262 | 76.888 |
| 2016-03-201:46:48 PM | 71.262 | 168.8 | 35.262 | 77 |
| 2016-03-201:46:52 PM | 71.038 | 168.688 | 35.262 | 77 |
| 2016-03-201:46:56 PM | 70.925 | 168.688 | 35.262 | 76.888 |
| 2016-03-201:47:00 PM | 70.7 | 168.575 | 35.375 | 77 |
| 2016-03-201:47:04 PM | 70.588 | 168.575 | 35.488 | 77 |
| 2016-03-201:47:08 PM | 70.588 | 168.575 | 35.488 | 77 |
| 2016-03-201:47:12 PM | 70.475 | 168.575 | 35.488 | 77 |
| 2016-03-201:47:20 PM | 70.475 | 168.462 | 35.825 | 76.888 |
| 2016-03-201:47:24 PM | 70.475 | 168.462 | 35.825 | 77 |
| 2016-03-201:47:28 PM | 70.475 | 168.462 | 35.938 | 77 |
| 2016-03-201:47:32 PM | 70.475 | 168.35 | 35.938 | 77 |
| 2016-03-201:47:37 PM | 70.588 | 168.35 | 36.05 | 77 |
| 2016-03-201:47:41 PM | 70.7 | 168.238 | 35.825 | 77 |
| 2016-03-201:47:45 PM | 70.925 | 168.238 | 35.825 | 77 |
| 2016-03-201:47:49 PM | 71.038 | 168.238 | 35.825 | 77 |
| 2016-03-201:47:53 PM | 71.038 | 168.125 | 35.712 | 77 |
| 2016-03-201:47:57 PM | 71.038 | 168.125 | 35.712 | 77 |
| 2016-03-201:48:01 PM | 71.038 | 168.125 | 35.825 | 77 |
| 2016-03-201:48:05 PM | 71.038 | 168.013 | 35.938 | 77 |
| 2016-03-201:48:09 PM | 71.038 | 168.013 | 36.05 | 77 |
| 2016-03-201:48:13 PM | 71.038 | 168.013 | 36.05 | 77 |
| 2016-03-201:48:17 PM | 71.15 | 167.9 | 36.05 | 77 |
| 2016-03-201:48:21 PM | 71.038 | 167.9 | 35.938 | 77 |
| 2016-03-201:48:25 PM | 71.15 | 167.9 | 35.938 | 77 |
| 2016-03-201:48:29 PM | 71.262 | 167.9 | 35.938 | 77.112 |
| 2016-03-201:48:33 PM | 71.262 | 167.9 | 35.938 | 77.112 |
| 2016-03-201:48:37 PM | 71.262 | 167.9 | 35.938 | 77.112 |
| 2016-03-201:48:41 PM | 71.375 | 167.788 | 35.938 | 77.112 |
| 2016-03-201:48:46 PM | 71.488 | 167.788 | 35.938 | 77.112 |
| 2016-03-201:48:50 PM | 71.488 | 167.788 | 35.938 | 77.112 |
| 2016-03-201:48:54 PM | 71.6 | 167.788 | 35.938 | 77 |
| 2016-03-201:48:58 PM | 71.6 | 167.788 | 35.712 | 77.112 |
| 2016-03-201:49:02 PM | 71.6 | 167.788 | 35.375 | 77.112 |
| 2016-03-201:49:06 PM | 71.6 | 167.788 | 35.15 | 77.112 |
| 2016-03-201:49:10 PM | 71.712 | 167.675 | 35.15 | 77.112 |
| 2016-03-201:49:14 PM | 71.712 | 167.675 | 35.262 | 77.112 |
| 2016-03-201:49:18 PM | 72.05 | 167.675 | 35.15 | 77.112 |
| 2016-03-201:49:22 PM | 72.275 | 167.675 | 35.262 | 77.112 |
| 2016-03-201:49:26 PM | 72.388 | 167.675 | 35.262 | 77.112 |
| 2016-03-201:49:30 PM | 72.612 | 167.675 | 35.15 | 77.112 |
| 2016-03-201:49:34 PM | 72.725 | 167.562 | 35.15 | 77.112 |
| 2016-03-201:49:38 PM | 72.838 | 167.562 | 35.15 | 77.112 |
| 2016-03-201:49:42 PM | 73.062 | 167.675 | 35.15 | 77.112 |
| 2016-03-201:49:46 PM | 73.175 | 167.562 | 35.15 | 77.112 |
| 2016-03-201:49:50 PM | 73.4 | 167.562 | 35.15 | 77.112 |
| 2016-03-201:49:54 PM | 73.4 | 167.562 | 35.15 | 77.112 |
| 2016-03-201:49:58 PM | 73.512 | 167.562 | 35.15 | 77.112 |
| 2016-03-201:50:02 PM | 73.512 | 167.562 | 35.15 | 77.112 |
| 2016-03-201:50:06 PM | 73.512 | 167.562 | 35.15 | 77.225 |
| 2016-03-201:50:10 PM | 73.288 | 167.45 | 35.262 | 77.112 |
| 2016-03-201:50:14 PM | 73.288 | 167.45 | 35.375 | 77.112 |
| 2016-03-201:50:18 PM | 73.288 | 167.45 | 35.488 | 77.112 |
| 2016-03-201:50:22 PM | 73.175 | 167.45 | 35.6 | 77.112 |
| 2016-03-201:50:26 PM | 73.062 | 167.45 | 35.6 | 77.112 |
| 2016-03-201:50:30 PM | 73.062 | 167.338 | 35.712 | 77.112 |
| 2016-03-201:50:34 PM | 72.838 | 167.338 | 35.712 | 77.112 |
| 2016-03-201:50:39 PM | 72.612 | 167.338 | 35.825 | 77.112 |
| 2016-03-201:50:43 PM | 72.388 | 167.225 | 35.825 | 77.112 |
| 2016-03-201:50:47 PM | 72.388 | 167.225 | 35.825 | 77.112 |
| 2016-03-201:50:51 PM | 72.388 | 167.112 | 35.938 | 77.112 |
| 2016-03-201:50:55 PM | 72.388 | 167.112 | 36.05 | 77.112 |
| 2016-03-201:50:59 PM | 72.388 | 167.112 | 36.162 | 77.112 |
| 2016-03-201:51:03 PM | 72.5 | 167.112 | 36.162 | 77.112 |
| 2016-03-201:51:07 PM | 72.612 | 167 | 36.275 | 77.112 |
| 2016-03-201:51:11 PM | 72.725 | 167 | 36.275 | 77.112 |
| 2016-03-201:51:15 PM | 72.838 | 166.888 | 36.388 | 77.225 |
| 2016-03-201:51:19 PM | 72.838 | 166.888 | 36.5 | 77.112 |
| 2016-03-201:51:23 PM | 72.95 | 166.888 | 36.612 | 77.225 |
| 2016-03-201:51:27 PM | 73.062 | 166.888 | 36.612 | 77.225 |
| 2016-03-201:51:31 PM | 73.062 | 166.888 | 36.725 | 77.225 |
| 2016-03-201:51:35 PM | 72.95 | 166.888 | 36.612 | 77.225 |
| 2016-03-201:51:39 PM | 73.062 | 166.888 | 36.5 | 77.225 |
| 2016-03-201:51:43 PM | 73.062 | 166.775 | 36.388 | 77.225 |
| 2016-03-201:51:47 PM | 73.062 | 166.775 | 36.275 | 77.225 |
| 2016-03-201:51:51 PM | 72.95 | 166.775 | 36.275 | 77.225 |
| 2016-03-201:51:55 PM | 72.95 | 166.775 | 36.275 | 77.225 |
| 2016-03-201:51:59 PM | 72.95 | 166.775 | 36.162 | 77.225 |
| 2016-03-201:52:03 PM | 72.95 | 166.775 | 36.162 | 77.225 |
| 2016-03-201:52:07 PM | 72.95 | 166.775 | 36.05 | 77.225 |
| 2016-03-201:52:11 PM | 72.95 | 166.775 | 36.162 | 77.225 |
| 2016-03-201:52:15 PM | 72.838 | 166.662 | 36.162 | 77.225 |
| 2016-03-201:52:19 PM | 72.725 | 166.662 | 36.275 | 77.225 |
| 2016-03-201:52:23 PM | 72.725 | 166.662 | 36.388 | 77.225 |
| 2016-03-201:52:28 PM | 72.725 | 166.662 | 36.388 | 77.225 |
| 2016-03-201:52:32 PM | 72.725 | 166.775 | 36.5 | 77.225 |
| 2016-03-201:52:36 PM | 72.612 | 166.662 | 36.5 | 77.225 |
| 2016-03-201:52:40 PM | 72.725 | 166.775 | 36.5 | 77.225 |
| 2016-03-201:52:44 PM | 72.612 | 166.662 | 36.5 | 77.225 |
| 2016-03-201:52:48 PM | 72.5 | 166.775 | 36.5 | 77.225 |
| 2016-03-201:52:52 PM | 72.5 | 166.662 | 36.5 | 77.225 |
| 2016-03-201:52:56 PM | 72.388 | 166.662 | 36.5 | 77.225 |
| 2016-03-201:53:00 PM | 72.388 | 166.662 | 36.5 | 77.225 |
| 2016-03-201:53:04 PM | 72.275 | 166.662 | 36.612 | 77.225 |
| 2016-03-201:53:08 PM | 72.162 | 166.662 | 36.612 | 77.225 |
| 2016-03-201:53:12 PM | 72.275 | 166.775 | 36.725 | 77.225 |
| 2016-03-201:53:16 PM | 72.275 | 166.775 | 36.725 | 77.225 |
| 2016-03-201:53:20 PM | 72.388 | 166.775 | 36.725 | 77.225 |
| 2016-03-201:53:24 PM | 72.275 | 166.775 | 36.612 | 77.225 |
| 2016-03-201:53:28 PM | 72.162 | 166.775 | 36.388 | 77.225 |
| 2016-03-201:53:32 PM | 72.162 | 166.775 | 36.275 | 77.112 |
| 2016-03-201:53:36 PM | 72.162 | 166.775 | 36.05 | 77.112 |
| 2016-03-201:53:40 PM | 72.05 | 166.888 | 35.825 | 77.225 |
| 2016-03-201:53:44 PM | 72.05 | 166.888 | 35.712 | 77.112 |
| 2016-03-201:53:48 PM | 72.05 | 166.888 | 35.488 | 77.225 |
| 2016-03-201:53:52 PM | 72.05 | 166.888 | 35.262 | 77.112 |
| 2016-03-201:53:57 PM | 72.05 | 166.888 | 35.375 | 77.112 |
| 2016-03-201:54:01 PM | 72.162 | 166.888 | 35.262 | 77.112 |
| 2016-03-201:54:05 PM | 72.162 | 166.888 | 35.262 | 77.112 |
| 2016-03-201:54:09 PM | 72.275 | 166.888 | 35.262 | 77.112 |
| 2016-03-201:54:13 PM | 72.275 | 166.888 | 35.375 | 77.112 |
| 2016-03-201:54:17 PM | 72.388 | 166.775 | 35.375 | 77.112 |
| 2016-03-201:54:21 PM | 72.5 | 166.775 | 35.375 | 77.112 |
| 2016-03-201:54:25 PM | 72.612 | 166.775 | 35.375 | 77.112 |
| 2016-03-201:54:29 PM | 72.725 | 166.775 | 35.375 | 77.112 |
| 2016-03-201:54:33 PM | 72.725 | 166.775 | 35.375 | 77.112 |
| 2016-03-201:54:37 PM | 72.612 | 166.775 | 35.488 | 77.112 |
| 2016-03-201:54:41 PM | 72.5 | 166.662 | 35.712 | 77.112 |
| 2016-03-201:54:45 PM | 72.5 | 166.662 | 35.825 | 77.112 |
| 2016-03-201:54:49 PM | 72.612 | 166.662 | 35.938 | 77.112 |
| 2016-03-201:54:53 PM | 72.725 | 166.662 | 35.938 | 77.112 |
| 2016-03-201:54:57 PM | 72.838 | 166.662 | 36.05 | 77.112 |
| 2016-03-201:55:01 PM | 73.062 | 166.662 | 36.162 | 77.112 |
| 2016-03-201:55:05 PM | 73.062 | 166.662 | 36.162 | 77.112 |
| 2016-03-201:55:09 PM | 73.175 | 166.662 | 36.275 | 77.225 |
| 2016-03-201:55:13 PM | 73.175 | 166.662 | 36.162 | 77.112 |
| 2016-03-201:55:17 PM | 73.175 | 166.662 | 36.275 | 77.112 |
| 2016-03-201:55:21 PM | 73.175 | 166.662 | 36.388 | 77.112 |
| 2016-03-201:55:25 PM | 73.175 | 166.662 | 36.5 | 77.112 |
| 2016-03-201:55:29 PM | 72.95 | 166.662 | 36.612 | 77.112 |
| 2016-03-201:55:34 PM | 72.838 | 166.662 | 36.5 | 77.112 |
| 2016-03-201:55:38 PM | 72.612 | 166.662 | 36.388 | 77.112 |
| 2016-03-201:55:42 PM | 72.612 | 166.662 | 36.5 | 77.112 |
| 2016-03-201:55:46 PM | 72.612 | 166.662 | 36.5 | 77.112 |
| 2016-03-201:55:50 PM | 72.612 | 166.662 | 36.5 | 77.112 |
| 2016-03-201:55:54 PM | 72.5 | 166.662 | 36.612 | 77.112 |
| 2016-03-201:55:58 PM | 72.5 | 166.662 | 36.725 | 77.112 |
| 2016-03-201:56:02 PM | 72.5 | 166.662 | 36.612 | 77.112 |
| 2016-03-201:56:06 PM | 72.5 | 166.662 | 36.612 | 77.112 |
| 2016-03-201:56:10 PM | 72.275 | 166.55 | 36.725 | 77.112 |
| 2016-03-201:56:14 PM | 72.162 | 166.662 | 36.612 | 77.112 |
| 2016-03-201:56:18 PM | 72.162 | 166.662 | 36.725 | 77.112 |
| 2016-03-201:56:22 PM | 72.162 | 166.55 | 36.838 | 77 |
| 2016-03-201:56:26 PM | 72.162 | 166.662 | 36.838 | 77 |
| 2016-03-201:56:30 PM | 72.162 | 166.662 | 36.725 | 77 |
| 2016-03-201:56:34 PM | 72.275 | 166.662 | 36.725 | 77 |
| 2016-03-201:56:38 PM | 72.5 | 166.55 | 36.725 | 77 |
| 2016-03-201:56:42 PM | 72.612 | 166.55 | 36.725 | 76.888 |
| 2016-03-201:56:46 PM | 72.725 | 166.55 | 36.725 | 77 |
| 2016-03-201:56:50 PM | 72.725 | 166.662 | 36.725 | 76.888 |
| 2016-03-201:56:54 PM | 72.612 | 166.55 | 36.725 | 76.888 |
| 2016-03-201:56:58 PM | 72.725 | 166.55 | 36.838 | 76.888 |
| 2016-03-201:57:02 PM | 72.725 | 166.55 | 36.95 | 77 |
| 2016-03-201:57:06 PM | 72.612 | 166.55 | 37.062 | 77 |
| 2016-03-201:57:10 PM | 72.725 | 166.55 | 37.062 | 77 |
| 2016-03-201:57:14 PM | 72.725 | 166.55 | 37.062 | 77 |
| 2016-03-201:57:18 PM | 72.612 | 166.55 | 37.062 | 77 |
| 2016-03-201:57:22 PM | 72.612 | 166.55 | 36.95 | 77 |
| 2016-03-201:57:26 PM | 72.612 | 166.438 | 36.838 | 77 |
| 2016-03-201:57:30 PM | 72.612 | 166.438 | 36.725 | 77 |
| 2016-03-201:57:34 PM | 72.725 | 166.325 | 36.388 | 77 |
| 2016-03-201:57:38 PM | 72.95 | 166.325 | 36.275 | 77 |
| 2016-03-201:57:42 PM | 73.175 | 166.325 | 36.05 | 77 |
| 2016-03-201:57:47 PM | 73.288 | 166.325 | 35.825 | 77 |
| 2016-03-201:57:51 PM | 73.512 | 166.325 | 35.712 | 77 |
| 2016-03-201:57:55 PM | 73.625 | 166.325 | 35.6 | 77.112 |
| 2016-03-201:57:59 PM | 73.738 | 166.325 | 35.488 | 77 |
| 2016-03-201:58:03 PM | 73.85 | 166.325 | 35.375 | 77.112 |
| 2016-03-201:58:07 PM | 73.962 | 166.212 | 35.15 | 77.112 |
| 2016-03-201:58:11 PM | 74.075 | 166.212 | 35.15 | 77 |
| 2016-03-201:58:15 PM | 74.3 | 166.212 | 35.038 | 77.112 |
| 2016-03-201:58:19 PM | 74.3 | 166.212 | 35.15 | 77.112 |
| 2016-03-201:58:23 PM | 74.412 | 166.212 | 35.15 | 77.112 |
| 2016-03-201:58:27 PM | 74.638 | 166.212 | 35.262 | 77.112 |
| 2016-03-201:58:31 PM | 74.75 | 166.212 | 35.262 | 77.112 |
| 2016-03-201:58:35 PM | 74.862 | 166.212 | 35.488 | 77.112 |
| 2016-03-201:58:39 PM | 75.088 | 166.212 | 35.6 | 77.112 |
| 2016-03-201:58:43 PM | 75.2 | 166.212 | 35.6 | 77.112 |
| 2016-03-201:58:47 PM | 75.425 | 166.1 | 35.825 | 77.112 |
| 2016-03-201:58:51 PM | 75.425 | 166.212 | 35.938 | 77.112 |
| 2016-03-201:58:55 PM | 75.538 | 166.1 | 35.938 | 77.112 |
| 2016-03-201:58:59 PM | 75.538 | 166.1 | 36.05 | 77.112 |
| 2016-03-201:59:03 PM | 75.538 | 166.212 | 35.938 | 77.112 |
| 2016-03-201:59:07 PM | 75.538 | 166.1 | 36.162 | 77.112 |
| 2016-03-201:59:11 PM | 75.538 | 166.1 | 36.162 | 77.112 |
| 2016-03-201:59:15 PM | 75.538 | 166.1 | 36.162 | 77.112 |
| 2016-03-201:59:19 PM | 75.538 | 166.1 | 36.275 | 77.112 |
| 2016-03-201:59:23 PM | 75.538 | 166.1 | 36.388 | 77.112 |
| 2016-03-201:59:27 PM | 75.65 | 166.1 | 36.612 | 77.112 |
| 2016-03-201:59:31 PM | 75.875 | 165.988 | 36.612 | 77.112 |
| 2016-03-201:59:35 PM | 75.875 | 165.988 | 36.725 | 77.112 |
| 2016-03-201:59:39 PM | 75.762 | 165.988 | 36.838 | 77.112 |
| 2016-03-201:59:43 PM | 75.65 | 165.875 | 36.95 | 77.112 |
| 2016-03-201:59:47 PM | 75.538 | 165.875 | 36.95 | 77.112 |
| 2016-03-201:59:52 PM | 75.312 | 165.875 | 36.95 | 77.112 |
| 2016-03-201:59:56 PM | 75.312 | 165.875 | 36.838 | 77.112 |
| 2016-03-202:00:00 PM | 75.2 | 165.875 | 36.725 | 77.112 |
| 2016-03-202:00:07 PM | 75.088 | 165.763 | 36.838 | 77.112 |
| 2016-03-202:00:11 PM | 74.975 | 165.763 | 36.725 | 77.112 |
| 2016-03-202:00:15 PM | 74.975 | 165.763 | 36.725 | 77.225 |
| 2016-03-202:00:19 PM | 74.862 | 165.763 | 36.612 | 77.225 |
| 2016-03-202:00:23 PM | 74.862 | 165.763 | 36.612 | 77.225 |
| 2016-03-202:00:27 PM | 74.975 | 165.763 | 36.612 | 77.225 |
| 2016-03-202:00:31 PM | 75.088 | 165.763 | 36.5 | 77.225 |
| 2016-03-202:00:35 PM | 75.088 | 165.763 | 36.5 | 77.225 |
| 2016-03-202:00:39 PM | 75.2 | 165.763 | 36.388 | 77.225 |
| 2016-03-202:00:43 PM | 75.2 | 165.763 | 36.275 | 77.225 |
| 2016-03-202:00:47 PM | 75.2 | 165.763 | 36.388 | 77.225 |
| 2016-03-202:00:51 PM | 75.2 | 165.763 | 36.388 | 77.225 |
| 2016-03-202:00:55 PM | 74.975 | 165.65 | 36.5 | 77.225 |
| 2016-03-202:00:59 PM | 74.638 | 165.763 | 36.725 | 77.338 |
| 2016-03-202:01:03 PM | 74.525 | 165.65 | 36.838 | 77.338 |
| 2016-03-202:01:07 PM | 74.412 | 165.65 | 36.95 | 77.338 |
| 2016-03-202:01:11 PM | 74.188 | 165.65 | 36.95 | 77.338 |
| 2016-03-202:01:16 PM | 74.188 | 165.65 | 37.175 | 77.338 |
| 2016-03-202:01:20 PM | 74.188 | 165.65 | 37.288 | 77.338 |
| 2016-03-202:01:24 PM | 74.075 | 165.65 | 37.4 | 77.338 |
| 2016-03-202:01:28 PM | 73.962 | 165.65 | 37.512 | 77.338 |
| 2016-03-202:01:32 PM | 73.962 | 165.65 | 37.625 | 77.338 |
| 2016-03-202:01:36 PM | 73.85 | 165.65 | 37.625 | 77.338 |
| 2016-03-202:01:40 PM | 73.85 | 165.65 | 37.738 | 77.338 |
| 2016-03-202:01:44 PM | 73.85 | 165.65 | 37.738 | 77.338 |
| 2016-03-202:01:48 PM | 73.85 | 165.65 | 37.738 | 77.45 |
| 2016-03-202:01:52 PM | 73.962 | 165.538 | 37.625 | 77.45 |
| 2016-03-202:01:56 PM | 74.075 | 165.538 | 37.512 | 77.45 |
| 2016-03-202:02:00 PM | 74.188 | 165.538 | 37.512 | 77.45 |
| 2016-03-202:02:04 PM | 74.3 | 165.65 | 37.512 | 77.45 |
| 2016-03-202:02:08 PM | 74.3 | 165.65 | 37.512 | 77.45 |
| 2016-03-202:02:12 PM | 74.412 | 165.65 | 37.512 | 77.45 |
| 2016-03-202:02:16 PM | 74.525 | 165.65 | 37.625 | 77.45 |
| 2016-03-202:02:20 PM | 74.412 | 165.65 | 37.738 | 77.45 |
| 2016-03-202:02:24 PM | 74.525 | 165.538 | 37.738 | 77.45 |
| 2016-03-202:02:28 PM | 74.525 | 165.65 | 37.85 | 77.45 |
| 2016-03-202:02:32 PM | 74.638 | 165.538 | 37.962 | 77.45 |
| 2016-03-202:02:36 PM | 74.862 | 165.538 | 38.075 | 77.45 |
| 2016-03-202:02:40 PM | 74.975 | 165.538 | 38.075 | 77.45 |
| 2016-03-202:02:44 PM | 75.088 | 165.538 | 38.188 | 77.45 |
| 2016-03-202:02:48 PM | 75.312 | 165.538 | 38.075 | 77.45 |
| 2016-03-202:02:52 PM | 75.538 | 165.538 | 37.85 | 77.45 |
| 2016-03-202:02:56 PM | 75.65 | 165.65 | 37.738 | 77.45 |
| 2016-03-202:03:00 PM | 75.65 | 165.538 | 37.625 | 77.45 |
| 2016-03-202:03:04 PM | 75.762 | 165.538 | 37.512 | 77.45 |
| 2016-03-202:03:08 PM | 75.875 | 165.538 | 37.512 | 77.45 |
| 2016-03-202:03:12 PM | 75.875 | 165.538 | 37.512 | 77.45 |
| 2016-03-202:03:16 PM | 75.988 | 165.65 | 37.4 | 77.45 |
| 2016-03-202:03:20 PM | 75.988 | 165.65 | 37.288 | 77.338 |
| 2016-03-202:03:24 PM | 75.988 | 165.65 | 37.4 | 77.45 |
| 2016-03-202:03:28 PM | 76.1 | 165.65 | 37.512 | 77.45 |
| 2016-03-202:03:32 PM | 75.988 | 165.65 | 37.512 | 77.45 |
| 2016-03-202:03:36 PM | 75.65 | 165.65 | 37.625 | 77.45 |
| 2016-03-202:03:40 PM | 75.425 | 165.65 | 37.625 | 77.562 |
| 2016-03-202:03:45 PM | 75.088 | 165.65 | 37.512 | 77.45 |
| 2016-03-202:03:49 PM | 74.862 | 165.763 | 37.625 | 77.45 |
| 2016-03-202:03:53 PM | 74.525 | 165.763 | 37.738 | 77.45 |
| 2016-03-202:03:57 PM | 74.525 | 165.763 | 37.85 | 77.562 |
| 2016-03-202:04:01 PM | 74.3 | 165.763 | 37.738 | 77.562 |
| 2016-03-202:04:05 PM | 74.188 | 165.875 | 37.625 | 77.562 |
| 2016-03-202:04:09 PM | 74.075 | 165.875 | 37.4 | 77.562 |
| 2016-03-202:04:13 PM | 73.962 | 165.875 | 37.288 | 77.562 |
| 2016-03-202:04:17 PM | 73.85 | 165.875 | 37.288 | 77.562 |
| 2016-03-202:04:21 PM | 73.738 | 165.875 | 37.288 | 77.562 |
| 2016-03-202:04:25 PM | 73.738 | 165.988 | 37.4 | 77.562 |
| 2016-03-202:04:29 PM | 73.738 | 165.988 | 37.4 | 77.562 |
| 2016-03-202:04:33 PM | 73.85 | 165.988 | 37.288 | 77.562 |
| 2016-03-202:04:37 PM | 73.738 | 166.1 | 37.062 | 77.562 |
| 2016-03-202:04:41 PM | 73.85 | 166.1 | 36.95 | 77.562 |
| 2016-03-202:04:45 PM | 73.738 | 166.1 | 37.062 | 77.562 |
| 2016-03-202:04:49 PM | 73.625 | 166.1 | 36.95 | 77.562 |
| 2016-03-202:04:53 PM | 73.625 | 166.1 | 36.95 | 77.562 |
| 2016-03-202:04:57 PM | 73.512 | 166.1 | 37.062 | 77.562 |
| 2016-03-202:05:01 PM | 73.288 | 166.1 | 37.175 | 77.675 |
| 2016-03-202:05:05 PM | 73.175 | 166.1 | 37.288 | 77.675 |
| 2016-03-202:05:09 PM | 73.062 | 166.1 | 37.4 | 77.675 |
| 2016-03-202:05:13 PM | 72.95 | 166.212 | 37.4 | 77.675 |
| 2016-03-202:05:17 PM | 72.838 | 166.212 | 37.512 | 77.675 |
| 2016-03-202:05:21 PM | 72.838 | 166.212 | 37.625 | 77.675 |
| 2016-03-202:05:25 PM | 72.838 | 166.212 | 37.738 | 77.675 |
| 2016-03-202:05:29 PM | 72.95 | 166.212 | 37.738 | 77.675 |
| 2016-03-202:05:33 PM | 73.062 | 166.212 | 37.738 | 77.675 |
| 2016-03-202:05:37 PM | 73.062 | 166.212 | 37.738 | 77.675 |
| 2016-03-202:05:41 PM | 73.175 | 166.212 | 37.738 | 77.675 |
| 2016-03-202:05:45 PM | 73.175 | 166.325 | 37.85 | 77.675 |
| 2016-03-202:05:49 PM | 73.175 | 166.212 | 37.738 | 77.675 |
| 2016-03-202:05:53 PM | 72.95 | 166.325 | 37.625 | 77.675 |
| 2016-03-202:05:57 PM | 72.838 | 166.325 | 37.512 | 77.675 |
| 2016-03-202:06:02 PM | 72.725 | 166.325 | 37.288 | 77.675 |
| 2016-03-202:06:06 PM | 72.725 | 166.212 | 37.175 | 77.675 |
| 2016-03-202:06:10 PM | 72.725 | 166.212 | 36.95 | 77.675 |
| 2016-03-202:06:14 PM | 72.838 | 166.212 | 36.838 | 77.675 |
| 2016-03-202:06:18 PM | 72.95 | 166.325 | 36.838 | 77.675 |
| 2016-03-202:06:22 PM | 73.175 | 166.325 | 36.95 | 77.675 |
| 2016-03-202:06:26 PM | 73.4 | 166.325 | 36.95 | 77.562 |
| 2016-03-202:06:30 PM | 73.625 | 166.325 | 36.95 | 77.675 |
| 2016-03-202:06:34 PM | 73.738 | 166.325 | 37.062 | 77.675 |
| 2016-03-202:06:38 PM | 73.85 | 166.325 | 37.175 | 77.675 |
| 2016-03-202:06:42 PM | 73.962 | 166.325 | 37.062 | 77.675 |
| 2016-03-202:06:46 PM | 73.85 | 166.325 | 37.062 | 77.675 |
| 2016-03-202:06:50 PM | 73.738 | 166.325 | 37.062 | 77.675 |
| 2016-03-202:06:54 PM | 73.738 | 166.325 | 36.95 | 77.675 |
| 2016-03-202:06:58 PM | 73.85 | 166.325 | 36.95 | 77.675 |
| 2016-03-202:07:02 PM | 73.85 | 166.325 | 36.838 | 77.675 |
| 2016-03-202:07:06 PM | 73.85 | 166.325 | 36.838 | 77.675 |
| 2016-03-202:07:10 PM | 73.85 | 166.325 | 36.838 | 77.675 |
| 2016-03-202:07:14 PM | 73.85 | 166.325 | 36.95 | 77.675 |
| 2016-03-202:07:18 PM | 73.962 | 166.325 | 36.95 | 77.675 |
| 2016-03-202:07:22 PM | 74.3 | 166.325 | 36.838 | 77.675 |
| 2016-03-202:07:26 PM | 74.412 | 166.325 | 36.725 | 77.675 |
| 2016-03-202:07:30 PM | 74.638 | 166.325 | 36.725 | 77.675 |
| 2016-03-202:07:34 PM | 74.862 | 166.212 | 36.725 | 77.675 |
| 2016-03-202:07:38 PM | 75.088 | 166.325 | 36.838 | 77.675 |
| 2016-03-202:07:42 PM | 75.312 | 166.212 | 36.838 | 77.675 |
| 2016-03-202:07:46 PM | 75.538 | 166.212 | 36.838 | 77.675 |
| 2016-03-202:07:50 PM | 75.762 | 166.212 | 36.95 | 77.675 |
| 2016-03-202:07:54 PM | 75.988 | 166.212 | 36.95 | 77.675 |
| 2016-03-202:07:58 PM | 76.325 | 166.1 | 37.062 | 77.675 |
| 2016-03-202:08:06 PM | 76.55 | 166.1 | 36.95 | 77.675 |
| 2016-03-202:08:10 PM | 76.662 | 166.1 | 37.062 | 77.675 |
| 2016-03-202:08:14 PM | 76.888 | 166.1 | 37.062 | 77.675 |
| 2016-03-202:08:18 PM | 76.888 | 165.988 | 37.062 | 77.675 |
| 2016-03-202:08:22 PM | 77 | 165.988 | 37.062 | 77.675 |
| 2016-03-202:08:26 PM | 77.112 | 165.988 | 37.175 | 77.675 |
| 2016-03-202:08:30 PM | 77.112 | 165.875 | 37.175 | 77.675 |
| 2016-03-202:08:35 PM | 77.338 | 165.875 | 37.288 | 77.675 |
| 2016-03-202:08:39 PM | 77.338 | 165.875 | 37.4 | 77.675 |
| 2016-03-202:08:43 PM | 77.338 | 165.875 | 37.512 | 77.675 |
| 2016-03-202:08:47 PM | 77.338 | 165.875 | 37.625 | 77.675 |
| 2016-03-202:08:51 PM | 77.225 | 165.875 | 37.625 | 77.562 |
| 2016-03-202:08:55 PM | 77.225 | 165.875 | 37.738 | 77.675 |
| 2016-03-202:08:59 PM | 77.112 | 165.875 | 37.738 | 77.675 |
| 2016-03-202:09:03 PM | 77 | 165.763 | 37.625 | 77.675 |
| 2016-03-202:09:07 PM | 77.112 | 165.763 | 37.4 | 77.675 |
| 2016-03-202:09:11 PM | 77.112 | 165.763 | 37.288 | 77.562 |
| 2016-03-202:09:15 PM | 77.112 | 165.763 | 37.288 | 77.562 |
| 2016-03-202:09:19 PM | 77.225 | 165.763 | 37.4 | 77.562 |
| 2016-03-202:09:23 PM | 77.225 | 165.763 | 37.4 | 77.562 |
| 2016-03-202:09:27 PM | 77 | 165.763 | 37.512 | 77.562 |
| 2016-03-202:09:31 PM | 76.888 | 165.65 | 37.625 | 77.562 |
| 2016-03-202:09:35 PM | 76.888 | 165.65 | 37.512 | 77.562 |
| 2016-03-202:09:39 PM | 77 | 165.763 | 37.288 | 77.562 |
| 2016-03-202:09:43 PM | 77 | 165.65 | 37.062 | 77.675 |
| 2016-03-202:09:47 PM | 77 | 165.763 | 36.95 | 77.562 |
| 2016-03-202:09:51 PM | 77 | 165.763 | 36.838 | 77.562 |
| 2016-03-202:09:55 PM | 76.775 | 165.763 | 36.612 | 77.562 |
| 2016-03-202:09:59 PM | 76.55 | 165.65 | 36.5 | 77.562 |
| 2016-03-202:10:03 PM | 76.438 | 165.65 | 36.388 | 77.562 |
| 2016-03-202:10:07 PM | 76.438 | 165.65 | 36.388 | 77.562 |
| 2016-03-202:10:11 PM | 76.212 | 165.65 | 36.388 | 77.562 |
| 2016-03-202:10:15 PM | 76.1 | 165.763 | 36.388 | 77.562 |
| 2016-03-202:10:19 PM | 76.212 | 165.763 | 36.5 | 77.562 |
| 2016-03-202:10:23 PM | 76.212 | 165.763 | 36.612 | 77.562 |
| 2016-03-202:10:27 PM | 76.212 | 165.763 | 36.612 | 77.562 |
| 2016-03-202:10:31 PM | 76.1 | 165.875 | 36.725 | 77.562 |
| 2016-03-202:10:35 PM | 75.988 | 165.763 | 36.838 | 77.675 |
| 2016-03-202:10:39 PM | 75.988 | 165.763 | 36.95 | 77.675 |
| 2016-03-202:10:44 PM | 76.1 | 165.875 | 37.062 | 77.675 |
| 2016-03-202:10:48 PM | 76.1 | 165.875 | 37.062 | 77.562 |
| 2016-03-202:10:52 PM | 75.988 | 165.875 | 37.288 | 77.562 |
| 2016-03-202:10:56 PM | 75.875 | 165.875 | 37.288 | 77.562 |
| 2016-03-202:11:00 PM | 75.875 | 165.875 | 37.4 | 77.562 |
| 2016-03-202:11:04 PM | 75.875 | 165.875 | 37.4 | 77.562 |
| 2016-03-202:11:08 PM | 75.875 | 165.988 | 37.512 | 77.562 |
| 2016-03-202:11:12 PM | 75.875 | 165.988 | 37.625 | 77.562 |
| 2016-03-202:11:16 PM | 75.875 | 165.988 | 37.738 | 77.562 |
| 2016-03-202:11:20 PM | 75.875 | 165.875 | 37.85 | 77.562 |
| 2016-03-202:11:24 PM | 75.875 | 165.988 | 37.85 | 77.562 |
| 2016-03-202:11:31 PM | 75.875 | 165.988 | 37.738 | 77.562 |
| 2016-03-202:11:35 PM | 75.875 | 165.988 | 37.738 | 77.562 |
| 2016-03-202:11:39 PM | 75.988 | 165.988 | 37.85 | 77.562 |
| 2016-03-202:11:43 PM | 76.1 | 165.988 | 37.85 | 77.562 |
| 2016-03-202:11:47 PM | 76.1 | 165.988 | 37.962 | 77.562 |
| 2016-03-202:11:51 PM | 75.988 | 165.988 | 37.962 | 77.562 |
| 2016-03-202:11:55 PM | 75.762 | 165.988 | 37.962 | 77.562 |
| 2016-03-202:11:59 PM | 75.65 | 165.988 | 37.962 | 77.562 |
| 2016-03-202:12:07 PM | 75.538 | 165.988 | 37.962 | 77.562 |
| 2016-03-202:12:11 PM | 75.2 | 166.1 | 37.85 | 77.562 |
| 2016-03-202:12:15 PM | 75.088 | 166.1 | 37.85 | 77.562 |
| 2016-03-202:12:19 PM | 74.862 | 166.1 | 37.85 | 77.562 |
| 2016-03-202:12:23 PM | 74.862 | 166.1 | 37.962 | 77.562 |
| 2016-03-202:12:27 PM | 74.862 | 166.1 | 37.962 | 77.562 |
| 2016-03-202:12:31 PM | 74.75 | 166.1 | 37.85 | 77.562 |
| 2016-03-202:12:35 PM | 74.638 | 166.212 | 37.625 | 77.45 |
| 2016-03-202:12:39 PM | 74.525 | 166.1 | 37.512 | 77.562 |
| 2016-03-202:12:43 PM | 74.412 | 166.212 | 37.512 | 77.562 |
| 2016-03-202:12:47 PM | 74.412 | 166.212 | 37.4 | 77.562 |
| 2016-03-202:12:51 PM | 74.525 | 166.212 | 37.4 | 77.45 |
| 2016-03-202:12:55 PM | 74.525 | 166.212 | 37.4 | 77.45 |
| 2016-03-202:12:59 PM | 74.638 | 166.212 | 37.288 | 77.45 |
| 2016-03-202:13:03 PM | 74.638 | 166.212 | 37.175 | 77.45 |
| 2016-03-202:13:07 PM | 74.75 | 166.212 | 37.288 | 77.45 |
| 2016-03-202:13:11 PM | 74.75 | 166.325 | 37.175 | 77.45 |
| 2016-03-202:13:16 PM | 74.862 | 166.325 | 37.288 | 77.45 |
| 2016-03-202:13:20 PM | 74.862 | 166.325 | 37.288 | 77.45 |
| 2016-03-202:13:24 PM | 74.975 | 166.325 | 37.288 | 77.45 |
| 2016-03-202:13:28 PM | 75.088 | 166.325 | 37.062 | 77.45 |
| 2016-03-202:13:32 PM | 75.2 | 166.325 | 36.95 | 77.45 |
| 2016-03-202:13:36 PM | 75.312 | 166.325 | 36.838 | 77.45 |
| 2016-03-202:13:40 PM | 75.425 | 166.438 | 36.95 | 77.45 |
| 2016-03-202:13:44 PM | 75.538 | 166.438 | 36.95 | 77.45 |
| 2016-03-202:13:48 PM | 75.538 | 166.438 | 37.062 | 77.45 |
| 2016-03-202:13:52 PM | 75.538 | 166.438 | 37.062 | 77.45 |
| 2016-03-202:13:56 PM | 75.65 | 166.438 | 37.175 | 77.45 |
| 2016-03-202:14:00 PM | 75.762 | 166.438 | 37.175 | 77.45 |
| 2016-03-202:14:04 PM | 75.988 | 166.438 | 37.062 | 77.45 |
| 2016-03-202:14:08 PM | 76.212 | 166.438 | 37.062 | 77.45 |
| 2016-03-202:14:12 PM | 76.325 | 166.438 | 37.062 | 77.45 |
| 2016-03-202:14:16 PM | 76.438 | 166.55 | 37.062 | 77.45 |
| 2016-03-202:14:20 PM | 76.662 | 166.438 | 37.062 | 77.338 |
| 2016-03-202:14:24 PM | 76.775 | 166.55 | 37.062 | 77.338 |
| 2016-03-202:14:28 PM | 76.888 | 166.55 | 37.175 | 77.338 |
| 2016-03-202:14:32 PM | 77 | 166.55 | 37.175 | 77.338 |
| 2016-03-202:14:36 PM | 77.112 | 166.55 | 37.175 | 77.338 |
| 2016-03-202:14:40 PM | 77.338 | 166.55 | 37.288 | 77.338 |
| 2016-03-202:14:44 PM | 77.338 | 166.55 | 37.288 | 77.338 |
| 2016-03-202:14:48 PM | 77.45 | 166.55 | 37.512 | 77.338 |
| 2016-03-202:14:52 PM | 77.338 | 166.662 | 37.512 | 77.338 |
| 2016-03-202:14:56 PM | 77.338 | 166.662 | 37.625 | 77.338 |
| 2016-03-202:15:00 PM | 77.338 | 166.662 | 37.625 | 77.338 |
| 2016-03-202:15:04 PM | 77.225 | 166.662 | 37.625 | 77.338 |
| 2016-03-202:15:08 PM | 77.225 | 166.662 | 37.738 | 77.338 |
| 2016-03-202:15:12 PM | 77.112 | 166.55 | 37.738 | 77.338 |
| 2016-03-202:15:16 PM | 77.112 | 166.662 | 37.738 | 77.338 |
| 2016-03-202:15:20 PM | 77.225 | 166.662 | 37.85 | 77.338 |
| 2016-03-202:15:25 PM | 77.225 | 166.662 | 37.85 | 77.338 |
| 2016-03-202:15:29 PM | 77.338 | 166.662 | 37.962 | 77.338 |
| 2016-03-202:15:33 PM | 77.225 | 166.662 | 37.962 | 77.338 |
| 2016-03-202:15:37 PM | 77.225 | 166.662 | 37.962 | 77.338 |
| 2016-03-202:15:41 PM | 77.338 | 166.662 | 38.075 | 77.338 |
| 2016-03-202:15:45 PM | 77.338 | 166.662 | 38.075 | 77.338 |
| 2016-03-202:15:49 PM | 77.225 | 166.662 | 37.962 | 77.338 |
| 2016-03-202:15:53 PM | 77.338 | 166.662 | 38.075 | 77.338 |
| 2016-03-202:15:57 PM | 77.338 | 166.662 | 38.075 | 77.338 |
| 2016-03-202:16:01 PM | 77.338 | 166.662 | 38.075 | 77.338 |
| 2016-03-202:16:05 PM | 77.338 | 166.662 | 37.738 | 77.225 |
| 2016-03-202:16:09 PM | 77.225 | 166.662 | 37.738 | 77.225 |
| 2016-03-202:16:13 PM | 77.225 | 166.55 | 37.512 | 77.225 |
| 2016-03-202:16:17 PM | 77.112 | 166.662 | 37.512 | 77.225 |
| 2016-03-202:16:21 PM | 77 | 166.662 | 37.4 | 77.225 |
| 2016-03-202:16:25 PM | 76.888 | 166.662 | 37.288 | 77.225 |
| 2016-03-202:16:29 PM | 76.888 | 166.662 | 37.288 | 77.225 |
| 2016-03-202:16:33 PM | 76.888 | 166.662 | 37.062 | 77.225 |
| 2016-03-202:16:37 PM | 76.888 | 166.662 | 36.838 | 77.225 |
| 2016-03-202:16:41 PM | 76.775 | 166.662 | 36.725 | 77.112 |
| 2016-03-202:16:45 PM | 76.662 | 166.55 | 36.725 | 77.225 |
| 2016-03-202:16:49 PM | 76.775 | 166.55 | 36.612 | 77.225 |
| 2016-03-202:16:53 PM | 76.888 | 166.55 | 36.5 | 77.225 |
| 2016-03-202:16:57 PM | 77 | 166.662 | 36.388 | 77.225 |
| 2016-03-202:17:01 PM | 77.112 | 166.55 | 36.388 | 77.225 |
| 2016-03-202:17:06 PM | 77.225 | 166.55 | 36.5 | 77.225 |
| 2016-03-202:17:10 PM | 77.225 | 166.55 | 36.612 | 77.225 |
| 2016-03-202:17:14 PM | 77.338 | 166.55 | 36.612 | 77.225 |
| 2016-03-202:17:18 PM | 77.45 | 166.55 | 36.725 | 77.225 |
| 2016-03-202:17:22 PM | 77.45 | 166.55 | 36.725 | 77.225 |
| 2016-03-202:17:26 PM | 77.562 | 166.55 | 36.612 | 77.225 |
| 2016-03-202:17:30 PM | 77.45 | 166.55 | 36.612 | 77.225 |
| 2016-03-202:17:34 PM | 77.338 | 166.55 | 36.725 | 77.338 |
| 2016-03-202:17:38 PM | 77.225 | 166.55 | 36.725 | 77.338 |
| 2016-03-202:17:42 PM | 77.225 | 166.55 | 36.838 | 77.338 |
| 2016-03-202:17:46 PM | 77.225 | 166.55 | 36.95 | 77.338 |
| 2016-03-202:17:50 PM | 77.225 | 166.55 | 37.062 | 77.338 |
| 2016-03-202:17:54 PM | 77.338 | 166.55 | 37.062 | 77.338 |
| 2016-03-202:17:58 PM | 77.338 | 166.55 | 37.175 | 77.338 |
| 2016-03-202:18:02 PM | 77.338 | 166.55 | 37.288 | 77.338 |
| 2016-03-202:18:06 PM | 77.338 | 166.55 | 37.288 | 77.338 |
| 2016-03-202:18:10 PM | 77.225 | 166.55 | 37.175 | 77.338 |
| 2016-03-202:18:14 PM | 77.225 | 166.55 | 37.288 | 77.45 |
| 2016-03-202:18:18 PM | 77.225 | 166.662 | 37.175 | 77.45 |
| 2016-03-202:18:22 PM | 77.112 | 166.662 | 36.95 | 77.45 |
| 2016-03-202:18:26 PM | 77.112 | 166.662 | 36.95 | 77.338 |
| 2016-03-202:18:30 PM | 77.112 | 166.662 | 36.95 | 77.45 |
| 2016-03-202:18:34 PM | 77.112 | 166.662 | 36.95 | 77.45 |
| 2016-03-202:18:38 PM | 77.225 | 166.662 | 37.062 | 77.45 |
| 2016-03-202:18:42 PM | 77.225 | 166.775 | 37.062 | 77.45 |
| 2016-03-202:18:46 PM | 77.225 | 166.775 | 37.062 | 77.45 |
| 2016-03-202:18:50 PM | 77.45 | 166.662 | 37.175 | 77.45 |
| 2016-03-202:18:55 PM | 77.45 | 166.662 | 37.288 | 77.45 |
| 2016-03-202:18:59 PM | 77.562 | 166.775 | 37.4 | 77.45 |
| 2016-03-202:19:03 PM | 77.675 | 166.775 | 37.512 | 77.45 |
| 2016-03-202:19:07 PM | 77.675 | 166.775 | 37.625 | 77.45 |
| 2016-03-202:19:11 PM | 77.788 | 166.662 | 37.85 | 77.45 |
| 2016-03-202:19:15 PM | 77.788 | 166.662 | 38.075 | 77.45 |
| 2016-03-202:19:19 PM | 77.788 | 166.662 | 38.188 | 77.45 |
| 2016-03-202:19:23 PM | 77.675 | 166.662 | 38.188 | 77.45 |
| 2016-03-202:19:27 PM | 77.45 | 166.662 | 38.075 | 77.45 |
| 2016-03-202:19:31 PM | 77.225 | 166.775 | 37.962 | 77.45 |
| 2016-03-202:19:35 PM | 77.112 | 166.775 | 37.738 | 77.45 |
| 2016-03-202:19:39 PM | 77 | 166.775 | 37.738 | 77.45 |
| 2016-03-202:19:43 PM | 76.888 | 166.775 | 37.85 | 77.45 |
| 2016-03-202:19:47 PM | 76.888 | 166.775 | 37.85 | 77.45 |
| 2016-03-202:19:51 PM | 76.55 | 166.775 | 37.962 | 77.338 |
| 2016-03-202:19:55 PM | 76.325 | 166.662 | 37.962 | 77.45 |
| 2016-03-202:19:59 PM | 75.988 | 166.775 | 37.85 | 77.45 |
| 2016-03-202:20:03 PM | 75.538 | 166.775 | 37.85 | 77.45 |
| 2016-03-202:20:07 PM | 75.312 | 166.775 | 37.738 | 77.45 |
| 2016-03-202:20:11 PM | 75.2 | 166.775 | 37.85 | 77.45 |
| 2016-03-202:20:19 PM | 75.2 | 166.775 | 38.075 | 77.45 |
| 2016-03-202:20:23 PM | 75.2 | 166.775 | 38.075 | 77.45 |
| 2016-03-202:20:27 PM | 75.2 | 166.775 | 38.3 | 77.45 |
| 2016-03-202:20:31 PM | 74.975 | 166.775 | 38.412 | 77.45 |
| 2016-03-202:20:35 PM | 74.862 | 166.775 | 38.412 | 77.45 |
| 2016-03-202:20:39 PM | 74.638 | 166.775 | 38.525 | 77.45 |
| 2016-03-202:20:43 PM | 74.525 | 166.775 | 38.75 | 77.562 |
| 2016-03-202:20:47 PM | 74.525 | 166.775 | 38.75 | 77.45 |
| 2016-03-202:20:51 PM | 74.412 | 166.775 | 38.638 | 77.45 |
| 2016-03-202:20:55 PM | 74.412 | 166.775 | 38.638 | 77.45 |
| 2016-03-202:20:59 PM | 74.188 | 166.775 | 38.525 | 77.562 |
| 2016-03-202:21:03 PM | 73.85 | 166.775 | 38.525 | 77.562 |
| 2016-03-202:21:07 PM | 73.625 | 166.775 | 38.638 | 77.45 |
| 2016-03-202:21:12 PM | 73.288 | 166.775 | 38.525 | 77.45 |
| 2016-03-202:21:16 PM | 73.175 | 166.775 | 38.525 | 77.45 |
| 2016-03-202:21:20 PM | 73.175 | 166.775 | 38.525 | 77.45 |
| 2016-03-202:21:24 PM | 72.95 | 166.775 | 38.412 | 77.45 |
| 2016-03-202:21:28 PM | 72.838 | 166.775 | 38.412 | 77.45 |
| 2016-03-202:21:32 PM | 72.725 | 166.775 | 38.412 | 77.562 |
| 2016-03-202:21:36 PM | 72.612 | 166.775 | 38.412 | 77.562 |
| 2016-03-202:21:40 PM | 72.5 | 166.775 | 38.412 | 77.45 |
| 2016-03-202:21:44 PM | 72.275 | 166.775 | 38.525 | 77.45 |
| 2016-03-202:21:48 PM | 72.162 | 166.775 | 38.525 | 77.45 |
| 2016-03-202:21:52 PM | 72.162 | 166.775 | 38.525 | 77.45 |
| 2016-03-202:21:56 PM | 72.162 | 166.775 | 38.638 | 77.45 |
| 2016-03-202:22:00 PM | 72.162 | 166.775 | 38.75 | 77.45 |
| 2016-03-202:22:04 PM | 71.938 | 166.775 | 38.862 | 77.45 |
| 2016-03-202:22:08 PM | 71.938 | 166.775 | 38.975 | 77.45 |
| 2016-03-202:22:12 PM | 71.712 | 166.775 | 39.088 | 77.45 |
| 2016-03-202:22:16 PM | 71.712 | 166.775 | 39.088 | 77.338 |
| 2016-03-202:22:20 PM | 71.712 | 166.775 | 39.088 | 77.338 |
| 2016-03-202:22:24 PM | 71.6 | 166.775 | 39.088 | 77.338 |
| 2016-03-202:22:28 PM | 71.488 | 166.775 | 39.088 | 77.338 |
| 2016-03-202:22:33 PM | 71.375 | 166.775 | 38.975 | 77.338 |
| 2016-03-202:22:37 PM | 71.488 | 166.775 | 39.088 | 77.338 |
| 2016-03-202:22:41 PM | 71.488 | 166.888 | 39.088 | 77.338 |
| 2016-03-202:22:45 PM | 71.488 | 166.888 | 38.975 | 77.338 |
| 2016-03-202:22:49 PM | 71.375 | 166.775 | 38.975 | 77.45 |
| 2016-03-202:22:57 PM | 71.375 | 166.775 | 38.862 | 77.338 |
| 2016-03-202:23:01 PM | 71.375 | 166.775 | 38.638 | 77.338 |
| 2016-03-202:23:05 PM | 71.375 | 166.888 | 38.412 | 77.338 |
| 2016-03-202:23:09 PM | 71.262 | 166.775 | 38.3 | 77.45 |
| 2016-03-202:23:13 PM | 71.262 | 166.888 | 38.188 | 77.45 |
| 2016-03-202:23:17 PM | 71.262 | 166.888 | 38.075 | 77.45 |
| 2016-03-202:23:21 PM | 71.375 | 166.888 | 37.962 | 77.45 |
| 2016-03-202:23:25 PM | 71.488 | 166.888 | 37.738 | 77.45 |
| 2016-03-202:23:29 PM | 71.488 | 166.775 | 37.625 | 77.45 |
| 2016-03-202:23:33 PM | 71.6 | 166.775 | 37.625 | 77.45 |
| 2016-03-202:23:37 PM | 71.6 | 166.888 | 37.512 | 77.45 |
| 2016-03-202:23:42 PM | 71.712 | 166.888 | 37.4 | 77.45 |
| 2016-03-202:23:46 PM | 71.712 | 166.888 | 37.4 | 77.45 |
| 2016-03-202:23:50 PM | 71.712 | 166.888 | 37.512 | 77.45 |
| 2016-03-202:23:54 PM | 71.712 | 166.888 | 37.625 | 77.45 |
| 2016-03-202:23:58 PM | 71.712 | 166.888 | 37.512 | 77.45 |
| 2016-03-202:24:02 PM | 71.825 | 166.888 | 37.4 | 77.45 |
| 2016-03-202:24:06 PM | 71.825 | 166.888 | 37.288 | 77.45 |
| 2016-03-202:24:10 PM | 71.938 | 166.775 | 37.288 | 77.45 |
| 2016-03-202:24:14 PM | 71.938 | 166.775 | 37.288 | 77.45 |
| 2016-03-202:24:18 PM | 72.162 | 166.775 | 37.288 | 77.45 |
| 2016-03-202:24:22 PM | 72.388 | 166.775 | 37.175 | 77.45 |
| 2016-03-202:24:26 PM | 72.5 | 166.775 | 37.288 | 77.45 |
| 2016-03-202:24:30 PM | 72.725 | 166.775 | 37.288 | 77.45 |
| 2016-03-202:24:38 PM | 72.95 | 166.775 | 37.175 | 77.45 |
| 2016-03-202:24:42 PM | 73.062 | 166.775 | 37.062 | 77.45 |
| 2016-03-202:24:46 PM | 73.175 | 166.775 | 37.062 | 77.45 |
| 2016-03-202:24:50 PM | 73.4 | 166.662 | 36.95 | 77.45 |
| 2016-03-202:24:54 PM | 73.625 | 166.662 | 36.95 | 77.45 |
| 2016-03-202:24:58 PM | 73.85 | 166.662 | 36.838 | 77.45 |
| 2016-03-202:25:02 PM | 73.85 | 166.662 | 36.725 | 77.45 |
| 2016-03-202:25:07 PM | 73.85 | 166.55 | 36.838 | 77.45 |
| 2016-03-202:25:11 PM | 73.738 | 166.55 | 36.725 | 77.45 |
| 2016-03-202:25:15 PM | 73.625 | 166.55 | 36.612 | 77.45 |
| 2016-03-202:25:19 PM | 73.4 | 166.55 | 36.612 | 77.45 |
| 2016-03-202:25:23 PM | 73.288 | 166.438 | 36.612 | 77.45 |
| 2016-03-202:25:27 PM | 73.288 | 166.55 | 36.725 | 77.45 |
| 2016-03-202:25:31 PM | 73.4 | 166.438 | 36.838 | 77.45 |
| 2016-03-202:25:35 PM | 73.512 | 166.325 | 36.95 | 77.45 |
| 2016-03-202:25:39 PM | 73.625 | 166.325 | 36.95 | 77.45 |
| 2016-03-202:25:43 PM | 73.738 | 166.212 | 37.062 | 77.45 |
| 2016-03-202:25:47 PM | 73.85 | 166.212 | 37.175 | 77.45 |
| 2016-03-202:25:51 PM | 74.075 | 166.212 | 37.288 | 77.45 |
| 2016-03-202:25:55 PM | 74.188 | 166.1 | 37.4 | 77.45 |
| 2016-03-202:25:59 PM | 74.188 | 166.1 | 37.4 | 77.45 |
| 2016-03-202:26:03 PM | 74.188 | 166.1 | 37.512 | 77.45 |
| 2016-03-202:26:07 PM | 74.188 | 165.988 | 37.625 | 77.45 |
| 2016-03-202:26:12 PM | 74.188 | 165.988 | 37.738 | 77.45 |
| 2016-03-202:26:16 PM | 74.188 | 165.988 | 37.962 | 77.45 |
| 2016-03-202:26:20 PM | 74.188 | 165.875 | 37.962 | 77.45 |
| 2016-03-202:26:24 PM | 74.3 | 165.875 | 37.738 | 77.45 |
| 2016-03-202:26:28 PM | 74.3 | 165.875 | 37.4 | 77.562 |
| 2016-03-202:26:32 PM | 74.412 | 165.763 | 37.288 | 77.562 |
| 2016-03-202:26:36 PM | 74.412 | 165.763 | 37.288 | 77.562 |
| 2016-03-202:26:40 PM | 74.412 | 165.763 | 37.4 | 77.562 |
| 2016-03-202:26:44 PM | 74.412 | 165.65 | 37.512 | 77.675 |
| 2016-03-202:26:48 PM | 74.412 | 165.65 | 37.625 | 77.675 |
| 2016-03-202:26:52 PM | 74.412 | 165.538 | 37.738 | 77.675 |
| 2016-03-202:26:56 PM | 74.412 | 165.538 | 37.738 | 77.675 |
| 2016-03-202:27:00 PM | 74.412 | 165.538 | 37.85 | 77.675 |
| 2016-03-202:27:04 PM | 74.188 | 165.425 | 37.962 | 77.675 |
| 2016-03-202:27:09 PM | 74.075 | 165.425 | 38.075 | 77.675 |
| 2016-03-202:27:13 PM | 73.85 | 165.425 | 38.188 | 77.675 |
| 2016-03-202:27:17 PM | 73.738 | 165.312 | 38.188 | 77.562 |
| 2016-03-202:27:21 PM | 73.738 | 165.312 | 38.3 | 77.675 |
| 2016-03-202:27:25 PM | 73.962 | 165.2 | 38.412 | 77.562 |
| 2016-03-202:27:29 PM | 74.075 | 165.2 | 38.188 | 77.675 |
| 2016-03-202:27:33 PM | 74.188 | 165.2 | 37.962 | 77.675 |
| 2016-03-202:27:37 PM | 74.412 | 165.2 | 37.625 | 77.675 |
| 2016-03-202:27:41 PM | 74.412 | 165.088 | 37.625 | 77.675 |
| 2016-03-202:27:45 PM | 74.525 | 165.088 | 37.512 | 77.675 |
| 2016-03-202:27:49 PM | 74.75 | 165.088 | 37.512 | 77.675 |
| 2016-03-202:27:53 PM | 74.75 | 165.088 | 37.512 | 77.675 |
| 2016-03-202:27:57 PM | 74.75 | 164.975 | 37.512 | 77.562 |
| 2016-03-202:28:01 PM | 74.75 | 164.975 | 37.512 | 77.675 |
| 2016-03-202:28:05 PM | 74.862 | 164.975 | 37.625 | 77.562 |
| 2016-03-202:28:10 PM | 74.862 | 164.975 | 37.738 | 77.562 |
| 2016-03-202:28:14 PM | 74.862 | 164.975 | 37.85 | 77.562 |
| 2016-03-202:28:18 PM | 74.975 | 164.862 | 37.962 | 77.562 |
| 2016-03-202:28:22 PM | 74.975 | 164.862 | 38.075 | 77.562 |
| 2016-03-202:28:26 PM | 74.975 | 164.862 | 38.188 | 77.562 |
| 2016-03-202:28:30 PM | 75.088 | 164.862 | 38.3 | 77.562 |
| 2016-03-202:28:34 PM | 75.088 | 164.862 | 38.412 | 77.562 |
| 2016-03-202:28:38 PM | 75.2 | 164.862 | 38.525 | 77.562 |
| 2016-03-202:28:42 PM | 75.312 | 164.75 | 38.638 | 77.562 |
| 2016-03-202:28:46 PM | 75.312 | 164.75 | 38.75 | 77.562 |
| 2016-03-202:28:50 PM | 75.425 | 164.75 | 38.75 | 77.562 |
| 2016-03-202:28:54 PM | 75.425 | 164.75 | 38.862 | 77.562 |
| 2016-03-202:28:58 PM | 75.312 | 164.75 | 38.975 | 77.562 |
| 2016-03-202:29:02 PM | 75.088 | 164.75 | 39.088 | 77.562 |
| 2016-03-202:29:06 PM | 75.088 | 164.75 | 39.088 | 77.562 |
| 2016-03-202:29:11 PM | 75.088 | 164.75 | 38.975 | 77.45 |
| 2016-03-202:29:15 PM | 75.088 | 164.862 | 38.525 | 77.45 |
| 2016-03-202:29:19 PM | 75.088 | 164.75 | 38.525 | 77.45 |
| 2016-03-202:29:23 PM | 75.2 | 164.75 | 38.525 | 77.45 |
| 2016-03-202:29:27 PM | 75.2 | 164.75 | 38.525 | 77.45 |
| 2016-03-202:29:31 PM | 75.2 | 164.75 | 38.525 | 77.45 |
| 2016-03-202:29:35 PM | 75.2 | 164.75 | 38.525 | 77.45 |
| 2016-03-202:29:39 PM | 75.312 | 164.75 | 38.412 | 77.45 |
| 2016-03-202:29:43 PM | 75.2 | 164.75 | 38.3 | 77.45 |
| 2016-03-202:29:47 PM | 75.2 | 164.75 | 38.412 | 77.45 |
| 2016-03-202:29:51 PM | 75.2 | 164.75 | 38.188 | 77.338 |
| 2016-03-202:29:55 PM | 75.088 | 164.75 | 38.075 | 77.45 |
| 2016-03-202:29:59 PM | 74.975 | 164.75 | 37.962 | 77.45 |
| 2016-03-202:30:04 PM | 74.75 | 164.75 | 37.85 | 77.45 |
| 2016-03-202:30:08 PM | 74.862 | 164.75 | 37.85 | 77.338 |
| 2016-03-202:30:12 PM | 74.975 | 164.75 | 37.85 | 77.338 |
| 2016-03-202:30:16 PM | 74.975 | 164.75 | 37.85 | 77.338 |
| 2016-03-202:30:20 PM | 75.088 | 164.75 | 37.962 | 77.338 |
| 2016-03-202:30:24 PM | 75.088 | 164.75 | 38.075 | 77.338 |
| 2016-03-202:30:28 PM | 75.088 | 164.75 | 38.188 | 77.338 |
| 2016-03-202:30:32 PM | 74.975 | 164.75 | 38.075 | 77.338 |
| 2016-03-202:30:36 PM | 75.088 | 164.75 | 37.962 | 77.338 |
| 2016-03-202:30:40 PM | 74.975 | 164.862 | 37.85 | 77.338 |
| 2016-03-202:30:44 PM | 74.975 | 164.75 | 37.738 | 77.338 |
| 2016-03-202:30:48 PM | 74.862 | 164.75 | 37.625 | 77.338 |
| 2016-03-202:30:52 PM | 74.75 | 164.862 | 37.625 | 77.338 |
| 2016-03-202:30:56 PM | 74.638 | 164.862 | 37.512 | 77.338 |
| 2016-03-202:31:00 PM | 74.638 | 164.862 | 37.625 | 77.338 |
| 2016-03-202:31:05 PM | 74.75 | 164.862 | 37.625 | 77.338 |
| 2016-03-202:31:09 PM | 74.975 | 164.862 | 37.625 | 77.338 |
| 2016-03-202:31:13 PM | 74.975 | 164.862 | 37.625 | 77.225 |
| 2016-03-202:31:17 PM | 75.088 | 164.862 | 37.738 | 77.225 |
| 2016-03-202:31:21 PM | 75.2 | 164.862 | 37.625 | 77.225 |
| 2016-03-202:31:25 PM | 75.088 | 164.862 | 37.512 | 77.225 |
| 2016-03-202:31:29 PM | 74.975 | 164.862 | 37.4 | 77.225 |
| 2016-03-202:31:33 PM | 74.75 | 164.862 | 37.4 | 77.225 |
| 2016-03-202:31:37 PM | 74.412 | 164.862 | 37.512 | 77.225 |
| 2016-03-202:31:41 PM | 74.188 | 164.862 | 37.4 | 77.225 |
| 2016-03-202:31:45 PM | 74.075 | 164.862 | 37.4 | 77.225 |
| 2016-03-202:31:49 PM | 73.962 | 164.862 | 37.4 | 77.225 |
| 2016-03-202:31:53 PM | 73.962 | 164.862 | 37.625 | 77.225 |
| 2016-03-202:31:57 PM | 73.962 | 164.862 | 37.625 | 77.225 |
| 2016-03-202:32:01 PM | 73.85 | 164.862 | 37.512 | 77.225 |
| 2016-03-202:32:06 PM | 73.962 | 164.862 | 37.288 | 77.225 |
| 2016-03-202:32:10 PM | 73.962 | 164.862 | 37.175 | 77.225 |
| 2016-03-202:32:14 PM | 74.075 | 164.862 | 37.062 | 77.338 |
| 2016-03-202:32:18 PM | 74.188 | 164.862 | 37.175 | 77.225 |
| 2016-03-202:32:22 PM | 74.3 | 164.75 | 37.175 | 77.225 |
| 2016-03-202:32:26 PM | 74.3 | 164.75 | 37.288 | 77.225 |
| 2016-03-202:32:30 PM | 74.3 | 164.75 | 37.4 | 77.225 |
| 2016-03-202:32:34 PM | 74.3 | 164.75 | 37.512 | 77.225 |
| 2016-03-202:32:38 PM | 74.3 | 164.75 | 37.512 | 77.225 |
| 2016-03-202:32:42 PM | 74.3 | 164.75 | 37.4 | 77.225 |
| 2016-03-202:32:46 PM | 74.412 | 164.75 | 37.4 | 77.225 |
| 2016-03-202:32:50 PM | 74.525 | 164.75 | 37.512 | 77.225 |
| 2016-03-202:32:54 PM | 74.638 | 164.75 | 37.512 | 77.225 |
| 2016-03-202:32:58 PM | 74.75 | 164.75 | 37.625 | 77.225 |
| 2016-03-202:33:02 PM | 74.75 | 164.75 | 37.4 | 77.225 |
| 2016-03-202:33:06 PM | 74.75 | 164.75 | 37.4 | 77.225 |
| 2016-03-202:33:11 PM | 74.525 | 164.75 | 37.512 | 77.225 |
| 2016-03-202:33:15 PM | 74.3 | 164.75 | 37.512 | 77.225 |
| 2016-03-202:33:19 PM | 74.075 | 164.75 | 37.625 | 77.225 |
| 2016-03-202:33:23 PM | 73.962 | 164.638 | 37.625 | 77.225 |
| 2016-03-202:33:27 PM | 73.962 | 164.75 | 37.738 | 77.225 |
| 2016-03-202:33:31 PM | 73.85 | 164.75 | 37.85 | 77.225 |
| 2016-03-202:33:35 PM | 73.962 | 164.75 | 37.85 | 77.225 |
| 2016-03-202:33:39 PM | 73.962 | 164.75 | 37.962 | 77.225 |
| 2016-03-202:33:43 PM | 74.075 | 164.75 | 38.075 | 77.338 |
| 2016-03-202:33:47 PM | 74.075 | 164.75 | 38.188 | 77.338 |
| 2016-03-202:33:51 PM | 74.188 | 164.75 | 38.188 | 77.338 |
| 2016-03-202:33:55 PM | 74.3 | 164.75 | 38.188 | 77.338 |
| 2016-03-202:33:59 PM | 74.412 | 164.75 | 38.075 | 77.338 |
| 2016-03-202:34:03 PM | 74.525 | 164.75 | 37.962 | 77.338 |
| 2016-03-202:34:07 PM | 74.638 | 164.75 | 37.85 | 77.45 |
| 2016-03-202:34:11 PM | 74.638 | 164.75 | 37.85 | 77.45 |
| 2016-03-202:34:15 PM | 74.75 | 164.75 | 37.85 | 77.45 |
| 2016-03-202:34:19 PM | 74.75 | 164.75 | 37.962 | 77.45 |
| 2016-03-202:34:23 PM | 74.862 | 164.75 | 37.962 | 77.45 |
| 2016-03-202:34:28 PM | 74.862 | 164.75 | 37.962 | 77.45 |
| 2016-03-202:34:32 PM | 74.75 | 164.75 | 38.075 | 77.45 |
| 2016-03-202:34:36 PM | 74.638 | 164.75 | 38.188 | 77.45 |
| 2016-03-202:34:40 PM | 74.638 | 164.75 | 38.188 | 77.45 |
| 2016-03-202:34:44 PM | 74.75 | 164.75 | 38.3 | 77.45 |
| 2016-03-202:34:48 PM | 74.75 | 164.75 | 38.412 | 77.45 |
| 2016-03-202:34:52 PM | 74.75 | 164.75 | 38.525 | 77.45 |
| 2016-03-202:34:56 PM | 74.75 | 164.75 | 38.638 | 77.45 |
| 2016-03-202:35:00 PM | 74.638 | 164.75 | 38.638 | 77.45 |
| 2016-03-202:35:04 PM | 74.525 | 164.75 | 38.638 | 77.45 |
| 2016-03-202:35:08 PM | 74.412 | 164.75 | 38.75 | 77.45 |
| 2016-03-202:35:12 PM | 74.412 | 164.75 | 38.638 | 77.45 |
| 2016-03-202:35:16 PM | 74.412 | 164.75 | 38.75 | 77.45 |
| 2016-03-202:35:20 PM | 74.412 | 164.75 | 38.75 | 77.338 |
| 2016-03-202:35:24 PM | 74.525 | 164.75 | 38.638 | 77.338 |
| 2016-03-202:35:28 PM | 74.525 | 164.75 | 38.525 | 77.338 |
| 2016-03-202:35:32 PM | 74.525 | 164.75 | 38.525 | 77.338 |
| 2016-03-202:35:36 PM | 74.525 | 164.75 | 38.525 | 77.338 |
| 2016-03-202:35:41 PM | 74.638 | 164.75 | 38.525 | 77.338 |
| 2016-03-202:35:45 PM | 74.862 | 164.75 | 38.412 | 77.225 |
| 2016-03-202:35:49 PM | 74.75 | 164.638 | 38.525 | 77.225 |
| 2016-03-202:35:53 PM | 74.638 | 164.638 | 38.525 | 77.338 |
| 2016-03-202:35:57 PM | 74.638 | 164.638 | 38.525 | 77.225 |
| 2016-03-202:36:01 PM | 74.75 | 164.638 | 38.525 | 77.338 |
| 2016-03-202:36:05 PM | 74.75 | 164.525 | 38.525 | 77.225 |
| 2016-03-202:36:09 PM | 74.862 | 164.638 | 38.525 | 77.225 |
| 2016-03-202:36:13 PM | 74.75 | 164.525 | 38.412 | 77.225 |
| 2016-03-202:36:17 PM | 74.75 | 164.525 | 38.412 | 77.225 |
| 2016-03-202:36:21 PM | 74.862 | 164.525 | 38.3 | 77.225 |
| 2016-03-202:36:25 PM | 74.862 | 164.412 | 38.188 | 77.225 |
| 2016-03-202:36:29 PM | 74.862 | 164.412 | 38.188 | 77.225 |
| 2016-03-202:36:33 PM | 74.975 | 164.412 | 38.188 | 77.225 |
| 2016-03-202:36:37 PM | 75.2 | 164.3 | 38.075 | 77.225 |
| 2016-03-202:36:41 PM | 75.312 | 164.412 | 38.075 | 77.225 |
| 2016-03-202:36:45 PM | 75.312 | 164.3 | 37.85 | 77.225 |
| 2016-03-202:36:49 PM | 75.425 | 164.3 | 37.625 | 77.338 |
| 2016-03-202:36:53 PM | 75.538 | 164.3 | 37.512 | 77.338 |
| 2016-03-202:36:57 PM | 75.538 | 164.3 | 37.4 | 77.225 |
| 2016-03-202:37:02 PM | 75.65 | 164.3 | 37.512 | 77.225 |
| 2016-03-202:37:06 PM | 75.65 | 164.188 | 37.288 | 77.225 |
| 2016-03-202:37:10 PM | 75.65 | 164.188 | 37.4 | 77.225 |
| 2016-03-202:37:14 PM | 75.65 | 164.188 | 37.288 | 77.225 |
| 2016-03-202:37:18 PM | 75.65 | 164.188 | 37.4 | 77.338 |
| 2016-03-202:37:22 PM | 75.65 | 164.188 | 37.512 | 77.225 |
| 2016-03-202:37:26 PM | 75.65 | 164.075 | 37.625 | 77.225 |
| 2016-03-202:37:30 PM | 75.762 | 164.075 | 37.625 | 77.225 |
| 2016-03-202:37:34 PM | 75.762 | 164.075 | 37.738 | 77.225 |
| 2016-03-202:37:38 PM | 75.988 | 163.962 | 37.738 | 77.225 |
| 2016-03-202:37:42 PM | 75.988 | 163.962 | 37.85 | 77.338 |
| 2016-03-202:37:46 PM | 76.1 | 163.85 | 37.85 | 77.338 |
| 2016-03-202:37:50 PM | 76.212 | 163.85 | 38.075 | 77.338 |
| 2016-03-202:37:54 PM | 76.1 | 163.85 | 38.188 | 77.338 |
| 2016-03-202:37:58 PM | 76.1 | 163.85 | 38.3 | 77.338 |
| 2016-03-202:38:02 PM | 76.1 | 163.738 | 38.412 | 77.338 |
| 2016-03-202:38:06 PM | 76.212 | 163.738 | 38.525 | 77.338 |
| 2016-03-202:38:10 PM | 76.212 | 163.738 | 38.638 | 77.338 |
| 2016-03-202:38:14 PM | 76.325 | 163.625 | 38.638 | 77.338 |
| 2016-03-202:38:18 PM | 76.212 | 163.625 | 38.862 | 77.338 |
| 2016-03-202:38:23 PM | 76.212 | 163.625 | 38.862 | 77.338 |
| 2016-03-202:38:27 PM | 76.1 | 163.625 | 38.975 | 77.338 |
| 2016-03-202:38:31 PM | 75.988 | 163.513 | 38.975 | 77.338 |
| 2016-03-202:38:35 PM | 75.875 | 163.513 | 38.975 | 77.45 |
| 2016-03-202:38:39 PM | 75.875 | 163.513 | 39.088 | 77.338 |
| 2016-03-202:38:43 PM | 75.875 | 163.513 | 39.088 | 77.45 |
| 2016-03-202:38:47 PM | 75.875 | 163.513 | 39.2 | 77.45 |
| 2016-03-202:38:51 PM | 75.762 | 163.513 | 39.312 | 77.45 |
| 2016-03-202:38:55 PM | 75.65 | 163.4 | 39.425 | 77.45 |
| 2016-03-202:38:59 PM | 75.425 | 163.4 | 39.538 | 77.45 |
| 2016-03-202:39:03 PM | 75.2 | 163.4 | 39.538 | 77.45 |
| 2016-03-202:39:07 PM | 75.2 | 163.288 | 39.538 | 77.45 |
| 2016-03-202:39:11 PM | 75.312 | 163.288 | 39.425 | 77.45 |
| 2016-03-202:39:15 PM | 75.088 | 163.288 | 39.425 | 77.45 |
| 2016-03-202:39:19 PM | 75.088 | 163.175 | 39.538 | 77.45 |
| 2016-03-202:39:23 PM | 75.088 | 163.175 | 39.538 | 77.45 |
| 2016-03-202:39:27 PM | 74.975 | 163.175 | 39.65 | 77.45 |
| 2016-03-202:39:31 PM | 74.975 | 163.062 | 39.65 | 77.45 |
| 2016-03-202:39:35 PM | 75.088 | 163.062 | 39.65 | 77.45 |
| 2016-03-202:39:40 PM | 75.088 | 163.062 | 39.65 | 77.45 |
| 2016-03-202:39:44 PM | 75.088 | 163.062 | 39.65 | 77.45 |
| 2016-03-202:39:48 PM | 75.2 | 162.95 | 39.762 | 77.45 |
| 2016-03-202:39:52 PM | 75.425 | 162.95 | 39.762 | 77.45 |
| 2016-03-202:39:56 PM | 75.538 | 162.838 | 39.762 | 77.338 |
| 2016-03-202:40:00 PM | 75.65 | 162.838 | 39.65 | 77.45 |
| 2016-03-202:40:04 PM | 75.762 | 162.838 | 39.65 | 77.338 |
| 2016-03-202:40:08 PM | 75.875 | 162.838 | 39.65 | 77.338 |
| 2016-03-202:40:12 PM | 75.988 | 162.838 | 39.65 | 77.338 |
| 2016-03-202:40:20 PM | 76.1 | 162.838 | 39.538 | 77.338 |
| 2016-03-202:40:24 PM | 76.325 | 162.838 | 39.538 | 77.338 |
| 2016-03-202:40:28 PM | 76.55 | 162.725 | 39.425 | 77.338 |
| 2016-03-202:40:32 PM | 76.662 | 162.725 | 39.538 | 77.338 |
| 2016-03-202:40:36 PM | 76.888 | 162.725 | 39.538 | 77.338 |
| 2016-03-202:40:40 PM | 77 | 162.838 | 39.538 | 77.225 |
| 2016-03-202:40:44 PM | 77.112 | 162.725 | 39.538 | 77.225 |
| 2016-03-202:40:48 PM | 77.338 | 162.725 | 39.538 | 77.225 |
| 2016-03-202:40:52 PM | 77.45 | 162.725 | 39.65 | 77.225 |
| 2016-03-202:40:57 PM | 77.562 | 162.838 | 39.762 | 77.225 |
| 2016-03-202:41:01 PM | 77.788 | 162.725 | 39.762 | 77.225 |
| 2016-03-202:41:05 PM | 77.9 | 162.725 | 39.538 | 77.225 |
| 2016-03-202:41:09 PM | 77.9 | 162.725 | 39.425 | 77.338 |
| 2016-03-202:41:13 PM | 77.788 | 162.725 | 39.425 | 77.338 |
| 2016-03-202:41:17 PM | 77.562 | 162.725 | 39.538 | 77.338 |
| 2016-03-202:41:21 PM | 77.338 | 162.725 | 39.538 | 77.338 |
| 2016-03-202:41:25 PM | 77.338 | 162.725 | 39.538 | 77.338 |
| 2016-03-202:41:29 PM | 77.338 | 162.725 | 39.425 | 77.338 |
| 2016-03-202:41:33 PM | 77.338 | 162.838 | 39.312 | 77.338 |
| 2016-03-202:41:37 PM | 77.45 | 162.838 | 39.425 | 77.338 |
| 2016-03-202:41:41 PM | 77.45 | 162.838 | 39.312 | 77.338 |
| 2016-03-202:41:45 PM | 77.338 | 162.725 | 39.425 | 77.338 |
| 2016-03-202:41:49 PM | 77.112 | 162.725 | 39.425 | 77.338 |
| 2016-03-202:41:53 PM | 77.112 | 162.725 | 39.312 | 77.338 |
| 2016-03-202:41:57 PM | 76.888 | 162.725 | 39.312 | 77.338 |
| 2016-03-202:42:01 PM | 76.55 | 162.725 | 39.312 | 77.338 |
| 2016-03-202:42:05 PM | 76.212 | 162.725 | 39.2 | 77.225 |
| 2016-03-202:42:09 PM | 75.875 | 162.725 | 39.088 | 77.225 |
| 2016-03-202:42:13 PM | 75.425 | 162.725 | 39.088 | 77.225 |
| 2016-03-202:42:22 PM | 75.2 | 162.725 | 38.975 | 77.225 |
| 2016-03-202:42:26 PM | 74.975 | 162.725 | 38.975 | 77.225 |
| 2016-03-202:42:30 PM | 74.862 | 162.725 | 38.862 | 77.225 |
| 2016-03-202:42:34 PM | 74.638 | 162.725 | 38.862 | 77.225 |
| 2016-03-202:42:38 PM | 74.638 | 162.612 | 38.75 | 77.225 |
| 2016-03-202:42:42 PM | 74.75 | 162.725 | 38.638 | 77.225 |
| 2016-03-202:42:46 PM | 74.75 | 162.612 | 38.75 | 77.225 |
| 2016-03-202:42:50 PM | 74.862 | 162.612 | 38.75 | 77.225 |
| 2016-03-202:42:54 PM | 74.975 | 162.612 | 38.862 | 77.338 |
| 2016-03-202:42:58 PM | 75.088 | 162.612 | 38.975 | 77.338 |
| 2016-03-202:43:02 PM | 75.088 | 162.612 | 38.975 | 77.338 |
| 2016-03-202:43:06 PM | 75.312 | 162.5 | 39.088 | 77.338 |
| 2016-03-202:43:10 PM | 75.312 | 162.612 | 39.088 | 77.338 |
| 2016-03-202:43:14 PM | 75.425 | 162.5 | 39.088 | 77.338 |
| 2016-03-202:43:18 PM | 75.538 | 162.5 | 39.2 | 77.45 |
| 2016-03-202:43:22 PM | 75.65 | 162.5 | 39.2 | 77.45 |
| 2016-03-202:43:26 PM | 75.538 | 162.5 | 39.312 | 77.45 |
| 2016-03-202:43:31 PM | 75.65 | 162.5 | 39.312 | 77.45 |
| 2016-03-202:43:35 PM | 75.875 | 162.5 | 39.425 | 77.45 |
| 2016-03-202:43:39 PM | 75.988 | 162.5 | 39.538 | 77.45 |
| 2016-03-202:43:43 PM | 75.988 | 162.5 | 39.65 | 77.45 |
| 2016-03-202:43:47 PM | 76.1 | 162.388 | 39.762 | 77.45 |
| 2016-03-202:43:51 PM | 76.1 | 162.388 | 39.762 | 77.45 |
| 2016-03-202:43:55 PM | 75.988 | 162.388 | 39.762 | 77.45 |
| 2016-03-202:43:59 PM | 75.875 | 162.388 | 39.762 | 77.45 |
| 2016-03-202:44:03 PM | 75.762 | 162.388 | 39.762 | 77.45 |
| 2016-03-202:44:07 PM | 75.65 | 162.388 | 39.762 | 77.45 |
| 2016-03-202:44:11 PM | 75.312 | 162.388 | 39.538 | 77.45 |
| 2016-03-202:44:15 PM | 75.2 | 162.5 | 39.425 | 77.45 |
| 2016-03-202:44:19 PM | 75.088 | 162.388 | 39.425 | 77.45 |
| 2016-03-202:44:27 PM | 74.975 | 162.5 | 39.425 | 77.45 |
| 2016-03-202:44:31 PM | 74.975 | 162.5 | 39.312 | 77.45 |
| 2016-03-202:44:39 PM | 74.75 | 162.5 | 39.538 | 77.45 |
| 2016-03-202:44:43 PM | 74.75 | 162.5 | 39.538 | 77.338 |
| 2016-03-202:44:47 PM | 74.638 | 162.5 | 39.425 | 77.338 |
| 2016-03-202:44:52 PM | 74.638 | 162.5 | 39.312 | 77.45 |
| 2016-03-202:44:56 PM | 74.525 | 162.5 | 39.2 | 77.338 |
| 2016-03-202:45:00 PM | 74.525 | 162.612 | 39.2 | 77.338 |
| 2016-03-202:45:04 PM | 74.638 | 162.5 | 39.088 | 77.338 |
| 2016-03-202:45:08 PM | 74.525 | 162.5 | 38.975 | 77.338 |
| 2016-03-202:45:12 PM | 74.525 | 162.612 | 38.975 | 77.338 |
| 2016-03-202:45:16 PM | 74.412 | 162.612 | 38.862 | 77.338 |
| 2016-03-202:45:20 PM | 74.412 | 162.612 | 38.75 | 77.338 |
| 2016-03-202:45:24 PM | 74.188 | 162.5 | 38.525 | 77.338 |
| 2016-03-202:45:28 PM | 74.188 | 162.5 | 38.525 | 77.338 |
| 2016-03-202:45:32 PM | 74.075 | 162.612 | 38.525 | 77.338 |
| 2016-03-202:45:36 PM | 73.962 | 162.612 | 38.525 | 77.338 |
| 2016-03-202:45:40 PM | 73.962 | 162.5 | 38.525 | 77.338 |
| 2016-03-202:45:44 PM | 73.85 | 162.5 | 38.525 | 77.338 |
| 2016-03-202:45:48 PM | 73.85 | 162.612 | 38.638 | 77.225 |
| 2016-03-202:45:52 PM | 73.738 | 162.612 | 38.638 | 77.225 |
| 2016-03-202:45:56 PM | 73.625 | 162.612 | 38.638 | 77.225 |
| 2016-03-202:46:00 PM | 73.512 | 162.612 | 38.75 | 77.225 |
| 2016-03-202:46:04 PM | 73.512 | 162.612 | 38.862 | 77.225 |
| 2016-03-202:46:08 PM | 73.512 | 162.612 | 38.862 | 77.225 |
| 2016-03-202:46:12 PM | 73.625 | 162.5 | 38.862 | 77.225 |
| 2016-03-202:46:17 PM | 73.738 | 162.5 | 38.975 | 77.338 |
| 2016-03-202:46:21 PM | 73.738 | 162.5 | 38.975 | 77.338 |
| 2016-03-202:46:25 PM | 73.738 | 162.388 | 38.975 | 77.338 |
| 2016-03-202:46:29 PM | 73.625 | 162.388 | 38.862 | 77.338 |
| 2016-03-202:46:33 PM | 73.625 | 162.388 | 38.525 | 77.338 |
| 2016-03-202:46:37 PM | 73.512 | 162.388 | 38.525 | 77.338 |
| 2016-03-202:46:41 PM | 73.4 | 162.388 | 38.525 | 77.338 |
| 2016-03-202:46:45 PM | 73.288 | 162.275 | 38.412 | 77.338 |
| 2016-03-202:46:49 PM | 73.288 | 162.275 | 38.3 | 77.45 |
| 2016-03-202:46:53 PM | 73.288 | 162.275 | 38.3 | 77.338 |
| 2016-03-202:46:57 PM | 73.288 | 162.275 | 38.3 | 77.338 |
| 2016-03-202:47:01 PM | 73.175 | 162.275 | 38.3 | 77.338 |
| 2016-03-202:47:05 PM | 73.062 | 162.162 | 38.188 | 77.338 |
| 2016-03-202:47:09 PM | 73.062 | 162.162 | 38.188 | 77.338 |
| 2016-03-202:47:13 PM | 73.062 | 162.162 | 38.188 | 77.338 |
| 2016-03-202:47:17 PM | 72.95 | 162.162 | 38.3 | 77.338 |
| 2016-03-202:47:21 PM | 73.062 | 162.162 | 38.412 | 77.338 |
| 2016-03-202:47:25 PM | 72.95 | 162.05 | 38.412 | 77.338 |
| 2016-03-202:47:29 PM | 72.838 | 162.05 | 38.412 | 77.338 |
| 2016-03-202:47:33 PM | 72.838 | 162.05 | 38.188 | 77.45 |
| 2016-03-202:47:38 PM | 72.725 | 162.05 | 38.075 | 77.45 |
| 2016-03-202:47:42 PM | 72.612 | 162.05 | 37.85 | 77.45 |
| 2016-03-202:47:46 PM | 72.725 | 162.05 | 37.738 | 77.45 |
| 2016-03-202:47:50 PM | 72.838 | 161.938 | 37.85 | 77.45 |
| 2016-03-202:47:54 PM | 72.838 | 162.05 | 37.85 | 77.45 |
| 2016-03-202:47:58 PM | 72.838 | 161.938 | 37.962 | 77.45 |
| 2016-03-202:48:02 PM | 72.725 | 161.938 | 37.962 | 77.45 |
| 2016-03-202:48:06 PM | 72.612 | 161.938 | 37.85 | 77.45 |
| 2016-03-202:48:10 PM | 72.5 | 161.938 | 37.738 | 77.45 |
| 2016-03-202:48:14 PM | 72.388 | 161.938 | 37.625 | 77.45 |
| 2016-03-202:48:18 PM | 72.388 | 161.938 | 37.512 | 77.45 |
| 2016-03-202:48:22 PM | 72.275 | 161.938 | 37.288 | 77.45 |
| 2016-03-202:48:26 PM | 72.388 | 161.825 | 37.288 | 77.45 |
| 2016-03-202:48:30 PM | 72.388 | 161.825 | 37.175 | 77.45 |
| 2016-03-202:48:34 PM | 72.5 | 161.825 | 37.175 | 77.45 |
| 2016-03-202:48:38 PM | 72.5 | 161.825 | 37.175 | 77.45 |
| 2016-03-202:48:42 PM | 72.5 | 161.825 | 37.288 | 77.45 |
| 2016-03-202:48:46 PM | 72.612 | 161.825 | 37.175 | 77.45 |
| 2016-03-202:48:50 PM | 72.725 | 161.825 | 37.175 | 77.45 |
| 2016-03-202:48:54 PM | 72.725 | 161.825 | 37.062 | 77.45 |
| 2016-03-202:48:58 PM | 72.725 | 161.712 | 36.95 | 77.45 |
| 2016-03-202:49:03 PM | 72.838 | 161.712 | 36.95 | 77.45 |
| 2016-03-202:49:07 PM | 72.838 | 161.712 | 36.95 | 77.45 |
| 2016-03-202:49:11 PM | 72.95 | 161.6 | 36.95 | 77.45 |
| 2016-03-202:49:15 PM | 73.062 | 161.6 | 36.838 | 77.45 |
| 2016-03-202:49:19 PM | 73.062 | 161.6 | 36.838 | 77.45 |
| 2016-03-202:49:23 PM | 72.95 | 161.488 | 36.725 | 77.45 |
| 2016-03-202:49:27 PM | 72.95 | 161.488 | 36.838 | 77.338 |
| 2016-03-202:49:31 PM | 73.062 | 161.375 | 36.95 | 77.45 |
| 2016-03-202:49:35 PM | 73.062 | 161.375 | 36.95 | 77.338 |
| 2016-03-202:49:39 PM | 73.062 | 161.375 | 37.062 | 77.338 |
| 2016-03-202:49:43 PM | 73.175 | 161.375 | 37.062 | 77.338 |
| 2016-03-202:49:46 PM | 73.175 | 161.263 | 36.838 | 77.338 |
| 2016-03-202:49:50 PM | 73.062 | 161.15 | 36.838 | 77.338 |
| 2016-03-202:49:54 PM | 73.062 | 161.15 | 36.725 | 77.338 |
| 2016-03-202:49:59 PM | 73.062 | 161.15 | 36.725 | 77.338 |
| 2016-03-202:50:03 PM | 73.175 | 161.038 | 36.725 | 77.338 |
| 2016-03-202:50:07 PM | 73.175 | 161.038 | 36.725 | 77.338 |
| 2016-03-202:50:11 PM | 73.175 | 161.038 | 36.725 | 77.338 |
| 2016-03-202:50:15 PM | 73.288 | 161.038 | 36.838 | 77.338 |
| 2016-03-202:50:19 PM | 73.288 | 160.925 | 36.838 | 77.45 |
| 2016-03-202:50:23 PM | 73.4 | 160.925 | 36.838 | 77.45 |
| 2016-03-202:50:27 PM | 73.512 | 160.925 | 36.838 | 77.45 |
| 2016-03-202:50:31 PM | 73.625 | 160.925 | 36.838 | 77.338 |
| 2016-03-202:50:35 PM | 73.738 | 160.812 | 36.95 | 77.338 |
| 2016-03-202:50:39 PM | 73.962 | 160.812 | 37.062 | 77.45 |
| 2016-03-202:50:43 PM | 74.075 | 160.812 | 37.175 | 77.338 |
| 2016-03-202:50:47 PM | 74.3 | 160.7 | 37.288 | 77.45 |
| 2016-03-202:50:51 PM | 74.412 | 160.7 | 37.288 | 77.45 |
| 2016-03-202:50:55 PM | 74.525 | 160.588 | 37.288 | 77.45 |
| 2016-03-202:50:59 PM | 74.525 | 160.7 | 37.288 | 77.45 |
| 2016-03-202:51:03 PM | 74.525 | 160.588 | 37.4 | 77.338 |
| 2016-03-202:51:07 PM | 74.525 | 160.588 | 37.4 | 77.338 |
| 2016-03-202:51:11 PM | 74.638 | 160.588 | 37.288 | 77.338 |
| 2016-03-202:51:16 PM | 74.525 | 160.475 | 37.4 | 77.45 |
| 2016-03-202:51:20 PM | 74.525 | 160.475 | 37.512 | 77.45 |
| 2016-03-202:51:24 PM | 74.412 | 160.362 | 37.625 | 77.338 |
| 2016-03-202:51:28 PM | 74.412 | 160.362 | 37.738 | 77.338 |
| 2016-03-202:51:32 PM | 74.188 | 160.25 | 37.738 | 77.338 |
| 2016-03-202:51:36 PM | 74.075 | 160.25 | 37.738 | 77.338 |
| 2016-03-202:51:40 PM | 74.075 | 160.25 | 37.738 | 77.338 |
| 2016-03-202:51:44 PM | 73.962 | 160.138 | 37.625 | 77.338 |
| 2016-03-202:51:48 PM | 73.85 | 160.138 | 37.512 | 77.225 |
| 2016-03-202:51:52 PM | 73.85 | 160.025 | 37.512 | 77.338 |
| 2016-03-202:51:56 PM | 73.85 | 160.025 | 37.512 | 77.225 |
| 2016-03-202:52:00 PM | 73.85 | 160.025 | 37.625 | 77.225 |
| 2016-03-202:52:04 PM | 73.962 | 159.912 | 37.625 | 77.225 |
| 2016-03-202:52:08 PM | 74.075 | 159.912 | 37.738 | 77.338 |
| 2016-03-202:52:12 PM | 74.188 | 159.912 | 37.512 | 77.225 |
| 2016-03-202:52:16 PM | 74.412 | 159.8 | 37.625 | 77.225 |
| 2016-03-202:52:20 PM | 74.412 | 159.8 | 37.625 | 77.225 |
| 2016-03-202:52:24 PM | 74.412 | 159.688 | 37.625 | 77.225 |
| 2016-03-202:52:28 PM | 74.412 | 159.688 | 37.738 | 77.225 |
| 2016-03-202:52:32 PM | 74.412 | 159.575 | 37.85 | 77.225 |
| 2016-03-202:52:37 PM | 74.188 | 159.575 | 37.962 | 77.225 |
| 2016-03-202:52:41 PM | 73.962 | 159.575 | 38.075 | 77.338 |
| 2016-03-202:52:45 PM | 73.85 | 159.462 | 38.188 | 77.225 |
| 2016-03-202:52:49 PM | 73.85 | 159.35 | 38.188 | 77.225 |
| 2016-03-202:52:53 PM | 73.738 | 159.35 | 38.3 | 77.225 |
| 2016-03-202:52:57 PM | 73.85 | 159.35 | 38.412 | 77.225 |
| 2016-03-202:53:01 PM | 73.962 | 159.238 | 38.412 | 77.338 |
| 2016-03-202:53:05 PM | 73.962 | 159.238 | 38.412 | 77.225 |
| 2016-03-202:53:09 PM | 73.962 | 159.238 | 38.525 | 77.225 |
| 2016-03-202:53:13 PM | 73.738 | 159.125 | 38.638 | 77.225 |
| 2016-03-202:53:17 PM | 73.625 | 159.125 | 38.638 | 77.225 |
| 2016-03-202:53:21 PM | 73.625 | 159.125 | 38.75 | 77.225 |
| 2016-03-202:53:25 PM | 73.4 | 159.125 | 38.862 | 77.225 |
| 2016-03-202:53:29 PM | 73.288 | 159.013 | 38.975 | 77.225 |
| 2016-03-202:53:33 PM | 73.062 | 159.013 | 38.975 | 77.225 |
| 2016-03-202:53:37 PM | 72.95 | 159.013 | 38.862 | 77.225 |
| 2016-03-202:53:41 PM | 72.838 | 159.013 | 38.975 | 77.225 |
| 2016-03-202:53:45 PM | 72.838 | 158.9 | 38.862 | 77.225 |
| 2016-03-202:53:49 PM | 72.725 | 158.9 | 38.75 | 77.225 |
| 2016-03-202:53:53 PM | 72.725 | 158.9 | 38.638 | 77.225 |
| 2016-03-202:53:57 PM | 72.725 | 158.9 | 38.638 | 77.225 |
| 2016-03-202:54:01 PM | 72.838 | 158.788 | 38.75 | 77.225 |
| 2016-03-202:54:05 PM | 72.838 | 158.788 | 38.75 | 77.225 |
| 2016-03-202:54:09 PM | 72.95 | 158.788 | 38.862 | 77.225 |
| 2016-03-202:54:13 PM | 73.062 | 158.675 | 38.975 | 77.225 |
| 2016-03-202:54:17 PM | 73.175 | 158.675 | 38.975 | 77.225 |
| 2016-03-202:54:21 PM | 73.288 | 158.675 | 38.975 | 77.225 |
| 2016-03-202:54:25 PM | 73.4 | 158.675 | 38.975 | 77.225 |
| 2016-03-202:54:30 PM | 73.512 | 158.562 | 38.975 | 77.225 |
| 2016-03-202:54:34 PM | 73.738 | 158.562 | 38.975 | 77.112 |
| 2016-03-202:54:38 PM | 73.85 | 158.562 | 38.862 | 77.112 |
| 2016-03-202:54:42 PM | 73.962 | 158.562 | 38.862 | 77.112 |
| 2016-03-202:54:46 PM | 74.188 | 158.562 | 38.862 | 77.112 |
| 2016-03-202:54:50 PM | 74.3 | 158.562 | 38.862 | 77.112 |
| 2016-03-202:54:54 PM | 74.412 | 158.45 | 38.862 | 77.112 |
| 2016-03-202:54:58 PM | 74.412 | 158.562 | 38.862 | 77.112 |
| 2016-03-202:55:02 PM | 74.412 | 158.562 | 38.862 | 77.112 |
| 2016-03-202:55:06 PM | 74.412 | 158.45 | 38.862 | 77.112 |
| 2016-03-202:55:10 PM | 74.525 | 158.45 | 38.75 | 77.112 |
| 2016-03-202:55:14 PM | 74.638 | 158.45 | 38.638 | 77.112 |
| 2016-03-202:55:18 PM | 74.75 | 158.45 | 38.638 | 77.112 |
| 2016-03-202:55:22 PM | 74.862 | 158.562 | 38.75 | 77.112 |
| 2016-03-202:55:26 PM | 74.975 | 158.45 | 38.862 | 77.112 |
| 2016-03-202:55:30 PM | 74.975 | 158.45 | 38.862 | 77.112 |
| 2016-03-202:55:34 PM | 74.975 | 158.45 | 38.975 | 77.112 |
| 2016-03-202:55:38 PM | 74.975 | 158.45 | 38.975 | 77.112 |
| 2016-03-202:55:43 PM | 75.088 | 158.45 | 39.088 | 77.112 |
| 2016-03-202:55:46 PM | 75.088 | 158.562 | 39.2 | 77.225 |
| 2016-03-202:55:50 PM | 75.088 | 158.562 | 39.2 | 77.112 |
| 2016-03-202:55:54 PM | 75.088 | 158.45 | 39.312 | 77.225 |
| 2016-03-202:55:58 PM | 75.088 | 158.562 | 39.425 | 77.225 |
| 2016-03-202:56:02 PM | 75.2 | 158.562 | 39.425 | 77.225 |
| 2016-03-202:56:06 PM | 75.2 | 158.562 | 39.538 | 77.112 |
| 2016-03-202:56:10 PM | 75.088 | 158.562 | 39.538 | 77.112 |
| 2016-03-202:56:14 PM | 75.088 | 158.562 | 39.538 | 77.112 |
| 2016-03-202:56:18 PM | 75.088 | 158.562 | 39.425 | 77.112 |
| 2016-03-202:56:26 PM | 75.088 | 158.675 | 39.425 | 77.112 |
| 2016-03-202:56:30 PM | 75.088 | 158.675 | 39.312 | 77.112 |
| 2016-03-202:56:34 PM | 75.2 | 158.675 | 39.312 | 77.112 |
| 2016-03-202:56:38 PM | 75.312 | 158.675 | 39.2 | 77.112 |
| 2016-03-202:56:42 PM | 75.425 | 158.675 | 39.088 | 77.112 |
| 2016-03-202:56:46 PM | 75.538 | 158.675 | 39.088 | 77.112 |
| 2016-03-202:56:50 PM | 75.65 | 158.675 | 39.088 | 77.112 |
| 2016-03-202:56:54 PM | 75.65 | 158.675 | 39.088 | 77.112 |
| 2016-03-202:56:58 PM | 75.762 | 158.675 | 39.2 | 77.112 |
| 2016-03-202:57:02 PM | 75.875 | 158.675 | 39.2 | 77.112 |
| 2016-03-202:57:07 PM | 75.988 | 158.675 | 39.2 | 77.112 |
| 2016-03-202:57:11 PM | 76.1 | 158.675 | 39.2 | 77.112 |
| 2016-03-202:57:15 PM | 76.1 | 158.675 | 39.2 | 77.112 |
| 2016-03-202:57:19 PM | 76.325 | 158.675 | 39.312 | 77.112 |
| 2016-03-202:57:23 PM | 76.438 | 158.675 | 39.312 | 77.112 |
| 2016-03-202:57:27 PM | 76.662 | 158.675 | 39.312 | 77.112 |
| 2016-03-202:57:31 PM | 76.662 | 158.675 | 39.312 | 77.112 |
| 2016-03-202:57:35 PM | 76.775 | 158.675 | 39.2 | 77.112 |
| 2016-03-202:57:39 PM | 76.888 | 158.675 | 38.975 | 77 |
| 2016-03-202:57:43 PM | 76.888 | 158.675 | 38.975 | 77 |
| 2016-03-202:57:47 PM | 76.888 | 158.675 | 38.862 | 77 |
| 2016-03-202:57:51 PM | 76.662 | 158.675 | 38.862 | 77 |
| 2016-03-202:57:55 PM | 76.55 | 158.675 | 38.862 | 77 |
| 2016-03-202:57:59 PM | 76.438 | 158.675 | 38.75 | 77 |
| 2016-03-202:58:03 PM | 76.438 | 158.675 | 38.75 | 77 |
| 2016-03-202:58:07 PM | 76.438 | 158.675 | 38.75 | 77 |
| 2016-03-202:58:11 PM | 76.325 | 158.675 | 38.638 | 77 |
| 2016-03-202:58:15 PM | 76.325 | 158.675 | 38.75 | 77 |
| 2016-03-202:58:20 PM | 76.212 | 158.675 | 38.75 | 77 |
| 2016-03-202:58:24 PM | 76.212 | 158.675 | 38.862 | 77 |
| 2016-03-202:58:28 PM | 76.1 | 158.675 | 38.862 | 77 |
| 2016-03-202:58:32 PM | 76.212 | 158.675 | 38.862 | 77 |
| 2016-03-202:58:36 PM | 76.1 | 158.675 | 38.975 | 77 |
| 2016-03-202:58:40 PM | 75.875 | 158.675 | 39.2 | 77 |
| 2016-03-202:58:44 PM | 75.762 | 158.562 | 39.312 | 77 |
| 2016-03-202:58:48 PM | 75.538 | 158.675 | 39.425 | 77 |
| 2016-03-202:58:52 PM | 75.425 | 158.675 | 39.425 | 77 |
| 2016-03-202:58:56 PM | 75.425 | 158.675 | 39.425 | 77 |
| 2016-03-202:59:00 PM | 75.425 | 158.675 | 39.425 | 77 |
| 2016-03-202:59:04 PM | 75.312 | 158.675 | 39.425 | 77.112 |
| 2016-03-202:59:08 PM | 75.312 | 158.675 | 39.425 | 77.112 |
| 2016-03-202:59:12 PM | 75.2 | 158.675 | 39.425 | 77.112 |
| 2016-03-202:59:16 PM | 75.312 | 158.675 | 39.538 | 77.112 |
| 2016-03-202:59:20 PM | 75.312 | 158.675 | 39.538 | 77.112 |
| 2016-03-202:59:24 PM | 75.2 | 158.675 | 39.65 | 77 |
| 2016-03-202:59:29 PM | 75.088 | 158.675 | 39.65 | 77 |
| 2016-03-202:59:33 PM | 75.088 | 158.675 | 39.538 | 77 |
| 2016-03-202:59:37 PM | 75.088 | 158.675 | 39.425 | 77 |
| 2016-03-202:59:40 PM | 75.088 | 158.675 | 39.425 | 77 |
| 2016-03-202:59:44 PM | 75.088 | 158.675 | 39.425 | 77 |
| 2016-03-202:59:48 PM | 75.088 | 158.675 | 39.312 | 77.112 |
| 2016-03-202:59:52 PM | 74.975 | 158.675 | 39.312 | 77 |
| 2016-03-202:59:56 PM | 75.088 | 158.562 | 39.312 | 77.112 |
| 2016-03-203:00:00 PM | 75.2 | 158.562 | 39.312 | 77 |
| 2016-03-203:00:04 PM | 75.2 | 158.562 | 39.312 | 77 |
| 2016-03-203:00:08 PM | 75.312 | 158.562 | 39.312 | 77 |
| 2016-03-203:00:12 PM | 75.2 | 158.562 | 39.312 | 77 |
| 2016-03-203:00:16 PM | 75.2 | 158.45 | 39.2 | 77 |
| 2016-03-203:00:20 PM | 75.2 | 158.45 | 39.088 | 77 |
| 2016-03-203:00:24 PM | 75.2 | 158.45 | 38.975 | 77 |
| 2016-03-203:00:28 PM | 75.2 | 158.45 | 38.75 | 77 |
| 2016-03-203:00:33 PM | 75.2 | 158.45 | 38.638 | 77 |
| 2016-03-203:00:37 PM | 75.2 | 158.45 | 38.412 | 77 |
| 2016-03-203:00:41 PM | 75.2 | 158.338 | 38.3 | 77 |
| 2016-03-203:00:45 PM | 75.088 | 158.338 | 38.075 | 77 |
| 2016-03-203:00:49 PM | 74.975 | 158.338 | 37.962 | 77 |
| 2016-03-203:00:53 PM | 74.862 | 158.338 | 37.85 | 77.112 |
| 2016-03-203:00:57 PM | 74.862 | 158.338 | 37.85 | 77 |
| 2016-03-203:01:01 PM | 74.638 | 158.338 | 37.85 | 77 |
| 2016-03-203:01:05 PM | 74.638 | 158.338 | 37.962 | 77 |
| 2016-03-203:01:09 PM | 74.638 | 158.338 | 37.85 | 77 |
| 2016-03-203:01:13 PM | 74.638 | 158.338 | 37.962 | 77 |
| 2016-03-203:01:17 PM | 74.638 | 158.338 | 38.075 | 77 |
| 2016-03-203:01:21 PM | 74.525 | 158.225 | 38.075 | 77 |
| 2016-03-203:01:25 PM | 74.3 | 158.225 | 38.075 | 77 |
| 2016-03-203:01:29 PM | 73.962 | 158.225 | 38.188 | 77 |
| 2016-03-203:01:33 PM | 73.4 | 158.225 | 38.075 | 77 |
| 2016-03-203:01:37 PM | 73.062 | 158.225 | 38.075 | 77 |
| 2016-03-203:01:41 PM | 72.838 | 158.225 | 38.075 | 77 |
| 2016-03-203:01:45 PM | 72.612 | 158.225 | 38.075 | 77 |
| 2016-03-203:01:50 PM | 72.612 | 158.225 | 38.188 | 77 |
| 2016-03-203:01:54 PM | 72.5 | 158.225 | 38.3 | 77 |
| 2016-03-203:01:58 PM | 72.612 | 158.225 | 38.3 | 77.112 |
| 2016-03-203:02:02 PM | 72.612 | 158.225 | 38.412 | 77.112 |
| 2016-03-203:02:06 PM | 72.5 | 158.225 | 38.412 | 77.112 |
| 2016-03-203:02:10 PM | 72.388 | 158.225 | 38.3 | 77.112 |
| 2016-03-203:02:14 PM | 72.275 | 158.225 | 38.3 | 77 |
| 2016-03-203:02:18 PM | 72.275 | 158.225 | 38.3 | 77.112 |
| 2016-03-203:02:22 PM | 72.388 | 158.112 | 38.3 | 77 |
| 2016-03-203:02:26 PM | 72.5 | 158.225 | 38.3 | 77.112 |
| 2016-03-203:02:30 PM | 72.388 | 158.112 | 38.188 | 77 |
| 2016-03-203:02:34 PM | 72.5 | 158.112 | 37.962 | 77 |
| 2016-03-203:02:38 PM | 72.612 | 158.112 | 37.85 | 77.112 |
| 2016-03-203:02:42 PM | 72.725 | 158.112 | 37.85 | 77.112 |
| 2016-03-203:02:46 PM | 72.725 | 158.112 | 37.962 | 77.112 |
| 2016-03-203:02:50 PM | 72.725 | 158.112 | 37.962 | 77.112 |
| 2016-03-203:02:54 PM | 72.838 | 158.112 | 37.962 | 77.112 |
| 2016-03-203:02:58 PM | 72.725 | 158.112 | 38.075 | 77 |
| 2016-03-203:03:03 PM | 72.725 | 158 | 38.075 | 77.112 |
| 2016-03-203:03:07 PM | 72.725 | 158 | 38.075 | 77 |
| 2016-03-203:03:11 PM | 72.838 | 158 | 38.075 | 77 |
| 2016-03-203:03:15 PM | 72.838 | 158 | 38.188 | 77 |
| 2016-03-203:03:19 PM | 72.838 | 158 | 38.188 | 77 |
| 2016-03-203:03:23 PM | 72.725 | 158 | 38.188 | 77 |
| 2016-03-203:03:27 PM | 72.725 | 157.888 | 38.3 | 77 |
| 2016-03-203:03:31 PM | 72.612 | 157.888 | 38.3 | 77 |
| 2016-03-203:03:35 PM | 72.5 | 157.888 | 38.188 | 77 |
| 2016-03-203:03:39 PM | 72.5 | 157.888 | 38.3 | 76.888 |
| 2016-03-203:03:43 PM | 72.5 | 157.888 | 38.412 | 77 |
| 2016-03-203:03:47 PM | 72.612 | 157.888 | 38.412 | 77 |
| 2016-03-203:03:51 PM | 72.612 | 157.775 | 38.412 | 77 |
| 2016-03-203:03:55 PM | 72.725 | 157.775 | 38.412 | 77 |
| 2016-03-203:03:59 PM | 72.838 | 157.775 | 38.412 | 77 |
| 2016-03-203:04:03 PM | 72.95 | 157.775 | 38.412 | 77 |
| 2016-03-203:04:07 PM | 73.062 | 157.775 | 38.3 | 77 |
| 2016-03-203:04:11 PM | 72.95 | 157.775 | 38.3 | 77 |
| 2016-03-203:04:15 PM | 72.95 | 157.775 | 38.412 | 77 |
| 2016-03-203:04:19 PM | 72.838 | 157.775 | 38.525 | 77 |
| 2016-03-203:04:23 PM | 72.725 | 157.662 | 38.525 | 77 |
| 2016-03-203:04:27 PM | 72.725 | 157.662 | 38.525 | 77 |
| 2016-03-203:04:31 PM | 72.725 | 157.662 | 38.525 | 77 |
| 2016-03-203:04:35 PM | 72.838 | 157.662 | 38.412 | 77 |
| 2016-03-203:04:39 PM | 72.838 | 157.662 | 38.412 | 77 |
| 2016-03-203:04:43 PM | 72.838 | 157.662 | 38.3 | 77 |
| 2016-03-203:04:48 PM | 72.838 | 157.662 | 38.188 | 77 |
| 2016-03-203:04:52 PM | 72.838 | 157.662 | 38.188 | 77 |
| 2016-03-203:04:56 PM | 72.838 | 157.662 | 38.188 | 77 |
| 2016-03-203:05:00 PM | 72.725 | 157.662 | 38.3 | 77 |
| 2016-03-203:05:04 PM | 72.612 | 157.662 | 38.412 | 77 |
| 2016-03-203:05:08 PM | 72.5 | 157.55 | 38.525 | 77 |
| 2016-03-203:05:12 PM | 72.5 | 157.55 | 38.638 | 77 |
| 2016-03-203:05:16 PM | 72.612 | 157.55 | 38.862 | 77 |
| 2016-03-203:05:20 PM | 72.725 | 157.438 | 38.862 | 77 |
| 2016-03-203:05:24 PM | 72.838 | 157.438 | 38.975 | 77 |
| 2016-03-203:05:28 PM | 73.062 | 157.438 | 39.088 | 77 |
| 2016-03-203:05:32 PM | 73.175 | 157.325 | 39.088 | 77 |
| 2016-03-203:05:36 PM | 73.288 | 157.438 | 39.2 | 77 |
| 2016-03-203:05:40 PM | 73.4 | 157.325 | 39.312 | 76.888 |
| 2016-03-203:05:44 PM | 73.288 | 157.325 | 39.425 | 77 |
| 2016-03-203:05:49 PM | 73.288 | 157.325 | 39.425 | 76.888 |
| 2016-03-203:05:53 PM | 73.4 | 157.325 | 39.538 | 77 |
| 2016-03-203:05:57 PM | 73.4 | 157.325 | 39.65 | 76.888 |
| 2016-03-203:06:01 PM | 73.288 | 157.212 | 39.762 | 76.888 |
| 2016-03-203:06:05 PM | 73.288 | 157.212 | 39.875 | 76.888 |
| 2016-03-203:06:09 PM | 73.4 | 157.212 | 39.875 | 76.888 |
| 2016-03-203:06:13 PM | 73.288 | 157.1 | 39.988 | 76.888 |
| 2016-03-203:06:17 PM | 73.175 | 157.1 | 40.1 | 76.888 |
| 2016-03-203:06:21 PM | 73.062 | 157.1 | 40.1 | 76.888 |
| 2016-03-203:06:25 PM | 72.838 | 156.988 | 39.988 | 76.888 |
| 2016-03-203:06:29 PM | 72.725 | 156.988 | 39.988 | 76.888 |
| 2016-03-203:06:33 PM | 72.612 | 156.988 | 39.875 | 76.888 |
| 2016-03-203:06:37 PM | 72.612 | 156.875 | 39.875 | 76.888 |
| 2016-03-203:06:41 PM | 72.612 | 156.875 | 39.875 | 76.888 |
| 2016-03-203:06:45 PM | 72.612 | 156.875 | 39.875 | 76.888 |
| 2016-03-203:06:49 PM | 72.612 | 156.875 | 39.875 | 76.888 |
| 2016-03-203:06:53 PM | 72.612 | 156.875 | 39.988 | 76.888 |
| 2016-03-203:06:57 PM | 72.612 | 156.763 | 39.988 | 77 |
| 2016-03-203:07:01 PM | 72.725 | 156.763 | 40.1 | 76.888 |
| 2016-03-203:07:06 PM | 72.725 | 156.763 | 40.1 | 77 |
| 2016-03-203:07:10 PM | 72.838 | 156.763 | 40.212 | 77 |
| 2016-03-203:07:14 PM | 72.838 | 156.763 | 40.1 | 76.888 |
| 2016-03-203:07:18 PM | 72.838 | 156.763 | 39.988 | 77 |
| 2016-03-203:07:22 PM | 72.725 | 156.763 | 39.988 | 77 |
| 2016-03-203:07:26 PM | 72.725 | 156.65 | 39.988 | 77 |
| 2016-03-203:07:30 PM | 72.725 | 156.65 | 39.762 | 77 |
| 2016-03-203:07:34 PM | 72.725 | 156.65 | 39.538 | 77 |
| 2016-03-203:07:38 PM | 72.725 | 156.65 | 39.425 | 77 |
| 2016-03-203:07:42 PM | 72.838 | 156.65 | 39.425 | 77 |
| 2016-03-203:07:46 PM | 72.95 | 156.65 | 39.425 | 77 |
| 2016-03-203:07:50 PM | 72.95 | 156.65 | 39.538 | 77 |
| 2016-03-203:07:54 PM | 73.062 | 156.538 | 39.538 | 77 |
| 2016-03-203:07:58 PM | 73.175 | 156.65 | 39.65 | 77 |
| 2016-03-203:08:02 PM | 73.175 | 156.538 | 39.65 | 77 |
| 2016-03-203:08:06 PM | 73.288 | 156.538 | 39.538 | 77 |
| 2016-03-203:08:14 PM | 73.512 | 156.538 | 39.65 | 77 |
| 2016-03-203:08:18 PM | 73.625 | 156.538 | 39.538 | 77 |
| 2016-03-203:08:22 PM | 73.85 | 156.538 | 39.538 | 77 |
| 2016-03-203:08:26 PM | 73.738 | 156.538 | 39.538 | 77 |
| 2016-03-203:08:30 PM | 73.738 | 156.538 | 39.538 | 76.888 |
| 2016-03-203:08:34 PM | 73.738 | 156.538 | 39.538 | 76.888 |
| 2016-03-203:08:38 PM | 73.962 | 156.538 | 39.65 | 76.888 |
| 2016-03-203:08:42 PM | 73.962 | 156.538 | 39.65 | 76.888 |
| 2016-03-203:08:46 PM | 73.962 | 156.538 | 39.65 | 76.888 |
| 2016-03-203:08:50 PM | 74.075 | 156.425 | 39.65 | 76.888 |
| 2016-03-203:08:55 PM | 73.962 | 156.538 | 39.65 | 76.888 |
| 2016-03-203:08:59 PM | 73.962 | 156.538 | 39.65 | 76.888 |
| 2016-03-203:09:03 PM | 73.962 | 156.425 | 39.65 | 76.888 |
| 2016-03-203:09:07 PM | 73.962 | 156.425 | 39.65 | 76.775 |
| 2016-03-203:09:11 PM | 74.188 | 156.425 | 39.65 | 76.888 |
| 2016-03-203:09:15 PM | 74.3 | 156.425 | 39.65 | 76.888 |
| 2016-03-203:09:19 PM | 74.412 | 156.425 | 39.65 | 76.888 |
| 2016-03-203:09:23 PM | 74.638 | 156.425 | 39.65 | 76.888 |
| 2016-03-203:09:27 PM | 74.638 | 156.425 | 39.538 | 76.888 |
| 2016-03-203:09:31 PM | 74.525 | 156.425 | 39.538 | 76.888 |
| 2016-03-203:09:35 PM | 74.412 | 156.312 | 39.425 | 76.775 |
| 2016-03-203:09:39 PM | 74.412 | 156.425 | 39.312 | 76.775 |
| 2016-03-203:09:43 PM | 74.412 | 156.425 | 39.312 | 76.888 |
| 2016-03-203:09:47 PM | 74.412 | 156.425 | 39.2 | 76.888 |
| 2016-03-203:09:51 PM | 74.525 | 156.312 | 39.2 | 76.888 |
| 2016-03-203:09:55 PM | 74.412 | 156.312 | 39.312 | 76.888 |
| 2016-03-203:09:59 PM | 74.3 | 156.312 | 39.312 | 76.775 |
| 2016-03-203:10:04 PM | 74.188 | 156.312 | 39.312 | 76.775 |
| 2016-03-203:10:08 PM | 74.188 | 156.312 | 39.425 | 76.888 |
| 2016-03-203:10:12 PM | 74.188 | 156.312 | 39.538 | 76.888 |
| 2016-03-203:10:16 PM | 74.3 | 156.312 | 39.65 | 76.775 |
| 2016-03-203:10:20 PM | 74.525 | 156.312 | 39.762 | 76.775 |
| 2016-03-203:10:24 PM | 74.638 | 156.312 | 39.875 | 76.775 |
| 2016-03-203:10:28 PM | 74.75 | 156.312 | 39.988 | 76.775 |
| 2016-03-203:10:32 PM | 74.75 | 156.312 | 40.1 | 76.775 |
| 2016-03-203:10:36 PM | 74.75 | 156.312 | 40.212 | 76.775 |
| 2016-03-203:10:40 PM | 74.525 | 156.312 | 40.212 | 76.775 |
| 2016-03-203:10:44 PM | 74.525 | 156.2 | 40.212 | 76.775 |
| 2016-03-203:10:48 PM | 74.525 | 156.2 | 40.325 | 76.775 |
| 2016-03-203:10:52 PM | 74.638 | 156.312 | 40.212 | 76.775 |
| 2016-03-203:10:56 PM | 74.638 | 156.2 | 40.212 | 76.775 |
| 2016-03-203:11:00 PM | 74.75 | 156.312 | 40.1 | 76.775 |
| 2016-03-203:11:04 PM | 74.862 | 156.312 | 39.988 | 76.888 |
| 2016-03-203:11:08 PM | 74.862 | 156.2 | 39.875 | 76.888 |
| 2016-03-203:11:12 PM | 74.862 | 156.2 | 39.875 | 76.888 |
| 2016-03-203:11:17 PM | 74.862 | 156.2 | 39.875 | 76.888 |
| 2016-03-203:11:21 PM | 74.975 | 156.2 | 39.762 | 76.888 |
| 2016-03-203:11:25 PM | 74.862 | 156.2 | 39.875 | 76.888 |
| 2016-03-203:11:29 PM | 74.975 | 156.2 | 39.875 | 76.888 |
| 2016-03-203:11:33 PM | 75.088 | 156.088 | 39.875 | 76.888 |
| 2016-03-203:11:37 PM | 75.088 | 156.088 | 39.988 | 76.888 |
| 2016-03-203:11:41 PM | 75.088 | 156.088 | 39.988 | 76.888 |
| 2016-03-203:11:45 PM | 74.975 | 156.088 | 39.988 | 76.775 |
| 2016-03-203:11:49 PM | 74.862 | 156.088 | 39.875 | 76.888 |
| 2016-03-203:11:53 PM | 74.862 | 156.088 | 39.875 | 76.775 |
| 2016-03-203:11:57 PM | 74.862 | 155.975 | 39.875 | 76.775 |
| 2016-03-203:12:01 PM | 74.975 | 155.975 | 39.875 | 76.775 |
| 2016-03-203:12:05 PM | 74.862 | 155.975 | 39.988 | 76.888 |
| 2016-03-203:12:09 PM | 74.75 | 155.975 | 39.988 | 76.888 |
| 2016-03-203:12:13 PM | 74.525 | 155.975 | 40.1 | 76.775 |
| 2016-03-203:12:17 PM | 74.412 | 155.862 | 40.1 | 76.775 |
| 2016-03-203:12:22 PM | 74.3 | 155.975 | 40.212 | 76.775 |
| 2016-03-203:12:29 PM | 74.188 | 155.975 | 39.988 | 76.775 |
| 2016-03-203:12:33 PM | 74.075 | 155.975 | 39.875 | 76.775 |
| 2016-03-203:12:37 PM | 73.962 | 155.862 | 39.875 | 76.775 |
| 2016-03-203:12:41 PM | 73.85 | 155.975 | 39.988 | 76.775 |
| 2016-03-203:12:45 PM | 73.85 | 155.862 | 39.875 | 76.775 |
| 2016-03-203:12:49 PM | 73.625 | 155.862 | 39.875 | 76.775 |
| 2016-03-203:12:53 PM | 73.4 | 155.862 | 39.65 | 76.775 |
| 2016-03-203:12:57 PM | 73.288 | 155.862 | 39.538 | 76.775 |
| 2016-03-203:13:02 PM | 73.175 | 155.862 | 39.425 | 76.662 |
| 2016-03-203:13:06 PM | 73.288 | 155.862 | 39.425 | 76.662 |
| 2016-03-203:13:10 PM | 73.288 | 155.862 | 39.312 | 76.662 |
| 2016-03-203:13:14 PM | 73.288 | 155.862 | 39.312 | 76.662 |
| 2016-03-203:13:18 PM | 73.288 | 155.862 | 39.312 | 76.775 |
| 2016-03-203:13:22 PM | 73.288 | 155.862 | 39.312 | 76.662 |
| 2016-03-203:13:26 PM | 73.4 | 155.862 | 39.312 | 76.662 |
| 2016-03-203:13:30 PM | 73.512 | 155.862 | 39.312 | 76.662 |
| 2016-03-203:13:34 PM | 73.512 | 155.75 | 39.2 | 76.662 |
| 2016-03-203:13:38 PM | 73.625 | 155.75 | 39.2 | 76.775 |
| 2016-03-203:13:42 PM | 73.738 | 155.862 | 39.2 | 76.662 |
| 2016-03-203:13:46 PM | 73.85 | 155.75 | 39.2 | 76.662 |
| 2016-03-203:13:50 PM | 74.075 | 155.862 | 39.088 | 76.662 |
| 2016-03-203:13:54 PM | 74.188 | 155.862 | 38.975 | 76.775 |
| 2016-03-203:13:58 PM | 74.3 | 155.75 | 38.862 | 76.662 |
| 2016-03-203:14:02 PM | 74.412 | 155.75 | 38.75 | 76.775 |
| 2016-03-203:14:07 PM | 74.638 | 155.75 | 38.862 | 76.662 |
| 2016-03-203:14:11 PM | 74.75 | 155.75 | 38.75 | 76.662 |
| 2016-03-203:14:15 PM | 74.75 | 155.75 | 38.75 | 76.662 |
| 2016-03-203:14:19 PM | 74.975 | 155.75 | 38.75 | 76.775 |
| 2016-03-203:14:23 PM | 75.088 | 155.75 | 38.75 | 76.662 |
| 2016-03-203:14:27 PM | 75.2 | 155.75 | 38.75 | 76.662 |
| 2016-03-203:14:31 PM | 75.2 | 155.75 | 38.75 | 76.662 |
| 2016-03-203:14:35 PM | 75.2 | 155.75 | 38.638 | 76.662 |
| 2016-03-203:14:39 PM | 75.088 | 155.75 | 38.412 | 76.662 |
| 2016-03-203:14:43 PM | 75.088 | 155.75 | 38.188 | 76.662 |
| 2016-03-203:14:47 PM | 75.088 | 155.638 | 38.075 | 76.662 |
| 2016-03-203:14:51 PM | 75.088 | 155.75 | 37.962 | 76.662 |
| 2016-03-203:14:55 PM | 75.2 | 155.638 | 37.85 | 76.662 |
| 2016-03-203:14:59 PM | 75.312 | 155.638 | 37.738 | 76.55 |
| 2016-03-203:15:04 PM | 75.312 | 155.638 | 37.738 | 76.662 |
| 2016-03-203:15:08 PM | 75.312 | 155.638 | 37.738 | 76.662 |
| 2016-03-203:15:12 PM | 75.088 | 155.525 | 37.738 | 76.662 |
| 2016-03-203:15:16 PM | 74.975 | 155.525 | 37.738 | 76.662 |
| 2016-03-203:15:20 PM | 74.862 | 155.525 | 37.85 | 76.662 |
| 2016-03-203:15:24 PM | 74.862 | 155.525 | 37.738 | 76.662 |
| 2016-03-203:15:28 PM | 74.862 | 155.525 | 37.625 | 76.662 |
| 2016-03-203:15:32 PM | 74.975 | 155.525 | 37.738 | 76.662 |
| 2016-03-203:15:36 PM | 74.975 | 155.525 | 37.738 | 76.662 |
| 2016-03-203:15:40 PM | 74.638 | 155.412 | 37.738 | 76.662 |
| 2016-03-203:15:44 PM | 74.525 | 155.412 | 37.85 | 76.662 |
| 2016-03-203:15:48 PM | 74.188 | 155.412 | 37.962 | 76.662 |
| 2016-03-203:15:52 PM | 73.962 | 155.412 | 38.075 | 76.662 |
| 2016-03-203:15:56 PM | 73.85 | 155.3 | 38.075 | 76.662 |
| 2016-03-203:16:00 PM | 73.738 | 155.412 | 38.188 | 76.662 |
| 2016-03-203:16:04 PM | 73.512 | 155.3 | 38.188 | 76.662 |
| 2016-03-203:16:08 PM | 73.4 | 155.3 | 38.188 | 76.662 |
| 2016-03-203:16:12 PM | 73.288 | 155.3 | 38.188 | 76.662 |
| 2016-03-203:16:16 PM | 73.175 | 155.3 | 38.188 | 76.662 |
| 2016-03-203:16:20 PM | 73.062 | 155.3 | 38.075 | 76.662 |
| 2016-03-203:16:24 PM | 73.175 | 155.3 | 37.962 | 76.55 |
| 2016-03-203:16:28 PM | 73.175 | 155.188 | 38.075 | 76.662 |
| 2016-03-203:16:33 PM | 73.288 | 155.188 | 38.075 | 76.662 |
| 2016-03-203:16:37 PM | 73.4 | 155.188 | 38.075 | 76.662 |
| 2016-03-203:16:41 PM | 73.288 | 155.188 | 38.075 | 76.662 |
| 2016-03-203:16:45 PM | 73.175 | 155.188 | 37.962 | 76.55 |
| 2016-03-203:16:48 PM | 73.175 | 155.188 | 37.962 | 76.55 |
| 2016-03-203:16:52 PM | 73.062 | 155.188 | 38.075 | 76.55 |
| 2016-03-203:16:56 PM | 72.95 | 155.188 | 38.075 | 76.55 |
| 2016-03-203:17:00 PM | 72.838 | 155.188 | 38.075 | 76.55 |
| 2016-03-203:17:04 PM | 72.612 | 155.075 | 38.188 | 76.55 |
| 2016-03-203:17:08 PM | 72.612 | 155.075 | 38.188 | 76.55 |
| 2016-03-203:17:12 PM | 72.725 | 155.075 | 38.188 | 76.55 |
| 2016-03-203:17:16 PM | 72.838 | 154.962 | 38.3 | 76.55 |
| 2016-03-203:17:21 PM | 72.838 | 154.962 | 38.3 | 76.55 |
| 2016-03-203:17:25 PM | 72.95 | 154.962 | 38.3 | 76.55 |
| 2016-03-203:17:29 PM | 72.95 | 154.962 | 38.188 | 76.55 |
| 2016-03-203:17:33 PM | 73.062 | 154.962 | 38.3 | 76.55 |
| 2016-03-203:17:37 PM | 73.062 | 154.85 | 38.3 | 76.55 |
| 2016-03-203:17:41 PM | 73.288 | 154.85 | 38.412 | 76.55 |
| 2016-03-203:17:45 PM | 73.4 | 154.85 | 38.525 | 76.55 |
| 2016-03-203:17:49 PM | 73.512 | 154.85 | 38.525 | 76.55 |
| 2016-03-203:17:53 PM | 73.512 | 154.85 | 38.525 | 76.55 |
| 2016-03-203:17:57 PM | 73.512 | 154.738 | 38.525 | 76.438 |
| 2016-03-203:18:01 PM | 73.4 | 154.738 | 38.412 | 76.438 |
| 2016-03-203:18:05 PM | 73.4 | 154.738 | 38.412 | 76.438 |
| 2016-03-203:18:09 PM | 73.4 | 154.738 | 38.412 | 76.438 |
| 2016-03-203:18:13 PM | 73.175 | 154.625 | 38.525 | 76.438 |
| 2016-03-203:18:18 PM | 72.95 | 154.625 | 38.412 | 76.55 |
| 2016-03-203:18:22 PM | 72.838 | 154.625 | 38.412 | 76.55 |
| 2016-03-203:18:26 PM | 72.725 | 154.625 | 38.075 | 76.55 |
| 2016-03-203:18:30 PM | 72.725 | 154.513 | 37.962 | 76.55 |
| 2016-03-203:18:34 PM | 72.725 | 154.513 | 37.85 | 76.55 |
| 2016-03-203:18:38 PM | 72.725 | 154.513 | 37.85 | 76.55 |
| 2016-03-203:18:42 PM | 72.612 | 154.513 | 37.962 | 76.438 |
| 2016-03-203:18:46 PM | 72.5 | 154.513 | 38.075 | 76.55 |
| 2016-03-203:18:50 PM | 72.5 | 154.4 | 38.075 | 76.55 |
| 2016-03-203:18:54 PM | 72.5 | 154.513 | 38.075 | 76.55 |
| 2016-03-203:18:58 PM | 72.5 | 154.4 | 38.188 | 76.55 |
| 2016-03-203:19:02 PM | 72.612 | 154.4 | 38.188 | 76.55 |
| 2016-03-203:19:06 PM | 72.388 | 154.4 | 38.3 | 76.55 |
| 2016-03-203:19:10 PM | 72.388 | 154.288 | 38.3 | 76.438 |
| 2016-03-203:19:14 PM | 72.388 | 154.288 | 38.3 | 76.438 |
| 2016-03-203:19:19 PM | 72.388 | 154.288 | 38.3 | 76.438 |
| 2016-03-203:19:23 PM | 72.388 | 154.288 | 38.412 | 76.55 |
| 2016-03-203:19:27 PM | 72.5 | 154.288 | 38.525 | 76.438 |
| 2016-03-203:19:31 PM | 72.612 | 154.288 | 38.525 | 76.55 |
| 2016-03-203:19:35 PM | 72.725 | 154.288 | 38.525 | 76.438 |
| 2016-03-203:19:39 PM | 72.95 | 154.288 | 38.638 | 76.438 |
| 2016-03-203:19:43 PM | 72.95 | 154.288 | 38.75 | 76.438 |
| 2016-03-203:19:47 PM | 73.062 | 154.175 | 38.862 | 76.438 |
| 2016-03-203:19:55 PM | 73.175 | 154.175 | 39.088 | 76.438 |
| 2016-03-203:19:59 PM | 73.175 | 154.175 | 39.088 | 76.438 |
| 2016-03-203:20:03 PM | 73.288 | 154.175 | 39.2 | 76.438 |
| 2016-03-203:20:07 PM | 73.4 | 154.175 | 39.312 | 76.438 |
| 2016-03-203:20:11 PM | 73.512 | 154.175 | 39.312 | 76.438 |
| 2016-03-203:20:15 PM | 73.625 | 154.175 | 39.2 | 76.438 |
| 2016-03-203:20:19 PM | 73.85 | 154.175 | 39.2 | 76.438 |
| 2016-03-203:20:23 PM | 73.85 | 154.062 | 39.2 | 76.438 |
| 2016-03-203:20:27 PM | 73.738 | 154.062 | 39.088 | 76.438 |
| 2016-03-203:20:31 PM | 73.738 | 154.062 | 38.862 | 76.438 |
| 2016-03-203:20:35 PM | 73.738 | 154.062 | 38.75 | 76.438 |
| 2016-03-203:20:39 PM | 73.738 | 154.062 | 38.638 | 76.325 |
| 2016-03-203:20:43 PM | 73.738 | 154.062 | 38.638 | 76.438 |
| 2016-03-203:20:47 PM | 73.738 | 154.062 | 38.638 | 76.438 |
| 2016-03-203:20:51 PM | 73.85 | 154.062 | 38.75 | 76.438 |
| 2016-03-203:20:55 PM | 73.738 | 153.95 | 38.75 | 76.438 |
| 2016-03-203:21:00 PM | 73.738 | 153.95 | 38.75 | 76.325 |
| 2016-03-203:21:04 PM | 73.512 | 153.95 | 38.75 | 76.438 |
| 2016-03-203:21:08 PM | 73.288 | 153.95 | 38.638 | 76.325 |
| 2016-03-203:21:12 PM | 73.175 | 153.95 | 38.638 | 76.438 |
| 2016-03-203:21:16 PM | 73.062 | 153.95 | 38.638 | 76.325 |
| 2016-03-203:21:20 PM | 73.062 | 153.95 | 38.75 | 76.325 |
| 2016-03-203:21:24 PM | 73.062 | 153.95 | 38.75 | 76.325 |
| 2016-03-203:21:28 PM | 72.95 | 153.838 | 38.862 | 76.325 |
| 2016-03-203:21:32 PM | 72.838 | 153.838 | 38.75 | 76.325 |
| 2016-03-203:21:36 PM | 72.725 | 153.838 | 38.75 | 76.325 |
| 2016-03-203:21:44 PM | 72.612 | 153.838 | 38.638 | 76.325 |
| 2016-03-203:21:48 PM | 72.388 | 153.838 | 38.638 | 76.438 |
| 2016-03-203:21:52 PM | 72.275 | 153.838 | 38.525 | 76.325 |
| 2016-03-203:21:56 PM | 72.162 | 153.838 | 38.412 | 76.325 |
| 2016-03-203:22:00 PM | 72.162 | 153.838 | 38.412 | 76.325 |
| 2016-03-203:22:04 PM | 72.162 | 153.838 | 38.3 | 76.325 |
| 2016-03-203:22:09 PM | 72.162 | 153.725 | 38.3 | 76.325 |
| 2016-03-203:22:13 PM | 72.05 | 153.725 | 38.412 | 76.325 |
| 2016-03-203:22:17 PM | 71.938 | 153.725 | 38.412 | 76.325 |
| 2016-03-203:22:21 PM | 71.712 | 153.725 | 38.412 | 76.325 |
| 2016-03-203:22:25 PM | 71.488 | 153.725 | 38.412 | 76.325 |
| 2016-03-203:22:29 PM | 70.812 | 153.725 | 38.525 | 76.325 |
| 2016-03-203:22:33 PM | 70.7 | 153.725 | 38.525 | 76.212 |
| 2016-03-203:22:37 PM | 70.7 | 153.725 | 38.525 | 76.212 |
| 2016-03-203:22:41 PM | 70.7 | 153.612 | 38.638 | 76.212 |
| 2016-03-203:22:45 PM | 70.812 | 153.612 | 38.638 | 76.212 |
| 2016-03-203:22:49 PM | 70.812 | 153.612 | 38.75 | 76.212 |
| 2016-03-203:22:53 PM | 70.812 | 153.612 | 38.75 | 76.212 |
| 2016-03-203:22:58 PM | 70.925 | 153.612 | 38.638 | 76.212 |
| 2016-03-203:23:02 PM | 71.038 | 153.612 | 38.638 | 76.212 |
| 2016-03-203:23:06 PM | 71.038 | 153.5 | 38.638 | 76.212 |
| 2016-03-203:23:10 PM | 70.925 | 153.5 | 38.75 | 76.212 |
| 2016-03-203:23:14 PM | 70.925 | 153.5 | 38.75 | 76.212 |
| 2016-03-203:23:18 PM | 70.925 | 153.5 | 38.862 | 76.212 |
| 2016-03-203:23:22 PM | 70.925 | 153.5 | 38.862 | 76.212 |
| 2016-03-203:23:26 PM | 70.925 | 153.5 | 38.862 | 76.212 |
| 2016-03-203:23:30 PM | 71.038 | 153.388 | 38.975 | 76.212 |
| 2016-03-203:23:34 PM | 71.038 | 153.388 | 39.088 | 76.212 |
| 2016-03-203:23:38 PM | 71.15 | 153.388 | 39.088 | 76.212 |
| 2016-03-203:23:42 PM | 71.262 | 153.275 | 39.088 | 76.212 |
| 2016-03-203:23:46 PM | 71.375 | 153.388 | 39.088 | 76.212 |
| 2016-03-203:23:50 PM | 71.488 | 153.388 | 38.975 | 76.212 |
| 2016-03-203:23:54 PM | 71.6 | 153.275 | 38.975 | 76.212 |
| 2016-03-203:23:58 PM | 71.6 | 153.275 | 38.862 | 76.212 |
| 2016-03-203:24:02 PM | 71.6 | 153.275 | 38.75 | 76.212 |
| 2016-03-203:24:06 PM | 71.6 | 153.275 | 38.75 | 76.212 |
| 2016-03-203:24:11 PM | 71.712 | 153.275 | 38.75 | 76.212 |
| 2016-03-203:24:15 PM | 71.825 | 153.162 | 38.75 | 76.212 |
| 2016-03-203:24:19 PM | 71.938 | 153.162 | 38.638 | 76.212 |
| 2016-03-203:24:23 PM | 72.05 | 153.162 | 38.525 | 76.212 |
| 2016-03-203:24:27 PM | 72.162 | 153.05 | 38.412 | 76.212 |
| 2016-03-203:24:31 PM | 72.275 | 153.05 | 38.3 | 76.212 |
| 2016-03-203:24:35 PM | 72.5 | 153.05 | 38.075 | 76.212 |
| 2016-03-203:24:39 PM | 72.612 | 152.938 | 37.962 | 76.212 |
| 2016-03-203:24:43 PM | 72.725 | 152.938 | 37.738 | 76.212 |
| 2016-03-203:24:47 PM | 72.838 | 152.938 | 37.625 | 76.325 |
| 2016-03-203:24:51 PM | 72.95 | 152.825 | 37.512 | 76.325 |
| 2016-03-203:24:55 PM | 72.95 | 152.825 | 37.512 | 76.212 |
| 2016-03-203:24:59 PM | 73.062 | 152.712 | 37.4 | 76.325 |
| 2016-03-203:25:03 PM | 73.175 | 152.712 | 37.4 | 76.212 |
| 2016-03-203:25:08 PM | 73.175 | 152.712 | 37.4 | 76.212 |
| 2016-03-203:25:12 PM | 73.175 | 152.712 | 37.4 | 76.212 |
| 2016-03-203:25:16 PM | 73.175 | 152.6 | 37.288 | 76.212 |
| 2016-03-203:25:20 PM | 73.062 | 152.6 | 37.175 | 76.212 |
| 2016-03-203:25:24 PM | 73.062 | 152.6 | 36.95 | 76.212 |
| 2016-03-203:25:28 PM | 73.175 | 152.488 | 36.95 | 76.212 |
| 2016-03-203:25:32 PM | 73.288 | 152.375 | 36.95 | 76.212 |
| 2016-03-203:25:36 PM | 73.175 | 152.488 | 36.95 | 76.212 |
| 2016-03-203:25:40 PM | 73.062 | 152.375 | 36.95 | 76.212 |
| 2016-03-203:25:44 PM | 73.062 | 152.375 | 36.95 | 76.212 |
| 2016-03-203:25:48 PM | 72.95 | 152.375 | 37.062 | 76.212 |
| 2016-03-203:25:52 PM | 72.838 | 152.263 | 37.175 | 76.212 |
| 2016-03-203:25:56 PM | 72.725 | 152.263 | 37.175 | 76.212 |
| 2016-03-203:26:00 PM | 72.612 | 152.15 | 37.175 | 76.212 |
| 2016-03-203:26:04 PM | 72.5 | 152.15 | 37.175 | 76.212 |
| 2016-03-203:26:08 PM | 72.5 | 152.15 | 37.062 | 76.212 |
| 2016-03-203:26:12 PM | 72.5 | 152.15 | 36.95 | 76.212 |
| 2016-03-203:26:17 PM | 72.612 | 152.15 | 36.838 | 76.212 |
| 2016-03-203:26:21 PM | 72.612 | 152.038 | 36.725 | 76.212 |
| 2016-03-203:26:25 PM | 72.612 | 152.038 | 36.725 | 76.212 |
| 2016-03-203:26:29 PM | 72.5 | 152.038 | 36.838 | 76.212 |
| 2016-03-203:26:33 PM | 72.5 | 151.925 | 36.95 | 76.1 |
| 2016-03-203:26:37 PM | 72.5 | 151.925 | 37.062 | 76.1 |
| 2016-03-203:26:41 PM | 72.5 | 151.812 | 37.175 | 76.1 |
| 2016-03-203:26:45 PM | 72.612 | 151.812 | 37.288 | 76.1 |
| 2016-03-203:26:49 PM | 72.725 | 151.812 | 37.4 | 76.1 |
| 2016-03-203:26:53 PM | 72.612 | 151.7 | 37.512 | 76.1 |
| 2016-03-203:26:57 PM | 72.612 | 151.7 | 37.512 | 76.1 |
| 2016-03-203:27:01 PM | 72.388 | 151.588 | 37.512 | 76.1 |
| 2016-03-203:27:05 PM | 72.275 | 151.588 | 37.625 | 76.1 |
| 2016-03-203:27:09 PM | 72.162 | 151.588 | 37.738 | 76.1 |
| 2016-03-203:27:13 PM | 72.162 | 151.475 | 37.85 | 76.212 |
| 2016-03-203:27:16 PM | 72.05 | 151.475 | 37.85 | 76.1 |
| 2016-03-203:27:20 PM | 71.938 | 151.362 | 37.962 | 76.212 |
| 2016-03-203:27:24 PM | 71.938 | 151.362 | 37.962 | 76.1 |
| 2016-03-203:27:28 PM | 71.825 | 151.362 | 37.85 | 76.1 |
| 2016-03-203:27:32 PM | 71.825 | 151.25 | 38.075 | 76.1 |
| 2016-03-203:27:36 PM | 71.825 | 151.138 | 38.075 | 76.1 |
| 2016-03-203:27:40 PM | 71.712 | 151.138 | 38.075 | 76.212 |
| 2016-03-203:27:44 PM | 71.712 | 151.138 | 38.188 | 76.212 |
| 2016-03-203:27:48 PM | 71.6 | 151.025 | 38.188 | 76.212 |
| 2016-03-203:27:52 PM | 71.488 | 151.025 | 38.188 | 76.212 |
| 2016-03-203:27:56 PM | 71.488 | 150.912 | 38.3 | 76.212 |
| 2016-03-203:28:00 PM | 71.488 | 151.025 | 38.3 | 76.212 |
| 2016-03-203:28:04 PM | 71.488 | 150.912 | 38.188 | 76.212 |
| 2016-03-203:28:09 PM | 71.488 | 150.912 | 38.188 | 76.212 |
| 2016-03-203:28:13 PM | 71.488 | 150.912 | 38.3 | 76.212 |
| 2016-03-203:28:17 PM | 71.488 | 150.8 | 38.412 | 76.212 |
| 2016-03-203:28:21 PM | 71.488 | 150.8 | 38.525 | 76.212 |
| 2016-03-203:28:25 PM | 71.488 | 150.8 | 38.525 | 76.325 |
| 2016-03-203:28:29 PM | 71.6 | 150.8 | 38.638 | 76.325 |
| 2016-03-203:28:33 PM | 71.6 | 150.8 | 38.638 | 76.325 |
| 2016-03-203:28:37 PM | 71.712 | 150.688 | 38.75 | 76.325 |
| 2016-03-203:28:41 PM | 71.6 | 150.688 | 38.75 | 76.325 |
| 2016-03-203:28:45 PM | 71.488 | 150.688 | 38.75 | 76.325 |
| 2016-03-203:28:49 PM | 71.375 | 150.688 | 38.862 | 76.325 |
| 2016-03-203:28:57 PM | 71.262 | 150.688 | 38.862 | 76.325 |
| 2016-03-203:29:01 PM | 71.262 | 150.688 | 38.975 | 76.325 |
| 2016-03-203:29:05 PM | 71.15 | 150.688 | 38.975 | 76.325 |
| 2016-03-203:29:09 PM | 71.038 | 150.688 | 38.975 | 76.212 |
| 2016-03-203:29:13 PM | 71.15 | 150.688 | 38.975 | 76.212 |
| 2016-03-203:29:17 PM | 71.038 | 150.688 | 39.088 | 76.212 |
| 2016-03-203:29:21 PM | 71.038 | 150.575 | 39.2 | 76.325 |
| 2016-03-203:29:25 PM | 71.038 | 150.688 | 39.312 | 76.325 |
| 2016-03-203:29:29 PM | 71.038 | 150.688 | 39.425 | 76.325 |
| 2016-03-203:29:33 PM | 71.15 | 150.575 | 39.538 | 76.325 |
| 2016-03-203:29:38 PM | 71.262 | 150.575 | 39.312 | 76.325 |
| 2016-03-203:29:41 PM | 71.375 | 150.575 | 39.2 | 76.325 |
| 2016-03-203:29:45 PM | 71.488 | 150.575 | 38.975 | 76.325 |
| 2016-03-203:29:49 PM | 71.488 | 150.462 | 38.862 | 76.325 |
| 2016-03-203:29:53 PM | 71.712 | 150.575 | 38.862 | 76.325 |
| 2016-03-203:29:57 PM | 71.825 | 150.575 | 38.862 | 76.325 |
| 2016-03-203:30:02 PM | 71.938 | 150.462 | 38.975 | 76.325 |
| 2016-03-203:30:06 PM | 72.05 | 150.462 | 38.975 | 76.325 |
| 2016-03-203:30:10 PM | 72.05 | 150.462 | 38.975 | 76.325 |
| 2016-03-203:30:14 PM | 72.162 | 150.462 | 38.862 | 76.325 |
| 2016-03-203:30:18 PM | 72.05 | 150.462 | 38.862 | 76.325 |
| 2016-03-203:30:22 PM | 71.938 | 150.462 | 38.75 | 76.325 |
| 2016-03-203:30:26 PM | 71.825 | 150.35 | 38.75 | 76.325 |
| 2016-03-203:30:30 PM | 71.712 | 150.35 | 38.638 | 76.325 |
| 2016-03-203:30:34 PM | 71.712 | 150.35 | 38.525 | 76.325 |
| 2016-03-203:30:38 PM | 71.712 | 150.35 | 38.412 | 76.212 |
| 2016-03-203:30:42 PM | 71.488 | 150.238 | 38.188 | 76.212 |
| 2016-03-203:30:46 PM | 71.262 | 150.238 | 38.188 | 76.212 |
| 2016-03-203:30:50 PM | 71.15 | 150.238 | 38.075 | 76.212 |
| 2016-03-203:30:54 PM | 71.038 | 150.238 | 38.075 | 76.212 |
| 2016-03-203:30:58 PM | 70.925 | 150.238 | 38.075 | 76.212 |
| 2016-03-203:31:02 PM | 70.812 | 150.125 | 38.188 | 76.212 |
| 2016-03-203:31:07 PM | 70.812 | 150.125 | 38.188 | 76.212 |
| 2016-03-203:31:11 PM | 70.588 | 150.125 | 38.188 | 76.212 |
| 2016-03-203:31:15 PM | 70.588 | 150.125 | 38.075 | 76.212 |
| 2016-03-203:31:19 PM | 70.588 | 150.013 | 38.075 | 76.212 |
| 2016-03-203:31:23 PM | 70.475 | 150.013 | 38.075 | 76.212 |
| 2016-03-203:31:27 PM | 70.475 | 150.013 | 38.075 | 76.212 |
| 2016-03-203:31:31 PM | 70.475 | 150.013 | 38.075 | 76.212 |
| 2016-03-203:31:35 PM | 70.362 | 149.9 | 37.962 | 76.212 |
| 2016-03-203:31:39 PM | 70.138 | 149.9 | 37.962 | 76.212 |
| 2016-03-203:31:43 PM | 69.688 | 149.9 | 37.962 | 76.212 |
| 2016-03-203:31:47 PM | 69.462 | 149.9 | 37.85 | 76.212 |
| 2016-03-203:31:51 PM | 69.125 | 149.9 | 37.85 | 76.325 |
| 2016-03-203:31:55 PM | 69.012 | 149.9 | 37.962 | 76.325 |
| 2016-03-203:31:59 PM | 68.9 | 149.9 | 37.962 | 76.325 |
| 2016-03-203:32:03 PM | 69.012 | 149.788 | 38.075 | 76.325 |
| 2016-03-203:32:07 PM | 69.012 | 149.788 | 38.188 | 76.438 |
| 2016-03-203:32:11 PM | 68.9 | 149.788 | 38.188 | 76.438 |
| 2016-03-203:32:15 PM | 68.9 | 149.788 | 38.3 | 76.325 |
| 2016-03-203:32:23 PM | 68.9 | 149.788 | 38.3 | 76.325 |
| 2016-03-203:32:27 PM | 69.012 | 149.788 | 38.3 | 76.325 |
| 2016-03-203:32:31 PM | 69.012 | 149.788 | 38.412 | 76.438 |
| 2016-03-203:32:36 PM | 69.125 | 149.675 | 38.412 | 76.438 |
| 2016-03-203:32:40 PM | 69.125 | 149.675 | 38.412 | 76.438 |
| 2016-03-203:32:44 PM | 69.238 | 149.675 | 38.412 | 76.438 |
| 2016-03-203:32:48 PM | 69.238 | 149.675 | 38.412 | 76.438 |
| 2016-03-203:32:52 PM | 69.238 | 149.675 | 38.412 | 76.438 |
| 2016-03-203:32:56 PM | 69.238 | 149.675 | 38.525 | 76.325 |
| 2016-03-203:33:00 PM | 69.125 | 149.562 | 38.525 | 76.325 |
| 2016-03-203:33:04 PM | 69.238 | 149.562 | 38.412 | 76.325 |
| 2016-03-203:33:08 PM | 69.238 | 149.562 | 38.188 | 76.325 |
| 2016-03-203:33:12 PM | 69.238 | 149.45 | 37.962 | 76.325 |
| 2016-03-203:33:16 PM | 69.238 | 149.45 | 37.85 | 76.325 |
| 2016-03-203:33:20 PM | 69.238 | 149.45 | 37.85 | 76.325 |
| 2016-03-203:33:24 PM | 69.238 | 149.45 | 37.85 | 76.325 |
| 2016-03-203:33:28 PM | 69.125 | 149.338 | 37.85 | 76.325 |
| 2016-03-203:33:32 PM | 69.012 | 149.338 | 37.85 | 76.325 |
| 2016-03-203:33:36 PM | 69.125 | 149.338 | 37.85 | 76.325 |
| 2016-03-203:33:40 PM | 69.238 | 149.338 | 37.85 | 76.325 |
| 2016-03-203:33:44 PM | 69.238 | 149.225 | 37.85 | 76.325 |
| 2016-03-203:33:48 PM | 69.35 | 149.225 | 37.85 | 76.325 |
| 2016-03-203:33:52 PM | 69.462 | 149.225 | 37.738 | 76.325 |
| 2016-03-203:33:56 PM | 69.575 | 149.112 | 37.625 | 76.325 |
| 2016-03-203:34:00 PM | 69.688 | 149.112 | 37.512 | 76.325 |
| 2016-03-203:34:04 PM | 69.8 | 149.112 | 37.625 | 76.325 |
| 2016-03-203:34:08 PM | 69.8 | 149.112 | 37.625 | 76.325 |
| 2016-03-203:34:12 PM | 69.688 | 149 | 37.85 | 76.212 |
| 2016-03-203:34:16 PM | 69.575 | 149 | 37.85 | 76.212 |
| 2016-03-203:34:20 PM | 69.462 | 149 | 37.962 | 76.212 |
| 2016-03-203:34:24 PM | 69.462 | 149 | 37.962 | 76.212 |
| 2016-03-203:34:29 PM | 69.35 | 149 | 37.962 | 76.212 |
| 2016-03-203:34:33 PM | 69.238 | 148.888 | 37.962 | 76.212 |
| 2016-03-203:34:37 PM | 69.238 | 148.888 | 38.075 | 76.212 |
| 2016-03-203:34:41 PM | 69.125 | 148.888 | 38.075 | 76.212 |
| 2016-03-203:34:45 PM | 69.012 | 148.888 | 38.075 | 76.325 |
| 2016-03-203:34:49 PM | 69.012 | 148.775 | 38.188 | 76.325 |
| 2016-03-203:34:53 PM | 68.788 | 148.775 | 38.188 | 76.325 |
| 2016-03-203:34:57 PM | 68.788 | 148.775 | 38.188 | 76.325 |
| 2016-03-203:35:01 PM | 68.9 | 148.662 | 38.3 | 76.212 |
| 2016-03-203:35:05 PM | 68.788 | 148.662 | 38.412 | 76.212 |
| 2016-03-203:35:09 PM | 68.788 | 148.662 | 38.412 | 76.325 |
| 2016-03-203:35:13 PM | 68.788 | 148.662 | 38.525 | 76.212 |
| 2016-03-203:35:17 PM | 68.788 | 148.662 | 38.638 | 76.325 |
| 2016-03-203:35:21 PM | 68.788 | 148.55 | 38.638 | 76.325 |
| 2016-03-203:35:25 PM | 68.675 | 148.55 | 38.75 | 76.212 |
| 2016-03-203:35:29 PM | 68.45 | 148.55 | 38.862 | 76.325 |
| 2016-03-203:35:33 PM | 68.45 | 148.438 | 38.638 | 76.325 |
| 2016-03-203:35:37 PM | 68.338 | 148.438 | 38.75 | 76.212 |
| 2016-03-203:35:41 PM | 68.225 | 148.438 | 38.862 | 76.212 |
| 2016-03-203:35:45 PM | 68.112 | 148.438 | 38.862 | 76.325 |
| 2016-03-203:35:49 PM | 68.112 | 148.325 | 38.975 | 76.212 |
| 2016-03-203:35:53 PM | 68.112 | 148.438 | 38.862 | 76.212 |
| 2016-03-203:35:57 PM | 68.112 | 148.325 | 38.75 | 76.212 |
| 2016-03-203:36:01 PM | 68.112 | 148.325 | 38.638 | 76.212 |
| 2016-03-203:36:05 PM | 68.112 | 148.325 | 38.525 | 76.212 |
| 2016-03-203:36:09 PM | 68.112 | 148.212 | 38.525 | 76.212 |
| 2016-03-203:36:13 PM | 68.112 | 148.212 | 38.525 | 76.212 |
| 2016-03-203:36:17 PM | 68.338 | 148.212 | 38.525 | 76.212 |
| 2016-03-203:36:21 PM | 68.45 | 148.212 | 38.638 | 76.212 |
| 2016-03-203:36:26 PM | 68.562 | 148.212 | 38.75 | 76.212 |
| 2016-03-203:36:30 PM | 68.675 | 148.1 | 38.75 | 76.212 |
| 2016-03-203:36:34 PM | 68.9 | 148.1 | 38.75 | 76.212 |
| 2016-03-203:36:38 PM | 69.012 | 148.1 | 38.75 | 76.212 |
| 2016-03-203:36:42 PM | 69.125 | 148.1 | 38.638 | 76.212 |
| 2016-03-203:36:46 PM | 69.35 | 147.988 | 38.638 | 76.1 |
| 2016-03-203:36:50 PM | 69.462 | 147.988 | 38.638 | 76.1 |
| 2016-03-203:36:54 PM | 69.575 | 147.988 | 38.75 | 76.1 |
| 2016-03-203:36:58 PM | 69.688 | 147.988 | 38.75 | 76.1 |
| 2016-03-203:37:02 PM | 69.8 | 147.988 | 38.75 | 76.212 |
| 2016-03-203:37:06 PM | 69.912 | 147.875 | 38.75 | 76.1 |
| 2016-03-203:37:10 PM | 70.025 | 147.875 | 38.75 | 76.1 |
| 2016-03-203:37:14 PM | 70.138 | 147.875 | 38.75 | 76.212 |
| 2016-03-203:37:18 PM | 70.25 | 147.763 | 38.75 | 76.1 |
| 2016-03-203:37:22 PM | 70.25 | 147.763 | 38.75 | 76.1 |
| 2016-03-203:37:26 PM | 70.25 | 147.763 | 38.75 | 76.1 |
| 2016-03-203:37:30 PM | 70.362 | 147.763 | 38.638 | 76.1 |
| 2016-03-203:37:34 PM | 70.362 | 147.763 | 38.75 | 76.1 |
| 2016-03-203:37:38 PM | 70.362 | 147.65 | 38.75 | 76.1 |
| 2016-03-203:37:42 PM | 70.588 | 147.65 | 38.638 | 76.1 |
| 2016-03-203:37:46 PM | 70.7 | 147.65 | 38.638 | 76.1 |
| 2016-03-203:37:50 PM | 70.7 | 147.538 | 38.638 | 76.1 |
| 2016-03-203:37:54 PM | 70.812 | 147.538 | 38.638 | 76.1 |
| 2016-03-203:37:58 PM | 70.7 | 147.538 | 38.638 | 76.1 |
| 2016-03-203:38:02 PM | 70.588 | 147.538 | 38.75 | 76.1 |
| 2016-03-203:38:06 PM | 70.588 | 147.538 | 38.75 | 76.1 |
| 2016-03-203:38:10 PM | 70.588 | 147.425 | 38.75 | 76.1 |
| 2016-03-203:38:15 PM | 70.475 | 147.425 | 38.75 | 75.988 |
| 2016-03-203:38:19 PM | 70.475 | 147.312 | 38.75 | 76.1 |
| 2016-03-203:38:23 PM | 70.475 | 147.312 | 38.75 | 76.1 |
| 2016-03-203:38:27 PM | 70.362 | 147.312 | 38.75 | 76.1 |
| 2016-03-203:38:31 PM | 70.362 | 147.312 | 38.638 | 76.1 |
| 2016-03-203:38:35 PM | 70.475 | 147.312 | 38.75 | 76.1 |
| 2016-03-203:38:39 PM | 70.588 | 147.2 | 38.75 | 76.1 |
| 2016-03-203:38:43 PM | 70.7 | 147.2 | 38.75 | 76.1 |
| 2016-03-203:38:47 PM | 70.812 | 147.2 | 38.862 | 75.988 |
| 2016-03-203:38:51 PM | 70.812 | 147.088 | 38.862 | 76.1 |
| 2016-03-203:38:55 PM | 70.925 | 147.088 | 38.975 | 75.988 |
| 2016-03-203:38:59 PM | 71.038 | 146.975 | 39.088 | 75.988 |
| 2016-03-203:39:03 PM | 71.15 | 146.975 | 39.088 | 75.988 |
| 2016-03-203:39:07 PM | 71.15 | 146.975 | 39.088 | 75.988 |
| 2016-03-203:39:11 PM | 71.262 | 146.975 | 39.088 | 75.988 |
| 2016-03-203:39:16 PM | 71.375 | 146.975 | 39.2 | 75.988 |
| 2016-03-203:39:20 PM | 71.375 | 146.862 | 39.088 | 75.988 |
| 2016-03-203:39:24 PM | 71.488 | 146.862 | 39.2 | 75.988 |
| 2016-03-203:39:28 PM | 71.488 | 146.862 | 39.2 | 75.988 |
| 2016-03-203:39:32 PM | 71.488 | 146.862 | 39.2 | 75.988 |
| 2016-03-203:39:36 PM | 71.488 | 146.75 | 39.2 | 75.988 |
| 2016-03-203:39:40 PM | 71.488 | 146.75 | 39.2 | 75.988 |
| 2016-03-203:39:44 PM | 71.488 | 146.75 | 39.088 | 76.1 |
| 2016-03-203:39:48 PM | 71.488 | 146.75 | 38.975 | 76.1 |
| 2016-03-203:39:52 PM | 71.488 | 146.75 | 38.862 | 76.1 |
| 2016-03-203:39:56 PM | 71.488 | 146.638 | 38.75 | 76.1 |
| 2016-03-203:40:00 PM | 71.488 | 146.638 | 38.638 | 76.1 |
| 2016-03-203:40:04 PM | 71.488 | 146.638 | 38.75 | 76.1 |
| 2016-03-203:40:08 PM | 71.488 | 146.638 | 38.862 | 76.1 |
| 2016-03-203:40:12 PM | 71.375 | 146.525 | 38.862 | 76.1 |
| 2016-03-203:40:16 PM | 71.262 | 146.525 | 38.975 | 76.1 |
| 2016-03-203:40:20 PM | 71.262 | 146.525 | 38.975 | 76.212 |
| 2016-03-203:40:24 PM | 71.262 | 146.412 | 39.088 | 76.1 |
| 2016-03-203:40:28 PM | 71.15 | 146.412 | 39.088 | 76.1 |
| 2016-03-203:40:32 PM | 71.038 | 146.412 | 39.088 | 76.1 |
| 2016-03-203:40:36 PM | 71.038 | 146.412 | 39.2 | 76.1 |
| 2016-03-203:40:40 PM | 71.15 | 146.412 | 39.2 | 76.1 |
| 2016-03-203:40:44 PM | 71.262 | 146.3 | 39.312 | 76.1 |
| 2016-03-203:40:48 PM | 71.375 | 146.3 | 39.425 | 76.1 |
| 2016-03-203:40:52 PM | 71.488 | 146.3 | 39.538 | 76.212 |
| 2016-03-203:40:56 PM | 71.488 | 146.3 | 39.538 | 76.1 |
| 2016-03-203:41:00 PM | 71.488 | 146.188 | 39.65 | 76.1 |
| 2016-03-203:41:04 PM | 71.6 | 146.188 | 39.538 | 76.1 |
| 2016-03-203:41:08 PM | 71.712 | 146.188 | 39.538 | 76.1 |
| 2016-03-203:41:12 PM | 71.825 | 146.188 | 39.425 | 76.1 |
| 2016-03-203:41:16 PM | 71.938 | 146.188 | 39.538 | 76.1 |
| 2016-03-203:41:21 PM | 72.05 | 146.188 | 39.425 | 76.1 |
| 2016-03-203:41:25 PM | 72.05 | 146.075 | 39.425 | 76.1 |
| 2016-03-203:41:29 PM | 71.938 | 146.075 | 39.425 | 76.1 |
| 2016-03-203:41:33 PM | 71.938 | 146.075 | 39.425 | 76.1 |
| 2016-03-203:41:37 PM | 71.938 | 146.075 | 39.2 | 76.1 |
| 2016-03-203:41:41 PM | 71.938 | 146.075 | 39.2 | 76.1 |
| 2016-03-203:41:45 PM | 71.938 | 146.075 | 39.088 | 76.1 |
| 2016-03-203:41:49 PM | 71.938 | 146.075 | 38.975 | 76.1 |
| 2016-03-203:41:53 PM | 71.938 | 146.075 | 38.975 | 76.1 |
| 2016-03-203:41:57 PM | 71.938 | 146.075 | 38.862 | 76.1 |
| 2016-03-203:42:01 PM | 71.712 | 146.075 | 38.75 | 75.988 |
| 2016-03-203:42:05 PM | 71.488 | 146.075 | 38.75 | 76.1 |
| 2016-03-203:42:09 PM | 71.375 | 146.075 | 38.638 | 76.1 |
| 2016-03-203:42:13 PM | 71.262 | 146.075 | 38.638 | 75.988 |
| 2016-03-203:42:17 PM | 71.15 | 146.075 | 38.638 | 76.1 |
| 2016-03-203:42:21 PM | 71.15 | 145.962 | 38.525 | 75.988 |
| 2016-03-203:42:25 PM | 71.15 | 146.075 | 38.638 | 76.1 |
| 2016-03-203:42:29 PM | 71.15 | 145.962 | 38.525 | 76.1 |
| 2016-03-203:42:33 PM | 71.15 | 145.962 | 38.525 | 75.988 |
| 2016-03-203:42:37 PM | 71.038 | 145.962 | 38.525 | 76.1 |
| 2016-03-203:42:41 PM | 70.812 | 145.962 | 38.638 | 76.1 |
| 2016-03-203:42:45 PM | 70.588 | 145.962 | 38.638 | 75.988 |
| 2016-03-203:42:49 PM | 70.475 | 145.962 | 38.638 | 75.988 |
| 2016-03-203:42:53 PM | 70.475 | 145.962 | 38.75 | 75.988 |
| 2016-03-203:42:57 PM | 70.475 | 145.85 | 38.75 | 76.1 |
| 2016-03-203:43:01 PM | 70.588 | 145.85 | 38.75 | 75.988 |
| 2016-03-203:43:05 PM | 70.588 | 145.85 | 38.75 | 75.988 |
| 2016-03-203:43:10 PM | 70.7 | 145.85 | 38.75 | 76.1 |
| 2016-03-203:43:14 PM | 70.588 | 145.85 | 38.75 | 75.988 |
| 2016-03-203:43:18 PM | 70.588 | 145.85 | 38.75 | 76.1 |
| 2016-03-203:43:22 PM | 70.588 | 145.738 | 38.75 | 76.1 |
| 2016-03-203:43:26 PM | 70.588 | 145.738 | 38.638 | 75.988 |
| 2016-03-203:43:30 PM | 70.475 | 145.738 | 38.638 | 76.1 |
| 2016-03-203:43:34 PM | 70.475 | 145.738 | 38.525 | 75.988 |
| 2016-03-203:43:38 PM | 70.588 | 145.625 | 38.412 | 75.988 |
| 2016-03-203:43:42 PM | 70.588 | 145.625 | 38.3 | 76.1 |
| 2016-03-203:43:46 PM | 70.812 | 145.625 | 38.188 | 75.988 |
| 2016-03-203:43:50 PM | 70.812 | 145.625 | 38.3 | 76.1 |
| 2016-03-203:43:54 PM | 70.812 | 145.625 | 38.188 | 76.1 |
| 2016-03-203:43:58 PM | 70.7 | 145.625 | 38.075 | 75.988 |
| 2016-03-203:44:02 PM | 70.588 | 145.512 | 38.075 | 75.988 |
| 2016-03-203:44:06 PM | 70.475 | 145.512 | 38.188 | 75.988 |
| 2016-03-203:44:10 PM | 70.588 | 145.512 | 38.3 | 75.988 |
| 2016-03-203:44:14 PM | 70.475 | 145.512 | 38.412 | 75.988 |
| 2016-03-203:44:18 PM | 70.588 | 145.512 | 38.412 | 75.988 |
| 2016-03-203:44:22 PM | 70.588 | 145.512 | 38.3 | 75.988 |
| 2016-03-203:44:26 PM | 70.588 | 145.512 | 38.412 | 75.988 |
| 2016-03-203:44:30 PM | 70.588 | 145.512 | 38.412 | 75.988 |
| 2016-03-203:44:34 PM | 70.588 | 145.512 | 38.3 | 75.988 |
| 2016-03-203:44:38 PM | 70.588 | 145.512 | 38.3 | 75.988 |
| 2016-03-203:44:42 PM | 70.588 | 145.4 | 38.075 | 75.988 |
| 2016-03-203:44:46 PM | 70.588 | 145.4 | 38.075 | 75.988 |
| 2016-03-203:44:50 PM | 70.588 | 145.4 | 38.075 | 75.988 |
| 2016-03-203:44:54 PM | 70.588 | 145.4 | 37.85 | 75.988 |
| 2016-03-203:44:58 PM | 70.362 | 145.4 | 37.962 | 75.988 |
| 2016-03-203:45:02 PM | 70.475 | 145.4 | 37.962 | 76.1 |
| 2016-03-203:45:07 PM | 70.475 | 145.4 | 37.962 | 75.988 |
| 2016-03-203:45:11 PM | 70.475 | 145.4 | 37.962 | 75.988 |
| 2016-03-203:45:15 PM | 70.475 | 145.4 | 37.85 | 76.1 |
| 2016-03-203:45:19 PM | 70.588 | 145.4 | 37.962 | 76.1 |
| 2016-03-203:45:23 PM | 70.588 | 145.4 | 37.962 | 76.1 |
| 2016-03-203:45:27 PM | 70.588 | 145.4 | 37.962 | 76.1 |
| 2016-03-203:45:31 PM | 70.588 | 145.288 | 37.962 | 76.1 |
| 2016-03-203:45:35 PM | 70.588 | 145.4 | 37.962 | 76.1 |
| 2016-03-203:45:39 PM | 70.588 | 145.4 | 37.962 | 76.1 |
| 2016-03-203:45:43 PM | 70.7 | 145.288 | 37.962 | 75.988 |
| 2016-03-203:45:47 PM | 70.812 | 145.288 | 37.962 | 75.988 |
| 2016-03-203:45:51 PM | 70.812 | 145.288 | 37.85 | 76.1 |
| 2016-03-203:45:55 PM | 70.812 | 145.288 | 37.85 | 75.988 |
| 2016-03-203:45:59 PM | 70.925 | 145.288 | 37.738 | 76.1 |
| 2016-03-203:46:03 PM | 71.038 | 145.288 | 37.738 | 76.1 |
| 2016-03-203:46:07 PM | 71.038 | 145.288 | 37.738 | 76.1 |
| 2016-03-203:46:11 PM | 71.038 | 145.288 | 37.738 | 76.1 |
| 2016-03-203:46:15 PM | 70.925 | 145.288 | 37.738 | 76.1 |
| 2016-03-203:46:19 PM | 70.925 | 145.175 | 37.738 | 76.1 |
| 2016-03-203:46:23 PM | 70.925 | 145.175 | 37.738 | 76.1 |
| 2016-03-203:46:27 PM | 70.925 | 145.175 | 37.85 | 76.1 |
| 2016-03-203:46:31 PM | 70.925 | 145.175 | 37.85 | 76.1 |
| 2016-03-203:46:35 PM | 71.038 | 145.175 | 37.85 | 75.988 |
| 2016-03-203:46:39 PM | 71.038 | 145.175 | 37.962 | 75.988 |
| 2016-03-203:46:43 PM | 71.15 | 145.175 | 38.075 | 76.1 |
| 2016-03-203:46:47 PM | 71.262 | 145.175 | 38.075 | 75.988 |
| 2016-03-203:46:51 PM | 71.488 | 145.175 | 38.188 | 76.1 |
| 2016-03-203:46:55 PM | 71.6 | 145.175 | 38.3 | 76.1 |
| 2016-03-203:46:59 PM | 71.712 | 145.062 | 38.3 | 76.1 |
| 2016-03-203:47:03 PM | 71.712 | 145.062 | 38.3 | 76.1 |
| 2016-03-203:47:08 PM | 71.6 | 145.062 | 38.412 | 76.1 |
| 2016-03-203:47:12 PM | 71.488 | 144.95 | 38.412 | 75.988 |
| 2016-03-203:47:16 PM | 71.375 | 144.95 | 38.412 | 76.1 |
| 2016-03-203:47:20 PM | 71.262 | 144.95 | 38.412 | 76.1 |
| 2016-03-203:47:24 PM | 71.262 | 144.838 | 38.412 | 76.1 |
| 2016-03-203:47:28 PM | 71.262 | 144.838 | 38.412 | 76.1 |
| 2016-03-203:47:32 PM | 71.262 | 144.725 | 38.412 | 76.1 |
| 2016-03-203:47:36 PM | 71.262 | 144.725 | 38.3 | 75.988 |
| 2016-03-203:47:40 PM | 71.262 | 144.725 | 38.3 | 75.988 |
| 2016-03-203:47:44 PM | 71.262 | 144.612 | 38.3 | 75.988 |
| 2016-03-203:47:48 PM | 71.375 | 144.612 | 38.412 | 75.988 |
| 2016-03-203:47:52 PM | 71.488 | 144.5 | 38.525 | 75.988 |
| 2016-03-203:47:56 PM | 71.488 | 144.5 | 38.412 | 75.988 |
| 2016-03-203:48:00 PM | 71.6 | 144.5 | 38.3 | 75.988 |
| 2016-03-203:48:04 PM | 71.712 | 144.5 | 38.188 | 75.988 |
| 2016-03-203:48:08 PM | 71.825 | 144.388 | 38.3 | 76.1 |
| 2016-03-203:48:12 PM | 71.938 | 144.388 | 38.412 | 75.988 |
| 2016-03-203:48:15 PM | 72.05 | 144.275 | 38.412 | 75.988 |
| 2016-03-203:48:19 PM | 72.05 | 144.275 | 38.412 | 75.988 |
| 2016-03-203:48:23 PM | 71.938 | 144.275 | 38.525 | 75.988 |
| 2016-03-203:48:27 PM | 71.825 | 144.162 | 38.525 | 76.1 |
| 2016-03-203:48:31 PM | 71.825 | 144.162 | 38.525 | 75.988 |
| 2016-03-203:48:35 PM | 71.938 | 144.162 | 38.412 | 75.988 |
| 2016-03-203:48:39 PM | 71.938 | 144.05 | 38.525 | 75.988 |
| 2016-03-203:48:43 PM | 71.938 | 144.05 | 38.638 | 75.988 |
| 2016-03-203:48:47 PM | 71.938 | 143.938 | 38.638 | 75.988 |
| 2016-03-203:48:51 PM | 71.825 | 143.938 | 38.525 | 75.988 |
| 2016-03-203:48:55 PM | 71.712 | 143.825 | 38.525 | 75.988 |
| 2016-03-203:49:00 PM | 71.712 | 143.825 | 38.525 | 75.988 |
| 2016-03-203:49:04 PM | 71.6 | 143.825 | 38.412 | 75.988 |
| 2016-03-203:49:08 PM | 71.488 | 143.712 | 38.3 | 75.988 |
| 2016-03-203:49:12 PM | 71.262 | 143.712 | 38.3 | 75.988 |
| 2016-03-203:49:16 PM | 71.038 | 143.712 | 38.3 | 75.988 |
| 2016-03-203:49:20 PM | 71.038 | 143.6 | 38.188 | 75.988 |
| 2016-03-203:49:24 PM | 71.038 | 143.6 | 38.188 | 75.988 |
| 2016-03-203:49:28 PM | 70.925 | 143.6 | 38.075 | 75.875 |
| 2016-03-203:49:32 PM | 70.925 | 143.6 | 37.962 | 75.988 |
| 2016-03-203:49:36 PM | 70.925 | 143.488 | 37.738 | 75.875 |
| 2016-03-203:49:40 PM | 70.925 | 143.488 | 37.625 | 75.875 |
| 2016-03-203:49:44 PM | 70.812 | 143.375 | 37.512 | 75.875 |
| 2016-03-203:49:48 PM | 70.7 | 143.375 | 37.512 | 75.988 |
| 2016-03-203:49:52 PM | 70.475 | 143.375 | 37.512 | 75.875 |
| 2016-03-203:49:56 PM | 70.475 | 143.375 | 37.512 | 75.875 |
| 2016-03-203:50:00 PM | 70.475 | 143.262 | 37.512 | 75.988 |
| 2016-03-203:50:04 PM | 70.25 | 143.262 | 37.512 | 75.988 |
| 2016-03-203:50:08 PM | 70.138 | 143.262 | 37.512 | 75.988 |
| 2016-03-203:50:12 PM | 70.025 | 143.262 | 37.512 | 75.875 |
| 2016-03-203:50:16 PM | 69.912 | 143.15 | 37.512 | 75.988 |
| 2016-03-203:50:20 PM | 69.912 | 143.15 | 37.512 | 75.988 |
| 2016-03-203:50:24 PM | 69.912 | 143.038 | 37.4 | 75.988 |
| 2016-03-203:50:28 PM | 69.8 | 143.038 | 37.4 | 75.988 |
| 2016-03-203:50:32 PM | 69.688 | 143.038 | 37.4 | 75.988 |
| 2016-03-203:50:36 PM | 69.575 | 142.925 | 37.4 | 75.988 |
| 2016-03-203:50:40 PM | 69.688 | 142.925 | 37.288 | 75.988 |
| 2016-03-203:50:44 PM | 69.688 | 142.925 | 37.4 | 75.988 |
| 2016-03-203:50:48 PM | 69.8 | 142.925 | 37.4 | 75.988 |
| 2016-03-203:50:52 PM | 69.8 | 142.812 | 37.4 | 75.875 |
| 2016-03-203:50:56 PM | 69.912 | 142.812 | 37.4 | 75.875 |
| 2016-03-203:51:00 PM | 70.025 | 142.7 | 37.4 | 75.875 |
| 2016-03-203:51:05 PM | 70.025 | 142.7 | 37.512 | 75.988 |
| 2016-03-203:51:13 PM | 70.138 | 142.7 | 37.625 | 75.875 |
| 2016-03-203:51:17 PM | 70.25 | 142.588 | 37.625 | 75.875 |
| 2016-03-203:51:21 PM | 70.25 | 142.588 | 37.4 | 75.875 |
| 2016-03-203:51:25 PM | 70.362 | 142.588 | 37.288 | 75.875 |
| 2016-03-203:51:29 PM | 70.25 | 142.475 | 37.288 | 75.875 |
| 2016-03-203:51:33 PM | 70.25 | 142.475 | 37.175 | 75.875 |
| 2016-03-203:51:37 PM | 70.362 | 142.475 | 37.175 | 75.988 |
| 2016-03-203:51:41 PM | 70.475 | 142.362 | 37.175 | 75.875 |
| 2016-03-203:51:45 PM | 70.475 | 142.362 | 37.175 | 75.875 |
| 2016-03-203:51:49 PM | 70.475 | 142.362 | 37.175 | 75.875 |
| 2016-03-203:51:53 PM | 70.475 | 142.362 | 37.175 | 75.875 |
| 2016-03-203:51:57 PM | 70.475 | 142.362 | 37.062 | 75.875 |
| 2016-03-203:52:01 PM | 70.475 | 142.25 | 37.288 | 75.875 |
| 2016-03-203:52:05 PM | 70.362 | 142.25 | 37.4 | 75.875 |
| 2016-03-203:52:09 PM | 70.362 | 142.25 | 37.4 | 75.875 |
| 2016-03-203:52:13 PM | 70.25 | 142.138 | 37.512 | 75.875 |
| 2016-03-203:52:17 PM | 70.138 | 142.138 | 37.512 | 75.875 |
| 2016-03-203:52:21 PM | 70.138 | 142.138 | 37.512 | 75.875 |
| 2016-03-203:52:25 PM | 70.138 | 142.025 | 37.625 | 75.875 |
| 2016-03-203:52:29 PM | 70.138 | 142.025 | 37.625 | 75.875 |
| 2016-03-203:52:33 PM | 70.25 | 142.025 | 37.512 | 75.875 |
| 2016-03-203:52:37 PM | 70.25 | 142.025 | 37.4 | 75.875 |
| 2016-03-203:52:41 PM | 70.25 | 141.912 | 37.4 | 75.875 |
| 2016-03-203:52:45 PM | 70.25 | 141.912 | 37.4 | 75.875 |
| 2016-03-203:52:49 PM | 70.25 | 141.912 | 37.512 | 75.988 |
| 2016-03-203:52:53 PM | 70.25 | 141.912 | 37.512 | 75.875 |
| 2016-03-203:52:57 PM | 70.138 | 141.8 | 37.625 | 75.875 |
| 2016-03-203:53:01 PM | 70.025 | 141.8 | 37.738 | 75.875 |
| 2016-03-203:53:05 PM | 69.912 | 141.8 | 37.738 | 75.875 |
| 2016-03-203:53:09 PM | 69.688 | 141.8 | 37.738 | 75.875 |
| 2016-03-203:53:13 PM | 69.688 | 141.8 | 37.85 | 75.875 |
| 2016-03-203:53:17 PM | 69.575 | 141.688 | 37.85 | 75.875 |
| 2016-03-203:53:21 PM | 69.462 | 141.688 | 37.85 | 75.875 |
| 2016-03-203:53:26 PM | 69.35 | 141.688 | 37.962 | 75.875 |
| 2016-03-203:53:30 PM | 69.238 | 141.688 | 37.962 | 75.875 |
| 2016-03-203:53:34 PM | 69.238 | 141.688 | 37.962 | 75.875 |
| 2016-03-203:53:38 PM | 69.35 | 141.575 | 37.85 | 75.875 |
| 2016-03-203:53:42 PM | 69.35 | 141.575 | 37.962 | 75.875 |
| 2016-03-203:53:46 PM | 69.238 | 141.575 | 37.85 | 75.875 |
| 2016-03-203:53:50 PM | 69.238 | 141.462 | 37.85 | 75.875 |
| 2016-03-203:53:54 PM | 69.125 | 141.462 | 37.85 | 75.875 |
| 2016-03-203:53:58 PM | 69.125 | 141.462 | 37.85 | 75.875 |
| 2016-03-203:54:02 PM | 69.125 | 141.35 | 37.738 | 75.875 |
| 2016-03-203:54:10 PM | 69.012 | 141.35 | 37.625 | 75.875 |
| 2016-03-203:54:14 PM | 69.012 | 141.35 | 37.512 | 75.875 |
| 2016-03-203:54:21 PM | 68.9 | 141.238 | 37.512 | 75.875 |
| 2016-03-203:54:25 PM | 68.9 | 141.238 | 37.512 | 75.875 |
| 2016-03-203:54:29 PM | 68.9 | 141.125 | 37.625 | 75.762 |
| 2016-03-203:54:33 PM | 68.9 | 141.125 | 37.625 | 75.875 |
| 2016-03-203:54:37 PM | 69.012 | 141.125 | 37.625 | 75.875 |
| 2016-03-203:54:41 PM | 68.9 | 141.125 | 37.512 | 75.875 |
| 2016-03-203:54:45 PM | 68.9 | 141.012 | 37.4 | 75.875 |
| 2016-03-203:54:49 PM | 68.9 | 141.012 | 37.4 | 75.875 |
| 2016-03-203:54:53 PM | 68.788 | 141.012 | 37.4 | 75.875 |
| 2016-03-203:54:58 PM | 68.675 | 140.9 | 37.288 | 75.875 |
| 2016-03-203:55:02 PM | 68.675 | 140.9 | 37.4 | 75.875 |
| 2016-03-203:55:06 PM | 68.562 | 140.9 | 37.512 | 75.875 |
| 2016-03-203:55:10 PM | 68.45 | 140.9 | 37.512 | 75.875 |
| 2016-03-203:55:14 PM | 68.225 | 140.788 | 37.512 | 75.875 |
| 2016-03-203:55:18 PM | 68.112 | 140.788 | 37.625 | 75.875 |
| 2016-03-203:55:22 PM | 68.112 | 140.675 | 37.512 | 75.875 |
| 2016-03-203:55:26 PM | 68 | 140.562 | 37.512 | 75.762 |
| 2016-03-203:55:30 PM | 67.775 | 140.562 | 37.512 | 75.875 |
| 2016-03-203:55:34 PM | 67.775 | 140.562 | 37.512 | 75.875 |
| 2016-03-203:55:38 PM | 67.662 | 140.562 | 37.625 | 75.875 |
| 2016-03-203:55:42 PM | 67.775 | 140.562 | 37.625 | 75.875 |
| 2016-03-203:55:46 PM | 67.775 | 140.562 | 37.625 | 75.875 |
| 2016-03-203:55:50 PM | 67.775 | 140.45 | 37.512 | 75.875 |
| 2016-03-203:55:54 PM | 67.775 | 140.45 | 37.625 | 75.875 |
| 2016-03-203:55:58 PM | 67.775 | 140.338 | 37.625 | 75.875 |
| 2016-03-203:56:02 PM | 67.888 | 140.338 | 37.625 | 75.762 |
| 2016-03-203:56:06 PM | 68 | 140.338 | 37.625 | 75.875 |
| 2016-03-203:56:10 PM | 68 | 140.338 | 37.625 | 75.875 |
| 2016-03-203:56:14 PM | 68 | 140.338 | 37.4 | 75.762 |
| 2016-03-203:56:18 PM | 68.112 | 140.225 | 37.4 | 75.762 |
| 2016-03-203:56:22 PM | 68.225 | 140.225 | 37.4 | 75.762 |
| 2016-03-203:56:26 PM | 68.338 | 140.112 | 37.4 | 75.762 |
| 2016-03-203:56:30 PM | 68.45 | 140.112 | 37.512 | 75.762 |
| 2016-03-203:56:34 PM | 68.45 | 140 | 37.512 | 75.762 |
| 2016-03-203:56:38 PM | 68.562 | 140 | 37.512 | 75.762 |
| 2016-03-203:56:42 PM | 68.562 | 140 | 37.512 | 75.762 |
| 2016-03-203:56:46 PM | 68.562 | 140 | 37.512 | 75.762 |
| 2016-03-203:56:50 PM | 68.675 | 140 | 37.512 | 75.762 |
| 2016-03-203:56:54 PM | 68.788 | 140 | 37.625 | 75.762 |
| 2016-03-203:56:58 PM | 68.9 | 139.888 | 37.512 | 75.762 |
| 2016-03-203:57:03 PM | 68.9 | 139.888 | 37.625 | 75.762 |
| 2016-03-203:57:07 PM | 68.9 | 139.888 | 37.625 | 75.762 |
| 2016-03-203:57:11 PM | 69.012 | 139.775 | 37.625 | 75.762 |
| 2016-03-203:57:15 PM | 69.125 | 139.775 | 37.625 | 75.762 |
| 2016-03-203:57:19 PM | 69.238 | 139.775 | 37.625 | 75.762 |
| 2016-03-203:57:23 PM | 69.35 | 139.662 | 37.738 | 75.762 |
| 2016-03-203:57:27 PM | 69.462 | 139.662 | 37.512 | 75.762 |
| 2016-03-203:57:31 PM | 69.575 | 139.55 | 37.512 | 75.762 |
| 2016-03-203:57:35 PM | 69.688 | 139.662 | 37.4 | 75.762 |
| 2016-03-203:57:39 PM | 69.688 | 139.55 | 37.288 | 75.762 |
| 2016-03-203:57:43 PM | 69.8 | 139.55 | 37.288 | 75.762 |
| 2016-03-203:57:47 PM | 69.8 | 139.55 | 37.288 | 75.762 |
| 2016-03-203:57:51 PM | 69.912 | 139.438 | 37.288 | 75.762 |
| 2016-03-203:57:55 PM | 69.912 | 139.438 | 37.4 | 75.762 |
| 2016-03-203:57:59 PM | 70.025 | 139.438 | 37.288 | 75.762 |
| 2016-03-203:58:03 PM | 70.138 | 139.325 | 37.175 | 75.65 |
| 2016-03-203:58:07 PM | 70.25 | 139.325 | 36.95 | 75.65 |
| 2016-03-203:58:11 PM | 70.362 | 139.325 | 36.725 | 75.65 |
| 2016-03-203:58:15 PM | 70.475 | 139.212 | 36.5 | 75.65 |
| 2016-03-203:58:19 PM | 70.588 | 139.212 | 36.388 | 75.65 |
| 2016-03-203:58:23 PM | 70.588 | 139.212 | 36.275 | 75.65 |
| 2016-03-203:58:27 PM | 70.7 | 139.1 | 36.275 | 75.65 |
| 2016-03-203:58:31 PM | 70.7 | 139.1 | 36.388 | 75.65 |
| 2016-03-203:58:35 PM | 70.812 | 139.1 | 36.275 | 75.65 |
| 2016-03-203:58:39 PM | 70.812 | 138.988 | 36.388 | 75.65 |
| 2016-03-203:58:43 PM | 70.925 | 138.988 | 36.388 | 75.65 |
| 2016-03-203:58:47 PM | 70.925 | 138.988 | 36.388 | 75.65 |
| 2016-03-203:58:51 PM | 71.038 | 138.875 | 36.388 | 75.65 |
| 2016-03-203:58:55 PM | 71.038 | 138.875 | 36.388 | 75.538 |
| 2016-03-203:58:59 PM | 71.038 | 138.875 | 36.388 | 75.65 |
| 2016-03-203:59:04 PM | 71.15 | 138.875 | 36.388 | 75.65 |
| 2016-03-203:59:08 PM | 71.15 | 138.762 | 36.5 | 75.538 |
| 2016-03-203:59:15 PM | 71.262 | 138.762 | 36.725 | 75.538 |
| 2016-03-203:59:19 PM | 71.262 | 138.65 | 36.725 | 75.538 |
| 2016-03-203:59:23 PM | 71.375 | 138.65 | 36.725 | 75.538 |
| 2016-03-203:59:27 PM | 71.488 | 138.65 | 36.725 | 75.538 |
| 2016-03-203:59:31 PM | 71.488 | 138.65 | 36.725 | 75.538 |
| 2016-03-203:59:35 PM | 71.488 | 138.65 | 36.838 | 75.538 |
| 2016-03-203:59:40 PM | 71.488 | 138.538 | 36.725 | 75.538 |
| 2016-03-203:59:44 PM | 71.6 | 138.425 | 36.612 | 75.538 |
| 2016-03-203:59:48 PM | 71.6 | 138.425 | 36.5 | 75.538 |
| 2016-03-203:59:52 PM | 71.712 | 138.425 | 36.5 | 75.538 |
| 2016-03-203:59:56 PM | 71.825 | 138.425 | 36.5 | 75.538 |
| 2016-03-204:00:00 PM | 71.825 | 138.425 | 36.5 | 75.538 |
| 2016-03-204:00:04 PM | 71.712 | 138.312 | 36.5 | 75.538 |
| 2016-03-204:00:08 PM | 71.6 | 138.425 | 36.5 | 75.538 |
| 2016-03-204:00:12 PM | 71.488 | 138.312 | 36.612 | 75.538 |
| 2016-03-204:00:16 PM | 71.262 | 138.312 | 36.725 | 75.538 |
| 2016-03-204:00:20 PM | 71.15 | 138.2 | 36.725 | 75.425 |
| 2016-03-204:00:24 PM | 71.15 | 138.2 | 36.838 | 75.538 |
| 2016-03-204:00:28 PM | 71.15 | 138.2 | 36.838 | 75.538 |
| 2016-03-204:00:32 PM | 71.262 | 138.2 | 36.838 | 75.538 |
| 2016-03-204:00:36 PM | 71.375 | 138.2 | 36.838 | 75.538 |
| 2016-03-204:00:40 PM | 71.375 | 138.088 | 36.725 | 75.538 |
| 2016-03-204:00:44 PM | 71.375 | 138.088 | 36.725 | 75.538 |
| 2016-03-204:00:48 PM | 71.488 | 137.975 | 36.612 | 75.538 |
| 2016-03-204:00:52 PM | 71.375 | 137.975 | 36.612 | 75.538 |
| 2016-03-204:00:56 PM | 71.262 | 137.975 | 36.612 | 75.538 |
| 2016-03-204:01:00 PM | 71.15 | 137.75 | 36.612 | 75.538 |
| 2016-03-204:01:04 PM | 71.15 | 137.75 | 36.5 | 75.538 |
| 2016-03-204:01:08 PM | 71.15 | 137.75 | 36.5 | 75.538 |
| 2016-03-204:01:12 PM | 71.15 | 137.638 | 36.5 | 75.538 |
| 2016-03-204:01:16 PM | 71.038 | 137.638 | 36.612 | 75.538 |
| 2016-03-204:01:20 PM | 70.925 | 137.525 | 36.725 | 75.425 |
| 2016-03-204:01:24 PM | 70.925 | 137.525 | 36.838 | 75.425 |
| 2016-03-204:01:28 PM | 71.038 | 137.525 | 36.838 | 75.425 |
| 2016-03-204:01:32 PM | 71.038 | 137.525 | 36.95 | 75.425 |
| 2016-03-204:01:36 PM | 71.038 | 137.412 | 36.838 | 75.425 |
| 2016-03-204:01:40 PM | 70.925 | 137.412 | 36.725 | 75.425 |
| 2016-03-204:01:44 PM | 70.812 | 137.3 | 36.838 | 75.425 |
| 2016-03-204:01:48 PM | 70.7 | 137.3 | 36.838 | 75.425 |
| 2016-03-204:01:52 PM | 70.7 | 137.188 | 36.838 | 75.425 |
| 2016-03-204:01:56 PM | 70.588 | 137.188 | 36.95 | 75.538 |
| 2016-03-204:02:00 PM | 70.362 | 137.188 | 37.062 | 75.425 |
| 2016-03-204:02:04 PM | 69.912 | 137.188 | 37.175 | 75.425 |
| 2016-03-204:02:08 PM | 69.688 | 137.075 | 37.175 | 75.425 |
| 2016-03-204:02:12 PM | 69.462 | 137.075 | 37.175 | 75.425 |
| 2016-03-204:02:16 PM | 69.35 | 137.075 | 37.175 | 75.425 |
| 2016-03-204:02:20 PM | 69.238 | 136.962 | 37.175 | 75.425 |
| 2016-03-204:02:24 PM | 69.012 | 136.962 | 37.288 | 75.425 |
| 2016-03-204:02:28 PM | 68.9 | 136.962 | 37.4 | 75.425 |
| 2016-03-204:02:33 PM | 68.788 | 136.962 | 37.4 | 75.425 |
| 2016-03-204:02:37 PM | 68.675 | 136.85 | 37.288 | 75.425 |
| 2016-03-204:02:41 PM | 68.562 | 136.85 | 37.288 | 75.425 |
| 2016-03-204:02:45 PM | 68.562 | 136.85 | 37.288 | 75.425 |
| 2016-03-204:02:49 PM | 68.45 | 136.738 | 37.288 | 75.425 |
| 2016-03-204:02:53 PM | 68.45 | 136.738 | 37.4 | 75.425 |
| 2016-03-204:02:57 PM | 68.338 | 136.738 | 37.4 | 75.425 |
| 2016-03-204:03:01 PM | 68.338 | 136.738 | 37.512 | 75.425 |
| 2016-03-204:03:05 PM | 68.338 | 136.738 | 37.512 | 75.425 |
| 2016-03-204:03:09 PM | 68.338 | 136.738 | 37.625 | 75.425 |
| 2016-03-204:03:13 PM | 68.338 | 136.625 | 37.512 | 75.425 |
| 2016-03-204:03:17 PM | 68.225 | 136.625 | 37.512 | 75.425 |
| 2016-03-204:03:21 PM | 68.225 | 136.625 | 37.512 | 75.425 |
| 2016-03-204:03:25 PM | 68.338 | 136.512 | 37.512 | 75.425 |
| 2016-03-204:03:29 PM | 68.338 | 136.512 | 37.512 | 75.425 |
| 2016-03-204:03:33 PM | 68.45 | 136.512 | 37.512 | 75.425 |
| 2016-03-204:03:37 PM | 68.338 | 136.512 | 37.512 | 75.425 |
| 2016-03-204:03:41 PM | 68.112 | 136.4 | 37.625 | 75.425 |
| 2016-03-204:03:45 PM | 68 | 136.512 | 37.625 | 75.425 |
| 2016-03-204:03:49 PM | 67.888 | 136.512 | 37.625 | 75.425 |
| 2016-03-204:03:53 PM | 67.775 | 136.4 | 37.625 | 75.425 |
| 2016-03-204:03:57 PM | 67.775 | 136.4 | 37.4 | 75.425 |
| 2016-03-204:04:01 PM | 67.888 | 136.4 | 37.4 | 75.425 |
| 2016-03-204:04:05 PM | 67.775 | 136.4 | 37.288 | 75.425 |
| 2016-03-204:04:09 PM | 67.55 | 136.4 | 37.288 | 75.425 |
| 2016-03-204:04:13 PM | 67.438 | 136.288 | 37.288 | 75.425 |
| 2016-03-204:04:17 PM | 67.325 | 136.288 | 37.288 | 75.425 |
| 2016-03-204:04:21 PM | 67.325 | 136.288 | 37.175 | 75.425 |
| 2016-03-204:04:25 PM | 67.325 | 136.288 | 37.175 | 75.425 |
| 2016-03-204:04:29 PM | 67.438 | 136.288 | 37.288 | 75.538 |
| 2016-03-204:04:33 PM | 67.325 | 136.288 | 37.4 | 75.538 |
| 2016-03-204:04:37 PM | 67.438 | 136.288 | 37.512 | 75.538 |
| 2016-03-204:04:41 PM | 67.55 | 136.288 | 37.4 | 75.538 |
| 2016-03-204:04:45 PM | 67.662 | 136.288 | 37.4 | 75.538 |
| 2016-03-204:04:49 PM | 67.775 | 136.288 | 37.288 | 75.538 |
| 2016-03-204:04:53 PM | 67.775 | 136.175 | 37.062 | 75.538 |
| 2016-03-204:04:57 PM | 67.775 | 136.175 | 37.062 | 75.538 |
| 2016-03-204:05:01 PM | 67.662 | 136.175 | 36.95 | 75.538 |
| 2016-03-204:05:05 PM | 67.438 | 136.175 | 36.95 | 75.538 |
| 2016-03-204:05:09 PM | 67.438 | 136.175 | 36.838 | 75.538 |
| 2016-03-204:05:13 PM | 67.55 | 136.062 | 36.725 | 75.538 |
| 2016-03-204:05:17 PM | 67.55 | 136.062 | 36.725 | 75.538 |
| 2016-03-204:05:21 PM | 67.662 | 136.062 | 36.725 | 75.538 |
| 2016-03-204:05:25 PM | 67.775 | 136.062 | 36.725 | 75.538 |
| 2016-03-204:05:30 PM | 67.888 | 136.062 | 36.725 | 75.65 |
| 2016-03-204:05:34 PM | 68 | 135.95 | 36.725 | 75.538 |
| 2016-03-204:05:38 PM | 68.112 | 135.95 | 36.725 | 75.65 |
| 2016-03-204:05:42 PM | 68.225 | 135.95 | 36.838 | 75.65 |
| 2016-03-204:05:46 PM | 68.338 | 135.95 | 36.838 | 75.65 |
| 2016-03-204:05:50 PM | 68.45 | 135.95 | 36.95 | 75.65 |
| 2016-03-204:05:54 PM | 68.45 | 135.95 | 37.062 | 75.65 |
| 2016-03-204:05:58 PM | 68.675 | 135.838 | 37.062 | 75.65 |
| 2016-03-204:06:02 PM | 68.788 | 135.838 | 37.175 | 75.65 |
| 2016-03-204:06:06 PM | 68.9 | 135.838 | 37.288 | 75.65 |
| 2016-03-204:06:10 PM | 69.012 | 135.838 | 37.288 | 75.65 |
| 2016-03-204:06:14 PM | 69.125 | 135.838 | 37.4 | 75.65 |
| 2016-03-204:06:18 PM | 69.125 | 135.725 | 37.4 | 75.65 |
| 2016-03-204:06:22 PM | 69.125 | 135.725 | 37.4 | 75.65 |
| 2016-03-204:06:26 PM | 69.238 | 135.725 | 37.4 | 75.65 |
| 2016-03-204:06:30 PM | 69.238 | 135.725 | 37.4 | 75.65 |
| 2016-03-204:06:34 PM | 69.35 | 135.725 | 37.4 | 75.65 |
| 2016-03-204:06:38 PM | 69.238 | 135.612 | 37.288 | 75.65 |
| 2016-03-204:06:42 PM | 69.35 | 135.612 | 37.175 | 75.65 |
| 2016-03-204:06:46 PM | 69.35 | 135.612 | 37.288 | 75.65 |
| 2016-03-204:06:50 PM | 69.35 | 135.612 | 37.288 | 75.65 |
| 2016-03-204:06:54 PM | 69.35 | 135.612 | 37.288 | 75.538 |
| 2016-03-204:06:58 PM | 69.462 | 135.5 | 37.288 | 75.65 |
| 2016-03-204:07:02 PM | 69.462 | 135.5 | 37.175 | 75.538 |
| 2016-03-204:07:06 PM | 69.35 | 135.5 | 37.175 | 75.65 |
| 2016-03-204:07:10 PM | 69.35 | 135.388 | 37.175 | 75.538 |
| 2016-03-204:07:14 PM | 69.35 | 135.388 | 37.288 | 75.65 |
| 2016-03-204:07:18 PM | 69.35 | 135.388 | 37.288 | 75.65 |
| 2016-03-204:07:22 PM | 69.238 | 135.388 | 37.4 | 75.65 |
| 2016-03-204:07:26 PM | 69.125 | 135.388 | 37.4 | 75.65 |
| 2016-03-204:07:30 PM | 69.012 | 135.275 | 37.4 | 75.65 |
| 2016-03-204:07:34 PM | 69.012 | 135.388 | 37.512 | 75.65 |
| 2016-03-204:07:38 PM | 69.012 | 135.275 | 37.512 | 75.65 |
| 2016-03-204:07:43 PM | 69.012 | 135.275 | 37.625 | 75.65 |
| 2016-03-204:07:47 PM | 69.125 | 135.275 | 37.512 | 75.65 |
| 2016-03-204:07:55 PM | 69.125 | 135.275 | 37.625 | 75.538 |
| 2016-03-204:07:59 PM | 69.125 | 135.162 | 37.625 | 75.538 |
| 2016-03-204:08:03 PM | 69.238 | 135.275 | 37.625 | 75.538 |
| 2016-03-204:08:07 PM | 69.238 | 135.162 | 37.512 | 75.538 |
| 2016-03-204:08:11 PM | 69.238 | 135.162 | 37.625 | 75.538 |
| 2016-03-204:08:15 PM | 69.238 | 135.162 | 37.512 | 75.538 |
| 2016-03-204:08:19 PM | 69.238 | 135.05 | 37.625 | 75.538 |
| 2016-03-204:08:23 PM | 69.012 | 135.05 | 37.625 | 75.538 |
| 2016-03-204:08:27 PM | 68.9 | 135.05 | 37.738 | 75.538 |
| 2016-03-204:08:31 PM | 68.788 | 135.05 | 37.85 | 75.538 |
| 2016-03-204:08:35 PM | 68.675 | 135.05 | 37.738 | 75.538 |
| 2016-03-204:08:39 PM | 68.675 | 135.05 | 37.738 | 75.538 |
| 2016-03-204:08:43 PM | 68.562 | 135.05 | 37.625 | 75.538 |
| 2016-03-204:08:47 PM | 68.45 | 135.05 | 37.625 | 75.538 |
| 2016-03-204:08:51 PM | 68.225 | 135.05 | 37.512 | 75.538 |
| 2016-03-204:08:55 PM | 68.112 | 135.05 | 37.512 | 75.538 |
| 2016-03-204:08:59 PM | 68.112 | 135.05 | 37.512 | 75.538 |
| 2016-03-204:09:03 PM | 68 | 135.05 | 37.512 | 75.538 |
| 2016-03-204:09:07 PM | 68 | 135.05 | 37.512 | 75.538 |
| 2016-03-204:09:11 PM | 68 | 135.05 | 37.512 | 75.538 |
| 2016-03-204:09:15 PM | 68 | 135.05 | 37.512 | 75.538 |
| 2016-03-204:09:19 PM | 68 | 134.938 | 37.625 | 75.538 |
| 2016-03-204:09:23 PM | 68 | 134.938 | 37.625 | 75.538 |
| 2016-03-204:09:27 PM | 68.112 | 134.938 | 37.512 | 75.538 |
| 2016-03-204:09:31 PM | 68.225 | 134.938 | 37.4 | 75.538 |
| 2016-03-204:09:35 PM | 68.338 | 134.938 | 37.4 | 75.538 |
| 2016-03-204:09:39 PM | 68.45 | 134.825 | 37.512 | 75.538 |
| 2016-03-204:09:43 PM | 68.562 | 134.825 | 37.625 | 75.538 |
| 2016-03-204:09:47 PM | 68.675 | 134.825 | 37.512 | 75.538 |
| 2016-03-204:09:51 PM | 68.788 | 134.825 | 37.625 | 75.65 |
| 2016-03-204:09:55 PM | 68.788 | 134.712 | 37.512 | 75.538 |
| 2016-03-204:09:59 PM | 68.788 | 134.712 | 37.512 | 75.538 |
| 2016-03-204:10:04 PM | 68.9 | 134.712 | 37.288 | 75.538 |
| 2016-03-204:10:08 PM | 69.012 | 134.6 | 37.288 | 75.538 |
| 2016-03-204:10:12 PM | 69.012 | 134.6 | 37.062 | 75.538 |
| 2016-03-204:10:16 PM | 69.125 | 134.6 | 37.062 | 75.425 |
| 2016-03-204:10:20 PM | 69.125 | 134.6 | 37.062 | 75.425 |
| 2016-03-204:10:24 PM | 69.125 | 134.488 | 37.062 | 75.425 |
| 2016-03-204:10:28 PM | 69.238 | 134.488 | 37.175 | 75.425 |
| 2016-03-204:10:32 PM | 69.238 | 134.488 | 37.175 | 75.425 |
| 2016-03-204:10:36 PM | 69.238 | 134.488 | 37.288 | 75.425 |
| 2016-03-204:10:43 PM | 69.238 | 134.375 | 37.288 | 75.425 |
| 2016-03-204:10:47 PM | 69.35 | 134.375 | 37.288 | 75.425 |
| 2016-03-204:10:51 PM | 69.35 | 134.375 | 37.288 | 75.425 |
| 2016-03-204:10:55 PM | 69.35 | 134.262 | 37.288 | 75.425 |
| 2016-03-204:10:59 PM | 69.238 | 134.262 | 37.175 | 75.425 |
| 2016-03-204:11:03 PM | 69.238 | 134.262 | 37.062 | 75.425 |
| 2016-03-204:11:07 PM | 69.125 | 134.15 | 37.062 | 75.425 |
| 2016-03-204:11:11 PM | 69.012 | 134.038 | 37.175 | 75.425 |
| 2016-03-204:11:15 PM | 68.9 | 134.038 | 37.062 | 75.312 |
| 2016-03-204:11:19 PM | 68.788 | 134.038 | 37.175 | 75.312 |
| 2016-03-204:11:24 PM | 68.675 | 134.038 | 37.175 | 75.312 |
| 2016-03-204:11:28 PM | 68.562 | 134.038 | 37.062 | 75.312 |
| 2016-03-204:11:32 PM | 68.338 | 133.925 | 37.062 | 75.312 |
| 2016-03-204:11:36 PM | 68.225 | 133.925 | 36.95 | 75.312 |
| 2016-03-204:11:40 PM | 68.112 | 133.925 | 36.95 | 75.312 |
| 2016-03-204:11:44 PM | 68 | 133.925 | 36.95 | 75.312 |
| 2016-03-204:11:48 PM | 68.112 | 133.925 | 37.062 | 75.312 |
| 2016-03-204:11:52 PM | 68 | 133.812 | 36.95 | 75.312 |
| 2016-03-204:11:56 PM | 68 | 133.812 | 37.062 | 75.312 |
| 2016-03-204:12:00 PM | 68 | 133.812 | 36.95 | 75.312 |
| 2016-03-204:12:04 PM | 68 | 133.812 | 36.95 | 75.2 |
| 2016-03-204:12:08 PM | 68.112 | 133.7 | 36.95 | 75.312 |
| 2016-03-204:12:12 PM | 68.112 | 133.7 | 36.95 | 75.312 |
| 2016-03-204:12:16 PM | 68.112 | 133.7 | 36.95 | 75.312 |
| 2016-03-204:12:20 PM | 68.225 | 133.7 | 36.95 | 75.312 |
| 2016-03-204:12:24 PM | 68.225 | 133.7 | 36.838 | 75.2 |
| 2016-03-204:12:28 PM | 68.338 | 133.7 | 36.838 | 75.312 |
| 2016-03-204:12:32 PM | 68.338 | 133.588 | 36.725 | 75.2 |
| 2016-03-204:12:36 PM | 68.338 | 133.588 | 36.725 | 75.312 |
| 2016-03-204:12:40 PM | 68.225 | 133.588 | 36.725 | 75.2 |
| 2016-03-204:12:44 PM | 68.112 | 133.475 | 36.725 | 75.312 |
| 2016-03-204:12:48 PM | 68.225 | 133.588 | 36.725 | 75.312 |
| 2016-03-204:12:52 PM | 68.225 | 133.475 | 36.725 | 75.2 |
| 2016-03-204:12:56 PM | 68.225 | 133.475 | 36.725 | 75.312 |
| 2016-03-204:13:00 PM | 68.338 | 133.362 | 36.612 | 75.2 |
| 2016-03-204:13:04 PM | 68.338 | 133.362 | 36.5 | 75.2 |
| 2016-03-204:13:08 PM | 68.45 | 133.362 | 36.5 | 75.2 |
| 2016-03-204:13:12 PM | 68.45 | 133.25 | 36.5 | 75.2 |
| 2016-03-204:13:16 PM | 68.45 | 133.25 | 36.5 | 75.2 |
| 2016-03-204:13:20 PM | 68.562 | 133.25 | 36.5 | 75.2 |
| 2016-03-204:13:24 PM | 68.562 | 133.25 | 36.275 | 75.2 |
| 2016-03-204:13:28 PM | 68.562 | 133.138 | 36.275 | 75.2 |
| 2016-03-204:13:32 PM | 68.675 | 133.138 | 36.275 | 75.312 |
| 2016-03-204:13:36 PM | 68.675 | 133.138 | 36.388 | 75.2 |
| 2016-03-204:13:40 PM | 68.675 | 133.025 | 36.388 | 75.312 |
| 2016-03-204:13:44 PM | 68.675 | 133.025 | 36.388 | 75.2 |
| 2016-03-204:13:49 PM | 68.675 | 132.912 | 36.388 | 75.2 |
| 2016-03-204:13:53 PM | 68.788 | 132.912 | 36.5 | 75.2 |
| 2016-03-204:13:57 PM | 68.788 | 132.8 | 36.5 | 75.312 |
| 2016-03-204:14:01 PM | 68.9 | 132.8 | 36.5 | 75.2 |
| 2016-03-204:14:05 PM | 68.9 | 132.688 | 36.612 | 75.2 |
| 2016-03-204:14:09 PM | 69.125 | 132.688 | 36.612 | 75.2 |
| 2016-03-204:14:13 PM | 69.125 | 132.688 | 36.725 | 75.2 |
| 2016-03-204:14:17 PM | 69.35 | 132.575 | 36.725 | 75.2 |
| 2016-03-204:14:21 PM | 69.462 | 132.575 | 36.725 | 75.2 |
| 2016-03-204:14:25 PM | 69.462 | 132.462 | 36.95 | 75.2 |
| 2016-03-204:14:29 PM | 69.575 | 132.462 | 37.062 | 75.2 |
| 2016-03-204:14:33 PM | 69.688 | 132.35 | 37.062 | 75.2 |
| 2016-03-204:14:37 PM | 69.8 | 132.35 | 37.175 | 75.2 |
| 2016-03-204:14:41 PM | 69.8 | 132.238 | 36.95 | 75.2 |
| 2016-03-204:14:45 PM | 69.912 | 132.238 | 36.95 | 75.2 |
| 2016-03-204:14:49 PM | 69.912 | 132.238 | 36.95 | 75.2 |
| 2016-03-204:14:53 PM | 69.912 | 132.125 | 36.95 | 75.2 |
| 2016-03-204:14:57 PM | 69.8 | 132.125 | 37.062 | 75.2 |
| 2016-03-204:15:01 PM | 69.8 | 132.125 | 37.062 | 75.2 |
| 2016-03-204:15:05 PM | 69.688 | 132.012 | 37.062 | 75.2 |
| 2016-03-204:15:09 PM | 69.688 | 131.9 | 37.175 | 75.2 |
| 2016-03-204:15:13 PM | 69.8 | 131.9 | 37.175 | 75.2 |
| 2016-03-204:15:17 PM | 69.912 | 131.9 | 37.175 | 75.2 |
| 2016-03-204:15:21 PM | 70.025 | 131.788 | 37.175 | 75.2 |
| 2016-03-204:15:25 PM | 70.025 | 131.788 | 37.288 | 75.2 |
| 2016-03-204:15:29 PM | 70.138 | 131.788 | 37.175 | 75.2 |
| 2016-03-204:15:33 PM | 70.25 | 131.675 | 37.175 | 75.2 |
| 2016-03-204:15:37 PM | 70.138 | 131.675 | 37.175 | 75.2 |
| 2016-03-204:15:41 PM | 70.138 | 131.675 | 37.288 | 75.2 |
| 2016-03-204:15:45 PM | 70.138 | 131.562 | 37.4 | 75.2 |
| 2016-03-204:15:49 PM | 70.138 | 131.562 | 37.4 | 75.2 |
| 2016-03-204:15:53 PM | 70.025 | 131.562 | 37.512 | 75.2 |
| 2016-03-204:15:57 PM | 70.025 | 131.45 | 37.4 | 75.2 |
| 2016-03-204:16:01 PM | 70.025 | 131.45 | 37.512 | 75.2 |
| 2016-03-204:16:06 PM | 69.688 | 131.45 | 37.512 | 75.2 |
| 2016-03-204:16:10 PM | 69.35 | 131.338 | 37.512 | 75.2 |
| 2016-03-204:16:14 PM | 69.125 | 131.338 | 37.512 | 75.2 |
| 2016-03-204:16:18 PM | 68.788 | 131.338 | 37.512 | 75.2 |
| 2016-03-204:16:22 PM | 68.562 | 131.338 | 37.512 | 75.2 |
| 2016-03-204:16:26 PM | 68.562 | 131.225 | 37.4 | 75.2 |
| 2016-03-204:16:30 PM | 68.45 | 131.225 | 37.512 | 75.2 |
| 2016-03-204:16:34 PM | 68.562 | 131.225 | 37.512 | 75.2 |
| 2016-03-204:16:38 PM | 68.45 | 131.112 | 37.625 | 75.2 |
| 2016-03-204:16:42 PM | 68.338 | 131.112 | 37.625 | 75.2 |
| 2016-03-204:16:46 PM | 68.338 | 131.112 | 37.625 | 75.2 |
| 2016-03-204:16:50 PM | 68.225 | 131.112 | 37.738 | 75.2 |
| 2016-03-204:16:54 PM | 68.112 | 131.112 | 37.738 | 75.088 |
| 2016-03-204:16:58 PM | 68 | 131.112 | 37.738 | 75.2 |
| 2016-03-204:17:02 PM | 67.888 | 131 | 37.738 | 75.088 |
| 2016-03-204:17:06 PM | 67.775 | 131 | 37.738 | 75.088 |
| 2016-03-204:17:10 PM | 67.662 | 131 | 37.85 | 75.088 |
| 2016-03-204:17:14 PM | 67.55 | 131 | 37.85 | 75.2 |
| 2016-03-204:17:18 PM | 67.438 | 130.887 | 37.85 | 75.2 |
| 2016-03-204:17:22 PM | 67.325 | 130.887 | 37.738 | 75.2 |
| 2016-03-204:17:26 PM | 67.325 | 130.887 | 37.625 | 75.088 |
| 2016-03-204:17:30 PM | 67.212 | 130.887 | 37.512 | 75.088 |
| 2016-03-204:17:34 PM | 67.212 | 130.887 | 37.512 | 75.088 |
| 2016-03-204:17:38 PM | 67.212 | 130.775 | 37.512 | 75.088 |
| 2016-03-204:17:42 PM | 67.1 | 130.775 | 37.4 | 75.088 |
| 2016-03-204:17:46 PM | 67.212 | 130.775 | 37.4 | 75.088 |
| 2016-03-204:17:50 PM | 67.212 | 130.775 | 37.4 | 75.088 |
| 2016-03-204:17:54 PM | 67.212 | 130.662 | 37.4 | 75.088 |
| 2016-03-204:17:58 PM | 67.212 | 130.55 | 37.4 | 75.088 |
| 2016-03-204:18:02 PM | 67.212 | 130.55 | 37.512 | 75.088 |
| 2016-03-204:18:06 PM | 67.1 | 130.55 | 37.512 | 75.088 |
| 2016-03-204:18:10 PM | 67.1 | 130.55 | 37.625 | 75.088 |
| 2016-03-204:18:14 PM | 67.1 | 130.55 | 37.512 | 75.088 |
| 2016-03-204:18:18 PM | 66.988 | 130.438 | 37.512 | 75.088 |
| 2016-03-204:18:23 PM | 66.762 | 130.438 | 37.4 | 75.088 |
| 2016-03-204:18:27 PM | 66.65 | 130.438 | 37.4 | 75.088 |
| 2016-03-204:18:31 PM | 66.538 | 130.325 | 37.4 | 75.088 |
| 2016-03-204:18:35 PM | 66.538 | 130.212 | 37.4 | 75.088 |
| 2016-03-204:18:39 PM | 66.425 | 130.212 | 37.288 | 75.088 |
| 2016-03-204:18:43 PM | 66.2 | 130.212 | 37.4 | 75.088 |
| 2016-03-204:18:47 PM | 66.088 | 130.212 | 37.288 | 75.088 |
| 2016-03-204:18:51 PM | 65.975 | 130.1 | 37.175 | 75.088 |
| 2016-03-204:18:55 PM | 65.862 | 130.1 | 37.175 | 75.088 |
| 2016-03-204:18:59 PM | 65.862 | 129.988 | 36.95 | 75.088 |
| 2016-03-204:19:03 PM | 65.862 | 129.988 | 36.838 | 75.088 |
| 2016-03-204:19:07 PM | 65.975 | 129.988 | 36.725 | 75.088 |
| 2016-03-204:19:11 PM | 65.862 | 129.875 | 36.612 | 75.088 |
| 2016-03-204:19:15 PM | 65.975 | 129.875 | 36.5 | 75.088 |
| 2016-03-204:19:19 PM | 65.975 | 129.875 | 36.388 | 75.088 |
| 2016-03-204:19:23 PM | 65.975 | 129.762 | 36.5 | 74.975 |
| 2016-03-204:19:27 PM | 65.975 | 129.762 | 36.5 | 75.088 |
| 2016-03-204:19:31 PM | 66.088 | 129.762 | 36.5 | 74.975 |
| 2016-03-204:19:35 PM | 66.088 | 129.65 | 36.612 | 75.088 |
| 2016-03-204:19:39 PM | 66.088 | 129.65 | 36.612 | 74.975 |
| 2016-03-204:19:43 PM | 66.2 | 129.65 | 36.612 | 74.975 |
| 2016-03-204:19:47 PM | 66.2 | 129.538 | 36.5 | 74.975 |
| 2016-03-204:19:51 PM | 66.2 | 129.538 | 36.388 | 74.975 |
| 2016-03-204:19:55 PM | 66.088 | 129.538 | 36.388 | 74.975 |
| 2016-03-204:19:59 PM | 65.975 | 129.538 | 36.388 | 74.975 |
| 2016-03-204:20:03 PM | 65.862 | 129.538 | 36.5 | 74.975 |
| 2016-03-204:20:07 PM | 65.75 | 129.425 | 36.5 | 74.975 |
| 2016-03-204:20:11 PM | 65.638 | 129.425 | 36.5 | 74.975 |
| 2016-03-204:20:15 PM | 65.525 | 129.425 | 36.612 | 74.975 |
| 2016-03-204:20:19 PM | 65.412 | 129.425 | 36.5 | 74.975 |
| 2016-03-204:20:23 PM | 65.638 | 129.312 | 36.612 | 74.975 |
| 2016-03-204:20:27 PM | 65.75 | 129.312 | 36.612 | 74.862 |
| 2016-03-204:20:31 PM | 65.638 | 129.2 | 36.612 | 74.975 |
| 2016-03-204:20:35 PM | 65.638 | 129.2 | 36.5 | 74.975 |
| 2016-03-204:20:39 PM | 65.75 | 129.2 | 36.5 | 74.975 |
| 2016-03-204:20:43 PM | 65.75 | 129.2 | 36.612 | 74.975 |
| 2016-03-204:20:47 PM | 65.862 | 129.2 | 36.612 | 74.975 |
| 2016-03-204:20:51 PM | 65.975 | 129.2 | 36.5 | 74.975 |
| 2016-03-204:20:56 PM | 66.088 | 129.2 | 36.388 | 74.975 |
| 2016-03-204:21:00 PM | 66.2 | 129.2 | 36.388 | 74.975 |
| 2016-03-204:21:04 PM | 66.312 | 129.2 | 36.275 | 74.975 |
| 2016-03-204:21:08 PM | 66.425 | 129.088 | 36.275 | 74.862 |
| 2016-03-204:21:12 PM | 66.425 | 129.088 | 36.275 | 74.975 |
| 2016-03-204:21:16 PM | 66.425 | 129.088 | 36.275 | 74.975 |
| 2016-03-204:21:20 PM | 66.425 | 129.088 | 36.275 | 74.862 |
| 2016-03-204:21:24 PM | 66.425 | 128.975 | 36.275 | 74.975 |
| 2016-03-204:21:28 PM | 66.312 | 129.088 | 36.388 | 74.862 |
| 2016-03-204:21:32 PM | 66.312 | 128.975 | 36.388 | 74.975 |
| 2016-03-204:21:36 PM | 66.312 | 128.975 | 36.5 | 74.975 |
| 2016-03-204:21:40 PM | 66.312 | 128.975 | 36.612 | 74.975 |
| 2016-03-204:21:44 PM | 66.2 | 128.863 | 36.612 | 74.975 |
| 2016-03-204:21:48 PM | 66.2 | 128.863 | 36.612 | 74.975 |
| 2016-03-204:21:52 PM | 66.2 | 128.863 | 36.612 | 74.862 |
| 2016-03-204:21:56 PM | 66.2 | 128.75 | 36.612 | 74.975 |
| 2016-03-204:22:00 PM | 66.2 | 128.75 | 36.725 | 74.862 |
| 2016-03-204:22:04 PM | 66.312 | 128.75 | 36.725 | 74.975 |
| 2016-03-204:22:08 PM | 66.425 | 128.75 | 36.838 | 74.975 |
| 2016-03-204:22:12 PM | 66.538 | 128.637 | 36.838 | 74.975 |
| 2016-03-204:22:16 PM | 66.538 | 128.637 | 36.838 | 74.862 |
| 2016-03-204:22:20 PM | 66.538 | 128.637 | 36.725 | 74.862 |
| 2016-03-204:22:24 PM | 66.538 | 128.525 | 36.725 | 74.862 |
| 2016-03-204:22:28 PM | 66.425 | 128.412 | 36.612 | 74.862 |
| 2016-03-204:22:32 PM | 66.425 | 128.412 | 36.612 | 74.862 |
| 2016-03-204:22:36 PM | 66.425 | 128.3 | 36.5 | 74.862 |
| 2016-03-204:22:40 PM | 66.425 | 128.3 | 36.5 | 74.862 |
| 2016-03-204:22:44 PM | 66.538 | 128.3 | 36.5 | 74.862 |
| 2016-03-204:22:48 PM | 66.762 | 128.188 | 36.5 | 74.862 |
| 2016-03-204:22:52 PM | 66.875 | 128.188 | 36.612 | 74.862 |
| 2016-03-204:22:56 PM | 66.988 | 128.188 | 36.5 | 74.862 |
| 2016-03-204:23:00 PM | 67.1 | 128.075 | 36.5 | 74.862 |
| 2016-03-204:23:04 PM | 67.212 | 127.962 | 36.388 | 74.862 |
| 2016-03-204:23:08 PM | 67.325 | 127.962 | 36.5 | 74.862 |
| 2016-03-204:23:12 PM | 67.438 | 127.85 | 36.5 | 74.862 |
| 2016-03-204:23:16 PM | 67.438 | 127.85 | 36.612 | 74.862 |
| 2016-03-204:23:21 PM | 67.55 | 127.738 | 36.612 | 74.862 |
| 2016-03-204:23:25 PM | 67.55 | 127.738 | 36.612 | 74.862 |
| 2016-03-204:23:29 PM | 67.662 | 127.738 | 36.725 | 74.862 |
| 2016-03-204:23:33 PM | 67.55 | 127.625 | 36.725 | 74.862 |
| 2016-03-204:23:37 PM | 67.662 | 127.625 | 36.725 | 74.862 |
| 2016-03-204:23:41 PM | 67.662 | 127.512 | 36.725 | 74.862 |
| 2016-03-204:23:45 PM | 67.775 | 127.512 | 36.612 | 74.862 |
| 2016-03-204:23:49 PM | 67.775 | 127.4 | 36.612 | 74.862 |
| 2016-03-204:23:53 PM | 67.775 | 127.4 | 36.725 | 74.862 |
| 2016-03-204:23:57 PM | 67.775 | 127.4 | 36.725 | 74.862 |
| 2016-03-204:24:01 PM | 67.888 | 127.288 | 36.838 | 74.862 |
| 2016-03-204:24:05 PM | 67.888 | 127.288 | 36.725 | 74.862 |
| 2016-03-204:24:09 PM | 67.888 | 127.175 | 36.612 | 74.75 |
| 2016-03-204:24:13 PM | 67.888 | 127.175 | 36.5 | 74.862 |
| 2016-03-204:24:17 PM | 67.888 | 127.175 | 36.388 | 74.862 |
| 2016-03-204:24:21 PM | 67.888 | 127.062 | 36.388 | 74.75 |
| 2016-03-204:24:25 PM | 67.888 | 127.062 | 36.388 | 74.862 |
| 2016-03-204:24:29 PM | 68 | 126.95 | 36.388 | 74.75 |
| 2016-03-204:24:33 PM | 68.112 | 126.95 | 36.388 | 74.75 |
| 2016-03-204:24:37 PM | 68.225 | 126.95 | 36.388 | 74.862 |
| 2016-03-204:24:41 PM | 68.338 | 126.838 | 36.275 | 74.862 |
| 2016-03-204:24:45 PM | 68.338 | 126.838 | 36.275 | 74.75 |
| 2016-03-204:24:49 PM | 68.338 | 126.725 | 36.162 | 74.75 |
| 2016-03-204:24:53 PM | 68.225 | 126.725 | 36.162 | 74.862 |
| 2016-03-204:24:57 PM | 68.225 | 126.612 | 36.05 | 74.75 |
| 2016-03-204:25:01 PM | 68.338 | 126.612 | 36.162 | 74.75 |
| 2016-03-204:25:05 PM | 68.45 | 126.612 | 36.275 | 74.75 |
| 2016-03-204:25:09 PM | 68.562 | 126.612 | 36.162 | 74.75 |
| 2016-03-204:25:13 PM | 68.562 | 126.5 | 36.162 | 74.75 |
| 2016-03-204:25:17 PM | 68.675 | 126.5 | 36.275 | 74.75 |
| 2016-03-204:25:21 PM | 68.788 | 126.5 | 36.388 | 74.75 |
| 2016-03-204:25:25 PM | 68.9 | 126.388 | 36.388 | 74.75 |
| 2016-03-204:25:32 PM | 69.012 | 126.388 | 36.5 | 74.75 |
| 2016-03-204:25:36 PM | 69.125 | 126.388 | 36.5 | 74.75 |
| 2016-03-204:25:40 PM | 69.238 | 126.275 | 36.612 | 74.75 |
| 2016-03-204:25:44 PM | 69.238 | 126.275 | 36.612 | 74.75 |
| 2016-03-204:25:48 PM | 69.125 | 126.275 | 36.612 | 74.75 |
| 2016-03-204:25:52 PM | 69.012 | 126.163 | 36.725 | 74.75 |
| 2016-03-204:25:56 PM | 69.012 | 126.163 | 36.838 | 74.75 |
| 2016-03-204:26:00 PM | 68.9 | 126.163 | 36.838 | 74.75 |
| 2016-03-204:26:05 PM | 68.788 | 126.163 | 36.838 | 74.75 |
| 2016-03-204:26:09 PM | 68.675 | 126.05 | 36.725 | 74.75 |
| 2016-03-204:26:13 PM | 68.562 | 126.05 | 36.838 | 74.75 |
| 2016-03-204:26:21 PM | 68.562 | 126.05 | 36.838 | 74.75 |
| 2016-03-204:26:25 PM | 68.562 | 126.05 | 36.95 | 74.75 |
| 2016-03-204:26:29 PM | 68.562 | 125.938 | 36.95 | 74.75 |
| 2016-03-204:26:33 PM | 68.562 | 125.938 | 36.95 | 74.75 |
| 2016-03-204:26:37 PM | 68.562 | 125.938 | 36.95 | 74.75 |
| 2016-03-204:26:41 PM | 68.562 | 125.938 | 36.95 | 74.75 |
| 2016-03-204:26:45 PM | 68.562 | 125.825 | 36.95 | 74.75 |
| 2016-03-204:26:49 PM | 68.675 | 125.825 | 36.838 | 74.75 |
| 2016-03-204:26:53 PM | 68.788 | 125.825 | 36.725 | 74.75 |
| 2016-03-204:26:57 PM | 68.788 | 125.712 | 36.612 | 74.75 |
| 2016-03-204:27:01 PM | 68.9 | 125.712 | 36.612 | 74.75 |
| 2016-03-204:27:05 PM | 68.9 | 125.712 | 36.5 | 74.75 |
| 2016-03-204:27:09 PM | 68.9 | 125.712 | 36.5 | 74.75 |
| 2016-03-204:27:13 PM | 69.012 | 125.6 | 36.5 | 74.75 |
| 2016-03-204:27:17 PM | 69.012 | 125.6 | 36.5 | 74.75 |
| 2016-03-204:27:21 PM | 69.125 | 125.6 | 36.5 | 74.75 |
| 2016-03-204:27:25 PM | 69.238 | 125.488 | 36.5 | 74.75 |
| 2016-03-204:27:29 PM | 69.238 | 125.488 | 36.612 | 74.75 |
| 2016-03-204:27:33 PM | 69.35 | 125.488 | 36.725 | 74.75 |
| 2016-03-204:27:37 PM | 69.462 | 125.488 | 36.725 | 74.75 |
| 2016-03-204:27:41 PM | 69.575 | 125.375 | 36.725 | 74.638 |
| 2016-03-204:27:45 PM | 69.688 | 125.375 | 36.725 | 74.75 |
| 2016-03-204:27:49 PM | 69.688 | 125.375 | 36.838 | 74.638 |
| 2016-03-204:27:53 PM | 69.688 | 125.375 | 36.838 | 74.638 |
| 2016-03-204:27:57 PM | 69.8 | 125.375 | 36.838 | 74.638 |
| 2016-03-204:28:01 PM | 69.8 | 125.262 | 36.95 | 74.75 |
| 2016-03-204:28:05 PM | 69.8 | 125.375 | 36.95 | 74.638 |
| 2016-03-204:28:09 PM | 69.8 | 125.262 | 36.95 | 74.75 |
| 2016-03-204:28:13 PM | 69.8 | 125.262 | 37.062 | 74.638 |
| 2016-03-204:28:17 PM | 69.8 | 125.262 | 37.062 | 74.638 |
| 2016-03-204:28:21 PM | 69.8 | 125.262 | 37.175 | 74.638 |
| 2016-03-204:28:25 PM | 69.688 | 125.262 | 37.175 | 74.75 |
| 2016-03-204:28:29 PM | 69.688 | 125.262 | 37.175 | 74.75 |
| 2016-03-204:28:33 PM | 69.575 | 125.262 | 37.175 | 74.75 |
| 2016-03-204:28:37 PM | 69.688 | 125.15 | 37.175 | 74.75 |
| 2016-03-204:28:41 PM | 69.575 | 125.15 | 37.288 | 74.638 |
| 2016-03-204:28:45 PM | 69.575 | 125.15 | 37.288 | 74.638 |
| 2016-03-204:28:49 PM | 69.462 | 125.15 | 37.288 | 74.638 |
| 2016-03-204:28:54 PM | 69.462 | 125.038 | 37.288 | 74.638 |
| 2016-03-204:28:58 PM | 69.462 | 125.038 | 37.288 | 74.638 |
| 2016-03-204:29:02 PM | 69.462 | 125.038 | 37.4 | 74.638 |
| 2016-03-204:29:06 PM | 69.462 | 125.038 | 37.4 | 74.638 |
| 2016-03-204:29:10 PM | 69.462 | 125.038 | 37.4 | 74.638 |
| 2016-03-204:29:14 PM | 69.462 | 125.038 | 37.4 | 74.638 |
| 2016-03-204:29:18 PM | 69.462 | 124.925 | 37.4 | 74.638 |
| 2016-03-204:29:22 PM | 69.462 | 124.925 | 37.512 | 74.638 |
| 2016-03-204:29:26 PM | 69.35 | 124.925 | 37.512 | 74.638 |
| 2016-03-204:29:30 PM | 69.462 | 124.925 | 37.625 | 74.638 |
| 2016-03-204:29:34 PM | 69.462 | 124.812 | 37.625 | 74.638 |
| 2016-03-204:29:38 PM | 69.575 | 124.925 | 37.738 | 74.638 |
| 2016-03-204:29:42 PM | 69.575 | 124.812 | 37.738 | 74.638 |
| 2016-03-204:29:46 PM | 69.575 | 124.812 | 37.85 | 74.638 |
| 2016-03-204:29:50 PM | 69.575 | 124.812 | 37.85 | 74.638 |
| 2016-03-204:29:54 PM | 69.688 | 124.812 | 37.85 | 74.638 |
| 2016-03-204:29:58 PM | 69.688 | 124.7 | 37.85 | 74.638 |
| 2016-03-204:30:02 PM | 69.575 | 124.7 | 37.85 | 74.525 |
| 2016-03-204:30:06 PM | 69.462 | 124.7 | 37.962 | 74.638 |
| 2016-03-204:30:10 PM | 69.238 | 124.7 | 37.962 | 74.525 |
| 2016-03-204:30:14 PM | 69.125 | 124.7 | 37.962 | 74.638 |
| 2016-03-204:30:18 PM | 69.125 | 124.7 | 37.962 | 74.638 |
| 2016-03-204:30:22 PM | 69.238 | 124.588 | 37.962 | 74.638 |
| 2016-03-204:30:26 PM | 69.238 | 124.588 | 37.962 | 74.638 |
| 2016-03-204:30:30 PM | 69.125 | 124.588 | 37.962 | 74.638 |
| 2016-03-204:30:34 PM | 69.125 | 124.588 | 37.962 | 74.638 |
| 2016-03-204:30:38 PM | 69.238 | 124.588 | 37.962 | 74.638 |
| 2016-03-204:30:43 PM | 69.238 | 124.475 | 37.962 | 74.638 |
| 2016-03-204:30:47 PM | 69.238 | 124.475 | 37.85 | 74.638 |
| 2016-03-204:30:51 PM | 69.35 | 124.475 | 37.85 | 74.638 |
| 2016-03-204:30:55 PM | 69.35 | 124.475 | 37.85 | 74.638 |
| 2016-03-204:30:59 PM | 69.35 | 124.362 | 37.85 | 74.638 |
| 2016-03-204:31:03 PM | 69.462 | 124.362 | 37.962 | 74.525 |
| 2016-03-204:31:07 PM | 69.575 | 124.362 | 37.962 | 74.525 |
| 2016-03-204:31:11 PM | 69.575 | 124.362 | 37.962 | 74.638 |
| 2016-03-204:31:15 PM | 69.575 | 124.362 | 38.075 | 74.525 |
| 2016-03-204:31:19 PM | 69.462 | 124.25 | 37.962 | 74.638 |
| 2016-03-204:31:23 PM | 69.462 | 124.25 | 37.85 | 74.638 |
| 2016-03-204:31:27 PM | 69.35 | 124.25 | 37.85 | 74.525 |
| 2016-03-204:31:31 PM | 69.35 | 124.25 | 37.85 | 74.638 |
| 2016-03-204:31:35 PM | 69.35 | 124.138 | 37.85 | 74.525 |
| 2016-03-204:31:39 PM | 69.35 | 124.138 | 37.85 | 74.525 |
| 2016-03-204:31:43 PM | 69.462 | 124.138 | 37.738 | 74.525 |
| 2016-03-204:31:47 PM | 69.462 | 124.138 | 37.738 | 74.638 |
| 2016-03-204:31:51 PM | 69.462 | 124.025 | 37.85 | 74.638 |
| 2016-03-204:31:55 PM | 69.35 | 124.025 | 37.85 | 74.525 |
| 2016-03-204:31:59 PM | 69.35 | 124.025 | 37.962 | 74.525 |
| 2016-03-204:32:03 PM | 69.238 | 124.025 | 37.962 | 74.525 |
| 2016-03-204:32:07 PM | 69.125 | 124.025 | 37.962 | 74.525 |
| 2016-03-204:32:11 PM | 69.125 | 123.913 | 38.075 | 74.525 |
| 2016-03-204:32:15 PM | 69.125 | 123.913 | 38.075 | 74.525 |
| 2016-03-204:32:19 PM | 69.238 | 123.913 | 38.075 | 74.525 |
| 2016-03-204:32:23 PM | 69.238 | 123.913 | 38.075 | 74.525 |
| 2016-03-204:32:27 PM | 69.238 | 123.8 | 38.075 | 74.525 |
| 2016-03-204:32:31 PM | 69.238 | 123.8 | 38.075 | 74.525 |
| 2016-03-204:32:35 PM | 69.012 | 123.8 | 38.075 | 74.525 |
| 2016-03-204:32:39 PM | 69.012 | 123.688 | 38.075 | 74.525 |
| 2016-03-204:32:43 PM | 68.9 | 123.8 | 37.85 | 74.525 |
| 2016-03-204:32:47 PM | 68.675 | 123.688 | 37.738 | 74.525 |
| 2016-03-204:32:52 PM | 68.562 | 123.688 | 37.625 | 74.525 |
| 2016-03-204:32:56 PM | 68.45 | 123.688 | 37.512 | 74.525 |
| 2016-03-204:33:00 PM | 68.338 | 123.688 | 37.625 | 74.412 |
| 2016-03-204:33:04 PM | 68.338 | 123.688 | 37.512 | 74.525 |
| 2016-03-204:33:08 PM | 68.112 | 123.575 | 37.512 | 74.525 |
| 2016-03-204:33:12 PM | 68.112 | 123.575 | 37.4 | 74.525 |
| 2016-03-204:33:16 PM | 68.112 | 123.575 | 37.288 | 74.525 |
| 2016-03-204:33:20 PM | 68.112 | 123.575 | 37.175 | 74.525 |
| 2016-03-204:33:24 PM | 68.112 | 123.575 | 37.175 | 74.525 |
| 2016-03-204:33:28 PM | 68.225 | 123.462 | 37.062 | 74.525 |
| 2016-03-204:33:32 PM | 68.225 | 123.462 | 36.95 | 74.412 |
| 2016-03-204:33:36 PM | 68.338 | 123.462 | 37.062 | 74.412 |
| 2016-03-204:33:40 PM | 68.45 | 123.462 | 37.062 | 74.412 |
| 2016-03-204:33:44 PM | 68.45 | 123.462 | 37.175 | 74.412 |
| 2016-03-204:33:48 PM | 68.45 | 123.35 | 37.175 | 74.412 |
| 2016-03-204:33:52 PM | 68.45 | 123.35 | 37.062 | 74.412 |
| 2016-03-204:33:56 PM | 68.45 | 123.35 | 36.95 | 74.412 |
| 2016-03-204:34:00 PM | 68.338 | 123.238 | 36.838 | 74.412 |
| 2016-03-204:34:04 PM | 68.338 | 123.238 | 36.838 | 74.412 |
| 2016-03-204:34:08 PM | 68.45 | 123.238 | 36.838 | 74.412 |
| 2016-03-204:34:12 PM | 68.562 | 123.238 | 36.838 | 74.412 |
| 2016-03-204:34:16 PM | 68.675 | 123.125 | 36.95 | 74.412 |
| 2016-03-204:34:20 PM | 68.675 | 123.125 | 36.95 | 74.412 |
| 2016-03-204:34:24 PM | 68.562 | 123.125 | 36.838 | 74.412 |
| 2016-03-204:34:28 PM | 68.562 | 123.125 | 36.725 | 74.412 |
| 2016-03-204:34:32 PM | 68.675 | 123.012 | 36.725 | 74.412 |
| 2016-03-204:34:36 PM | 68.675 | 123.012 | 36.725 | 74.412 |
| 2016-03-204:34:41 PM | 68.788 | 123.012 | 36.838 | 74.412 |
| 2016-03-204:34:45 PM | 68.788 | 123.012 | 36.95 | 74.412 |
| 2016-03-204:34:49 PM | 68.675 | 123.012 | 36.95 | 74.412 |
| 2016-03-204:34:53 PM | 68.788 | 122.9 | 36.95 | 74.412 |
| 2016-03-204:34:57 PM | 68.9 | 122.9 | 36.95 | 74.412 |
| 2016-03-204:35:01 PM | 68.9 | 122.788 | 36.838 | 74.412 |
| 2016-03-204:35:05 PM | 68.9 | 122.788 | 36.725 | 74.412 |
| 2016-03-204:35:09 PM | 68.788 | 122.788 | 36.612 | 74.3 |
| 2016-03-204:35:13 PM | 68.675 | 122.788 | 36.612 | 74.412 |
| 2016-03-204:35:17 PM | 68.562 | 122.788 | 36.5 | 74.412 |
| 2016-03-204:35:21 PM | 68.45 | 122.788 | 36.5 | 74.412 |
| 2016-03-204:35:25 PM | 68.225 | 122.675 | 36.612 | 74.412 |
| 2016-03-204:35:29 PM | 68.225 | 122.675 | 36.725 | 74.412 |
| 2016-03-204:35:32 PM | 68.112 | 122.675 | 36.725 | 74.412 |
| 2016-03-204:35:36 PM | 67.888 | 122.675 | 36.838 | 74.412 |
| 2016-03-204:35:40 PM | 67.888 | 122.562 | 36.838 | 74.412 |
| 2016-03-204:35:44 PM | 67.888 | 122.562 | 36.838 | 74.412 |
| 2016-03-204:35:48 PM | 67.888 | 122.562 | 36.838 | 74.412 |
| 2016-03-204:35:52 PM | 67.775 | 122.45 | 36.838 | 74.412 |
| 2016-03-204:35:56 PM | 67.662 | 122.45 | 36.838 | 74.412 |
| 2016-03-204:36:00 PM | 67.438 | 122.45 | 36.725 | 74.412 |
| 2016-03-204:36:04 PM | 67.325 | 122.45 | 36.612 | 74.412 |
| 2016-03-204:36:09 PM | 66.988 | 122.338 | 36.388 | 74.412 |
| 2016-03-204:36:13 PM | 66.762 | 122.338 | 36.388 | 74.412 |
| 2016-03-204:36:17 PM | 66.65 | 122.225 | 36.388 | 74.412 |
| 2016-03-204:36:21 PM | 66.312 | 122.225 | 36.388 | 74.412 |
| 2016-03-204:36:25 PM | 66.2 | 122.225 | 36.388 | 74.412 |
| 2016-03-204:36:29 PM | 66.088 | 122.225 | 36.5 | 74.412 |
| 2016-03-204:36:33 PM | 65.75 | 122.112 | 36.5 | 74.412 |
| 2016-03-204:36:37 PM | 65.75 | 122.112 | 36.5 | 74.412 |
| 2016-03-204:36:41 PM | 65.638 | 122.112 | 36.612 | 74.412 |
| 2016-03-204:36:45 PM | 65.525 | 122.112 | 36.612 | 74.412 |
| 2016-03-204:36:49 PM | 65.525 | 122 | 36.725 | 74.412 |
| 2016-03-204:36:53 PM | 65.525 | 122 | 36.725 | 74.525 |
| 2016-03-204:36:57 PM | 65.412 | 121.888 | 36.725 | 74.525 |
| 2016-03-204:37:01 PM | 65.188 | 121.888 | 36.725 | 74.525 |
| 2016-03-204:37:05 PM | 65.075 | 121.888 | 36.725 | 74.525 |
| 2016-03-204:37:09 PM | 64.85 | 121.775 | 36.725 | 74.525 |
| 2016-03-204:37:13 PM | 64.738 | 121.775 | 36.725 | 74.525 |
| 2016-03-204:37:17 PM | 64.738 | 121.775 | 36.725 | 74.525 |
| 2016-03-204:37:21 PM | 64.85 | 121.775 | 36.838 | 74.525 |
| 2016-03-204:37:25 PM | 64.963 | 121.663 | 36.725 | 74.525 |
| 2016-03-204:37:29 PM | 65.075 | 121.663 | 36.725 | 74.525 |
| 2016-03-204:37:33 PM | 65.188 | 121.55 | 36.612 | 74.525 |
| 2016-03-204:37:41 PM | 65.3 | 121.55 | 36.5 | 74.525 |
| 2016-03-204:37:45 PM | 65.412 | 121.55 | 36.612 | 74.525 |
| 2016-03-204:37:49 PM | 65.525 | 121.55 | 36.612 | 74.525 |
| 2016-03-204:37:53 PM | 65.525 | 121.438 | 36.612 | 74.525 |
| 2016-03-204:37:57 PM | 65.638 | 121.438 | 36.725 | 74.525 |
| 2016-03-204:38:01 PM | 65.75 | 121.325 | 36.725 | 74.525 |
| 2016-03-204:38:05 PM | 65.975 | 121.325 | 36.725 | 74.525 |
| 2016-03-204:38:10 PM | 65.975 | 121.325 | 36.725 | 74.525 |
| 2016-03-204:38:14 PM | 66.2 | 121.325 | 36.838 | 74.525 |
| 2016-03-204:38:18 PM | 66.312 | 121.325 | 36.838 | 74.525 |
| 2016-03-204:38:22 PM | 66.538 | 121.212 | 36.95 | 74.525 |
| 2016-03-204:38:26 PM | 66.762 | 121.212 | 36.95 | 74.525 |
| 2016-03-204:38:30 PM | 66.875 | 121.212 | 37.062 | 74.525 |
| 2016-03-204:38:34 PM | 66.988 | 121.1 | 37.062 | 74.525 |
| 2016-03-204:38:38 PM | 67.1 | 121.212 | 37.175 | 74.525 |
| 2016-03-204:38:42 PM | 67.325 | 121.1 | 37.062 | 74.525 |
| 2016-03-204:38:46 PM | 67.438 | 121.1 | 37.062 | 74.525 |
| 2016-03-204:38:50 PM | 67.55 | 121.1 | 37.062 | 74.525 |
| 2016-03-204:38:54 PM | 67.662 | 120.988 | 37.175 | 74.412 |
| 2016-03-204:38:58 PM | 67.888 | 120.988 | 37.062 | 74.412 |
| 2016-03-204:39:02 PM | 67.888 | 120.988 | 37.175 | 74.412 |
| 2016-03-204:39:06 PM | 68 | 120.988 | 37.062 | 74.412 |
| 2016-03-204:39:10 PM | 68.112 | 120.875 | 37.175 | 74.412 |
| 2016-03-204:39:14 PM | 68.225 | 120.988 | 37.175 | 74.412 |
| 2016-03-204:39:18 PM | 68.338 | 120.875 | 37.175 | 74.525 |
| 2016-03-204:39:22 PM | 68.45 | 120.875 | 37.175 | 74.525 |
| 2016-03-204:39:25 PM | 68.562 | 120.762 | 37.175 | 74.525 |
| 2016-03-204:39:29 PM | 68.562 | 120.762 | 37.175 | 74.525 |
| 2016-03-204:39:33 PM | 68.675 | 120.762 | 37.175 | 74.412 |
| 2016-03-204:39:37 PM | 68.788 | 120.762 | 37.062 | 74.412 |
| 2016-03-204:39:41 PM | 68.9 | 120.762 | 37.062 | 74.412 |
| 2016-03-204:39:45 PM | 68.9 | 120.762 | 37.062 | 74.412 |
| 2016-03-204:39:49 PM | 68.9 | 120.65 | 37.062 | 74.412 |
| 2016-03-204:39:54 PM | 68.9 | 120.762 | 37.175 | 74.412 |
| 2016-03-204:39:58 PM | 68.9 | 120.65 | 37.175 | 74.412 |
| 2016-03-204:40:02 PM | 68.9 | 120.65 | 37.062 | 74.3 |
| 2016-03-204:40:06 PM | 68.9 | 120.65 | 37.062 | 74.412 |
| 2016-03-204:40:10 PM | 69.012 | 120.65 | 36.95 | 74.412 |
| 2016-03-204:40:14 PM | 69.012 | 120.65 | 36.838 | 74.3 |
| 2016-03-204:40:18 PM | 69.125 | 120.538 | 36.612 | 74.3 |
| 2016-03-204:40:22 PM | 69.125 | 120.538 | 36.5 | 74.3 |
| 2016-03-204:40:26 PM | 69.238 | 120.538 | 36.388 | 74.3 |
| 2016-03-204:40:30 PM | 69.125 | 120.538 | 36.275 | 74.3 |
| 2016-03-204:40:34 PM | 69.238 | 120.538 | 36.162 | 74.3 |
| 2016-03-204:40:38 PM | 69.238 | 120.538 | 36.162 | 74.3 |
| 2016-03-204:40:42 PM | 69.125 | 120.425 | 36.05 | 74.3 |
| 2016-03-204:40:46 PM | 69.012 | 120.425 | 35.938 | 74.3 |
| 2016-03-204:40:50 PM | 68.675 | 120.425 | 35.938 | 74.3 |
| 2016-03-204:40:54 PM | 68.45 | 120.538 | 35.825 | 74.3 |
| 2016-03-204:40:58 PM | 68.338 | 120.425 | 35.712 | 74.3 |
| 2016-03-204:41:02 PM | 68.225 | 120.425 | 35.712 | 74.3 |
| 2016-03-204:41:06 PM | 68.338 | 120.425 | 35.825 | 74.3 |
| 2016-03-204:41:10 PM | 68.338 | 120.425 | 35.825 | 74.3 |
| 2016-03-204:41:14 PM | 68.225 | 120.425 | 35.825 | 74.3 |
| 2016-03-204:41:18 PM | 68.225 | 120.425 | 35.938 | 74.3 |
| 2016-03-204:41:22 PM | 68.225 | 120.425 | 35.938 | 74.3 |
| 2016-03-204:41:26 PM | 68.225 | 120.312 | 35.938 | 74.3 |
| 2016-03-204:41:30 PM | 68.112 | 120.312 | 35.938 | 74.3 |
| 2016-03-204:41:34 PM | 68.112 | 120.312 | 35.938 | 74.3 |
| 2016-03-204:41:38 PM | 68.112 | 120.312 | 36.05 | 74.3 |
| 2016-03-204:41:42 PM | 68.112 | 120.2 | 36.05 | 74.3 |
| 2016-03-204:41:47 PM | 68.225 | 120.2 | 36.05 | 74.3 |
| 2016-03-204:41:51 PM | 68.225 | 120.2 | 36.162 | 74.3 |
| 2016-03-204:41:55 PM | 68.225 | 120.2 | 36.162 | 74.188 |
| 2016-03-204:41:59 PM | 68.225 | 120.2 | 36.05 | 74.3 |
| 2016-03-204:42:03 PM | 68.338 | 120.2 | 36.05 | 74.3 |
| 2016-03-204:42:07 PM | 68.225 | 120.088 | 36.05 | 74.3 |
| 2016-03-204:42:11 PM | 68.338 | 120.088 | 35.938 | 74.3 |
| 2016-03-204:42:15 PM | 68.225 | 120.088 | 35.938 | 74.3 |
| 2016-03-204:42:19 PM | 68.225 | 120.088 | 36.05 | 74.3 |
| 2016-03-204:42:23 PM | 68.112 | 120.088 | 36.05 | 74.3 |
| 2016-03-204:42:27 PM | 68 | 119.975 | 36.05 | 74.3 |
| 2016-03-204:42:31 PM | 68 | 119.975 | 36.05 | 74.188 |
| 2016-03-204:42:35 PM | 68 | 119.975 | 35.938 | 74.3 |
| 2016-03-204:42:39 PM | 68.112 | 119.975 | 35.938 | 74.188 |
| 2016-03-204:42:43 PM | 68.225 | 119.975 | 35.938 | 74.188 |
| 2016-03-204:42:47 PM | 68.225 | 119.862 | 36.05 | 74.188 |
| 2016-03-204:42:51 PM | 68.338 | 119.862 | 36.05 | 74.188 |
| 2016-03-204:42:55 PM | 68.45 | 119.862 | 36.05 | 74.188 |
| 2016-03-204:42:59 PM | 68.562 | 119.862 | 36.05 | 74.188 |
| 2016-03-204:43:03 PM | 68.675 | 119.75 | 36.05 | 74.188 |
| 2016-03-204:43:07 PM | 68.788 | 119.75 | 36.162 | 74.188 |
| 2016-03-204:43:11 PM | 68.9 | 119.75 | 36.162 | 74.188 |
| 2016-03-204:43:15 PM | 68.9 | 119.75 | 36.275 | 74.188 |
| 2016-03-204:43:19 PM | 68.788 | 119.638 | 36.388 | 74.188 |
| 2016-03-204:43:23 PM | 68.562 | 119.638 | 36.388 | 74.188 |
| 2016-03-204:43:27 PM | 68.45 | 119.638 | 36.388 | 74.188 |
| 2016-03-204:43:31 PM | 68.45 | 119.638 | 36.5 | 74.188 |
| 2016-03-204:43:36 PM | 68.45 | 119.525 | 36.388 | 74.188 |
| 2016-03-204:43:39 PM | 68.45 | 119.525 | 36.388 | 74.188 |
| 2016-03-204:43:44 PM | 68.45 | 119.413 | 36.275 | 74.188 |
| 2016-03-204:43:48 PM | 68.45 | 119.413 | 36.275 | 74.188 |
| 2016-03-204:43:52 PM | 68.338 | 119.413 | 36.162 | 74.188 |
| 2016-03-204:43:56 PM | 68.45 | 119.413 | 36.162 | 74.188 |
| 2016-03-204:44:00 PM | 68.225 | 119.413 | 36.162 | 74.188 |
| 2016-03-204:44:04 PM | 68.112 | 119.413 | 36.162 | 74.188 |
| 2016-03-204:44:08 PM | 68.112 | 119.3 | 36.162 | 74.188 |
| 2016-03-204:44:12 PM | 68.112 | 119.3 | 36.162 | 74.188 |
| 2016-03-204:44:16 PM | 68 | 119.3 | 36.162 | 74.188 |
| 2016-03-204:44:20 PM | 68 | 119.188 | 36.162 | 74.075 |
| 2016-03-204:44:24 PM | 67.888 | 119.188 | 36.162 | 74.188 |
| 2016-03-204:44:28 PM | 67.775 | 119.188 | 36.05 | 74.188 |
| 2016-03-204:44:32 PM | 67.662 | 119.188 | 36.05 | 74.188 |
| 2016-03-204:44:36 PM | 67.438 | 119.188 | 35.938 | 74.188 |
| 2016-03-204:44:40 PM | 67.212 | 119.188 | 35.825 | 74.075 |
| 2016-03-204:44:44 PM | 67.1 | 119.075 | 35.6 | 74.075 |
| 2016-03-204:44:48 PM | 66.988 | 119.075 | 35.488 | 74.188 |
| 2016-03-204:44:56 PM | 66.762 | 119.075 | 35.262 | 74.188 |
| 2016-03-204:45:00 PM | 66.538 | 118.962 | 35.15 | 74.075 |
| 2016-03-204:45:04 PM | 66.425 | 118.962 | 35.038 | 74.188 |
| 2016-03-204:45:08 PM | 66.2 | 118.962 | 35.15 | 74.188 |
| 2016-03-204:45:12 PM | 65.975 | 118.85 | 35.15 | 74.188 |
| 2016-03-204:45:16 PM | 65.862 | 118.85 | 35.15 | 74.188 |
| 2016-03-204:45:20 PM | 65.75 | 118.85 | 35.15 | 74.188 |
| 2016-03-204:45:24 PM | 65.638 | 118.738 | 35.15 | 74.075 |
| 2016-03-204:45:28 PM | 65.525 | 118.738 | 35.15 | 74.188 |
| 2016-03-204:45:32 PM | 65.412 | 118.738 | 35.15 | 74.188 |
| 2016-03-204:45:36 PM | 65.188 | 118.625 | 35.15 | 74.188 |
| 2016-03-204:45:40 PM | 65.075 | 118.625 | 35.15 | 74.188 |
| 2016-03-204:45:44 PM | 64.963 | 118.625 | 35.15 | 74.188 |
| 2016-03-204:45:49 PM | 64.85 | 118.625 | 35.15 | 74.188 |
| 2016-03-204:45:53 PM | 64.738 | 118.625 | 35.038 | 74.188 |
| 2016-03-204:45:57 PM | 64.625 | 118.512 | 34.925 | 74.188 |
| 2016-03-204:46:01 PM | 64.625 | 118.512 | 34.925 | 74.188 |
| 2016-03-204:46:05 PM | 64.625 | 118.512 | 34.925 | 74.3 |
| 2016-03-204:46:09 PM | 64.738 | 118.512 | 34.925 | 74.3 |
| 2016-03-204:46:13 PM | 64.85 | 118.4 | 34.812 | 74.188 |
| 2016-03-204:46:17 PM | 64.85 | 118.4 | 34.812 | 74.188 |
| 2016-03-204:46:21 PM | 64.85 | 118.4 | 34.812 | 74.188 |
| 2016-03-204:46:25 PM | 64.85 | 118.4 | 34.925 | 74.188 |
| 2016-03-204:46:29 PM | 64.963 | 118.288 | 35.038 | 74.188 |
| 2016-03-204:46:33 PM | 64.963 | 118.288 | 35.038 | 74.3 |
| 2016-03-204:46:37 PM | 64.963 | 118.175 | 35.038 | 74.3 |
| 2016-03-204:46:41 PM | 64.85 | 118.175 | 35.15 | 74.3 |
| 2016-03-204:46:45 PM | 64.85 | 118.175 | 35.15 | 74.3 |
| 2016-03-204:46:49 PM | 64.85 | 118.062 | 35.15 | 74.3 |
| 2016-03-204:46:53 PM | 64.738 | 118.062 | 35.15 | 74.3 |
| 2016-03-204:46:57 PM | 64.738 | 118.062 | 35.262 | 74.3 |
| 2016-03-204:47:01 PM | 64.625 | 117.95 | 35.375 | 74.3 |
| 2016-03-204:47:05 PM | 64.738 | 117.95 | 35.375 | 74.3 |
| 2016-03-204:47:09 PM | 64.738 | 117.838 | 35.375 | 74.3 |
| 2016-03-204:47:13 PM | 64.738 | 117.838 | 35.375 | 74.412 |
| 2016-03-204:47:17 PM | 64.85 | 117.725 | 35.375 | 74.412 |
| 2016-03-204:47:21 PM | 64.85 | 117.725 | 35.375 | 74.412 |
| 2016-03-204:47:25 PM | 64.963 | 117.725 | 35.488 | 74.412 |
| 2016-03-204:47:29 PM | 64.963 | 117.612 | 35.488 | 74.412 |
| 2016-03-204:47:33 PM | 64.85 | 117.5 | 35.488 | 74.412 |
| 2016-03-204:47:37 PM | 64.738 | 117.5 | 35.6 | 74.412 |
| 2016-03-204:47:41 PM | 64.85 | 117.5 | 35.712 | 74.412 |
| 2016-03-204:47:45 PM | 64.963 | 117.388 | 35.712 | 74.412 |
| 2016-03-204:47:49 PM | 65.075 | 117.275 | 35.825 | 74.412 |
| 2016-03-204:47:53 PM | 65.188 | 117.275 | 35.825 | 74.412 |
| 2016-03-204:47:57 PM | 65.3 | 117.275 | 35.825 | 74.412 |
| 2016-03-204:48:02 PM | 65.188 | 117.163 | 35.938 | 74.412 |
| 2016-03-204:48:06 PM | 65.188 | 117.163 | 35.938 | 74.412 |
| 2016-03-204:48:10 PM | 65.188 | 117.05 | 35.938 | 74.412 |
| 2016-03-204:48:14 PM | 65.075 | 117.05 | 35.938 | 74.412 |
| 2016-03-204:48:18 PM | 64.963 | 116.938 | 35.938 | 74.412 |
| 2016-03-204:48:22 PM | 64.85 | 116.938 | 35.938 | 74.412 |
| 2016-03-204:48:26 PM | 64.738 | 116.938 | 35.938 | 74.412 |
| 2016-03-204:48:30 PM | 64.85 | 116.825 | 35.938 | 74.412 |
| 2016-03-204:48:37 PM | 64.963 | 116.825 | 35.938 | 74.412 |
| 2016-03-204:48:41 PM | 64.963 | 116.712 | 35.938 | 74.412 |
| 2016-03-204:48:45 PM | 65.075 | 116.712 | 35.938 | 74.412 |
| 2016-03-204:48:49 PM | 65.188 | 116.6 | 35.938 | 74.412 |
| 2016-03-204:48:53 PM | 65.412 | 116.6 | 35.938 | 74.412 |
| 2016-03-204:48:57 PM | 65.525 | 116.6 | 35.938 | 74.412 |
| 2016-03-204:49:01 PM | 65.638 | 116.488 | 35.938 | 74.412 |
| 2016-03-204:49:05 PM | 65.75 | 116.488 | 36.05 | 74.412 |
| 2016-03-204:49:09 PM | 65.862 | 116.375 | 36.05 | 74.412 |
| 2016-03-204:49:13 PM | 65.975 | 116.375 | 36.162 | 74.412 |
| 2016-03-204:49:17 PM | 66.088 | 116.375 | 36.162 | 74.412 |
| 2016-03-204:49:21 PM | 65.975 | 116.375 | 36.162 | 74.412 |
| 2016-03-204:49:25 PM | 66.088 | 116.262 | 36.162 | 74.412 |
| 2016-03-204:49:29 PM | 66.088 | 116.262 | 36.162 | 74.412 |
| 2016-03-204:49:33 PM | 66.088 | 116.262 | 36.162 | 74.412 |
| 2016-03-204:49:37 PM | 66.2 | 116.15 | 36.05 | 74.412 |
| 2016-03-204:49:41 PM | 66.2 | 116.15 | 36.05 | 74.412 |
| 2016-03-204:49:46 PM | 66.2 | 116.038 | 36.05 | 74.412 |
| 2016-03-204:49:50 PM | 66.088 | 116.038 | 36.05 | 74.412 |
| 2016-03-204:49:54 PM | 66.088 | 115.925 | 36.05 | 74.412 |
| 2016-03-204:49:58 PM | 65.975 | 115.925 | 36.162 | 74.412 |
| 2016-03-204:50:02 PM | 65.862 | 115.812 | 36.162 | 74.412 |
| 2016-03-204:50:06 PM | 65.75 | 115.812 | 36.162 | 74.412 |
| 2016-03-204:50:10 PM | 65.75 | 115.812 | 36.162 | 74.525 |
| 2016-03-204:50:14 PM | 65.75 | 115.7 | 36.275 | 74.412 |
| 2016-03-204:50:18 PM | 65.638 | 115.7 | 36.388 | 74.412 |
| 2016-03-204:50:22 PM | 65.638 | 115.588 | 36.388 | 74.412 |
| 2016-03-204:50:26 PM | 65.525 | 115.588 | 36.388 | 74.412 |
| 2016-03-204:50:30 PM | 65.525 | 115.475 | 36.388 | 74.412 |
| 2016-03-204:50:34 PM | 65.525 | 115.475 | 36.388 | 74.412 |
| 2016-03-204:50:38 PM | 65.412 | 115.475 | 36.388 | 74.412 |
| 2016-03-204:50:41 PM | 65.412 | 115.362 | 36.388 | 74.412 |
| 2016-03-204:50:45 PM | 65.3 | 115.25 | 36.275 | 74.412 |
| 2016-03-204:50:49 PM | 65.188 | 115.25 | 36.162 | 74.412 |
| 2016-03-204:50:53 PM | 65.075 | 115.25 | 36.05 | 74.525 |
| 2016-03-204:50:57 PM | 64.963 | 115.138 | 35.938 | 74.525 |
| 2016-03-204:51:01 PM | 64.963 | 115.138 | 35.825 | 74.412 |
| 2016-03-204:51:05 PM | 64.85 | 115.025 | 35.825 | 74.412 |
| 2016-03-204:51:09 PM | 64.738 | 115.025 | 35.825 | 74.525 |
| 2016-03-204:51:13 PM | 64.625 | 114.913 | 35.825 | 74.412 |
| 2016-03-204:51:17 PM | 64.625 | 114.913 | 35.938 | 74.525 |
| 2016-03-204:51:22 PM | 64.625 | 114.8 | 35.938 | 74.525 |
| 2016-03-204:51:26 PM | 64.512 | 114.8 | 35.825 | 74.525 |
| 2016-03-204:51:30 PM | 64.4 | 114.8 | 35.825 | 74.525 |
| 2016-03-204:51:34 PM | 64.287 | 114.8 | 35.825 | 74.525 |
| 2016-03-204:51:38 PM | 64.175 | 114.688 | 35.938 | 74.525 |
| 2016-03-204:51:42 PM | 64.175 | 114.688 | 35.938 | 74.525 |
| 2016-03-204:51:46 PM | 64.175 | 114.575 | 35.825 | 74.525 |
| 2016-03-204:51:50 PM | 64.287 | 114.575 | 35.825 | 74.525 |
| 2016-03-204:51:54 PM | 64.4 | 114.462 | 35.825 | 74.525 |
| 2016-03-204:51:58 PM | 64.512 | 114.462 | 35.712 | 74.525 |
| 2016-03-204:52:02 PM | 64.625 | 114.462 | 35.6 | 74.525 |
| 2016-03-204:52:06 PM | 64.738 | 114.35 | 35.6 | 74.525 |
| 2016-03-204:52:10 PM | 64.85 | 114.35 | 35.488 | 74.525 |
| 2016-03-204:52:14 PM | 65.188 | 114.35 | 35.375 | 74.525 |
| 2016-03-204:52:18 PM | 65.188 | 114.238 | 35.375 | 74.412 |
| 2016-03-204:52:22 PM | 65.412 | 114.238 | 35.375 | 74.525 |
| 2016-03-204:52:26 PM | 65.525 | 114.238 | 35.15 | 74.525 |
| 2016-03-204:52:30 PM | 65.75 | 114.125 | 35.038 | 74.525 |
| 2016-03-204:52:34 PM | 65.862 | 114.125 | 35.038 | 74.525 |
| 2016-03-204:52:38 PM | 65.975 | 114.125 | 34.925 | 74.525 |
| 2016-03-204:52:42 PM | 66.088 | 114.012 | 34.812 | 74.525 |
| 2016-03-204:52:46 PM | 66.2 | 114.012 | 34.7 | 74.525 |
| 2016-03-204:52:50 PM | 66.312 | 114.012 | 34.7 | 74.525 |
| 2016-03-204:52:54 PM | 66.425 | 113.9 | 34.588 | 74.525 |
| 2016-03-204:52:58 PM | 66.538 | 113.9 | 34.475 | 74.525 |
| 2016-03-204:53:02 PM | 66.538 | 113.9 | 34.475 | 74.525 |
| 2016-03-204:53:06 PM | 66.65 | 113.9 | 34.362 | 74.525 |
| 2016-03-204:53:10 PM | 66.65 | 113.788 | 34.362 | 74.525 |
| 2016-03-204:53:14 PM | 66.762 | 113.788 | 34.362 | 74.525 |
| 2016-03-204:53:18 PM | 66.762 | 113.788 | 34.362 | 74.525 |
| 2016-03-204:53:22 PM | 66.875 | 113.675 | 34.362 | 74.525 |
| 2016-03-204:53:26 PM | 66.875 | 113.675 | 34.362 | 74.525 |
| 2016-03-204:53:30 PM | 66.875 | 113.675 | 34.25 | 74.525 |
| 2016-03-204:53:34 PM | 66.875 | 113.562 | 34.138 | 74.525 |
| 2016-03-204:53:38 PM | 66.988 | 113.562 | 34.025 | 74.525 |
| 2016-03-204:53:43 PM | 66.988 | 113.45 | 33.912 | 74.525 |
| 2016-03-204:53:47 PM | 66.988 | 113.45 | 33.912 | 74.525 |
| 2016-03-204:53:51 PM | 66.988 | 113.45 | 33.8 | 74.525 |
| 2016-03-204:53:55 PM | 66.988 | 113.338 | 33.912 | 74.525 |
| 2016-03-204:53:59 PM | 67.1 | 113.338 | 34.025 | 74.525 |
| 2016-03-204:54:03 PM | 67.1 | 113.338 | 34.025 | 74.525 |
| 2016-03-204:54:07 PM | 66.988 | 113.338 | 34.025 | 74.525 |
| 2016-03-204:54:11 PM | 66.762 | 113.225 | 34.138 | 74.525 |
| 2016-03-204:54:15 PM | 66.65 | 113.225 | 34.138 | 74.525 |
| 2016-03-204:54:19 PM | 66.538 | 113.112 | 34.138 | 74.525 |
| 2016-03-204:54:23 PM | 66.425 | 113.112 | 34.25 | 74.525 |
| 2016-03-204:54:27 PM | 66.425 | 113.112 | 34.362 | 74.525 |
| 2016-03-204:54:31 PM | 66.312 | 113 | 34.362 | 74.525 |
| 2016-03-204:54:35 PM | 66.425 | 113 | 34.362 | 74.525 |
| 2016-03-204:54:39 PM | 66.425 | 112.888 | 34.475 | 74.525 |
| 2016-03-204:54:43 PM | 66.425 | 112.888 | 34.475 | 74.525 |
| 2016-03-204:54:47 PM | 66.538 | 112.888 | 34.475 | 74.525 |
| 2016-03-204:54:51 PM | 66.538 | 112.775 | 34.588 | 74.525 |
| 2016-03-204:54:55 PM | 66.538 | 112.775 | 34.588 | 74.525 |
| 2016-03-204:54:59 PM | 66.538 | 112.663 | 34.588 | 74.525 |
| 2016-03-204:55:03 PM | 66.65 | 112.663 | 34.588 | 74.638 |
| 2016-03-204:55:07 PM | 66.65 | 112.55 | 34.7 | 74.525 |
| 2016-03-204:55:11 PM | 66.762 | 112.55 | 34.7 | 74.525 |
| 2016-03-204:55:15 PM | 66.875 | 112.55 | 34.7 | 74.638 |
| 2016-03-204:55:19 PM | 66.875 | 112.55 | 34.7 | 74.638 |
| 2016-03-204:55:23 PM | 66.988 | 112.438 | 34.7 | 74.638 |
| 2016-03-204:55:27 PM | 66.988 | 112.438 | 34.7 | 74.525 |
| 2016-03-204:55:31 PM | 67.1 | 112.325 | 34.7 | 74.525 |
| 2016-03-204:55:35 PM | 67.1 | 112.325 | 34.812 | 74.638 |
| 2016-03-204:55:39 PM | 67.1 | 112.325 | 34.812 | 74.638 |
| 2016-03-204:55:43 PM | 67.1 | 112.212 | 34.812 | 74.638 |
| 2016-03-204:55:47 PM | 67.1 | 112.1 | 34.812 | 74.638 |
| 2016-03-204:55:51 PM | 67.1 | 112.1 | 34.812 | 74.525 |
| 2016-03-204:55:55 PM | 66.988 | 111.988 | 34.812 | 74.638 |
| 2016-03-204:55:59 PM | 66.988 | 111.988 | 34.7 | 74.525 |
| 2016-03-204:56:03 PM | 66.762 | 111.988 | 34.812 | 74.638 |
| 2016-03-204:56:07 PM | 66.65 | 111.875 | 34.7 | 74.638 |
| 2016-03-204:56:11 PM | 66.538 | 111.875 | 34.7 | 74.638 |
| 2016-03-204:56:15 PM | 66.425 | 111.762 | 34.7 | 74.638 |
| 2016-03-204:56:19 PM | 66.312 | 111.762 | 34.7 | 74.638 |
| 2016-03-204:56:24 PM | 66.2 | 111.65 | 34.7 | 74.638 |
| 2016-03-204:56:28 PM | 66.2 | 111.65 | 34.812 | 74.638 |
| 2016-03-204:56:32 PM | 66.088 | 111.538 | 34.812 | 74.638 |
| 2016-03-204:56:36 PM | 66.088 | 111.425 | 34.812 | 74.638 |
| 2016-03-204:56:40 PM | 66.088 | 111.425 | 34.925 | 74.638 |
| 2016-03-204:56:44 PM | 66.088 | 111.425 | 34.925 | 74.638 |
| 2016-03-204:56:48 PM | 65.862 | 111.425 | 34.925 | 74.638 |
| 2016-03-204:56:52 PM | 65.75 | 111.312 | 34.925 | 74.638 |
| 2016-03-204:56:56 PM | 65.638 | 111.2 | 34.925 | 74.638 |
| 2016-03-204:57:00 PM | 65.525 | 111.2 | 34.925 | 74.638 |
| 2016-03-204:57:04 PM | 65.412 | 111.2 | 34.812 | 74.638 |
| 2016-03-204:57:08 PM | 65.412 | 111.088 | 34.925 | 74.638 |
| 2016-03-204:57:12 PM | 65.412 | 110.975 | 34.925 | 74.638 |
| 2016-03-204:57:16 PM | 65.3 | 110.975 | 34.812 | 74.638 |
| 2016-03-204:57:20 PM | 65.3 | 110.975 | 34.925 | 74.638 |
| 2016-03-204:57:24 PM | 65.3 | 110.975 | 34.925 | 74.638 |
| 2016-03-204:57:28 PM | 65.3 | 110.862 | 34.925 | 74.638 |
| 2016-03-204:57:32 PM | 65.188 | 110.862 | 34.925 | 74.638 |
| 2016-03-204:57:36 PM | 65.188 | 110.75 | 35.038 | 74.638 |
| 2016-03-204:57:40 PM | 65.075 | 110.75 | 35.038 | 74.638 |
| 2016-03-204:57:44 PM | 65.075 | 110.638 | 35.038 | 74.638 |
| 2016-03-204:57:48 PM | 65.075 | 110.638 | 35.038 | 74.638 |
| 2016-03-204:57:52 PM | 65.075 | 110.638 | 35.038 | 74.638 |
| 2016-03-204:57:56 PM | 64.963 | 110.525 | 35.15 | 74.638 |
| 2016-03-204:58:00 PM | 64.963 | 110.413 | 35.15 | 74.638 |
| 2016-03-204:58:04 PM | 64.963 | 110.413 | 35.262 | 74.638 |
| 2016-03-204:58:08 PM | 64.963 | 110.413 | 35.15 | 74.638 |
| 2016-03-204:58:12 PM | 64.963 | 110.3 | 35.262 | 74.638 |
| 2016-03-204:58:16 PM | 64.963 | 110.3 | 35.262 | 74.638 |
| 2016-03-204:58:20 PM | 65.075 | 110.188 | 35.262 | 74.75 |
| 2016-03-204:58:24 PM | 65.075 | 110.188 | 35.262 | 74.75 |
| 2016-03-204:58:28 PM | 65.188 | 110.188 | 35.262 | 74.75 |
| 2016-03-204:58:32 PM | 65.3 | 110.075 | 35.15 | 74.638 |
| 2016-03-204:58:36 PM | 65.412 | 110.075 | 35.15 | 74.638 |
| 2016-03-204:58:41 PM | 65.412 | 109.962 | 35.15 | 74.638 |
| 2016-03-204:58:45 PM | 65.525 | 109.962 | 35.262 | 74.638 |
| 2016-03-204:58:49 PM | 65.525 | 109.85 | 35.262 | 74.75 |
| 2016-03-204:58:53 PM | 65.412 | 109.85 | 35.15 | 74.638 |
| 2016-03-204:58:57 PM | 65.412 | 109.738 | 35.15 | 74.75 |
| 2016-03-204:59:01 PM | 65.412 | 109.738 | 35.15 | 74.638 |
| 2016-03-204:59:05 PM | 65.3 | 109.625 | 35.15 | 74.638 |
| 2016-03-204:59:09 PM | 65.3 | 109.512 | 35.15 | 74.75 |
| 2016-03-204:59:13 PM | 65.188 | 109.512 | 35.15 | 74.75 |
| 2016-03-204:59:17 PM | 64.963 | 109.4 | 35.15 | 74.75 |
| 2016-03-204:59:21 PM | 64.85 | 109.4 | 35.038 | 74.75 |
| 2016-03-204:59:25 PM | 64.625 | 109.4 | 35.038 | 74.75 |
| 2016-03-204:59:29 PM | 64.512 | 109.288 | 34.925 | 74.75 |
| 2016-03-204:59:33 PM | 64.287 | 109.175 | 34.925 | 74.75 |
| 2016-03-204:59:37 PM | 64.175 | 109.062 | 34.925 | 74.75 |
| 2016-03-204:59:41 PM | 64.062 | 109.062 | 35.038 | 74.75 |
| 2016-03-204:59:45 PM | 63.95 | 108.95 | 35.038 | 74.75 |
| 2016-03-204:59:49 PM | 63.95 | 108.95 | 35.038 | 74.75 |
| 2016-03-204:59:53 PM | 63.838 | 108.838 | 35.038 | 74.75 |
| 2016-03-204:59:57 PM | 63.838 | 108.838 | 35.038 | 74.75 |
| 2016-03-205:00:00 PM | 63.725 | 108.725 | 34.925 | 74.75 |
| 2016-03-205:00:04 PM | 63.725 | 108.612 | 35.038 | 74.75 |
| 2016-03-205:00:08 PM | 63.838 | 108.612 | 35.038 | 74.75 |
| 2016-03-205:00:12 PM | 63.838 | 108.5 | 35.038 | 74.75 |
| 2016-03-205:00:16 PM | 63.838 | 108.388 | 35.038 | 74.75 |
| 2016-03-205:00:20 PM | 63.95 | 108.275 | 35.038 | 74.75 |
| 2016-03-205:00:24 PM | 64.062 | 108.275 | 35.038 | 74.75 |
| 2016-03-205:00:28 PM | 64.287 | 108.163 | 35.15 | 74.75 |
| 2016-03-205:00:32 PM | 64.287 | 108.05 | 35.15 | 74.75 |
| 2016-03-205:00:36 PM | 64.4 | 108.05 | 35.15 | 74.75 |
| 2016-03-205:00:40 PM | 64.512 | 107.825 | 35.15 | 74.75 |
| 2016-03-205:00:44 PM | 64.512 | 107.825 | 35.15 | 74.75 |
| 2016-03-205:00:48 PM | 64.4 | 107.712 | 35.15 | 74.75 |
| 2016-03-205:00:53 PM | 64.287 | 107.6 | 35.15 | 74.862 |
| 2016-03-205:00:57 PM | 64.175 | 107.488 | 35.15 | 74.862 |
| 2016-03-205:01:01 PM | 64.175 | 107.488 | 35.15 | 74.75 |
| 2016-03-205:01:05 PM | 64.175 | 107.375 | 35.15 | 74.75 |
| 2016-03-205:01:09 PM | 64.175 | 107.262 | 35.15 | 74.75 |
| 2016-03-205:01:13 PM | 64.062 | 107.15 | 35.15 | 74.862 |
| 2016-03-205:01:17 PM | 63.95 | 107.038 | 35.15 | 74.862 |
| 2016-03-205:01:21 PM | 63.838 | 106.925 | 35.038 | 74.862 |
| 2016-03-205:01:25 PM | 63.838 | 106.812 | 34.925 | 74.862 |
| 2016-03-205:01:29 PM | 63.838 | 106.7 | 34.925 | 74.862 |
| 2016-03-205:01:33 PM | 63.725 | 106.588 | 34.812 | 74.75 |
| 2016-03-205:01:37 PM | 63.613 | 106.588 | 34.812 | 74.75 |
| 2016-03-205:01:41 PM | 63.725 | 106.475 | 34.812 | 74.75 |
| 2016-03-205:01:45 PM | 63.725 | 106.362 | 34.812 | 74.75 |
| 2016-03-205:01:49 PM | 63.838 | 106.25 | 34.812 | 74.862 |
| 2016-03-205:01:53 PM | 63.838 | 106.138 | 34.812 | 74.862 |
| 2016-03-205:01:57 PM | 63.95 | 106.025 | 34.812 | 74.862 |
| 2016-03-205:02:01 PM | 64.062 | 105.913 | 34.812 | 74.75 |
| 2016-03-205:02:05 PM | 64.062 | 105.8 | 34.812 | 74.862 |
| 2016-03-205:02:09 PM | 64.062 | 105.688 | 34.812 | 74.862 |
| 2016-03-205:02:13 PM | 63.95 | 105.575 | 34.812 | 74.75 |
| 2016-03-205:02:17 PM | 63.95 | 105.575 | 34.812 | 74.862 |
| 2016-03-205:02:21 PM | 63.838 | 105.462 | 34.7 | 74.75 |
| 2016-03-205:02:25 PM | 63.613 | 105.35 | 34.7 | 74.75 |
| 2016-03-205:02:29 PM | 63.613 | 105.238 | 34.7 | 74.75 |
| 2016-03-205:02:33 PM | 63.5 | 105.125 | 34.7 | 74.75 |
| 2016-03-205:02:37 PM | 63.613 | 105.012 | 34.588 | 74.75 |
| 2016-03-205:02:41 PM | 63.613 | 105.012 | 34.588 | 74.75 |
| 2016-03-205:02:45 PM | 63.613 | 104.9 | 34.475 | 74.75 |
| 2016-03-205:02:49 PM | 63.613 | 104.788 | 34.588 | 74.75 |
| 2016-03-205:02:53 PM | 63.613 | 104.675 | 34.588 | 74.75 |
| 2016-03-205:02:57 PM | 63.725 | 104.562 | 34.588 | 74.75 |
| 2016-03-205:03:01 PM | 63.613 | 104.45 | 34.588 | 74.75 |
| 2016-03-205:03:05 PM | 63.613 | 104.45 | 34.7 | 74.75 |
| 2016-03-205:03:09 PM | 63.5 | 104.338 | 34.7 | 74.75 |
| 2016-03-205:03:13 PM | 63.275 | 104.112 | 34.7 | 74.75 |
| 2016-03-205:03:17 PM | 63.275 | 104.112 | 34.812 | 74.75 |
| 2016-03-205:03:21 PM | 63.275 | 104 | 34.812 | 74.75 |
| 2016-03-205:03:25 PM | 63.275 | 103.888 | 34.812 | 74.75 |
| 2016-03-205:03:29 PM | 63.275 | 103.775 | 34.925 | 74.862 |
| 2016-03-205:03:34 PM | 63.388 | 103.775 | 34.812 | 74.75 |
| 2016-03-205:03:38 PM | 63.388 | 103.663 | 34.925 | 74.75 |
| 2016-03-205:03:42 PM | 63.5 | 103.55 | 34.925 | 74.75 |
| 2016-03-205:03:46 PM | 63.5 | 103.438 | 34.925 | 74.75 |
| 2016-03-205:03:50 PM | 63.5 | 103.325 | 34.925 | 74.75 |
| 2016-03-205:03:54 PM | 63.388 | 103.212 | 34.925 | 74.75 |
| 2016-03-205:03:58 PM | 63.388 | 103.1 | 35.038 | 74.862 |
| 2016-03-205:04:02 PM | 63.388 | 102.988 | 35.038 | 74.862 |
| 2016-03-205:04:06 PM | 63.162 | 102.875 | 35.038 | 74.862 |
| 2016-03-205:04:10 PM | 63.05 | 102.875 | 35.038 | 74.75 |
| 2016-03-205:04:14 PM | 62.938 | 102.762 | 35.038 | 74.75 |
| 2016-03-205:04:18 PM | 62.938 | 102.65 | 35.038 | 74.75 |
| 2016-03-205:04:22 PM | 62.825 | 102.538 | 34.925 | 74.862 |
| 2016-03-205:04:26 PM | 62.825 | 102.538 | 34.925 | 74.75 |
| 2016-03-205:04:30 PM | 62.938 | 102.312 | 34.925 | 74.75 |
| 2016-03-205:04:34 PM | 62.938 | 102.312 | 35.038 | 74.75 |
| 2016-03-205:04:38 PM | 62.938 | 102.2 | 34.925 | 74.75 |
| 2016-03-205:04:42 PM | 62.938 | 102.088 | 35.038 | 74.862 |
| 2016-03-205:04:46 PM | 62.938 | 101.975 | 35.038 | 74.75 |
| 2016-03-205:04:50 PM | 62.825 | 101.862 | 35.038 | 74.75 |
| 2016-03-205:04:54 PM | 62.712 | 101.75 | 35.15 | 74.75 |
| 2016-03-205:04:58 PM | 62.6 | 101.638 | 35.262 | 74.75 |
| 2016-03-205:05:02 PM | 62.6 | 101.525 | 35.262 | 74.75 |
| 2016-03-205:05:06 PM | 62.488 | 101.413 | 35.262 | 74.75 |
| 2016-03-205:05:10 PM | 62.6 | 101.3 | 35.375 | 74.862 |
| 2016-03-205:05:14 PM | 62.6 | 101.3 | 35.375 | 74.862 |
| 2016-03-205:05:18 PM | 62.6 | 101.188 | 35.375 | 74.75 |
| 2016-03-205:05:22 PM | 62.6 | 101.075 | 35.375 | 74.75 |
| 2016-03-205:05:26 PM | 62.6 | 100.962 | 35.488 | 74.75 |
| 2016-03-205:05:30 PM | 62.488 | 100.85 | 35.6 | 74.75 |
| 2016-03-205:05:34 PM | 62.375 | 100.738 | 35.488 | 74.75 |
| 2016-03-205:05:38 PM | 62.262 | 100.625 | 35.6 | 74.862 |
| 2016-03-205:05:42 PM | 62.15 | 100.4 | 35.488 | 74.862 |
| 2016-03-205:05:46 PM | 62.262 | 100.4 | 35.488 | 74.75 |
| 2016-03-205:05:50 PM | 62.375 | 100.175 | 35.488 | 74.75 |
| 2016-03-205:05:54 PM | 62.375 | 100.062 | 35.375 | 74.75 |
| 2016-03-205:05:58 PM | 62.375 | 99.95 | 35.375 | 74.75 |
| 2016-03-205:06:02 PM | 62.375 | 99.838 | 35.375 | 74.75 |
| 2016-03-205:06:06 PM | 62.375 | 99.725 | 35.375 | 74.75 |
| 2016-03-205:06:10 PM | 62.375 | 99.612 | 35.262 | 74.862 |
| 2016-03-205:06:14 PM | 62.375 | 99.5 | 35.262 | 74.75 |
| 2016-03-205:06:18 PM | 62.375 | 99.388 | 35.262 | 74.75 |
| 2016-03-205:06:22 PM | 62.375 | 99.275 | 35.15 | 74.75 |
| 2016-03-205:06:27 PM | 62.488 | 99.05 | 35.15 | 74.862 |
| 2016-03-205:06:31 PM | 62.488 | 98.938 | 35.15 | 74.862 |
| 2016-03-205:06:35 PM | 62.488 | 98.825 | 35.15 | 74.862 |
| 2016-03-205:06:39 PM | 62.488 | 98.712 | 35.15 | 74.862 |
| 2016-03-205:06:43 PM | 62.488 | 98.6 | 35.15 | 74.862 |
| 2016-03-205:06:47 PM | 62.6 | 98.488 | 35.15 | 74.862 |
| 2016-03-205:06:51 PM | 62.6 | 98.262 | 35.15 | 74.862 |
| 2016-03-205:06:55 PM | 62.712 | 98.15 | 35.15 | 74.862 |
| 2016-03-205:06:59 PM | 62.825 | 98.038 | 35.15 | 74.862 |
| 2016-03-205:07:03 PM | 62.938 | 97.925 | 35.15 | 74.862 |
| 2016-03-205:07:07 PM | 62.938 | 97.812 | 35.262 | 74.862 |
| 2016-03-205:07:11 PM | 62.825 | 97.588 | 35.15 | 74.862 |
| 2016-03-205:07:15 PM | 62.825 | 97.475 | 35.15 | 74.862 |
| 2016-03-205:07:19 PM | 62.6 | 97.362 | 35.262 | 74.862 |
| 2016-03-205:07:23 PM | 62.488 | 97.25 | 35.262 | 74.862 |
| 2016-03-205:07:27 PM | 62.262 | 97.025 | 35.262 | 74.862 |
| 2016-03-205:07:31 PM | 62.15 | 96.913 | 35.15 | 74.862 |
| 2016-03-205:07:35 PM | 61.925 | 96.8 | 35.038 | 74.862 |
| 2016-03-205:07:39 PM | 61.588 | 96.688 | 35.038 | 74.862 |
| 2016-03-205:07:43 PM | 61.363 | 96.462 | 35.038 | 74.862 |
| 2016-03-205:07:47 PM | 61.25 | 96.35 | 34.925 | 74.862 |
| 2016-03-205:07:51 PM | 61.138 | 96.238 | 34.925 | 74.862 |
| 2016-03-205:07:55 PM | 61.138 | 96.012 | 35.038 | 74.862 |
| 2016-03-205:07:59 PM | 61.138 | 95.9 | 35.038 | 74.862 |
| 2016-03-205:08:03 PM | 61.138 | 95.788 | 35.038 | 74.862 |
| 2016-03-205:08:07 PM | 61.25 | 95.675 | 35.038 | 74.862 |
| 2016-03-205:08:11 PM | 61.363 | 95.45 | 34.925 | 74.862 |
| 2016-03-205:08:15 PM | 61.363 | 95.338 | 34.925 | 74.862 |
| 2016-03-205:08:19 PM | 61.363 | 95.225 | 34.925 | 74.862 |
| 2016-03-205:08:23 PM | 61.363 | 95.112 | 34.925 | 74.862 |
| 2016-03-205:08:27 PM | 61.363 | 95 | 34.812 | 74.862 |
| 2016-03-205:08:31 PM | 61.363 | 94.888 | 34.812 | 74.862 |
| 2016-03-205:08:35 PM | 61.25 | 94.775 | 34.812 | 74.862 |
| 2016-03-205:08:39 PM | 61.25 | 94.55 | 34.812 | 74.862 |
| 2016-03-205:08:43 PM | 61.138 | 94.438 | 34.812 | 74.862 |
| 2016-03-205:08:47 PM | 61.25 | 94.325 | 34.812 | 74.862 |
| 2016-03-205:08:51 PM | 61.25 | 94.212 | 34.812 | 74.862 |
| 2016-03-205:08:55 PM | 61.25 | 94.1 | 34.925 | 74.862 |
| 2016-03-205:08:59 PM | 61.138 | 93.988 | 34.812 | 74.862 |
| 2016-03-205:09:03 PM | 61.25 | 93.762 | 34.812 | 74.862 |
| 2016-03-205:09:07 PM | 61.363 | 93.65 | 34.925 | 74.75 |
| 2016-03-205:09:11 PM | 61.475 | 93.538 | 34.812 | 74.862 |
| 2016-03-205:09:15 PM | 61.475 | 93.425 | 34.812 | 74.862 |
| 2016-03-205:09:19 PM | 61.7 | 93.312 | 34.812 | 74.862 |
| 2016-03-205:09:23 PM | 61.7 | 93.2 | 34.812 | 74.862 |
| 2016-03-205:09:27 PM | 61.812 | 93.088 | 34.7 | 74.862 |
| 2016-03-205:09:31 PM | 61.925 | 92.862 | 34.7 | 74.862 |
| 2016-03-205:09:35 PM | 61.925 | 92.862 | 34.7 | 74.862 |
| 2016-03-205:09:39 PM | 61.925 | 92.638 | 34.588 | 74.862 |
| 2016-03-205:09:43 PM | 62.038 | 92.525 | 34.588 | 74.862 |
| 2016-03-205:09:47 PM | 62.15 | 92.413 | 34.588 | 74.862 |
| 2016-03-205:09:51 PM | 62.262 | 92.3 | 34.588 | 74.862 |
| 2016-03-205:09:55 PM | 62.262 | 92.188 | 34.588 | 74.862 |
| 2016-03-205:10:00 PM | 62.375 | 91.962 | 34.588 | 74.862 |
| 2016-03-205:10:04 PM | 62.488 | 91.962 | 34.475 | 74.862 |
| 2016-03-205:10:08 PM | 62.488 | 91.85 | 34.475 | 74.862 |
| 2016-03-205:10:12 PM | 62.488 | 91.625 | 34.588 | 74.862 |
| 2016-03-205:10:16 PM | 62.6 | 91.625 | 34.475 | 74.862 |
| 2016-03-205:10:20 PM | 62.712 | 91.4 | 34.588 | 74.862 |
| 2016-03-205:10:24 PM | 62.712 | 91.288 | 34.588 | 74.862 |
| 2016-03-205:10:28 PM | 62.6 | 91.175 | 34.588 | 74.862 |
| 2016-03-205:10:32 PM | 62.6 | 91.062 | 34.475 | 74.862 |
| 2016-03-205:10:36 PM | 62.488 | 90.95 | 34.475 | 74.862 |
| 2016-03-205:10:40 PM | 62.488 | 90.838 | 34.475 | 74.862 |
| 2016-03-205:10:44 PM | 62.375 | 90.725 | 34.475 | 74.862 |
| 2016-03-205:10:48 PM | 62.375 | 90.612 | 34.475 | 74.862 |
| 2016-03-205:10:52 PM | 62.262 | 90.5 | 34.475 | 74.862 |
| 2016-03-205:10:56 PM | 62.262 | 90.388 | 34.475 | 74.862 |
| 2016-03-205:11:00 PM | 62.15 | 90.163 | 34.588 | 74.862 |
| 2016-03-205:11:04 PM | 62.15 | 90.05 | 34.588 | 74.862 |
| 2016-03-205:11:08 PM | 62.15 | 89.938 | 34.475 | 74.862 |
| 2016-03-205:11:12 PM | 62.262 | 89.825 | 34.475 | 74.862 |
| 2016-03-205:11:16 PM | 62.375 | 89.712 | 34.475 | 74.862 |
| 2016-03-205:11:20 PM | 62.375 | 89.488 | 34.475 | 74.862 |
| 2016-03-205:11:24 PM | 62.488 | 89.488 | 34.475 | 74.862 |
| 2016-03-205:11:28 PM | 62.488 | 89.262 | 34.475 | 74.862 |
| 2016-03-205:11:32 PM | 62.488 | 89.15 | 34.475 | 74.862 |
| 2016-03-205:11:36 PM | 62.6 | 89.038 | 34.588 | 74.862 |
| 2016-03-205:11:40 PM | 62.712 | 88.925 | 34.588 | 74.862 |
| 2016-03-205:11:44 PM | 62.825 | 88.812 | 34.588 | 74.862 |
| 2016-03-205:11:48 PM | 62.712 | 88.7 | 34.588 | 74.862 |
| 2016-03-205:11:52 PM | 62.712 | 88.588 | 34.588 | 74.862 |
| 2016-03-205:11:56 PM | 62.712 | 88.362 | 34.588 | 74.862 |
| 2016-03-205:12:00 PM | 62.6 | 88.25 | 34.7 | 74.862 |
| 2016-03-205:12:04 PM | 62.6 | 88.138 | 34.7 | 74.862 |
| 2016-03-205:12:08 PM | 62.488 | 88.025 | 34.7 | 74.862 |
| 2016-03-205:12:12 PM | 62.488 | 87.912 | 34.7 | 74.862 |
| 2016-03-205:12:16 PM | 62.488 | 87.8 | 34.812 | 74.862 |
| 2016-03-205:12:20 PM | 62.6 | 87.688 | 34.812 | 74.862 |
| 2016-03-205:12:24 PM | 62.6 | 87.462 | 34.7 | 74.862 |
| 2016-03-205:12:28 PM | 62.6 | 87.35 | 34.812 | 74.862 |
| 2016-03-205:12:32 PM | 62.488 | 87.238 | 34.812 | 74.862 |
| 2016-03-205:12:36 PM | 62.488 | 87.125 | 34.812 | 74.862 |
| 2016-03-205:12:40 PM | 62.488 | 87.012 | 34.7 | 74.862 |
| 2016-03-205:12:45 PM | 62.375 | 86.9 | 34.812 | 74.862 |
| 2016-03-205:12:49 PM | 62.375 | 86.675 | 34.812 | 74.862 |
| 2016-03-205:12:53 PM | 62.262 | 86.562 | 34.812 | 74.862 |
| 2016-03-205:12:57 PM | 62.262 | 86.45 | 34.812 | 74.862 |
| 2016-03-205:13:01 PM | 62.262 | 86.338 | 34.812 | 74.862 |
| 2016-03-205:13:05 PM | 62.375 | 86.225 | 34.925 | 74.862 |
| 2016-03-205:13:09 PM | 62.375 | 86.112 | 34.812 | 74.862 |
| 2016-03-205:13:13 PM | 62.488 | 86 | 34.812 | 74.862 |
| 2016-03-205:13:17 PM | 62.6 | 85.888 | 34.812 | 74.862 |
| 2016-03-205:13:21 PM | 62.712 | 85.662 | 34.812 | 74.862 |
| 2016-03-205:13:25 PM | 62.712 | 85.662 | 34.812 | 74.862 |
| 2016-03-205:13:29 PM | 62.6 | 85.438 | 34.925 | 74.862 |
| 2016-03-205:13:33 PM | 62.6 | 85.325 | 34.925 | 74.862 |
| 2016-03-205:13:37 PM | 62.6 | 85.212 | 34.925 | 74.75 |
| 2016-03-205:13:41 PM | 62.375 | 85.212 | 34.925 | 74.862 |
| 2016-03-205:13:45 PM | 62.262 | 84.988 | 34.925 | 74.75 |
| 2016-03-205:13:49 PM | 62.15 | 84.875 | 34.925 | 74.75 |
| 2016-03-205:13:53 PM | 62.038 | 84.762 | 34.925 | 74.75 |
| 2016-03-205:13:57 PM | 61.925 | 84.65 | 34.925 | 74.75 |
| 2016-03-205:14:01 PM | 61.925 | 84.538 | 35.038 | 74.75 |
| 2016-03-205:14:05 PM | 61.812 | 84.425 | 34.925 | 74.75 |
| 2016-03-205:14:09 PM | 61.812 | 84.312 | 34.925 | 74.75 |
| 2016-03-205:14:13 PM | 61.812 | 84.2 | 34.925 | 74.75 |
| 2016-03-205:14:17 PM | 61.812 | 84.088 | 34.925 | 74.75 |
| 2016-03-205:14:21 PM | 61.812 | 83.975 | 34.925 | 74.75 |
| 2016-03-205:14:25 PM | 61.925 | 83.862 | 35.038 | 74.75 |
| 2016-03-205:14:29 PM | 62.038 | 83.75 | 35.038 | 74.75 |
| 2016-03-205:14:36 PM | 62.038 | 83.638 | 35.038 | 74.75 |
| 2016-03-205:14:40 PM | 62.038 | 83.525 | 35.038 | 74.75 |
| 2016-03-205:14:44 PM | 62.038 | 83.412 | 34.925 | 74.75 |
| 2016-03-205:14:48 PM | 62.038 | 83.3 | 34.925 | 74.75 |
| 2016-03-205:14:52 PM | 62.038 | 83.188 | 34.925 | 74.75 |
| 2016-03-205:14:56 PM | 62.038 | 83.075 | 34.812 | 74.75 |
| 2016-03-205:15:00 PM | 61.925 | 82.962 | 34.812 | 74.75 |
| 2016-03-205:15:04 PM | 62.038 | 82.85 | 34.812 | 74.75 |
| 2016-03-205:15:08 PM | 62.038 | 82.738 | 34.812 | 74.75 |
| 2016-03-205:15:12 PM | 62.038 | 82.625 | 34.812 | 74.75 |
| 2016-03-205:15:16 PM | 62.15 | 82.512 | 34.7 | 74.75 |
| 2016-03-205:15:21 PM | 62.15 | 82.4 | 34.7 | 74.75 |
| 2016-03-205:15:25 PM | 62.262 | 82.288 | 34.588 | 74.75 |
| 2016-03-205:15:29 PM | 62.262 | 82.175 | 34.588 | 74.75 |
| 2016-03-205:15:33 PM | 62.262 | 82.062 | 34.475 | 74.75 |
| 2016-03-205:15:37 PM | 62.262 | 81.95 | 34.475 | 74.75 |
| 2016-03-205:15:41 PM | 62.262 | 81.838 | 34.475 | 74.638 |
| 2016-03-205:15:45 PM | 62.15 | 81.838 | 34.362 | 74.75 |
| 2016-03-205:15:49 PM | 62.038 | 81.725 | 34.362 | 74.75 |
| 2016-03-205:15:53 PM | 61.812 | 81.5 | 34.362 | 74.638 |
| 2016-03-205:15:57 PM | 61.588 | 81.5 | 34.362 | 74.75 |
| 2016-03-205:16:01 PM | 61.363 | 81.388 | 34.362 | 74.75 |
| 2016-03-205:16:05 PM | 61.25 | 81.275 | 34.25 | 74.638 |
| 2016-03-205:16:09 PM | 61.025 | 81.162 | 34.25 | 74.638 |
| 2016-03-205:16:13 PM | 60.912 | 81.05 | 34.362 | 74.638 |
| 2016-03-205:16:17 PM | 60.688 | 81.05 | 34.362 | 74.638 |
| 2016-03-205:16:21 PM | 60.575 | 80.825 | 34.362 | 74.638 |
| 2016-03-205:16:25 PM | 60.462 | 80.712 | 34.362 | 74.638 |
| 2016-03-205:16:29 PM | 60.238 | 80.712 | 34.475 | 74.638 |
| 2016-03-205:16:33 PM | 60.238 | 80.6 | 34.475 | 74.638 |
| 2016-03-205:16:37 PM | 60.238 | 80.488 | 34.475 | 74.638 |
| 2016-03-205:16:41 PM | 60.238 | 80.375 | 34.475 | 74.75 |
| 2016-03-205:16:45 PM | 60.125 | 80.262 | 34.475 | 74.638 |
| 2016-03-205:16:49 PM | 60.012 | 80.262 | 34.475 | 74.638 |
| 2016-03-205:16:53 PM | 60.012 | 80.15 | 34.475 | 74.638 |
| 2016-03-205:16:57 PM | 59.9 | 80.038 | 34.475 | 74.638 |
| 2016-03-205:17:01 PM | 59.788 | 79.925 | 34.588 | 74.638 |
| 2016-03-205:17:05 PM | 59.675 | 79.812 | 34.588 | 74.638 |
| 2016-03-205:17:09 PM | 59.45 | 79.812 | 34.475 | 74.638 |
| 2016-03-205:17:13 PM | 59.338 | 79.7 | 34.475 | 74.638 |
| 2016-03-205:17:17 PM | 59.112 | 79.588 | 34.475 | 74.638 |
| 2016-03-205:17:21 PM | 58.888 | 79.475 | 34.475 | 74.638 |
| 2016-03-205:17:25 PM | 58.775 | 79.475 | 34.475 | 74.638 |
| 2016-03-205:17:29 PM | 58.55 | 79.362 | 34.475 | 74.638 |
| 2016-03-205:17:33 PM | 58.325 | 79.25 | 34.475 | 74.638 |
| 2016-03-205:17:37 PM | 58.212 | 79.138 | 34.588 | 74.638 |
| 2016-03-205:17:41 PM | 58.1 | 79.025 | 34.588 | 74.638 |
| 2016-03-205:17:45 PM | 57.988 | 79.025 | 34.588 | 74.638 |
| 2016-03-205:17:49 PM | 57.875 | 78.912 | 34.588 | 74.638 |
| 2016-03-205:17:53 PM | 57.762 | 78.8 | 34.588 | 74.638 |
| 2016-03-205:17:57 PM | 57.762 | 78.688 | 34.588 | 74.638 |
| 2016-03-205:18:01 PM | 57.762 | 78.688 | 34.7 | 74.638 |
| 2016-03-205:18:05 PM | 57.762 | 78.575 | 34.588 | 74.638 |
| 2016-03-205:18:09 PM | 57.65 | 78.462 | 34.7 | 74.638 |
| 2016-03-205:18:14 PM | 57.65 | 78.462 | 34.7 | 74.638 |
| 2016-03-205:18:18 PM | 57.538 | 78.35 | 34.7 | 74.638 |
| 2016-03-205:18:22 PM | 57.425 | 78.238 | 34.7 | 74.525 |
| 2016-03-205:18:26 PM | 57.312 | 78.125 | 34.7 | 74.525 |
| 2016-03-205:18:30 PM | 57.2 | 78.125 | 34.7 | 74.525 |
| 2016-03-205:18:34 PM | 57.088 | 78.012 | 34.812 | 74.525 |
| 2016-03-205:18:38 PM | 56.862 | 78.012 | 34.812 | 74.525 |
| 2016-03-205:18:42 PM | 56.75 | 77.9 | 34.812 | 74.525 |
| 2016-03-205:18:46 PM | 56.525 | 77.788 | 34.812 | 74.412 |
| 2016-03-205:18:50 PM | 56.412 | 77.675 | 34.7 | 74.525 |
| 2016-03-205:18:54 PM | 56.3 | 77.675 | 34.7 | 74.525 |
| 2016-03-205:18:58 PM | 56.188 | 77.562 | 34.7 | 74.525 |
| 2016-03-205:19:02 PM | 56.075 | 77.562 | 34.588 | 74.412 |
| 2016-03-205:19:06 PM | 55.962 | 77.45 | 34.475 | 74.525 |
| 2016-03-205:19:10 PM | 55.85 | 77.338 | 34.475 | 74.525 |
| 2016-03-205:19:14 PM | 55.738 | 77.225 | 34.362 | 74.525 |
| 2016-03-205:19:18 PM | 55.625 | 77.225 | 34.475 | 74.412 |
| 2016-03-205:19:22 PM | 55.625 | 77.112 | 34.362 | 74.525 |
| 2016-03-205:19:26 PM | 55.625 | 77.112 | 34.362 | 74.412 |
| 2016-03-205:19:30 PM | 55.625 | 77 | 34.362 | 74.412 |
| 2016-03-205:19:34 PM | 55.738 | 76.888 | 34.475 | 74.412 |
| 2016-03-205:19:38 PM | 55.85 | 76.775 | 34.362 | 74.412 |
| 2016-03-205:19:42 PM | 55.962 | 76.775 | 34.475 | 74.412 |
| 2016-03-205:19:46 PM | 56.075 | 76.662 | 34.362 | 74.412 |
| 2016-03-205:19:50 PM | 56.188 | 76.55 | 34.475 | 74.412 |
| 2016-03-205:19:54 PM | 56.412 | 76.438 | 34.475 | 74.412 |
| 2016-03-205:19:58 PM | 56.525 | 76.438 | 34.475 | 74.412 |
| 2016-03-205:20:02 PM | 56.75 | 76.325 | 34.362 | 74.412 |
| 2016-03-205:20:06 PM | 56.862 | 76.212 | 34.362 | 74.412 |
| 2016-03-205:20:10 PM | 56.975 | 76.212 | 34.25 | 74.412 |
| 2016-03-205:20:14 PM | 56.975 | 76.1 | 34.25 | 74.412 |
| 2016-03-205:20:18 PM | 57.088 | 75.988 | 34.25 | 74.412 |
| 2016-03-205:20:22 PM | 57.2 | 75.988 | 34.25 | 74.412 |
| 2016-03-205:20:26 PM | 57.088 | 75.875 | 34.25 | 74.412 |
| 2016-03-205:20:30 PM | 57.088 | 75.762 | 34.25 | 74.412 |
| 2016-03-205:20:34 PM | 57.088 | 75.65 | 34.25 | 74.412 |
| 2016-03-205:20:38 PM | 56.975 | 75.65 | 34.25 | 74.412 |
| 2016-03-205:20:42 PM | 57.088 | 75.538 | 34.25 | 74.412 |
| 2016-03-205:20:46 PM | 57.2 | 75.538 | 34.138 | 74.412 |
| 2016-03-205:20:50 PM | 57.312 | 75.312 | 34.25 | 74.412 |
| 2016-03-205:20:54 PM | 57.312 | 75.312 | 34.138 | 74.412 |
| 2016-03-205:20:58 PM | 57.425 | 75.2 | 34.138 | 74.412 |
| 2016-03-205:21:03 PM | 57.538 | 75.088 | 34.025 | 74.412 |
| 2016-03-205:21:07 PM | 57.65 | 75.088 | 33.912 | 74.412 |
| 2016-03-205:21:11 PM | 57.762 | 74.975 | 33.912 | 74.412 |
| 2016-03-205:21:15 PM | 57.875 | 74.862 | 33.8 | 74.412 |
| 2016-03-205:21:19 PM | 57.875 | 74.75 | 33.8 | 74.412 |
| 2016-03-205:21:23 PM | 57.988 | 74.75 | 33.688 | 74.412 |
| 2016-03-205:21:27 PM | 57.988 | 74.638 | 33.575 | 74.412 |
| 2016-03-205:21:31 PM | 57.988 | 74.525 | 33.575 | 74.525 |
| 2016-03-205:21:35 PM | 58.1 | 74.412 | 33.575 | 74.525 |
| 2016-03-205:21:39 PM | 58.212 | 74.3 | 33.575 | 74.412 |
| 2016-03-205:21:43 PM | 58.212 | 74.3 | 33.575 | 74.412 |
| 2016-03-205:21:47 PM | 58.325 | 74.188 | 33.575 | 74.412 |
| 2016-03-205:21:51 PM | 58.438 | 74.075 | 33.575 | 74.525 |
| 2016-03-205:21:55 PM | 58.55 | 74.075 | 33.575 | 74.412 |
| 2016-03-205:21:59 PM | 58.662 | 73.85 | 33.575 | 74.525 |
| 2016-03-205:22:03 PM | 58.775 | 73.85 | 33.575 | 74.412 |
| 2016-03-205:22:07 PM | 58.888 | 73.738 | 33.575 | 74.412 |
| 2016-03-205:22:11 PM | 58.888 | 73.625 | 33.462 | 74.412 |
| 2016-03-205:22:15 PM | 59.112 | 73.512 | 33.462 | 74.525 |
| 2016-03-205:22:19 PM | 59.225 | 73.512 | 33.35 | 74.525 |
| 2016-03-205:22:23 PM | 59.225 | 73.4 | 33.35 | 74.412 |
| 2016-03-205:22:27 PM | 59.225 | 73.288 | 33.238 | 74.525 |
| 2016-03-205:22:31 PM | 59.338 | 73.175 | 33.238 | 74.412 |
| 2016-03-205:22:35 PM | 59.45 | 73.175 | 33.238 | 74.412 |
| 2016-03-205:22:39 PM | 59.675 | 73.062 | 33.238 | 74.412 |
| 2016-03-205:22:43 PM | 59.788 | 72.95 | 33.238 | 74.525 |
| 2016-03-205:22:47 PM | 59.788 | 72.838 | 33.238 | 74.525 |
| 2016-03-205:22:51 PM | 59.9 | 72.725 | 33.238 | 74.412 |
| 2016-03-205:22:55 PM | 60.012 | 72.612 | 33.35 | 74.525 |
| 2016-03-205:22:59 PM | 60.125 | 72.5 | 33.35 | 74.412 |
| 2016-03-205:23:03 PM | 60.238 | 72.5 | 33.35 | 74.525 |
| 2016-03-205:23:07 PM | 60.35 | 72.388 | 33.462 | 74.525 |
| 2016-03-205:23:11 PM | 60.462 | 72.275 | 33.575 | 74.412 |
| 2016-03-205:23:15 PM | 60.575 | 72.162 | 33.688 | 74.412 |
| 2016-03-205:23:19 PM | 60.575 | 72.05 | 33.688 | 74.412 |
| 2016-03-205:23:23 PM | 60.688 | 72.05 | 33.688 | 74.412 |
| 2016-03-205:23:27 PM | 60.688 | 71.938 | 33.688 | 74.525 |
| 2016-03-205:23:31 PM | 60.688 | 71.825 | 33.688 | 74.412 |
| 2016-03-205:23:35 PM | 60.8 | 71.712 | 33.688 | 74.525 |
| 2016-03-205:23:39 PM | 60.8 | 71.6 | 33.8 | 74.412 |
| 2016-03-205:23:43 PM | 60.912 | 71.488 | 33.688 | 74.525 |
| 2016-03-205:23:48 PM | 60.912 | 71.488 | 33.688 | 74.525 |
| 2016-03-205:23:52 PM | 60.912 | 71.262 | 33.688 | 74.525 |
| 2016-03-205:23:56 PM | 61.025 | 71.262 | 33.8 | 74.525 |
| 2016-03-205:24:00 PM | 61.025 | 71.15 | 33.8 | 74.525 |
| 2016-03-205:24:04 PM | 61.025 | 71.15 | 33.8 | 74.525 |
| 2016-03-205:24:08 PM | 61.138 | 70.925 | 33.8 | 74.525 |
| 2016-03-205:24:12 PM | 61.138 | 70.812 | 33.912 | 74.525 |
| 2016-03-205:24:16 PM | 61.25 | 70.812 | 33.912 | 74.525 |
| 2016-03-205:24:20 PM | 61.25 | 70.7 | 33.912 | 74.525 |
| 2016-03-205:24:24 PM | 61.363 | 70.588 | 33.8 | 74.525 |
| 2016-03-205:24:28 PM | 61.363 | 70.475 | 33.8 | 74.525 |
| 2016-03-205:24:32 PM | 61.475 | 70.362 | 33.688 | 74.525 |
| 2016-03-205:24:36 PM | 61.475 | 70.25 | 33.688 | 74.525 |
| 2016-03-205:24:40 PM | 61.475 | 70.25 | 33.688 | 74.525 |
| 2016-03-205:24:44 PM | 61.475 | 70.138 | 33.575 | 74.525 |
| 2016-03-205:24:48 PM | 61.363 | 70.025 | 33.575 | 74.525 |
| 2016-03-205:24:52 PM | 61.25 | 69.912 | 33.575 | 74.525 |
| 2016-03-205:24:56 PM | 61.138 | 69.8 | 33.575 | 74.525 |
| 2016-03-205:25:00 PM | 60.912 | 69.8 | 33.575 | 74.525 |
| 2016-03-205:25:04 PM | 60.8 | 69.575 | 33.688 | 74.525 |
| 2016-03-205:25:08 PM | 60.688 | 69.575 | 33.575 | 74.638 |
| 2016-03-205:25:12 PM | 60.575 | 69.462 | 33.575 | 74.525 |
| 2016-03-205:25:16 PM | 60.462 | 69.35 | 33.575 | 74.525 |
| 2016-03-205:25:20 PM | 60.462 | 69.238 | 33.575 | 74.525 |
| 2016-03-205:25:24 PM | 60.35 | 69.238 | 33.462 | 74.525 |
| 2016-03-205:25:28 PM | 60.35 | 69.125 | 33.462 | 74.525 |
| 2016-03-205:25:32 PM | 60.238 | 69.012 | 33.35 | 74.525 |
| 2016-03-205:25:36 PM | 60.238 | 68.9 | 33.35 | 74.525 |
| 2016-03-205:25:40 PM | 60.012 | 68.788 | 33.35 | 74.525 |
| 2016-03-205:25:44 PM | 60.012 | 68.675 | 33.35 | 74.525 |
| 2016-03-205:25:48 PM | 59.9 | 68.675 | 33.238 | 74.412 |
| 2016-03-205:25:52 PM | 59.788 | 68.45 | 33.238 | 74.412 |
| 2016-03-205:25:56 PM | 59.675 | 68.45 | 33.35 | 74.412 |
| 2016-03-205:26:00 PM | 59.562 | 68.338 | 33.462 | 74.412 |
| 2016-03-205:26:04 PM | 59.338 | 68.225 | 33.462 | 74.412 |
| 2016-03-205:26:08 PM | 59.225 | 68.112 | 33.462 | 74.412 |
| 2016-03-205:26:12 PM | 59 | 68 | 33.575 | 74.412 |
| 2016-03-205:26:16 PM | 59 | 68 | 33.575 | 74.412 |
| 2016-03-205:26:20 PM | 58.888 | 67.888 | 33.575 | 74.412 |
| 2016-03-205:26:24 PM | 58.888 | 67.775 | 33.688 | 74.412 |
| 2016-03-205:26:28 PM | 58.888 | 67.662 | 33.688 | 74.412 |
| 2016-03-205:26:32 PM | 58.775 | 67.55 | 33.688 | 74.3 |
| 2016-03-205:26:36 PM | 58.775 | 67.438 | 33.688 | 74.3 |
| 2016-03-205:26:40 PM | 58.775 | 67.325 | 33.575 | 74.3 |
| 2016-03-205:26:44 PM | 58.662 | 67.325 | 33.575 | 74.412 |
| 2016-03-205:26:48 PM | 58.662 | 67.212 | 33.575 | 74.3 |
| 2016-03-205:26:52 PM | 58.55 | 67.1 | 33.575 | 74.412 |
| 2016-03-205:26:56 PM | 58.438 | 66.988 | 33.575 | 74.412 |
| 2016-03-205:27:00 PM | 58.212 | 66.875 | 33.688 | 74.412 |
| 2016-03-205:27:04 PM | 57.988 | 66.762 | 33.688 | 74.412 |
| 2016-03-205:27:08 PM | 57.875 | 66.65 | 33.688 | 74.412 |
| 2016-03-205:27:12 PM | 57.875 | 66.65 | 33.8 | 74.412 |
| 2016-03-205:27:16 PM | 57.875 | 66.538 | 33.688 | 74.412 |
| 2016-03-205:27:20 PM | 57.988 | 66.425 | 33.688 | 74.412 |
| 2016-03-205:27:24 PM | 58.1 | 66.312 | 33.688 | 74.412 |
| 2016-03-205:27:28 PM | 58.1 | 66.312 | 33.688 | 74.412 |
| 2016-03-205:27:32 PM | 58.212 | 66.2 | 33.688 | 74.412 |
| 2016-03-205:27:37 PM | 58.212 | 66.312 | 33.688 | 74.412 |
| 2016-03-205:27:41 PM | 58.212 | 66.312 | 33.575 | 74.412 |
| 2016-03-205:27:45 PM | 58.212 | 66.312 | 33.575 | 74.412 |
| 2016-03-205:27:49 PM | 58.325 | 66.312 | 33.575 | 74.412 |
| 2016-03-205:27:53 PM | 58.438 | 66.425 | 33.688 | 74.412 |
| 2016-03-205:27:57 PM | 58.438 | 66.425 | 33.688 | 74.412 |
| 2016-03-205:28:01 PM | 58.662 | 66.425 | 33.688 | 74.412 |
| 2016-03-205:28:05 PM | 58.775 | 66.538 | 33.575 | 74.412 |
| 2016-03-205:28:09 PM | 58.775 | 66.538 | 33.688 | 74.412 |
| 2016-03-205:28:13 PM | 58.775 | 66.538 | 33.688 | 74.412 |
| 2016-03-205:28:17 PM | 58.662 | 66.65 | 33.688 | 74.412 |
| 2016-03-205:28:21 PM | 58.662 | 66.65 | 33.688 | 74.412 |
| 2016-03-205:28:25 PM | 58.662 | 66.65 | 33.688 | 74.412 |
| 2016-03-205:28:29 PM | 58.662 | 66.762 | 33.575 | 74.412 |
| 2016-03-205:28:33 PM | 58.55 | 66.762 | 33.462 | 74.412 |
| 2016-03-205:28:37 PM | 58.438 | 66.875 | 33.35 | 74.412 |
| 2016-03-205:28:41 PM | 58.438 | 66.875 | 33.35 | 74.412 |
| 2016-03-205:28:45 PM | 58.325 | 66.988 | 33.238 | 74.525 |
| 2016-03-205:28:49 PM | 58.325 | 66.988 | 33.125 | 74.412 |
| 2016-03-205:28:53 PM | 58.325 | 66.988 | 33.125 | 74.412 |
| 2016-03-205:28:57 PM | 58.212 | 67.1 | 33.125 | 74.412 |
| 2016-03-205:29:01 PM | 58.212 | 67.1 | 33.125 | 74.412 |
| 2016-03-205:29:05 PM | 58.1 | 67.212 | 33.125 | 74.412 |
| 2016-03-205:29:09 PM | 58.1 | 67.212 | 33.125 | 74.412 |
| 2016-03-205:29:13 PM | 58.1 | 67.212 | 33.125 | 74.412 |
| 2016-03-205:29:17 PM | 57.875 | 67.325 | 33.012 | 74.412 |
| 2016-03-205:29:21 PM | 57.875 | 67.438 | 33.012 | 74.412 |
| 2016-03-205:29:25 PM | 57.875 | 67.438 | 33.012 | 74.412 |
| 2016-03-205:29:29 PM | 57.875 | 67.55 | 32.9 | 74.412 |
| 2016-03-205:29:33 PM | 57.875 | 67.55 | 32.9 | 74.412 |
| 2016-03-205:29:37 PM | 57.988 | 67.662 | 32.9 | 74.412 |
| 2016-03-205:29:41 PM | 57.875 | 67.662 | 32.788 | 74.525 |
| 2016-03-205:29:45 PM | 57.875 | 67.775 | 32.788 | 74.525 |
| 2016-03-205:29:49 PM | 57.875 | 67.775 | 32.788 | 74.525 |
| 2016-03-205:29:53 PM | 57.988 | 67.888 | 32.675 | 74.412 |
| 2016-03-205:29:57 PM | 58.1 | 68 | 32.675 | 74.412 |
| 2016-03-205:30:01 PM | 58.1 | 68 | 32.675 | 74.525 |
| 2016-03-205:30:06 PM | 58.1 | 68.112 | 32.675 | 74.412 |
| 2016-03-205:30:10 PM | 58.212 | 68.112 | 32.675 | 74.412 |
| 2016-03-205:30:14 PM | 58.212 | 68.338 | 32.675 | 74.412 |
| 2016-03-205:30:18 PM | 58.1 | 68.338 | 32.675 | 74.412 |
| 2016-03-205:30:22 PM | 58.1 | 68.45 | 32.675 | 74.412 |
| 2016-03-205:30:26 PM | 58.1 | 68.45 | 32.675 | 74.412 |
| 2016-03-205:30:30 PM | 57.988 | 68.562 | 32.675 | 74.412 |
| 2016-03-205:30:34 PM | 57.875 | 68.675 | 32.675 | 74.412 |
| 2016-03-205:30:38 PM | 57.65 | 68.675 | 32.675 | 74.412 |
| 2016-03-205:30:42 PM | 57.538 | 68.788 | 32.675 | 74.412 |
| 2016-03-205:30:46 PM | 57.425 | 68.788 | 32.9 | 74.412 |
| 2016-03-205:30:50 PM | 57.425 | 68.9 | 33.012 | 74.412 |
| 2016-03-205:30:54 PM | 57.312 | 69.012 | 33.012 | 74.412 |
| 2016-03-205:30:58 PM | 57.312 | 69.012 | 33.125 | 74.412 |
| 2016-03-205:31:02 PM | 57.425 | 69.125 | 33.125 | 74.412 |
| 2016-03-205:31:06 PM | 57.538 | 69.238 | 33.238 | 74.412 |
| 2016-03-205:31:10 PM | 57.425 | 69.35 | 33.238 | 74.525 |
| 2016-03-205:31:14 PM | 57.312 | 69.35 | 33.35 | 74.525 |
| 2016-03-205:31:18 PM | 57.2 | 69.462 | 33.35 | 74.525 |
| 2016-03-205:31:22 PM | 57.088 | 69.575 | 33.462 | 74.412 |
| 2016-03-205:31:26 PM | 57.088 | 69.688 | 33.575 | 74.412 |
| 2016-03-205:31:30 PM | 57.088 | 69.688 | 33.575 | 74.525 |
| 2016-03-205:31:34 PM | 56.975 | 69.912 | 33.575 | 74.525 |
| 2016-03-205:31:38 PM | 56.975 | 69.912 | 33.688 | 74.525 |
| 2016-03-205:31:42 PM | 56.862 | 70.025 | 33.688 | 74.412 |
| 2016-03-205:31:46 PM | 56.862 | 70.025 | 33.688 | 74.412 |
| 2016-03-205:31:50 PM | 56.975 | 70.25 | 33.688 | 74.525 |
| 2016-03-205:31:54 PM | 57.088 | 70.25 | 33.688 | 74.412 |
| 2016-03-205:31:58 PM | 57.088 | 70.362 | 33.688 | 74.412 |
| 2016-03-205:32:02 PM | 57.2 | 70.475 | 33.688 | 74.412 |
| 2016-03-205:32:06 PM | 57.2 | 70.588 | 33.575 | 74.412 |
| 2016-03-205:32:10 PM | 57.2 | 70.7 | 33.462 | 74.412 |
| 2016-03-205:32:14 PM | 57.2 | 70.812 | 33.462 | 74.412 |
| 2016-03-205:32:18 PM | 57.088 | 70.812 | 33.35 | 74.412 |
| 2016-03-205:32:22 PM | 57.088 | 70.925 | 33.238 | 74.412 |
| 2016-03-205:32:26 PM | 57.2 | 71.038 | 33.238 | 74.412 |
| 2016-03-205:32:31 PM | 57.2 | 71.038 | 33.125 | 74.412 |
| 2016-03-205:32:35 PM | 57.2 | 71.15 | 33.012 | 74.412 |
| 2016-03-205:32:39 PM | 57.312 | 71.262 | 33.012 | 74.412 |
| 2016-03-205:32:43 PM | 57.312 | 71.262 | 33.012 | 74.412 |
| 2016-03-205:32:47 PM | 57.425 | 71.375 | 33.012 | 74.412 |
| 2016-03-205:32:51 PM | 57.425 | 71.488 | 32.9 | 74.412 |
| 2016-03-205:32:55 PM | 57.312 | 71.6 | 33.012 | 74.412 |
| 2016-03-205:33:02 PM | 57.312 | 71.6 | 33.125 | 74.412 |
| 2016-03-205:33:06 PM | 57.312 | 71.712 | 33.125 | 74.412 |
| 2016-03-205:33:10 PM | 57.312 | 71.825 | 33.238 | 74.412 |
| 2016-03-205:33:14 PM | 57.312 | 71.825 | 33.238 | 74.412 |
| 2016-03-205:33:18 PM | 57.088 | 71.938 | 33.125 | 74.412 |
| 2016-03-205:33:22 PM | 56.975 | 72.05 | 33.125 | 74.412 |
| 2016-03-205:33:26 PM | 56.75 | 72.162 | 33.125 | 74.412 |
| 2016-03-205:33:30 PM | 56.638 | 72.162 | 33.238 | 74.412 |
| 2016-03-205:33:35 PM | 56.412 | 72.275 | 33.125 | 74.412 |
| 2016-03-205:33:39 PM | 56.3 | 72.275 | 33.125 | 74.525 |
| 2016-03-205:33:43 PM | 56.188 | 72.388 | 33.238 | 74.412 |
| 2016-03-205:33:47 PM | 56.075 | 72.388 | 33.35 | 74.412 |
| 2016-03-205:33:51 PM | 55.962 | 72.5 | 33.35 | 74.412 |
| 2016-03-205:33:55 PM | 55.962 | 72.5 | 33.35 | 74.412 |
| 2016-03-205:33:59 PM | 55.962 | 72.612 | 33.462 | 74.412 |
| 2016-03-205:34:03 PM | 55.962 | 72.612 | 33.462 | 74.412 |
| 2016-03-205:34:07 PM | 55.962 | 72.725 | 33.35 | 74.412 |
| 2016-03-205:34:11 PM | 55.85 | 72.725 | 33.238 | 74.412 |
| 2016-03-205:34:15 PM | 55.85 | 72.838 | 33.238 | 74.412 |
| 2016-03-205:34:19 PM | 55.738 | 72.95 | 33.238 | 74.412 |
| 2016-03-205:34:23 PM | 55.738 | 72.95 | 33.238 | 74.412 |
| 2016-03-205:34:27 PM | 55.625 | 73.062 | 33.35 | 74.412 |
| 2016-03-205:34:31 PM | 55.512 | 73.062 | 33.35 | 74.3 |
| 2016-03-205:34:35 PM | 55.512 | 73.062 | 33.462 | 74.412 |
| 2016-03-205:34:39 PM | 55.4 | 73.175 | 33.462 | 74.412 |
| 2016-03-205:34:43 PM | 55.288 | 73.175 | 33.462 | 74.412 |
| 2016-03-205:34:47 PM | 55.175 | 73.175 | 33.462 | 74.412 |
| 2016-03-205:34:51 PM | 55.062 | 73.288 | 33.575 | 74.412 |
| 2016-03-205:34:55 PM | 55.062 | 73.288 | 33.575 | 74.412 |
| 2016-03-205:34:59 PM | 54.95 | 73.4 | 33.575 | 74.412 |
| 2016-03-205:35:03 PM | 54.838 | 73.4 | 33.688 | 74.412 |
| 2016-03-205:35:07 PM | 54.725 | 73.4 | 33.575 | 74.412 |
| 2016-03-205:35:11 PM | 54.612 | 73.512 | 33.575 | 74.412 |
| 2016-03-205:35:15 PM | 54.5 | 73.625 | 33.575 | 74.412 |
| 2016-03-205:35:19 PM | 54.388 | 73.625 | 33.575 | 74.3 |
| 2016-03-205:35:23 PM | 54.275 | 73.738 | 33.575 | 74.412 |
| 2016-03-205:35:27 PM | 54.162 | 73.738 | 33.688 | 74.412 |
| 2016-03-205:35:31 PM | 54.162 | 73.85 | 33.688 | 74.412 |
| 2016-03-205:35:35 PM | 54.05 | 73.85 | 33.688 | 74.412 |
| 2016-03-205:35:39 PM | 54.05 | 73.962 | 33.8 | 74.412 |
| 2016-03-205:35:43 PM | 53.938 | 74.075 | 33.688 | 74.412 |
| 2016-03-205:35:47 PM | 53.938 | 74.188 | 33.8 | 74.412 |
| 2016-03-205:35:51 PM | 53.938 | 74.188 | 33.8 | 74.412 |
| 2016-03-205:35:55 PM | 53.938 | 74.188 | 33.912 | 74.412 |
| 2016-03-205:36:00 PM | 53.938 | 74.188 | 33.912 | 74.412 |
| 2016-03-205:36:04 PM | 53.938 | 74.188 | 33.912 | 74.412 |
| 2016-03-205:36:08 PM | 53.938 | 74.188 | 33.912 | 74.412 |
| 2016-03-205:36:12 PM | 53.938 | 74.188 | 33.912 | 74.412 |
| 2016-03-205:36:16 PM | 53.825 | 74.188 | 33.912 | 74.412 |
| 2016-03-205:36:20 PM | 53.825 | 74.3 | 33.912 | 74.412 |
| 2016-03-205:36:24 PM | 53.825 | 74.3 | 33.912 | 74.412 |
| 2016-03-205:36:28 PM | 53.712 | 74.412 | 33.912 | 74.412 |
| 2016-03-205:36:32 PM | 53.712 | 74.525 | 33.912 | 74.412 |
| 2016-03-205:36:36 PM | 53.6 | 74.525 | 34.025 | 74.412 |
| 2016-03-205:36:40 PM | 53.488 | 74.638 | 34.025 | 74.412 |
| 2016-03-205:36:44 PM | 53.488 | 74.75 | 34.025 | 74.412 |
| 2016-03-205:36:48 PM | 53.375 | 74.638 | 34.025 | 74.412 |
| 2016-03-205:36:52 PM | 53.262 | 74.638 | 34.025 | 74.412 |
| 2016-03-205:36:56 PM | 53.15 | 74.75 | 34.025 | 74.525 |
| 2016-03-205:37:00 PM | 53.038 | 74.75 | 34.025 | 74.525 |
| 2016-03-205:37:04 PM | 52.925 | 74.75 | 34.138 | 74.412 |
| 2016-03-205:37:08 PM | 52.925 | 74.975 | 34.138 | 74.412 |
| 2016-03-205:37:12 PM | 52.812 | 74.975 | 34.138 | 74.412 |
| 2016-03-205:37:16 PM | 52.812 | 75.088 | 34.25 | 74.525 |
| 2016-03-205:37:20 PM | 52.7 | 75.088 | 34.138 | 74.412 |
| 2016-03-205:37:24 PM | 52.7 | 75.088 | 34.138 | 74.525 |
| 2016-03-205:37:28 PM | 52.588 | 75.088 | 34.138 | 74.412 |
| 2016-03-205:37:36 PM | 52.588 | 75.088 | 34.25 | 74.412 |
| 2016-03-205:37:40 PM | 52.475 | 75.088 | 34.25 | 74.412 |
| 2016-03-205:37:44 PM | 52.362 | 74.975 | 34.138 | 74.412 |
| 2016-03-205:37:48 PM | 52.362 | 74.975 | 34.25 | 74.412 |
| 2016-03-205:37:52 PM | 52.138 | 75.088 | 34.138 | 74.412 |
| 2016-03-205:37:56 PM | 52.025 | 75.088 | 34.138 | 74.412 |
| 2016-03-205:38:00 PM | 51.912 | 75.2 | 34.138 | 74.412 |
| 2016-03-205:38:04 PM | 51.8 | 75.088 | 34.138 | 74.412 |
| 2016-03-205:38:08 PM | 51.688 | 75.2 | 34.138 | 74.412 |
| 2016-03-205:38:12 PM | 51.575 | 75.2 | 34.25 | 74.412 |
| 2016-03-205:38:16 PM | 51.35 | 75.2 | 34.25 | 74.412 |
| 2016-03-205:38:20 PM | 51.125 | 75.2 | 34.138 | 74.525 |
| 2016-03-205:38:24 PM | 51.012 | 75.2 | 34.138 | 74.525 |
| 2016-03-205:38:28 PM | 50.9 | 75.2 | 34.25 | 74.525 |
| 2016-03-205:38:32 PM | 50.788 | 75.312 | 34.25 | 74.525 |
| 2016-03-205:38:37 PM | 50.788 | 75.312 | 34.25 | 74.525 |
| 2016-03-205:38:41 PM | 50.788 | 75.425 | 34.25 | 74.525 |
| 2016-03-205:38:45 PM | 50.675 | 75.425 | 34.25 | 74.525 |
| 2016-03-205:38:49 PM | 50.675 | 75.538 | 34.25 | 74.525 |
| 2016-03-205:38:53 PM | 50.562 | 75.425 | 34.25 | 74.525 |
| 2016-03-205:38:57 PM | 50.45 | 75.538 | 34.25 | 74.638 |
| 2016-03-205:39:01 PM | 50.45 | 75.538 | 34.25 | 74.638 |
| 2016-03-205:39:05 PM | 50.225 | 75.538 | 34.138 | 74.638 |
| 2016-03-205:39:09 PM | 50.112 | 75.65 | 34.025 | 74.638 |
| 2016-03-205:39:13 PM | 49.888 | 75.65 | 34.025 | 74.75 |
| 2016-03-205:39:17 PM | 49.775 | 75.65 | 34.025 | 74.638 |
| 2016-03-205:39:21 PM | 49.662 | 75.65 | 34.025 | 74.638 |
| 2016-03-205:39:25 PM | 49.55 | 75.65 | 34.025 | 74.75 |
| 2016-03-205:39:29 PM | 49.55 | 75.762 | 34.025 | 74.638 |
| 2016-03-205:39:33 PM | 49.438 | 75.762 | 34.025 | 74.75 |
| 2016-03-205:39:37 PM | 49.212 | 75.762 | 34.025 | 74.75 |
| 2016-03-205:39:41 PM | 48.988 | 75.762 | 34.025 | 74.75 |
| 2016-03-205:39:45 PM | 48.762 | 75.875 | 34.025 | 74.75 |
| 2016-03-205:39:49 PM | 48.538 | 75.875 | 34.138 | 74.75 |
| 2016-03-205:39:53 PM | 48.425 | 75.875 | 34.138 | 74.75 |
| 2016-03-205:39:57 PM | 48.312 | 75.875 | 34.138 | 74.75 |
| 2016-03-205:40:01 PM | 48.088 | 75.988 | 34.138 | 74.75 |
| 2016-03-205:40:05 PM | 47.975 | 75.988 | 34.138 | 74.75 |
| 2016-03-205:40:09 PM | 47.75 | 75.988 | 34.138 | 74.75 |
| 2016-03-205:40:13 PM | 47.638 | 75.988 | 34.138 | 74.75 |
| 2016-03-205:40:17 PM | 47.3 | 75.988 | 34.25 | 74.75 |
| 2016-03-205:40:21 PM | 47.188 | 76.1 | 34.25 | 74.75 |
| 2016-03-205:40:25 PM | 46.962 | 76.212 | 34.25 | 74.862 |
| 2016-03-205:40:29 PM | 46.85 | 76.212 | 34.25 | 74.75 |
| 2016-03-205:40:33 PM | 46.738 | 76.212 | 34.25 | 74.862 |
| 2016-03-205:40:37 PM | 46.625 | 76.325 | 34.138 | 74.862 |
| 2016-03-205:40:42 PM | 46.512 | 76.325 | 34.138 | 74.862 |
| 2016-03-205:40:46 PM | 46.512 | 76.325 | 34.25 | 74.862 |
| 2016-03-205:40:50 PM | 46.4 | 76.438 | 34.25 | 74.862 |
| 2016-03-205:40:54 PM | 46.4 | 76.438 | 34.138 | 74.862 |
| 2016-03-205:40:58 PM | 46.4 | 76.438 | 34.138 | 74.862 |
| 2016-03-205:41:02 PM | 46.288 | 76.438 | 34.138 | 74.862 |
| 2016-03-205:41:06 PM | 46.288 | 76.55 | 34.025 | 74.862 |
| 2016-03-205:41:10 PM | 46.288 | 76.55 | 34.025 | 74.862 |
| 2016-03-205:41:14 PM | 46.175 | 76.55 | 34.025 | 74.862 |
| 2016-03-205:41:18 PM | 46.175 | 76.55 | 33.912 | 74.862 |
| 2016-03-205:41:22 PM | 46.062 | 76.662 | 33.912 | 74.862 |
| 2016-03-205:41:26 PM | 46.062 | 76.55 | 33.8 | 74.862 |
| 2016-03-205:41:30 PM | 46.062 | 76.662 | 33.688 | 74.862 |
| 2016-03-205:41:34 PM | 46.062 | 76.662 | 33.8 | 74.862 |
| 2016-03-205:41:38 PM | 46.062 | 76.662 | 33.8 | 74.862 |
| 2016-03-205:41:42 PM | 45.95 | 76.662 | 33.8 | 74.862 |
| 2016-03-205:41:46 PM | 45.838 | 76.775 | 33.8 | 74.975 |
| 2016-03-205:41:50 PM | 45.725 | 76.775 | 33.912 | 74.975 |
| 2016-03-205:41:54 PM | 45.725 | 76.775 | 33.8 | 74.862 |
| 2016-03-205:41:58 PM | 45.725 | 76.888 | 33.8 | 74.975 |
| 2016-03-205:42:02 PM | 45.725 | 76.888 | 33.8 | 74.975 |
| 2016-03-205:42:06 PM | 45.612 | 76.888 | 33.8 | 74.975 |
| 2016-03-205:42:10 PM | 45.612 | 76.888 | 33.8 | 74.975 |
| 2016-03-205:42:14 PM | 45.612 | 77 | 33.8 | 74.975 |
| 2016-03-205:42:19 PM | 45.5 | 77 | 33.8 | 74.862 |
| 2016-03-205:42:23 PM | 45.5 | 77 | 33.8 | 74.862 |
| 2016-03-205:42:27 PM | 45.388 | 77.112 | 33.8 | 74.975 |
| 2016-03-205:42:31 PM | 45.388 | 77.112 | 33.912 | 74.975 |
| 2016-03-205:42:35 PM | 45.388 | 77.112 | 33.912 | 74.862 |
| 2016-03-205:42:39 PM | 45.275 | 77.112 | 33.912 | 74.975 |
| 2016-03-205:42:43 PM | 45.162 | 77.225 | 33.8 | 74.862 |
| 2016-03-205:42:47 PM | 45.162 | 77.225 | 33.8 | 74.975 |
| 2016-03-205:42:51 PM | 45.162 | 77.225 | 33.8 | 74.975 |
| 2016-03-205:42:55 PM | 45.05 | 77.225 | 33.8 | 74.975 |
| 2016-03-205:42:59 PM | 45.05 | 77.225 | 33.912 | 74.975 |
| 2016-03-205:43:03 PM | 44.938 | 77.225 | 33.8 | 74.975 |
| 2016-03-205:43:07 PM | 44.938 | 77.225 | 33.912 | 74.975 |
| 2016-03-205:43:11 PM | 44.938 | 77.338 | 33.912 | 74.862 |
| 2016-03-205:43:15 PM | 44.825 | 77.338 | 33.912 | 74.862 |
| 2016-03-205:43:19 PM | 44.825 | 77.338 | 33.8 | 74.862 |
| 2016-03-205:43:23 PM | 44.712 | 77.338 | 33.8 | 74.862 |
| 2016-03-205:43:27 PM | 44.712 | 77.338 | 33.688 | 74.862 |
| 2016-03-205:43:31 PM | 44.6 | 77.338 | 33.688 | 74.862 |
| 2016-03-205:43:35 PM | 44.488 | 77.338 | 33.575 | 74.862 |
| 2016-03-205:43:39 PM | 44.375 | 77.338 | 33.575 | 74.862 |
| 2016-03-205:43:43 PM | 44.375 | 77.338 | 33.575 | 74.975 |
| 2016-03-205:43:47 PM | 44.262 | 77.338 | 33.575 | 74.862 |
| 2016-03-205:43:51 PM | 44.15 | 77.338 | 33.462 | 74.975 |
| 2016-03-205:43:55 PM | 44.15 | 77.338 | 33.462 | 74.862 |
| 2016-03-205:44:00 PM | 44.15 | 77.338 | 33.462 | 74.975 |
| 2016-03-205:44:04 PM | 44.038 | 77.338 | 33.35 | 74.862 |
| 2016-03-205:44:08 PM | 44.15 | 77.338 | 33.35 | 74.862 |
| 2016-03-205:44:12 PM | 44.15 | 77.338 | 33.35 | 74.862 |
| 2016-03-205:44:16 PM | 44.15 | 77.338 | 33.35 | 74.862 |
| 2016-03-205:44:20 PM | 44.15 | 77.338 | 33.35 | 74.862 |
| 2016-03-205:44:24 PM | 44.15 | 77.225 | 33.35 | 74.862 |
| 2016-03-205:44:28 PM | 44.15 | 77.225 | 33.35 | 74.862 |
| 2016-03-205:44:32 PM | 44.15 | 77.225 | 33.35 | 74.975 |
| 2016-03-205:44:36 PM | 44.262 | 77.112 | 33.462 | 74.975 |
| 2016-03-205:44:40 PM | 44.15 | 77 | 33.462 | 74.975 |
| 2016-03-205:44:44 PM | 44.262 | 77 | 33.462 | 74.862 |
| 2016-03-205:44:48 PM | 44.15 | 77 | 33.462 | 74.975 |
| 2016-03-205:44:52 PM | 44.262 | 77 | 33.35 | 74.975 |
| 2016-03-205:44:56 PM | 44.15 | 77 | 33.238 | 74.975 |
| 2016-03-205:45:00 PM | 44.15 | 76.888 | 33.238 | 74.975 |
| 2016-03-205:45:04 PM | 44.262 | 76.775 | 33.238 | 74.862 |
| 2016-03-205:45:08 PM | 44.262 | 76.662 | 33.238 | 74.862 |
| 2016-03-205:45:12 PM | 44.262 | 76.55 | 33.238 | 74.975 |
| 2016-03-205:45:16 PM | 44.15 | 76.55 | 33.238 | 74.862 |
| 2016-03-205:45:20 PM | 44.15 | 76.438 | 33.238 | 74.975 |
| 2016-03-205:45:24 PM | 44.15 | 76.325 | 33.125 | 74.862 |
| 2016-03-205:45:28 PM | 44.038 | 76.212 | 33.125 | 74.975 |
| 2016-03-205:45:32 PM | 44.038 | 76.1 | 33.125 | 74.975 |
| 2016-03-205:45:36 PM | 44.038 | 75.988 | 33.125 | 74.975 |
| 2016-03-205:45:40 PM | 44.038 | 75.875 | 33.012 | 74.975 |
| 2016-03-205:45:44 PM | 43.925 | 75.762 | 33.012 | 74.975 |
| 2016-03-205:45:49 PM | 44.038 | 75.65 | 33.012 | 74.975 |
| 2016-03-205:45:53 PM | 43.925 | 75.65 | 33.012 | 74.975 |
| 2016-03-205:45:57 PM | 43.925 | 75.538 | 33.012 | 74.975 |
| 2016-03-205:46:01 PM | 43.925 | 75.425 | 32.788 | 74.975 |
| 2016-03-205:46:05 PM | 43.812 | 75.312 | 32.788 | 74.975 |
| 2016-03-205:46:09 PM | 43.812 | 75.088 | 32.788 | 74.975 |
| 2016-03-205:46:13 PM | 43.812 | 75.088 | 32.675 | 74.975 |
| 2016-03-205:46:17 PM | 43.7 | 74.975 | 32.562 | 74.975 |
| 2016-03-205:46:21 PM | 43.7 | 74.862 | 32.562 | 74.975 |
| 2016-03-205:46:25 PM | 43.588 | 74.75 | 32.562 | 74.975 |
| 2016-03-205:46:29 PM | 43.475 | 74.638 | 32.562 | 74.975 |
| 2016-03-205:46:33 PM | 43.362 | 74.525 | 32.562 | 74.975 |
| 2016-03-205:46:37 PM | 43.362 | 74.525 | 32.562 | 74.862 |
| 2016-03-205:46:41 PM | 43.362 | 74.412 | 32.562 | 74.862 |
| 2016-03-205:46:45 PM | 43.362 | 74.188 | 32.562 | 74.975 |
| 2016-03-205:46:49 PM | 43.25 | 74.075 | 32.562 | 74.975 |
| 2016-03-205:46:53 PM | 43.25 | 73.962 | 32.675 | 74.975 |
| 2016-03-205:46:57 PM | 43.25 | 73.85 | 32.562 | 74.975 |
| 2016-03-205:47:01 PM | 43.138 | 73.738 | 32.562 | 74.975 |
| 2016-03-205:47:05 PM | 43.138 | 73.738 | 32.675 | 74.975 |
| 2016-03-205:47:09 PM | 43.138 | 73.625 | 32.675 | 74.975 |
| 2016-03-205:47:13 PM | 43.025 | 73.512 | 32.675 | 74.975 |
| 2016-03-205:47:17 PM | 43.025 | 73.512 | 32.675 | 74.975 |
| 2016-03-205:47:21 PM | 43.025 | 73.288 | 32.788 | 74.975 |
| 2016-03-205:47:25 PM | 43.025 | 73.175 | 32.788 | 74.975 |
| 2016-03-205:47:29 PM | 42.912 | 73.062 | 32.788 | 74.975 |
| 2016-03-205:47:33 PM | 42.912 | 72.95 | 32.675 | 74.975 |
| 2016-03-205:47:38 PM | 42.912 | 72.838 | 32.675 | 74.975 |
| 2016-03-205:47:42 PM | 42.8 | 72.725 | 32.788 | 74.975 |
| 2016-03-205:47:46 PM | 42.8 | 72.5 | 32.788 | 74.975 |
| 2016-03-205:47:50 PM | 42.8 | 72.388 | 32.675 | 74.975 |
| 2016-03-205:47:54 PM | 42.688 | 72.388 | 32.675 | 74.975 |
| 2016-03-205:47:58 PM | 42.688 | 72.275 | 32.788 | 74.975 |
| 2016-03-205:48:02 PM | 42.688 | 72.275 | 32.675 | 74.862 |
| 2016-03-205:48:06 PM | 42.688 | 72.162 | 32.788 | 74.975 |
| 2016-03-205:48:10 PM | 42.575 | 72.162 | 32.675 | 74.975 |
| 2016-03-205:48:14 PM | 42.575 | 72.05 | 32.788 | 74.975 |
| 2016-03-205:48:18 PM | 42.575 | 71.938 | 32.675 | 74.975 |
| 2016-03-205:48:22 PM | 42.575 | 71.938 | 32.788 | 74.975 |
| 2016-03-205:48:26 PM | 42.575 | 71.825 | 32.788 | 74.975 |
| 2016-03-205:48:30 PM | 42.462 | 71.712 | 32.788 | 74.975 |
| 2016-03-205:48:34 PM | 42.462 | 71.488 | 32.9 | 74.975 |
| 2016-03-205:48:38 PM | 42.462 | 71.375 | 32.9 | 74.975 |
| 2016-03-205:48:42 PM | 42.462 | 71.262 | 32.9 | 74.975 |
| 2016-03-205:48:46 PM | 42.462 | 71.15 | 32.9 | 74.975 |
| 2016-03-205:48:50 PM | 42.462 | 71.038 | 32.788 | 74.975 |
| 2016-03-205:48:54 PM | 42.462 | 70.812 | 32.788 | 74.975 |
| 2016-03-205:48:58 PM | 42.462 | 70.812 | 32.788 | 74.975 |
| 2016-03-205:49:02 PM | 42.462 | 70.7 | 32.9 | 74.975 |
| 2016-03-205:49:06 PM | 42.462 | 70.588 | 32.9 | 74.975 |
| 2016-03-205:49:11 PM | 42.462 | 70.475 | 32.9 | 74.975 |
| 2016-03-205:49:15 PM | 42.575 | 70.362 | 33.012 | 74.975 |
| 2016-03-205:49:19 PM | 42.575 | 70.362 | 33.012 | 74.975 |
| 2016-03-205:49:23 PM | 42.575 | 70.25 | 33.012 | 74.975 |
| 2016-03-205:49:27 PM | 42.575 | 70.138 | 32.9 | 74.975 |
| 2016-03-205:49:31 PM | 42.688 | 70.025 | 32.9 | 74.975 |
| 2016-03-205:49:35 PM | 42.688 | 69.912 | 32.9 | 74.975 |
| 2016-03-205:49:39 PM | 42.688 | 69.8 | 32.9 | 74.975 |
| 2016-03-205:49:43 PM | 42.688 | 69.8 | 32.9 | 74.975 |
| 2016-03-205:49:47 PM | 42.688 | 69.688 | 32.9 | 74.975 |
| 2016-03-205:49:51 PM | 42.688 | 69.575 | 32.9 | 74.975 |
| 2016-03-205:49:55 PM | 42.688 | 69.462 | 32.9 | 74.975 |
| 2016-03-205:49:59 PM | 42.688 | 69.35 | 32.9 | 74.975 |
| 2016-03-205:50:03 PM | 42.688 | 69.238 | 33.012 | 74.975 |
| 2016-03-205:50:07 PM | 42.8 | 69.238 | 33.012 | 74.975 |
| 2016-03-205:50:11 PM | 42.688 | 69.125 | 32.9 | 74.975 |
| 2016-03-205:50:15 PM | 42.688 | 69.012 | 32.9 | 74.975 |
| 2016-03-205:50:19 PM | 42.688 | 69.012 | 33.012 | 74.975 |
| 2016-03-205:50:23 PM | 42.688 | 68.9 | 32.9 | 74.975 |
| 2016-03-205:50:27 PM | 42.688 | 68.788 | 32.9 | 74.975 |
| 2016-03-205:50:31 PM | 42.688 | 68.675 | 32.9 | 74.975 |
| 2016-03-205:50:35 PM | 42.688 | 68.675 | 32.9 | 75.088 |
| 2016-03-205:50:39 PM | 42.688 | 68.675 | 32.788 | 75.088 |
| 2016-03-205:50:43 PM | 42.688 | 68.562 | 32.788 | 74.975 |
| 2016-03-205:50:47 PM | 42.575 | 68.45 | 32.675 | 74.975 |
| 2016-03-205:50:51 PM | 42.688 | 68.45 | 32.675 | 74.975 |
| 2016-03-205:50:55 PM | 42.688 | 68.45 | 32.675 | 74.975 |
| 2016-03-205:50:59 PM | 42.575 | 68.338 | 32.562 | 74.975 |
| 2016-03-205:51:04 PM | 42.575 | 68.225 | 32.675 | 74.975 |
| 2016-03-205:51:08 PM | 42.575 | 68.225 | 32.675 | 74.975 |
| 2016-03-205:51:12 PM | 42.575 | 68.112 | 32.562 | 74.975 |
| 2016-03-205:51:16 PM | 42.575 | 68.112 | 32.562 | 74.975 |
| 2016-03-205:51:20 PM | 42.575 | 68 | 32.562 | 74.975 |
| 2016-03-205:51:24 PM | 42.462 | 67.888 | 32.562 | 74.975 |
| 2016-03-205:51:28 PM | 42.462 | 67.888 | 32.562 | 74.862 |
| 2016-03-205:51:32 PM | 42.35 | 67.775 | 32.562 | 74.862 |
| 2016-03-205:51:36 PM | 42.35 | 67.775 | 32.562 | 74.975 |
| 2016-03-205:51:40 PM | 42.238 | 67.662 | 32.562 | 74.862 |
| 2016-03-205:51:44 PM | 42.238 | 67.55 | 32.675 | 74.975 |
| 2016-03-205:51:48 PM | 42.125 | 67.55 | 32.562 | 74.975 |
| 2016-03-205:51:52 PM | 42.125 | 67.55 | 32.675 | 74.975 |
| 2016-03-205:51:56 PM | 42.125 | 67.438 | 32.675 | 74.862 |
| 2016-03-205:52:00 PM | 42.125 | 67.325 | 32.675 | 74.975 |
| 2016-03-205:52:04 PM | 42.012 | 67.325 | 32.675 | 74.862 |
| 2016-03-205:52:08 PM | 41.9 | 67.325 | 32.675 | 74.975 |
| 2016-03-205:52:12 PM | 41.9 | 67.212 | 32.788 | 74.975 |
| 2016-03-205:52:16 PM | 41.9 | 67.212 | 32.788 | 74.862 |
| 2016-03-205:52:24 PM | 41.788 | 67.1 | 32.788 | 74.975 |
| 2016-03-205:52:28 PM | 41.788 | 66.988 | 32.788 | 74.862 |
| 2016-03-205:52:32 PM | 41.675 | 66.875 | 32.788 | 74.975 |
| 2016-03-205:52:36 PM | 41.675 | 66.875 | 32.788 | 74.862 |
| 2016-03-205:52:40 PM | 41.562 | 66.762 | 32.788 | 74.975 |
| 2016-03-205:52:44 PM | 41.562 | 66.762 | 32.788 | 74.862 |
| 2016-03-205:52:48 PM | 41.562 | 66.65 | 32.788 | 74.862 |
| 2016-03-205:52:52 PM | 41.562 | 66.65 | 32.675 | 74.862 |
| 2016-03-205:53:00 PM | 41.45 | 66.538 | 32.675 | 74.975 |
| 2016-03-205:53:05 PM | 41.45 | 66.425 | 32.675 | 74.862 |
| 2016-03-205:53:09 PM | 41.45 | 66.425 | 32.675 | 74.862 |
| 2016-03-205:53:13 PM | 41.338 | 66.425 | 32.675 | 74.862 |
| 2016-03-205:53:17 PM | 41.338 | 66.312 | 32.562 | 74.862 |
| 2016-03-205:53:21 PM | 41.225 | 66.312 | 32.675 | 74.862 |
| 2016-03-205:53:25 PM | 41.225 | 66.312 | 32.675 | 74.975 |
| 2016-03-205:53:29 PM | 41.225 | 66.2 | 32.675 | 74.975 |
| 2016-03-205:53:33 PM | 41.225 | 66.088 | 32.675 | 74.975 |
| 2016-03-205:53:37 PM | 41.225 | 66.088 | 32.675 | 74.975 |
| 2016-03-205:53:41 PM | 41.225 | 66.088 | 32.675 | 74.975 |
| 2016-03-205:53:45 PM | 41.112 | 65.975 | 32.675 | 74.975 |
| 2016-03-205:53:49 PM | 41.225 | 65.975 | 32.675 | 74.975 |
| 2016-03-205:53:53 PM | 41.112 | 65.975 | 32.675 | 74.975 |
| 2016-03-205:53:57 PM | 41.112 | 65.975 | 32.788 | 74.975 |
| 2016-03-205:54:01 PM | 41.112 | 65.862 | 32.788 | 74.975 |
| 2016-03-205:54:05 PM | 41.112 | 65.75 | 32.788 | 74.862 |
| 2016-03-205:54:09 PM | 41 | 65.75 | 32.788 | 74.862 |
| 2016-03-205:54:13 PM | 41 | 65.75 | 32.9 | 74.862 |
| 2016-03-205:54:17 PM | 40.888 | 65.638 | 32.788 | 74.862 |
| 2016-03-205:54:21 PM | 40.775 | 65.638 | 32.9 | 74.862 |
| 2016-03-205:54:25 PM | 40.775 | 65.525 | 33.012 | 74.975 |
| 2016-03-205:54:29 PM | 40.775 | 65.525 | 33.012 | 74.862 |
| 2016-03-205:54:33 PM | 40.662 | 65.525 | 33.125 | 74.975 |
| 2016-03-205:54:37 PM | 40.662 | 65.412 | 33.125 | 74.862 |
| 2016-03-205:54:41 PM | 40.55 | 65.412 | 33.125 | 74.862 |
| 2016-03-205:54:45 PM | 40.55 | 65.3 | 33.125 | 74.862 |
| 2016-03-205:54:49 PM | 40.55 | 65.3 | 33.125 | 74.975 |
| 2016-03-205:54:53 PM | 40.438 | 65.3 | 33.125 | 74.862 |
| 2016-03-205:54:57 PM | 40.438 | 65.188 | 33.238 | 74.862 |
| 2016-03-205:55:01 PM | 40.438 | 65.188 | 33.238 | 74.862 |
| 2016-03-205:55:05 PM | 40.438 | 65.075 | 33.238 | 74.862 |
| 2016-03-205:55:09 PM | 40.438 | 65.075 | 33.238 | 74.862 |
| 2016-03-205:55:14 PM | 40.438 | 64.963 | 33.35 | 74.862 |
| 2016-03-205:55:18 PM | 40.438 | 64.963 | 33.462 | 74.862 |
| 2016-03-205:55:22 PM | 40.325 | 64.963 | 33.575 | 74.862 |
| 2016-03-205:55:26 PM | 40.212 | 64.85 | 33.688 | 74.862 |
| 2016-03-205:55:30 PM | 40.212 | 64.85 | 33.688 | 74.862 |
| 2016-03-205:55:34 PM | 40.212 | 64.738 | 33.688 | 74.862 |
| 2016-03-205:55:38 PM | 40.212 | 64.738 | 33.688 | 74.862 |
| 2016-03-205:55:42 PM | 40.1 | 64.625 | 33.8 | 74.862 |
| 2016-03-205:55:46 PM | 40.1 | 64.625 | 33.688 | 74.862 |
| 2016-03-205:55:50 PM | 40.1 | 64.512 | 33.8 | 74.862 |
| 2016-03-205:55:54 PM | 40.1 | 64.512 | 33.912 | 74.862 |
| 2016-03-205:55:58 PM | 40.1 | 64.4 | 33.912 | 74.862 |
| 2016-03-205:56:02 PM | 40.1 | 64.4 | 34.025 | 74.862 |
| 2016-03-205:56:06 PM | 39.988 | 64.287 | 34.025 | 74.862 |
| 2016-03-205:56:10 PM | 39.988 | 64.287 | 34.025 | 74.862 |
| 2016-03-205:56:14 PM | 39.988 | 64.175 | 34.025 | 74.862 |
| 2016-03-205:56:18 PM | 39.988 | 64.175 | 34.138 | 74.862 |
| 2016-03-205:56:22 PM | 39.875 | 64.062 | 34.138 | 74.862 |
| 2016-03-205:56:26 PM | 39.762 | 64.062 | 34.25 | 74.862 |
| 2016-03-205:56:30 PM | 39.762 | 63.95 | 34.25 | 74.862 |
| 2016-03-205:56:34 PM | 39.762 | 63.838 | 34.25 | 74.862 |
| 2016-03-205:56:38 PM | 39.762 | 63.838 | 34.362 | 74.862 |
| 2016-03-205:56:42 PM | 39.762 | 63.725 | 34.362 | 74.975 |
| 2016-03-205:56:46 PM | 39.65 | 63.725 | 34.362 | 74.975 |
| 2016-03-205:56:50 PM | 39.65 | 63.613 | 34.362 | 74.975 |
| 2016-03-205:56:54 PM | 39.65 | 63.613 | 34.362 | 74.975 |
| 2016-03-205:56:58 PM | 39.65 | 63.5 | 34.362 | 74.975 |
| 2016-03-205:57:02 PM | 39.538 | 63.5 | 34.362 | 74.975 |
| 2016-03-205:57:07 PM | 39.538 | 63.388 | 34.475 | 74.975 |
| 2016-03-205:57:11 PM | 39.65 | 63.388 | 34.475 | 74.975 |
| 2016-03-205:57:15 PM | 39.538 | 63.162 | 34.475 | 74.975 |
| 2016-03-205:57:19 PM | 39.538 | 63.162 | 34.475 | 74.975 |
| 2016-03-205:57:23 PM | 39.425 | 63.05 | 34.475 | 74.975 |
| 2016-03-205:57:27 PM | 39.538 | 63.05 | 34.475 | 74.975 |
| 2016-03-205:57:31 PM | 39.425 | 62.938 | 34.588 | 74.862 |
| 2016-03-205:57:35 PM | 39.538 | 62.825 | 34.588 | 74.862 |
| 2016-03-205:57:39 PM | 39.538 | 62.712 | 34.588 | 74.862 |
| 2016-03-205:57:43 PM | 39.538 | 62.712 | 34.588 | 74.862 |
| 2016-03-205:57:47 PM | 39.538 | 62.6 | 34.7 | 74.862 |
| 2016-03-205:57:51 PM | 39.538 | 62.488 | 34.7 | 74.975 |
| 2016-03-205:57:55 PM | 39.538 | 62.375 | 34.7 | 74.862 |
| 2016-03-205:57:59 PM | 39.65 | 62.375 | 34.7 | 74.862 |
| 2016-03-205:58:03 PM | 39.65 | 62.262 | 34.812 | 74.862 |
| 2016-03-205:58:07 PM | 39.65 | 62.15 | 34.812 | 74.862 |
| 2016-03-205:58:11 PM | 39.65 | 62.038 | 34.925 | 74.862 |
| 2016-03-205:58:15 PM | 39.65 | 61.925 | 34.925 | 74.862 |
| 2016-03-205:58:19 PM | 39.65 | 61.812 | 34.925 | 74.862 |
| 2016-03-205:58:23 PM | 39.65 | 61.812 | 35.038 | 74.862 |
| 2016-03-205:58:27 PM | 39.65 | 61.7 | 35.038 | 74.862 |
| 2016-03-205:58:31 PM | 39.65 | 61.7 | 35.038 | 74.862 |
| 2016-03-205:58:35 PM | 39.65 | 61.588 | 35.038 | 74.862 |
| 2016-03-205:58:39 PM | 39.65 | 61.475 | 35.038 | 74.862 |
| 2016-03-205:58:43 PM | 39.65 | 61.363 | 35.15 | 74.862 |
| 2016-03-205:58:47 PM | 39.65 | 61.25 | 35.038 | 74.862 |
| 2016-03-205:58:51 PM | 39.65 | 61.25 | 35.038 | 74.862 |
| 2016-03-205:58:55 PM | 39.65 | 61.138 | 35.038 | 74.862 |
| 2016-03-205:59:00 PM | 39.65 | 61.025 | 35.038 | 74.862 |
| 2016-03-205:59:04 PM | 39.65 | 60.912 | 35.038 | 74.862 |
| 2016-03-205:59:08 PM | 39.65 | 60.8 | 35.038 | 74.862 |
| 2016-03-205:59:12 PM | 39.65 | 60.8 | 35.038 | 74.862 |
| 2016-03-205:59:16 PM | 39.65 | 60.688 | 35.038 | 74.862 |
| 2016-03-205:59:20 PM | 39.65 | 60.575 | 35.038 | 74.862 |
| 2016-03-205:59:24 PM | 39.65 | 60.462 | 35.038 | 74.862 |
| 2016-03-205:59:28 PM | 39.65 | 60.35 | 34.925 | 74.862 |
| 2016-03-205:59:32 PM | 39.65 | 60.35 | 35.038 | 74.862 |
| 2016-03-205:59:36 PM | 39.65 | 60.238 | 34.925 | 74.862 |
| 2016-03-205:59:40 PM | 39.65 | 60.125 | 35.038 | 74.862 |
| 2016-03-205:59:48 PM | 39.538 | 60.125 | 35.038 | 74.862 |
| 2016-03-205:59:52 PM | 39.65 | 60.012 | 34.925 | 74.862 |
| 2016-03-205:59:56 PM | 39.538 | 59.9 | 34.925 | 74.862 |
| 2016-03-206:00:00 PM | 39.538 | 59.788 | 34.925 | 74.862 |